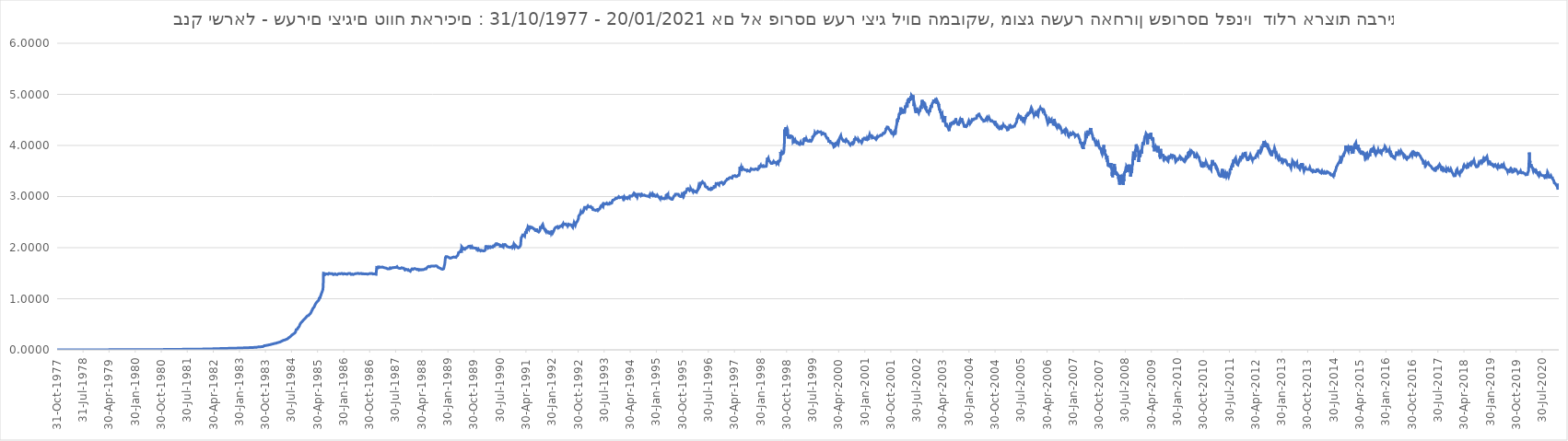
| Category | בנק ישראל - שערים יציגים |
|---|---|
| 1977-10-31 | 0.002 |
| 1977-11-01 | 0.002 |
| 1977-11-02 | 0.002 |
| 1977-11-03 | 0.002 |
| 1977-11-04 | 0.002 |
| 1977-11-07 | 0.002 |
| 1977-11-08 | 0.002 |
| 1977-11-09 | 0.002 |
| 1977-11-10 | 0.002 |
| 1977-11-11 | 0.002 |
| 1977-11-14 | 0.002 |
| 1977-11-15 | 0.002 |
| 1977-11-16 | 0.002 |
| 1977-11-17 | 0.002 |
| 1977-11-18 | 0.002 |
| 1977-11-21 | 0.002 |
| 1977-11-22 | 0.002 |
| 1977-11-23 | 0.002 |
| 1977-11-24 | 0.002 |
| 1977-11-25 | 0.002 |
| 1977-11-28 | 0.002 |
| 1977-11-29 | 0.002 |
| 1977-11-30 | 0.002 |
| 1977-12-01 | 0.002 |
| 1977-12-02 | 0.002 |
| 1977-12-05 | 0.002 |
| 1977-12-06 | 0.002 |
| 1977-12-07 | 0.002 |
| 1977-12-08 | 0.002 |
| 1977-12-09 | 0.002 |
| 1977-12-12 | 0.002 |
| 1977-12-13 | 0.002 |
| 1977-12-14 | 0.002 |
| 1977-12-15 | 0.002 |
| 1977-12-16 | 0.002 |
| 1977-12-19 | 0.002 |
| 1977-12-20 | 0.002 |
| 1977-12-21 | 0.002 |
| 1977-12-22 | 0.002 |
| 1977-12-23 | 0.002 |
| 1977-12-27 | 0.002 |
| 1977-12-28 | 0.002 |
| 1977-12-29 | 0.002 |
| 1977-12-30 | 0.002 |
| 1978-01-03 | 0.002 |
| 1978-01-04 | 0.002 |
| 1978-01-05 | 0.002 |
| 1978-01-06 | 0.002 |
| 1978-01-09 | 0.002 |
| 1978-01-10 | 0.002 |
| 1978-01-11 | 0.002 |
| 1978-01-12 | 0.002 |
| 1978-01-13 | 0.002 |
| 1978-01-16 | 0.002 |
| 1978-01-17 | 0.002 |
| 1978-01-18 | 0.002 |
| 1978-01-19 | 0.002 |
| 1978-01-20 | 0.002 |
| 1978-01-23 | 0.002 |
| 1978-01-24 | 0.002 |
| 1978-01-25 | 0.002 |
| 1978-01-26 | 0.002 |
| 1978-01-27 | 0.002 |
| 1978-01-30 | 0.002 |
| 1978-01-31 | 0.002 |
| 1978-02-01 | 0.002 |
| 1978-02-02 | 0.002 |
| 1978-02-03 | 0.002 |
| 1978-02-06 | 0.002 |
| 1978-02-07 | 0.002 |
| 1978-02-08 | 0.002 |
| 1978-02-09 | 0.002 |
| 1978-02-10 | 0.002 |
| 1978-02-14 | 0.002 |
| 1978-02-15 | 0.002 |
| 1978-02-16 | 0.002 |
| 1978-02-17 | 0.002 |
| 1978-02-20 | 0.002 |
| 1978-02-21 | 0.002 |
| 1978-02-22 | 0.002 |
| 1978-02-23 | 0.002 |
| 1978-02-24 | 0.002 |
| 1978-02-27 | 0.002 |
| 1978-02-28 | 0.002 |
| 1978-03-01 | 0.002 |
| 1978-03-02 | 0.002 |
| 1978-03-03 | 0.002 |
| 1978-03-06 | 0.002 |
| 1978-03-07 | 0.002 |
| 1978-03-09 | 0.002 |
| 1978-03-10 | 0.002 |
| 1978-03-13 | 0.002 |
| 1978-03-14 | 0.002 |
| 1978-03-15 | 0.002 |
| 1978-03-16 | 0.002 |
| 1978-03-17 | 0.002 |
| 1978-03-20 | 0.002 |
| 1978-03-21 | 0.002 |
| 1978-03-22 | 0.002 |
| 1978-03-23 | 0.002 |
| 1978-03-27 | 0.002 |
| 1978-03-28 | 0.002 |
| 1978-03-29 | 0.002 |
| 1978-03-30 | 0.002 |
| 1978-03-31 | 0.002 |
| 1978-04-03 | 0.002 |
| 1978-04-04 | 0.002 |
| 1978-04-05 | 0.002 |
| 1978-04-06 | 0.002 |
| 1978-04-07 | 0.002 |
| 1978-04-10 | 0.002 |
| 1978-04-11 | 0.002 |
| 1978-04-12 | 0.002 |
| 1978-04-13 | 0.002 |
| 1978-04-14 | 0.002 |
| 1978-04-17 | 0.002 |
| 1978-04-18 | 0.002 |
| 1978-04-19 | 0.002 |
| 1978-04-20 | 0.002 |
| 1978-04-21 | 0.002 |
| 1978-04-24 | 0.002 |
| 1978-04-25 | 0.002 |
| 1978-04-26 | 0.002 |
| 1978-04-27 | 0.002 |
| 1978-05-01 | 0.002 |
| 1978-05-02 | 0.002 |
| 1978-05-03 | 0.002 |
| 1978-05-04 | 0.002 |
| 1978-05-05 | 0.002 |
| 1978-05-08 | 0.002 |
| 1978-05-09 | 0.002 |
| 1978-05-10 | 0.002 |
| 1978-05-12 | 0.002 |
| 1978-05-15 | 0.002 |
| 1978-05-16 | 0.002 |
| 1978-05-17 | 0.002 |
| 1978-05-18 | 0.002 |
| 1978-05-19 | 0.002 |
| 1978-05-22 | 0.002 |
| 1978-05-23 | 0.002 |
| 1978-05-24 | 0.002 |
| 1978-05-25 | 0.002 |
| 1978-05-26 | 0.002 |
| 1978-05-29 | 0.002 |
| 1978-05-30 | 0.002 |
| 1978-05-31 | 0.002 |
| 1978-06-01 | 0.002 |
| 1978-06-02 | 0.002 |
| 1978-06-05 | 0.002 |
| 1978-06-06 | 0.002 |
| 1978-06-07 | 0.002 |
| 1978-06-08 | 0.002 |
| 1978-06-09 | 0.002 |
| 1978-06-12 | 0.002 |
| 1978-06-13 | 0.002 |
| 1978-06-14 | 0.002 |
| 1978-06-15 | 0.002 |
| 1978-06-16 | 0.002 |
| 1978-06-19 | 0.002 |
| 1978-06-20 | 0.002 |
| 1978-06-21 | 0.002 |
| 1978-06-22 | 0.002 |
| 1978-06-23 | 0.002 |
| 1978-06-26 | 0.002 |
| 1978-06-27 | 0.002 |
| 1978-06-28 | 0.002 |
| 1978-06-29 | 0.002 |
| 1978-06-30 | 0.002 |
| 1978-07-03 | 0.002 |
| 1978-07-04 | 0.002 |
| 1978-07-05 | 0.002 |
| 1978-07-06 | 0.002 |
| 1978-07-07 | 0.002 |
| 1978-07-10 | 0.002 |
| 1978-07-11 | 0.002 |
| 1978-07-12 | 0.002 |
| 1978-07-13 | 0.002 |
| 1978-07-14 | 0.002 |
| 1978-07-17 | 0.002 |
| 1978-07-18 | 0.002 |
| 1978-07-19 | 0.002 |
| 1978-07-20 | 0.002 |
| 1978-07-21 | 0.002 |
| 1978-07-24 | 0.002 |
| 1978-07-25 | 0.002 |
| 1978-07-26 | 0.002 |
| 1978-07-27 | 0.002 |
| 1978-07-28 | 0.002 |
| 1978-07-31 | 0.002 |
| 1978-08-01 | 0.002 |
| 1978-08-02 | 0.002 |
| 1978-08-03 | 0.002 |
| 1978-08-04 | 0.002 |
| 1978-08-07 | 0.002 |
| 1978-08-08 | 0.002 |
| 1978-08-09 | 0.002 |
| 1978-08-10 | 0.002 |
| 1978-08-11 | 0.002 |
| 1978-08-14 | 0.002 |
| 1978-08-15 | 0.002 |
| 1978-08-16 | 0.002 |
| 1978-08-17 | 0.002 |
| 1978-08-18 | 0.002 |
| 1978-08-21 | 0.002 |
| 1978-08-22 | 0.002 |
| 1978-08-23 | 0.002 |
| 1978-08-24 | 0.002 |
| 1978-08-25 | 0.002 |
| 1978-08-28 | 0.002 |
| 1978-08-29 | 0.002 |
| 1978-08-30 | 0.002 |
| 1978-08-31 | 0.002 |
| 1978-09-01 | 0.002 |
| 1978-09-04 | 0.002 |
| 1978-09-05 | 0.002 |
| 1978-09-06 | 0.002 |
| 1978-09-07 | 0.002 |
| 1978-09-08 | 0.002 |
| 1978-09-11 | 0.002 |
| 1978-09-12 | 0.002 |
| 1978-09-13 | 0.002 |
| 1978-09-14 | 0.002 |
| 1978-09-15 | 0.002 |
| 1978-09-18 | 0.002 |
| 1978-09-19 | 0.002 |
| 1978-09-20 | 0.002 |
| 1978-09-21 | 0.002 |
| 1978-09-22 | 0.002 |
| 1978-09-25 | 0.002 |
| 1978-09-26 | 0.002 |
| 1978-09-27 | 0.002 |
| 1978-09-28 | 0.002 |
| 1978-09-29 | 0.002 |
| 1978-10-04 | 0.002 |
| 1978-10-05 | 0.002 |
| 1978-10-06 | 0.002 |
| 1978-10-10 | 0.002 |
| 1978-10-12 | 0.002 |
| 1978-10-13 | 0.002 |
| 1978-10-17 | 0.002 |
| 1978-10-18 | 0.002 |
| 1978-10-19 | 0.002 |
| 1978-10-20 | 0.002 |
| 1978-10-24 | 0.002 |
| 1978-10-25 | 0.002 |
| 1978-10-26 | 0.002 |
| 1978-10-27 | 0.002 |
| 1978-10-30 | 0.002 |
| 1978-10-31 | 0.002 |
| 1978-11-01 | 0.002 |
| 1978-11-02 | 0.002 |
| 1978-11-03 | 0.002 |
| 1978-11-06 | 0.002 |
| 1978-11-08 | 0.002 |
| 1978-11-09 | 0.002 |
| 1978-11-10 | 0.002 |
| 1978-11-13 | 0.002 |
| 1978-11-14 | 0.002 |
| 1978-11-15 | 0.002 |
| 1978-11-16 | 0.002 |
| 1978-11-17 | 0.002 |
| 1978-11-20 | 0.002 |
| 1978-11-21 | 0.002 |
| 1978-11-22 | 0.002 |
| 1978-11-24 | 0.002 |
| 1978-11-27 | 0.002 |
| 1978-11-28 | 0.002 |
| 1978-11-29 | 0.002 |
| 1978-11-30 | 0.002 |
| 1978-12-01 | 0.002 |
| 1978-12-04 | 0.002 |
| 1978-12-05 | 0.002 |
| 1978-12-06 | 0.002 |
| 1978-12-07 | 0.002 |
| 1978-12-08 | 0.002 |
| 1978-12-11 | 0.002 |
| 1978-12-12 | 0.002 |
| 1978-12-13 | 0.002 |
| 1978-12-14 | 0.002 |
| 1978-12-15 | 0.002 |
| 1978-12-18 | 0.002 |
| 1978-12-19 | 0.002 |
| 1978-12-20 | 0.002 |
| 1978-12-21 | 0.002 |
| 1978-12-22 | 0.002 |
| 1978-12-26 | 0.002 |
| 1978-12-27 | 0.002 |
| 1978-12-28 | 0.002 |
| 1978-12-29 | 0.002 |
| 1979-01-02 | 0.002 |
| 1979-01-03 | 0.002 |
| 1979-01-04 | 0.002 |
| 1979-01-05 | 0.002 |
| 1979-01-08 | 0.002 |
| 1979-01-09 | 0.002 |
| 1979-01-10 | 0.002 |
| 1979-01-11 | 0.002 |
| 1979-01-12 | 0.002 |
| 1979-01-15 | 0.002 |
| 1979-01-16 | 0.002 |
| 1979-01-17 | 0.002 |
| 1979-01-18 | 0.002 |
| 1979-01-19 | 0.002 |
| 1979-01-22 | 0.002 |
| 1979-01-23 | 0.002 |
| 1979-01-24 | 0.002 |
| 1979-01-25 | 0.002 |
| 1979-01-26 | 0.002 |
| 1979-01-29 | 0.002 |
| 1979-01-30 | 0.002 |
| 1979-01-31 | 0.002 |
| 1979-02-01 | 0.002 |
| 1979-02-02 | 0.002 |
| 1979-02-05 | 0.002 |
| 1979-02-06 | 0.002 |
| 1979-02-07 | 0.002 |
| 1979-02-08 | 0.002 |
| 1979-02-09 | 0.002 |
| 1979-02-12 | 0.002 |
| 1979-02-13 | 0.002 |
| 1979-02-14 | 0.002 |
| 1979-02-15 | 0.002 |
| 1979-02-16 | 0.002 |
| 1979-02-19 | 0.002 |
| 1979-02-20 | 0.002 |
| 1979-02-21 | 0.002 |
| 1979-02-22 | 0.002 |
| 1979-02-23 | 0.002 |
| 1979-02-26 | 0.002 |
| 1979-02-27 | 0.002 |
| 1979-02-28 | 0.002 |
| 1979-03-01 | 0.002 |
| 1979-03-02 | 0.002 |
| 1979-03-05 | 0.002 |
| 1979-03-06 | 0.002 |
| 1979-03-07 | 0.002 |
| 1979-03-08 | 0.002 |
| 1979-03-09 | 0.002 |
| 1979-03-12 | 0.002 |
| 1979-03-13 | 0.002 |
| 1979-03-15 | 0.002 |
| 1979-03-16 | 0.002 |
| 1979-03-19 | 0.002 |
| 1979-03-20 | 0.002 |
| 1979-03-21 | 0.002 |
| 1979-03-22 | 0.002 |
| 1979-03-23 | 0.002 |
| 1979-03-26 | 0.002 |
| 1979-03-27 | 0.002 |
| 1979-03-28 | 0.002 |
| 1979-03-29 | 0.002 |
| 1979-03-30 | 0.002 |
| 1979-04-02 | 0.002 |
| 1979-04-03 | 0.002 |
| 1979-04-04 | 0.002 |
| 1979-04-05 | 0.002 |
| 1979-04-06 | 0.002 |
| 1979-04-09 | 0.002 |
| 1979-04-10 | 0.002 |
| 1979-04-11 | 0.002 |
| 1979-04-13 | 0.002 |
| 1979-04-16 | 0.002 |
| 1979-04-17 | 0.002 |
| 1979-04-19 | 0.002 |
| 1979-04-20 | 0.002 |
| 1979-04-23 | 0.002 |
| 1979-04-24 | 0.002 |
| 1979-04-25 | 0.002 |
| 1979-04-26 | 0.002 |
| 1979-04-27 | 0.002 |
| 1979-04-30 | 0.002 |
| 1979-05-01 | 0.002 |
| 1979-05-03 | 0.002 |
| 1979-05-04 | 0.002 |
| 1979-05-07 | 0.002 |
| 1979-05-08 | 0.002 |
| 1979-05-09 | 0.002 |
| 1979-05-10 | 0.002 |
| 1979-05-11 | 0.002 |
| 1979-05-14 | 0.002 |
| 1979-05-15 | 0.002 |
| 1979-05-16 | 0.002 |
| 1979-05-17 | 0.002 |
| 1979-05-18 | 0.002 |
| 1979-05-21 | 0.002 |
| 1979-05-22 | 0.002 |
| 1979-05-23 | 0.002 |
| 1979-05-24 | 0.002 |
| 1979-05-25 | 0.002 |
| 1979-05-28 | 0.002 |
| 1979-05-29 | 0.002 |
| 1979-05-30 | 0.002 |
| 1979-05-31 | 0.002 |
| 1979-06-04 | 0.002 |
| 1979-06-05 | 0.002 |
| 1979-06-06 | 0.002 |
| 1979-06-07 | 0.002 |
| 1979-06-08 | 0.002 |
| 1979-06-11 | 0.002 |
| 1979-06-12 | 0.002 |
| 1979-06-13 | 0.002 |
| 1979-06-14 | 0.002 |
| 1979-06-15 | 0.002 |
| 1979-06-18 | 0.002 |
| 1979-06-19 | 0.002 |
| 1979-06-20 | 0.002 |
| 1979-06-21 | 0.002 |
| 1979-06-22 | 0.002 |
| 1979-06-25 | 0.002 |
| 1979-06-26 | 0.002 |
| 1979-06-27 | 0.002 |
| 1979-06-28 | 0.002 |
| 1979-06-29 | 0.002 |
| 1979-07-02 | 0.002 |
| 1979-07-03 | 0.002 |
| 1979-07-04 | 0.002 |
| 1979-07-05 | 0.002 |
| 1979-07-06 | 0.002 |
| 1979-07-09 | 0.002 |
| 1979-07-10 | 0.002 |
| 1979-07-11 | 0.003 |
| 1979-07-12 | 0.003 |
| 1979-07-13 | 0.003 |
| 1979-07-16 | 0.003 |
| 1979-07-17 | 0.003 |
| 1979-07-18 | 0.003 |
| 1979-07-19 | 0.003 |
| 1979-07-20 | 0.003 |
| 1979-07-23 | 0.003 |
| 1979-07-24 | 0.003 |
| 1979-07-25 | 0.003 |
| 1979-07-26 | 0.003 |
| 1979-07-27 | 0.003 |
| 1979-07-30 | 0.003 |
| 1979-07-31 | 0.003 |
| 1979-08-01 | 0.003 |
| 1979-08-03 | 0.003 |
| 1979-08-06 | 0.003 |
| 1979-08-07 | 0.003 |
| 1979-08-08 | 0.003 |
| 1979-08-09 | 0.003 |
| 1979-08-10 | 0.003 |
| 1979-08-13 | 0.003 |
| 1979-08-14 | 0.003 |
| 1979-08-15 | 0.003 |
| 1979-08-16 | 0.003 |
| 1979-08-17 | 0.003 |
| 1979-08-20 | 0.003 |
| 1979-08-21 | 0.003 |
| 1979-08-22 | 0.003 |
| 1979-08-23 | 0.003 |
| 1979-08-24 | 0.003 |
| 1979-08-27 | 0.003 |
| 1979-08-28 | 0.003 |
| 1979-08-29 | 0.003 |
| 1979-08-30 | 0.003 |
| 1979-08-31 | 0.003 |
| 1979-09-03 | 0.003 |
| 1979-09-04 | 0.003 |
| 1979-09-05 | 0.003 |
| 1979-09-06 | 0.003 |
| 1979-09-07 | 0.003 |
| 1979-09-10 | 0.003 |
| 1979-09-11 | 0.003 |
| 1979-09-12 | 0.003 |
| 1979-09-13 | 0.003 |
| 1979-09-14 | 0.003 |
| 1979-09-17 | 0.003 |
| 1979-09-18 | 0.003 |
| 1979-09-19 | 0.003 |
| 1979-09-20 | 0.003 |
| 1979-09-21 | 0.003 |
| 1979-09-24 | 0.003 |
| 1979-09-25 | 0.003 |
| 1979-09-26 | 0.003 |
| 1979-09-27 | 0.003 |
| 1979-09-28 | 0.003 |
| 1979-10-02 | 0.003 |
| 1979-10-03 | 0.003 |
| 1979-10-04 | 0.003 |
| 1979-10-05 | 0.003 |
| 1979-10-08 | 0.003 |
| 1979-10-09 | 0.003 |
| 1979-10-10 | 0.003 |
| 1979-10-11 | 0.003 |
| 1979-10-12 | 0.003 |
| 1979-10-15 | 0.003 |
| 1979-10-16 | 0.003 |
| 1979-10-17 | 0.003 |
| 1979-10-18 | 0.003 |
| 1979-10-19 | 0.003 |
| 1979-10-22 | 0.003 |
| 1979-10-23 | 0.003 |
| 1979-10-24 | 0.003 |
| 1979-10-25 | 0.003 |
| 1979-10-26 | 0.003 |
| 1979-10-29 | 0.003 |
| 1979-10-30 | 0.003 |
| 1979-10-31 | 0.003 |
| 1979-11-01 | 0.003 |
| 1979-11-02 | 0.003 |
| 1979-11-05 | 0.003 |
| 1979-11-06 | 0.003 |
| 1979-11-07 | 0.003 |
| 1979-11-08 | 0.003 |
| 1979-11-09 | 0.003 |
| 1979-11-12 | 0.003 |
| 1979-11-13 | 0.003 |
| 1979-11-14 | 0.003 |
| 1979-11-15 | 0.003 |
| 1979-11-16 | 0.003 |
| 1979-11-19 | 0.003 |
| 1979-11-20 | 0.003 |
| 1979-11-21 | 0.003 |
| 1979-11-22 | 0.003 |
| 1979-11-23 | 0.003 |
| 1979-11-26 | 0.003 |
| 1979-11-27 | 0.003 |
| 1979-11-28 | 0.003 |
| 1979-11-29 | 0.003 |
| 1979-11-30 | 0.003 |
| 1979-12-03 | 0.003 |
| 1979-12-04 | 0.003 |
| 1979-12-05 | 0.003 |
| 1979-12-06 | 0.003 |
| 1979-12-07 | 0.003 |
| 1979-12-10 | 0.003 |
| 1979-12-11 | 0.003 |
| 1979-12-12 | 0.003 |
| 1979-12-13 | 0.003 |
| 1979-12-14 | 0.003 |
| 1979-12-17 | 0.003 |
| 1979-12-18 | 0.003 |
| 1979-12-19 | 0.003 |
| 1979-12-20 | 0.003 |
| 1979-12-21 | 0.003 |
| 1979-12-24 | 0.004 |
| 1979-12-26 | 0.004 |
| 1979-12-27 | 0.004 |
| 1979-12-28 | 0.004 |
| 1979-12-31 | 0.004 |
| 1980-01-02 | 0.004 |
| 1980-01-03 | 0.004 |
| 1980-01-04 | 0.004 |
| 1980-01-07 | 0.004 |
| 1980-01-08 | 0.004 |
| 1980-01-09 | 0.004 |
| 1980-01-10 | 0.004 |
| 1980-01-11 | 0.004 |
| 1980-01-14 | 0.004 |
| 1980-01-15 | 0.004 |
| 1980-01-16 | 0.004 |
| 1980-01-17 | 0.004 |
| 1980-01-18 | 0.004 |
| 1980-01-21 | 0.004 |
| 1980-01-22 | 0.004 |
| 1980-01-23 | 0.004 |
| 1980-01-24 | 0.004 |
| 1980-01-25 | 0.004 |
| 1980-01-28 | 0.004 |
| 1980-01-29 | 0.004 |
| 1980-01-30 | 0.004 |
| 1980-01-31 | 0.004 |
| 1980-02-01 | 0.004 |
| 1980-02-04 | 0.004 |
| 1980-02-05 | 0.004 |
| 1980-02-06 | 0.004 |
| 1980-02-07 | 0.004 |
| 1980-02-08 | 0.004 |
| 1980-02-11 | 0.004 |
| 1980-02-12 | 0.004 |
| 1980-02-13 | 0.004 |
| 1980-02-14 | 0.004 |
| 1980-02-15 | 0.004 |
| 1980-02-18 | 0.004 |
| 1980-02-19 | 0.004 |
| 1980-02-20 | 0.004 |
| 1980-02-21 | 0.004 |
| 1980-02-22 | 0.004 |
| 1980-02-25 | 0.004 |
| 1980-02-26 | 0.004 |
| 1980-02-27 | 0.004 |
| 1980-02-28 | 0.004 |
| 1980-02-29 | 0.004 |
| 1980-03-04 | 0.004 |
| 1980-03-05 | 0.004 |
| 1980-03-06 | 0.004 |
| 1980-03-07 | 0.004 |
| 1980-03-10 | 0.004 |
| 1980-03-11 | 0.004 |
| 1980-03-12 | 0.004 |
| 1980-03-13 | 0.004 |
| 1980-03-14 | 0.004 |
| 1980-03-17 | 0.004 |
| 1980-03-18 | 0.004 |
| 1980-03-19 | 0.004 |
| 1980-03-20 | 0.004 |
| 1980-03-21 | 0.004 |
| 1980-03-24 | 0.004 |
| 1980-03-25 | 0.004 |
| 1980-03-26 | 0.004 |
| 1980-03-27 | 0.004 |
| 1980-03-28 | 0.004 |
| 1980-03-31 | 0.004 |
| 1980-04-02 | 0.004 |
| 1980-04-03 | 0.004 |
| 1980-04-04 | 0.004 |
| 1980-04-08 | 0.004 |
| 1980-04-09 | 0.004 |
| 1980-04-10 | 0.004 |
| 1980-04-11 | 0.004 |
| 1980-04-14 | 0.004 |
| 1980-04-15 | 0.004 |
| 1980-04-16 | 0.004 |
| 1980-04-17 | 0.004 |
| 1980-04-18 | 0.004 |
| 1980-04-22 | 0.004 |
| 1980-04-23 | 0.004 |
| 1980-04-24 | 0.004 |
| 1980-04-25 | 0.004 |
| 1980-04-28 | 0.004 |
| 1980-04-29 | 0.004 |
| 1980-04-30 | 0.004 |
| 1980-05-01 | 0.004 |
| 1980-05-02 | 0.004 |
| 1980-05-05 | 0.004 |
| 1980-05-06 | 0.004 |
| 1980-05-07 | 0.004 |
| 1980-05-08 | 0.004 |
| 1980-05-09 | 0.004 |
| 1980-05-12 | 0.004 |
| 1980-05-13 | 0.004 |
| 1980-05-14 | 0.004 |
| 1980-05-15 | 0.004 |
| 1980-05-16 | 0.004 |
| 1980-05-19 | 0.005 |
| 1980-05-20 | 0.004 |
| 1980-05-22 | 0.004 |
| 1980-05-23 | 0.005 |
| 1980-05-26 | 0.005 |
| 1980-05-27 | 0.005 |
| 1980-05-28 | 0.005 |
| 1980-05-29 | 0.005 |
| 1980-05-30 | 0.005 |
| 1980-06-02 | 0.005 |
| 1980-06-03 | 0.005 |
| 1980-06-04 | 0.005 |
| 1980-06-05 | 0.005 |
| 1980-06-06 | 0.005 |
| 1980-06-09 | 0.005 |
| 1980-06-10 | 0.005 |
| 1980-06-11 | 0.005 |
| 1980-06-12 | 0.005 |
| 1980-06-13 | 0.005 |
| 1980-06-16 | 0.005 |
| 1980-06-17 | 0.005 |
| 1980-06-18 | 0.005 |
| 1980-06-19 | 0.005 |
| 1980-06-20 | 0.005 |
| 1980-06-23 | 0.005 |
| 1980-06-24 | 0.005 |
| 1980-06-25 | 0.005 |
| 1980-06-26 | 0.005 |
| 1980-06-27 | 0.005 |
| 1980-06-30 | 0.005 |
| 1980-07-01 | 0.005 |
| 1980-07-02 | 0.005 |
| 1980-07-03 | 0.005 |
| 1980-07-04 | 0.005 |
| 1980-07-07 | 0.005 |
| 1980-07-08 | 0.005 |
| 1980-07-09 | 0.005 |
| 1980-07-10 | 0.005 |
| 1980-07-11 | 0.005 |
| 1980-07-14 | 0.005 |
| 1980-07-15 | 0.005 |
| 1980-07-16 | 0.005 |
| 1980-07-17 | 0.005 |
| 1980-07-18 | 0.005 |
| 1980-07-21 | 0.005 |
| 1980-07-23 | 0.005 |
| 1980-07-24 | 0.005 |
| 1980-07-25 | 0.005 |
| 1980-07-28 | 0.005 |
| 1980-07-29 | 0.005 |
| 1980-07-30 | 0.005 |
| 1980-07-31 | 0.005 |
| 1980-08-01 | 0.005 |
| 1980-08-04 | 0.005 |
| 1980-08-05 | 0.005 |
| 1980-08-06 | 0.005 |
| 1980-08-07 | 0.005 |
| 1980-08-08 | 0.005 |
| 1980-08-11 | 0.005 |
| 1980-08-12 | 0.005 |
| 1980-08-13 | 0.005 |
| 1980-08-14 | 0.005 |
| 1980-08-15 | 0.005 |
| 1980-08-18 | 0.005 |
| 1980-08-19 | 0.005 |
| 1980-08-20 | 0.006 |
| 1980-08-21 | 0.006 |
| 1980-08-22 | 0.006 |
| 1980-08-25 | 0.006 |
| 1980-08-26 | 0.006 |
| 1980-08-27 | 0.006 |
| 1980-08-28 | 0.006 |
| 1980-08-29 | 0.006 |
| 1980-09-01 | 0.006 |
| 1980-09-02 | 0.006 |
| 1980-09-03 | 0.006 |
| 1980-09-04 | 0.006 |
| 1980-09-05 | 0.006 |
| 1980-09-08 | 0.006 |
| 1980-09-09 | 0.006 |
| 1980-09-10 | 0.006 |
| 1980-09-15 | 0.006 |
| 1980-09-16 | 0.006 |
| 1980-09-17 | 0.006 |
| 1980-09-18 | 0.006 |
| 1980-09-19 | 0.006 |
| 1980-09-22 | 0.006 |
| 1980-09-23 | 0.006 |
| 1980-09-24 | 0.006 |
| 1980-09-26 | 0.006 |
| 1980-09-29 | 0.006 |
| 1980-10-03 | 0.006 |
| 1980-10-06 | 0.006 |
| 1980-10-07 | 0.006 |
| 1980-10-08 | 0.006 |
| 1980-10-09 | 0.006 |
| 1980-10-10 | 0.006 |
| 1980-10-13 | 0.006 |
| 1980-10-14 | 0.006 |
| 1980-10-15 | 0.006 |
| 1980-10-16 | 0.006 |
| 1980-10-17 | 0.006 |
| 1980-10-20 | 0.006 |
| 1980-10-21 | 0.006 |
| 1980-10-22 | 0.006 |
| 1980-10-23 | 0.006 |
| 1980-10-24 | 0.006 |
| 1980-10-27 | 0.006 |
| 1980-10-28 | 0.006 |
| 1980-10-29 | 0.006 |
| 1980-10-30 | 0.006 |
| 1980-10-31 | 0.006 |
| 1980-11-03 | 0.006 |
| 1980-11-04 | 0.006 |
| 1980-11-05 | 0.006 |
| 1980-11-06 | 0.006 |
| 1980-11-07 | 0.007 |
| 1980-11-10 | 0.007 |
| 1980-11-11 | 0.007 |
| 1980-11-12 | 0.007 |
| 1980-11-13 | 0.007 |
| 1980-11-14 | 0.007 |
| 1980-11-17 | 0.007 |
| 1980-11-18 | 0.007 |
| 1980-11-19 | 0.007 |
| 1980-11-20 | 0.007 |
| 1980-11-21 | 0.007 |
| 1980-11-24 | 0.007 |
| 1980-11-25 | 0.007 |
| 1980-11-26 | 0.007 |
| 1980-11-27 | 0.007 |
| 1980-11-28 | 0.007 |
| 1980-12-01 | 0.007 |
| 1980-12-02 | 0.007 |
| 1980-12-03 | 0.007 |
| 1980-12-04 | 0.007 |
| 1980-12-05 | 0.007 |
| 1980-12-08 | 0.007 |
| 1980-12-09 | 0.007 |
| 1980-12-10 | 0.007 |
| 1980-12-11 | 0.007 |
| 1980-12-12 | 0.007 |
| 1980-12-15 | 0.007 |
| 1980-12-16 | 0.008 |
| 1980-12-17 | 0.008 |
| 1980-12-18 | 0.008 |
| 1980-12-19 | 0.008 |
| 1980-12-22 | 0.008 |
| 1980-12-23 | 0.008 |
| 1980-12-24 | 0.008 |
| 1980-12-26 | 0.008 |
| 1980-12-29 | 0.008 |
| 1980-12-30 | 0.008 |
| 1980-12-31 | 0.008 |
| 1981-01-02 | 0.008 |
| 1981-01-05 | 0.008 |
| 1981-01-06 | 0.008 |
| 1981-01-07 | 0.008 |
| 1981-01-08 | 0.008 |
| 1981-01-09 | 0.008 |
| 1981-01-12 | 0.008 |
| 1981-01-13 | 0.008 |
| 1981-01-14 | 0.008 |
| 1981-01-15 | 0.008 |
| 1981-01-16 | 0.008 |
| 1981-01-19 | 0.008 |
| 1981-01-20 | 0.008 |
| 1981-01-21 | 0.008 |
| 1981-01-22 | 0.008 |
| 1981-01-23 | 0.008 |
| 1981-01-26 | 0.008 |
| 1981-01-27 | 0.008 |
| 1981-01-28 | 0.008 |
| 1981-01-29 | 0.008 |
| 1981-01-30 | 0.008 |
| 1981-02-02 | 0.008 |
| 1981-02-03 | 0.008 |
| 1981-02-04 | 0.008 |
| 1981-02-05 | 0.008 |
| 1981-02-06 | 0.008 |
| 1981-02-09 | 0.008 |
| 1981-02-10 | 0.008 |
| 1981-02-11 | 0.008 |
| 1981-02-12 | 0.008 |
| 1981-02-13 | 0.008 |
| 1981-02-16 | 0.008 |
| 1981-02-17 | 0.009 |
| 1981-02-18 | 0.009 |
| 1981-02-19 | 0.009 |
| 1981-02-20 | 0.009 |
| 1981-02-23 | 0.009 |
| 1981-02-24 | 0.009 |
| 1981-02-25 | 0.009 |
| 1981-02-26 | 0.009 |
| 1981-02-27 | 0.009 |
| 1981-03-02 | 0.009 |
| 1981-03-03 | 0.009 |
| 1981-03-04 | 0.009 |
| 1981-03-05 | 0.009 |
| 1981-03-06 | 0.009 |
| 1981-03-09 | 0.009 |
| 1981-03-10 | 0.009 |
| 1981-03-11 | 0.009 |
| 1981-03-12 | 0.009 |
| 1981-03-13 | 0.009 |
| 1981-03-16 | 0.009 |
| 1981-03-17 | 0.009 |
| 1981-03-18 | 0.009 |
| 1981-03-19 | 0.009 |
| 1981-03-23 | 0.009 |
| 1981-03-24 | 0.009 |
| 1981-03-25 | 0.009 |
| 1981-03-26 | 0.009 |
| 1981-03-27 | 0.009 |
| 1981-03-30 | 0.009 |
| 1981-03-31 | 0.009 |
| 1981-04-01 | 0.009 |
| 1981-04-02 | 0.009 |
| 1981-04-03 | 0.009 |
| 1981-04-06 | 0.009 |
| 1981-04-07 | 0.009 |
| 1981-04-08 | 0.009 |
| 1981-04-09 | 0.009 |
| 1981-04-10 | 0.009 |
| 1981-04-13 | 0.009 |
| 1981-04-14 | 0.009 |
| 1981-04-15 | 0.009 |
| 1981-04-16 | 0.009 |
| 1981-04-17 | 0.009 |
| 1981-04-20 | 0.009 |
| 1981-04-21 | 0.009 |
| 1981-04-22 | 0.009 |
| 1981-04-23 | 0.009 |
| 1981-04-24 | 0.009 |
| 1981-04-27 | 0.01 |
| 1981-04-28 | 0.009 |
| 1981-04-29 | 0.01 |
| 1981-04-30 | 0.01 |
| 1981-05-01 | 0.01 |
| 1981-05-04 | 0.01 |
| 1981-05-05 | 0.01 |
| 1981-05-06 | 0.01 |
| 1981-05-08 | 0.01 |
| 1981-05-11 | 0.01 |
| 1981-05-12 | 0.01 |
| 1981-05-13 | 0.01 |
| 1981-05-14 | 0.01 |
| 1981-05-15 | 0.01 |
| 1981-05-18 | 0.01 |
| 1981-05-19 | 0.01 |
| 1981-05-20 | 0.01 |
| 1981-05-21 | 0.01 |
| 1981-05-22 | 0.01 |
| 1981-05-25 | 0.011 |
| 1981-05-26 | 0.011 |
| 1981-05-27 | 0.011 |
| 1981-05-28 | 0.011 |
| 1981-05-29 | 0.011 |
| 1981-06-01 | 0.011 |
| 1981-06-02 | 0.011 |
| 1981-06-03 | 0.011 |
| 1981-06-04 | 0.011 |
| 1981-06-05 | 0.011 |
| 1981-06-09 | 0.011 |
| 1981-06-10 | 0.011 |
| 1981-06-11 | 0.011 |
| 1981-06-12 | 0.011 |
| 1981-06-15 | 0.012 |
| 1981-06-16 | 0.012 |
| 1981-06-17 | 0.012 |
| 1981-06-18 | 0.012 |
| 1981-06-19 | 0.012 |
| 1981-06-22 | 0.012 |
| 1981-06-23 | 0.012 |
| 1981-06-24 | 0.012 |
| 1981-06-25 | 0.012 |
| 1981-06-26 | 0.012 |
| 1981-06-29 | 0.012 |
| 1981-07-01 | 0.012 |
| 1981-07-02 | 0.012 |
| 1981-07-03 | 0.012 |
| 1981-07-06 | 0.012 |
| 1981-07-07 | 0.012 |
| 1981-07-08 | 0.012 |
| 1981-07-09 | 0.012 |
| 1981-07-10 | 0.012 |
| 1981-07-13 | 0.012 |
| 1981-07-14 | 0.012 |
| 1981-07-15 | 0.012 |
| 1981-07-16 | 0.012 |
| 1981-07-17 | 0.012 |
| 1981-07-20 | 0.012 |
| 1981-07-21 | 0.012 |
| 1981-07-22 | 0.012 |
| 1981-07-23 | 0.012 |
| 1981-07-24 | 0.012 |
| 1981-07-27 | 0.012 |
| 1981-07-28 | 0.012 |
| 1981-07-29 | 0.012 |
| 1981-07-30 | 0.012 |
| 1981-07-31 | 0.012 |
| 1981-08-03 | 0.012 |
| 1981-08-04 | 0.012 |
| 1981-08-05 | 0.012 |
| 1981-08-06 | 0.012 |
| 1981-08-07 | 0.012 |
| 1981-08-10 | 0.012 |
| 1981-08-11 | 0.012 |
| 1981-08-12 | 0.012 |
| 1981-08-13 | 0.012 |
| 1981-08-14 | 0.012 |
| 1981-08-17 | 0.012 |
| 1981-08-18 | 0.013 |
| 1981-08-19 | 0.013 |
| 1981-08-20 | 0.013 |
| 1981-08-21 | 0.013 |
| 1981-08-24 | 0.012 |
| 1981-08-25 | 0.013 |
| 1981-08-26 | 0.013 |
| 1981-08-27 | 0.013 |
| 1981-08-28 | 0.013 |
| 1981-08-31 | 0.013 |
| 1981-09-01 | 0.013 |
| 1981-09-02 | 0.013 |
| 1981-09-03 | 0.013 |
| 1981-09-04 | 0.013 |
| 1981-09-07 | 0.013 |
| 1981-09-08 | 0.013 |
| 1981-09-09 | 0.013 |
| 1981-09-10 | 0.013 |
| 1981-09-11 | 0.013 |
| 1981-09-14 | 0.013 |
| 1981-09-15 | 0.013 |
| 1981-09-16 | 0.013 |
| 1981-09-17 | 0.013 |
| 1981-09-18 | 0.013 |
| 1981-09-21 | 0.013 |
| 1981-09-22 | 0.013 |
| 1981-09-23 | 0.013 |
| 1981-09-24 | 0.013 |
| 1981-09-25 | 0.013 |
| 1981-09-28 | 0.013 |
| 1981-10-01 | 0.014 |
| 1981-10-02 | 0.014 |
| 1981-10-05 | 0.014 |
| 1981-10-06 | 0.014 |
| 1981-10-07 | 0.014 |
| 1981-10-09 | 0.014 |
| 1981-10-12 | 0.014 |
| 1981-10-14 | 0.014 |
| 1981-10-15 | 0.014 |
| 1981-10-16 | 0.014 |
| 1981-10-19 | 0.014 |
| 1981-10-21 | 0.014 |
| 1981-10-22 | 0.014 |
| 1981-10-23 | 0.014 |
| 1981-10-26 | 0.014 |
| 1981-10-28 | 0.014 |
| 1981-10-29 | 0.014 |
| 1981-10-30 | 0.014 |
| 1981-11-02 | 0.014 |
| 1981-11-03 | 0.014 |
| 1981-11-04 | 0.014 |
| 1981-11-05 | 0.014 |
| 1981-11-06 | 0.014 |
| 1981-11-09 | 0.014 |
| 1981-11-10 | 0.014 |
| 1981-11-11 | 0.014 |
| 1981-11-12 | 0.014 |
| 1981-11-13 | 0.014 |
| 1981-11-16 | 0.014 |
| 1981-11-17 | 0.014 |
| 1981-11-18 | 0.015 |
| 1981-11-19 | 0.015 |
| 1981-11-20 | 0.015 |
| 1981-11-23 | 0.015 |
| 1981-11-24 | 0.015 |
| 1981-11-25 | 0.015 |
| 1981-11-26 | 0.015 |
| 1981-11-27 | 0.015 |
| 1981-11-30 | 0.015 |
| 1981-12-01 | 0.015 |
| 1981-12-02 | 0.015 |
| 1981-12-03 | 0.015 |
| 1981-12-04 | 0.015 |
| 1981-12-07 | 0.015 |
| 1981-12-08 | 0.015 |
| 1981-12-09 | 0.015 |
| 1981-12-10 | 0.015 |
| 1981-12-11 | 0.015 |
| 1981-12-14 | 0.015 |
| 1981-12-15 | 0.015 |
| 1981-12-16 | 0.015 |
| 1981-12-17 | 0.015 |
| 1981-12-18 | 0.015 |
| 1981-12-21 | 0.016 |
| 1981-12-22 | 0.016 |
| 1981-12-23 | 0.016 |
| 1981-12-24 | 0.016 |
| 1981-12-28 | 0.016 |
| 1981-12-29 | 0.016 |
| 1981-12-30 | 0.016 |
| 1981-12-31 | 0.016 |
| 1982-01-04 | 0.016 |
| 1982-01-05 | 0.016 |
| 1982-01-06 | 0.016 |
| 1982-01-07 | 0.016 |
| 1982-01-08 | 0.016 |
| 1982-01-11 | 0.016 |
| 1982-01-12 | 0.016 |
| 1982-01-13 | 0.016 |
| 1982-01-14 | 0.016 |
| 1982-01-15 | 0.016 |
| 1982-01-18 | 0.016 |
| 1982-01-19 | 0.016 |
| 1982-01-20 | 0.016 |
| 1982-01-21 | 0.016 |
| 1982-01-22 | 0.016 |
| 1982-01-25 | 0.016 |
| 1982-01-26 | 0.017 |
| 1982-01-27 | 0.017 |
| 1982-01-28 | 0.017 |
| 1982-01-29 | 0.017 |
| 1982-02-01 | 0.017 |
| 1982-02-02 | 0.017 |
| 1982-02-03 | 0.017 |
| 1982-02-04 | 0.017 |
| 1982-02-05 | 0.017 |
| 1982-02-08 | 0.017 |
| 1982-02-09 | 0.017 |
| 1982-02-10 | 0.017 |
| 1982-02-11 | 0.017 |
| 1982-02-12 | 0.017 |
| 1982-02-15 | 0.018 |
| 1982-02-16 | 0.018 |
| 1982-02-17 | 0.018 |
| 1982-02-18 | 0.018 |
| 1982-02-19 | 0.018 |
| 1982-02-22 | 0.018 |
| 1982-02-23 | 0.018 |
| 1982-02-24 | 0.018 |
| 1982-02-25 | 0.018 |
| 1982-02-26 | 0.018 |
| 1982-03-01 | 0.018 |
| 1982-03-02 | 0.018 |
| 1982-03-03 | 0.018 |
| 1982-03-04 | 0.018 |
| 1982-03-05 | 0.018 |
| 1982-03-08 | 0.018 |
| 1982-03-11 | 0.018 |
| 1982-03-12 | 0.019 |
| 1982-03-15 | 0.019 |
| 1982-03-16 | 0.019 |
| 1982-03-17 | 0.019 |
| 1982-03-18 | 0.019 |
| 1982-03-19 | 0.019 |
| 1982-03-22 | 0.019 |
| 1982-03-23 | 0.019 |
| 1982-03-24 | 0.019 |
| 1982-03-25 | 0.019 |
| 1982-03-26 | 0.019 |
| 1982-03-29 | 0.019 |
| 1982-03-30 | 0.019 |
| 1982-03-31 | 0.019 |
| 1982-04-01 | 0.019 |
| 1982-04-02 | 0.019 |
| 1982-04-05 | 0.019 |
| 1982-04-06 | 0.02 |
| 1982-04-07 | 0.02 |
| 1982-04-09 | 0.02 |
| 1982-04-12 | 0.02 |
| 1982-04-13 | 0.02 |
| 1982-04-15 | 0.02 |
| 1982-04-16 | 0.02 |
| 1982-04-19 | 0.02 |
| 1982-04-20 | 0.02 |
| 1982-04-21 | 0.02 |
| 1982-04-22 | 0.02 |
| 1982-04-23 | 0.02 |
| 1982-04-26 | 0.02 |
| 1982-04-27 | 0.02 |
| 1982-04-29 | 0.02 |
| 1982-04-30 | 0.02 |
| 1982-05-03 | 0.02 |
| 1982-05-04 | 0.021 |
| 1982-05-05 | 0.021 |
| 1982-05-06 | 0.021 |
| 1982-05-07 | 0.021 |
| 1982-05-10 | 0.021 |
| 1982-05-11 | 0.021 |
| 1982-05-12 | 0.021 |
| 1982-05-13 | 0.021 |
| 1982-05-14 | 0.021 |
| 1982-05-17 | 0.021 |
| 1982-05-18 | 0.021 |
| 1982-05-19 | 0.021 |
| 1982-05-20 | 0.022 |
| 1982-05-21 | 0.022 |
| 1982-05-24 | 0.022 |
| 1982-05-25 | 0.022 |
| 1982-05-26 | 0.022 |
| 1982-05-27 | 0.022 |
| 1982-05-31 | 0.022 |
| 1982-06-01 | 0.022 |
| 1982-06-02 | 0.022 |
| 1982-06-03 | 0.022 |
| 1982-06-04 | 0.022 |
| 1982-06-07 | 0.022 |
| 1982-06-08 | 0.022 |
| 1982-06-09 | 0.022 |
| 1982-06-10 | 0.022 |
| 1982-06-11 | 0.022 |
| 1982-06-14 | 0.023 |
| 1982-06-15 | 0.023 |
| 1982-06-16 | 0.023 |
| 1982-06-17 | 0.023 |
| 1982-06-18 | 0.024 |
| 1982-06-21 | 0.024 |
| 1982-06-22 | 0.024 |
| 1982-06-23 | 0.024 |
| 1982-06-24 | 0.024 |
| 1982-06-25 | 0.024 |
| 1982-06-28 | 0.024 |
| 1982-06-29 | 0.024 |
| 1982-06-30 | 0.024 |
| 1982-07-01 | 0.024 |
| 1982-07-02 | 0.024 |
| 1982-07-05 | 0.024 |
| 1982-07-06 | 0.025 |
| 1982-07-07 | 0.025 |
| 1982-07-08 | 0.025 |
| 1982-07-09 | 0.025 |
| 1982-07-12 | 0.025 |
| 1982-07-13 | 0.025 |
| 1982-07-14 | 0.025 |
| 1982-07-15 | 0.025 |
| 1982-07-16 | 0.025 |
| 1982-07-19 | 0.026 |
| 1982-07-20 | 0.025 |
| 1982-07-21 | 0.025 |
| 1982-07-22 | 0.025 |
| 1982-07-23 | 0.025 |
| 1982-07-26 | 0.025 |
| 1982-07-27 | 0.026 |
| 1982-07-28 | 0.026 |
| 1982-07-30 | 0.026 |
| 1982-08-02 | 0.026 |
| 1982-08-03 | 0.026 |
| 1982-08-04 | 0.026 |
| 1982-08-05 | 0.027 |
| 1982-08-06 | 0.027 |
| 1982-08-09 | 0.027 |
| 1982-08-10 | 0.027 |
| 1982-08-11 | 0.027 |
| 1982-08-12 | 0.027 |
| 1982-08-13 | 0.027 |
| 1982-08-16 | 0.027 |
| 1982-08-17 | 0.027 |
| 1982-08-18 | 0.027 |
| 1982-08-19 | 0.027 |
| 1982-08-20 | 0.027 |
| 1982-08-23 | 0.027 |
| 1982-08-24 | 0.027 |
| 1982-08-25 | 0.027 |
| 1982-08-26 | 0.027 |
| 1982-08-27 | 0.027 |
| 1982-08-30 | 0.027 |
| 1982-08-31 | 0.027 |
| 1982-09-01 | 0.028 |
| 1982-09-02 | 0.028 |
| 1982-09-03 | 0.028 |
| 1982-09-06 | 0.028 |
| 1982-09-07 | 0.029 |
| 1982-09-08 | 0.029 |
| 1982-09-09 | 0.029 |
| 1982-09-10 | 0.029 |
| 1982-09-13 | 0.029 |
| 1982-09-14 | 0.029 |
| 1982-09-15 | 0.029 |
| 1982-09-16 | 0.029 |
| 1982-09-17 | 0.029 |
| 1982-09-20 | 0.029 |
| 1982-09-21 | 0.029 |
| 1982-09-22 | 0.029 |
| 1982-09-23 | 0.029 |
| 1982-09-24 | 0.029 |
| 1982-09-28 | 0.029 |
| 1982-09-29 | 0.029 |
| 1982-09-30 | 0.029 |
| 1982-10-01 | 0.029 |
| 1982-10-04 | 0.029 |
| 1982-10-05 | 0.029 |
| 1982-10-06 | 0.029 |
| 1982-10-07 | 0.029 |
| 1982-10-08 | 0.029 |
| 1982-10-11 | 0.029 |
| 1982-10-12 | 0.03 |
| 1982-10-13 | 0.03 |
| 1982-10-14 | 0.03 |
| 1982-10-15 | 0.03 |
| 1982-10-18 | 0.03 |
| 1982-10-19 | 0.03 |
| 1982-10-20 | 0.03 |
| 1982-10-21 | 0.03 |
| 1982-10-22 | 0.03 |
| 1982-10-25 | 0.03 |
| 1982-10-26 | 0.03 |
| 1982-10-27 | 0.03 |
| 1982-10-28 | 0.03 |
| 1982-10-29 | 0.03 |
| 1982-11-01 | 0.031 |
| 1982-11-02 | 0.031 |
| 1982-11-03 | 0.031 |
| 1982-11-04 | 0.031 |
| 1982-11-05 | 0.031 |
| 1982-11-08 | 0.031 |
| 1982-11-09 | 0.031 |
| 1982-11-10 | 0.031 |
| 1982-11-11 | 0.031 |
| 1982-11-12 | 0.031 |
| 1982-11-15 | 0.031 |
| 1982-11-16 | 0.031 |
| 1982-11-17 | 0.031 |
| 1982-11-18 | 0.031 |
| 1982-11-19 | 0.031 |
| 1982-11-22 | 0.031 |
| 1982-11-23 | 0.032 |
| 1982-11-24 | 0.032 |
| 1982-11-25 | 0.032 |
| 1982-11-26 | 0.032 |
| 1982-11-29 | 0.032 |
| 1982-11-30 | 0.032 |
| 1982-12-01 | 0.032 |
| 1982-12-02 | 0.032 |
| 1982-12-03 | 0.032 |
| 1982-12-06 | 0.032 |
| 1982-12-07 | 0.032 |
| 1982-12-08 | 0.032 |
| 1982-12-09 | 0.032 |
| 1982-12-10 | 0.033 |
| 1982-12-13 | 0.033 |
| 1982-12-14 | 0.033 |
| 1982-12-15 | 0.033 |
| 1982-12-16 | 0.033 |
| 1982-12-17 | 0.033 |
| 1982-12-20 | 0.033 |
| 1982-12-21 | 0.033 |
| 1982-12-22 | 0.033 |
| 1982-12-23 | 0.033 |
| 1982-12-24 | 0.033 |
| 1982-12-27 | 0.033 |
| 1982-12-28 | 0.033 |
| 1982-12-29 | 0.033 |
| 1982-12-30 | 0.033 |
| 1982-12-31 | 0.034 |
| 1983-01-03 | 0.034 |
| 1983-01-04 | 0.034 |
| 1983-01-05 | 0.034 |
| 1983-01-06 | 0.034 |
| 1983-01-07 | 0.034 |
| 1983-01-10 | 0.034 |
| 1983-01-11 | 0.034 |
| 1983-01-12 | 0.034 |
| 1983-01-13 | 0.034 |
| 1983-01-14 | 0.035 |
| 1983-01-17 | 0.035 |
| 1983-01-18 | 0.035 |
| 1983-01-19 | 0.035 |
| 1983-01-20 | 0.035 |
| 1983-01-21 | 0.035 |
| 1983-01-24 | 0.035 |
| 1983-01-25 | 0.035 |
| 1983-01-26 | 0.035 |
| 1983-01-27 | 0.036 |
| 1983-01-28 | 0.036 |
| 1983-01-31 | 0.036 |
| 1983-02-01 | 0.036 |
| 1983-02-02 | 0.036 |
| 1983-02-03 | 0.036 |
| 1983-02-04 | 0.036 |
| 1983-02-07 | 0.036 |
| 1983-02-08 | 0.036 |
| 1983-02-09 | 0.037 |
| 1983-02-10 | 0.037 |
| 1983-02-11 | 0.037 |
| 1983-02-14 | 0.037 |
| 1983-02-15 | 0.037 |
| 1983-02-16 | 0.037 |
| 1983-02-17 | 0.037 |
| 1983-02-18 | 0.037 |
| 1983-02-21 | 0.037 |
| 1983-02-22 | 0.037 |
| 1983-02-23 | 0.037 |
| 1983-02-24 | 0.038 |
| 1983-02-25 | 0.038 |
| 1983-03-01 | 0.038 |
| 1983-03-02 | 0.038 |
| 1983-03-03 | 0.038 |
| 1983-03-04 | 0.038 |
| 1983-03-07 | 0.038 |
| 1983-03-08 | 0.038 |
| 1983-03-09 | 0.038 |
| 1983-03-10 | 0.038 |
| 1983-03-11 | 0.038 |
| 1983-03-14 | 0.038 |
| 1983-03-15 | 0.038 |
| 1983-03-16 | 0.039 |
| 1983-03-17 | 0.039 |
| 1983-03-18 | 0.039 |
| 1983-03-21 | 0.039 |
| 1983-03-22 | 0.039 |
| 1983-03-23 | 0.039 |
| 1983-03-24 | 0.039 |
| 1983-03-25 | 0.04 |
| 1983-03-28 | 0.04 |
| 1983-03-30 | 0.04 |
| 1983-03-31 | 0.04 |
| 1983-04-01 | 0.04 |
| 1983-04-05 | 0.04 |
| 1983-04-06 | 0.04 |
| 1983-04-07 | 0.04 |
| 1983-04-08 | 0.04 |
| 1983-04-11 | 0.04 |
| 1983-04-12 | 0.041 |
| 1983-04-13 | 0.041 |
| 1983-04-14 | 0.041 |
| 1983-04-15 | 0.041 |
| 1983-04-19 | 0.041 |
| 1983-04-20 | 0.041 |
| 1983-04-21 | 0.041 |
| 1983-04-22 | 0.041 |
| 1983-04-25 | 0.041 |
| 1983-04-26 | 0.042 |
| 1983-04-27 | 0.042 |
| 1983-04-28 | 0.042 |
| 1983-04-29 | 0.042 |
| 1983-05-02 | 0.042 |
| 1983-05-03 | 0.042 |
| 1983-05-04 | 0.042 |
| 1983-05-05 | 0.042 |
| 1983-05-06 | 0.042 |
| 1983-05-09 | 0.043 |
| 1983-05-10 | 0.043 |
| 1983-05-11 | 0.043 |
| 1983-05-12 | 0.043 |
| 1983-05-13 | 0.043 |
| 1983-05-16 | 0.043 |
| 1983-05-17 | 0.044 |
| 1983-05-19 | 0.044 |
| 1983-05-20 | 0.044 |
| 1983-05-23 | 0.044 |
| 1983-05-24 | 0.044 |
| 1983-05-25 | 0.044 |
| 1983-05-26 | 0.044 |
| 1983-05-27 | 0.044 |
| 1983-05-30 | 0.045 |
| 1983-05-31 | 0.045 |
| 1983-06-01 | 0.045 |
| 1983-06-02 | 0.045 |
| 1983-06-03 | 0.045 |
| 1983-06-06 | 0.045 |
| 1983-06-07 | 0.045 |
| 1983-06-08 | 0.045 |
| 1983-06-09 | 0.045 |
| 1983-06-10 | 0.045 |
| 1983-06-13 | 0.046 |
| 1983-06-14 | 0.046 |
| 1983-06-15 | 0.046 |
| 1983-06-16 | 0.046 |
| 1983-06-17 | 0.046 |
| 1983-06-20 | 0.046 |
| 1983-06-21 | 0.046 |
| 1983-06-22 | 0.047 |
| 1983-06-23 | 0.047 |
| 1983-06-24 | 0.047 |
| 1983-06-27 | 0.047 |
| 1983-06-28 | 0.047 |
| 1983-06-29 | 0.047 |
| 1983-06-30 | 0.048 |
| 1983-07-01 | 0.048 |
| 1983-07-04 | 0.048 |
| 1983-07-05 | 0.048 |
| 1983-07-06 | 0.048 |
| 1983-07-07 | 0.048 |
| 1983-07-08 | 0.048 |
| 1983-07-11 | 0.049 |
| 1983-07-12 | 0.049 |
| 1983-07-13 | 0.049 |
| 1983-07-14 | 0.05 |
| 1983-07-15 | 0.05 |
| 1983-07-18 | 0.05 |
| 1983-07-20 | 0.05 |
| 1983-07-21 | 0.05 |
| 1983-07-22 | 0.05 |
| 1983-07-25 | 0.05 |
| 1983-07-26 | 0.05 |
| 1983-07-27 | 0.051 |
| 1983-07-28 | 0.051 |
| 1983-07-29 | 0.051 |
| 1983-08-01 | 0.051 |
| 1983-08-02 | 0.052 |
| 1983-08-03 | 0.052 |
| 1983-08-04 | 0.052 |
| 1983-08-05 | 0.052 |
| 1983-08-08 | 0.053 |
| 1983-08-09 | 0.053 |
| 1983-08-10 | 0.057 |
| 1983-08-11 | 0.057 |
| 1983-08-12 | 0.057 |
| 1983-08-15 | 0.057 |
| 1983-08-16 | 0.058 |
| 1983-08-17 | 0.057 |
| 1983-08-18 | 0.058 |
| 1983-08-19 | 0.058 |
| 1983-08-22 | 0.058 |
| 1983-08-23 | 0.058 |
| 1983-08-24 | 0.058 |
| 1983-08-25 | 0.058 |
| 1983-08-26 | 0.058 |
| 1983-08-29 | 0.058 |
| 1983-08-30 | 0.059 |
| 1983-08-31 | 0.059 |
| 1983-09-01 | 0.059 |
| 1983-09-02 | 0.059 |
| 1983-09-05 | 0.059 |
| 1983-09-06 | 0.06 |
| 1983-09-07 | 0.06 |
| 1983-09-12 | 0.06 |
| 1983-09-13 | 0.061 |
| 1983-09-14 | 0.061 |
| 1983-09-15 | 0.061 |
| 1983-09-16 | 0.061 |
| 1983-09-19 | 0.062 |
| 1983-09-20 | 0.062 |
| 1983-09-21 | 0.062 |
| 1983-09-23 | 0.062 |
| 1983-09-26 | 0.063 |
| 1983-09-27 | 0.063 |
| 1983-09-28 | 0.064 |
| 1983-09-30 | 0.064 |
| 1983-10-03 | 0.064 |
| 1983-10-04 | 0.065 |
| 1983-10-05 | 0.065 |
| 1983-10-06 | 0.065 |
| 1983-10-07 | 0.066 |
| 1983-10-10 | 0.069 |
| 1983-10-11 | 0.081 |
| 1983-10-12 | 0.081 |
| 1983-10-13 | 0.081 |
| 1983-10-14 | 0.081 |
| 1983-10-17 | 0.082 |
| 1983-10-18 | 0.082 |
| 1983-10-19 | 0.082 |
| 1983-10-20 | 0.082 |
| 1983-10-21 | 0.082 |
| 1983-10-24 | 0.082 |
| 1983-10-26 | 0.082 |
| 1983-10-27 | 0.083 |
| 1983-10-28 | 0.083 |
| 1983-10-31 | 0.084 |
| 1983-11-01 | 0.084 |
| 1983-11-02 | 0.085 |
| 1983-11-03 | 0.086 |
| 1983-11-04 | 0.086 |
| 1983-11-07 | 0.087 |
| 1983-11-08 | 0.087 |
| 1983-11-09 | 0.087 |
| 1983-11-10 | 0.088 |
| 1983-11-11 | 0.088 |
| 1983-11-14 | 0.088 |
| 1983-11-15 | 0.089 |
| 1983-11-16 | 0.09 |
| 1983-11-17 | 0.09 |
| 1983-11-18 | 0.091 |
| 1983-11-21 | 0.091 |
| 1983-11-22 | 0.091 |
| 1983-11-23 | 0.092 |
| 1983-11-24 | 0.092 |
| 1983-11-25 | 0.093 |
| 1983-11-28 | 0.094 |
| 1983-11-29 | 0.095 |
| 1983-11-30 | 0.096 |
| 1983-12-01 | 0.096 |
| 1983-12-02 | 0.097 |
| 1983-12-05 | 0.097 |
| 1983-12-06 | 0.098 |
| 1983-12-07 | 0.098 |
| 1983-12-08 | 0.098 |
| 1983-12-09 | 0.098 |
| 1983-12-12 | 0.1 |
| 1983-12-13 | 0.1 |
| 1983-12-14 | 0.1 |
| 1983-12-15 | 0.1 |
| 1983-12-16 | 0.101 |
| 1983-12-19 | 0.102 |
| 1983-12-20 | 0.102 |
| 1983-12-21 | 0.103 |
| 1983-12-22 | 0.104 |
| 1983-12-23 | 0.105 |
| 1983-12-27 | 0.106 |
| 1983-12-28 | 0.107 |
| 1983-12-29 | 0.108 |
| 1983-12-30 | 0.108 |
| 1984-01-02 | 0.109 |
| 1984-01-03 | 0.11 |
| 1984-01-04 | 0.111 |
| 1984-01-05 | 0.111 |
| 1984-01-06 | 0.112 |
| 1984-01-09 | 0.112 |
| 1984-01-10 | 0.113 |
| 1984-01-11 | 0.114 |
| 1984-01-12 | 0.114 |
| 1984-01-13 | 0.114 |
| 1984-01-16 | 0.116 |
| 1984-01-17 | 0.116 |
| 1984-01-18 | 0.117 |
| 1984-01-19 | 0.117 |
| 1984-01-20 | 0.118 |
| 1984-01-23 | 0.119 |
| 1984-01-24 | 0.12 |
| 1984-01-25 | 0.121 |
| 1984-01-26 | 0.122 |
| 1984-01-27 | 0.123 |
| 1984-01-30 | 0.124 |
| 1984-01-31 | 0.124 |
| 1984-02-01 | 0.124 |
| 1984-02-02 | 0.124 |
| 1984-02-03 | 0.124 |
| 1984-02-06 | 0.125 |
| 1984-02-07 | 0.126 |
| 1984-02-08 | 0.127 |
| 1984-02-09 | 0.127 |
| 1984-02-10 | 0.128 |
| 1984-02-13 | 0.129 |
| 1984-02-14 | 0.129 |
| 1984-02-15 | 0.129 |
| 1984-02-16 | 0.13 |
| 1984-02-17 | 0.131 |
| 1984-02-20 | 0.131 |
| 1984-02-21 | 0.132 |
| 1984-02-22 | 0.132 |
| 1984-02-23 | 0.133 |
| 1984-02-24 | 0.134 |
| 1984-02-27 | 0.136 |
| 1984-02-28 | 0.136 |
| 1984-02-29 | 0.137 |
| 1984-03-01 | 0.138 |
| 1984-03-02 | 0.139 |
| 1984-03-05 | 0.141 |
| 1984-03-06 | 0.141 |
| 1984-03-07 | 0.142 |
| 1984-03-08 | 0.142 |
| 1984-03-09 | 0.144 |
| 1984-03-12 | 0.144 |
| 1984-03-13 | 0.145 |
| 1984-03-14 | 0.146 |
| 1984-03-15 | 0.146 |
| 1984-03-16 | 0.147 |
| 1984-03-20 | 0.148 |
| 1984-03-21 | 0.148 |
| 1984-03-22 | 0.149 |
| 1984-03-23 | 0.15 |
| 1984-03-26 | 0.151 |
| 1984-03-27 | 0.151 |
| 1984-03-28 | 0.152 |
| 1984-03-29 | 0.153 |
| 1984-03-30 | 0.153 |
| 1984-04-02 | 0.155 |
| 1984-04-03 | 0.156 |
| 1984-04-04 | 0.158 |
| 1984-04-05 | 0.158 |
| 1984-04-06 | 0.16 |
| 1984-04-09 | 0.162 |
| 1984-04-10 | 0.164 |
| 1984-04-11 | 0.165 |
| 1984-04-12 | 0.166 |
| 1984-04-13 | 0.167 |
| 1984-04-16 | 0.17 |
| 1984-04-18 | 0.171 |
| 1984-04-19 | 0.172 |
| 1984-04-20 | 0.173 |
| 1984-04-24 | 0.176 |
| 1984-04-25 | 0.177 |
| 1984-04-26 | 0.178 |
| 1984-04-27 | 0.18 |
| 1984-04-30 | 0.181 |
| 1984-05-01 | 0.181 |
| 1984-05-02 | 0.183 |
| 1984-05-03 | 0.184 |
| 1984-05-04 | 0.186 |
| 1984-05-08 | 0.187 |
| 1984-05-09 | 0.188 |
| 1984-05-10 | 0.19 |
| 1984-05-11 | 0.189 |
| 1984-05-14 | 0.191 |
| 1984-05-15 | 0.192 |
| 1984-05-16 | 0.192 |
| 1984-05-17 | 0.192 |
| 1984-05-18 | 0.193 |
| 1984-05-21 | 0.194 |
| 1984-05-22 | 0.195 |
| 1984-05-23 | 0.196 |
| 1984-05-24 | 0.196 |
| 1984-05-25 | 0.197 |
| 1984-05-28 | 0.199 |
| 1984-05-29 | 0.2 |
| 1984-05-30 | 0.201 |
| 1984-05-31 | 0.202 |
| 1984-06-01 | 0.203 |
| 1984-06-04 | 0.205 |
| 1984-06-05 | 0.206 |
| 1984-06-07 | 0.207 |
| 1984-06-08 | 0.209 |
| 1984-06-11 | 0.21 |
| 1984-06-12 | 0.211 |
| 1984-06-13 | 0.212 |
| 1984-06-14 | 0.212 |
| 1984-06-15 | 0.213 |
| 1984-06-18 | 0.216 |
| 1984-06-19 | 0.217 |
| 1984-06-20 | 0.218 |
| 1984-06-21 | 0.22 |
| 1984-06-22 | 0.222 |
| 1984-06-25 | 0.228 |
| 1984-06-26 | 0.23 |
| 1984-06-27 | 0.232 |
| 1984-06-28 | 0.234 |
| 1984-06-29 | 0.236 |
| 1984-07-02 | 0.239 |
| 1984-07-03 | 0.241 |
| 1984-07-04 | 0.242 |
| 1984-07-05 | 0.243 |
| 1984-07-06 | 0.246 |
| 1984-07-09 | 0.249 |
| 1984-07-10 | 0.25 |
| 1984-07-11 | 0.25 |
| 1984-07-12 | 0.252 |
| 1984-07-13 | 0.254 |
| 1984-07-16 | 0.256 |
| 1984-07-17 | 0.259 |
| 1984-07-18 | 0.261 |
| 1984-07-19 | 0.263 |
| 1984-07-20 | 0.266 |
| 1984-07-25 | 0.27 |
| 1984-07-26 | 0.273 |
| 1984-07-27 | 0.277 |
| 1984-07-30 | 0.28 |
| 1984-07-31 | 0.283 |
| 1984-08-01 | 0.286 |
| 1984-08-02 | 0.288 |
| 1984-08-03 | 0.292 |
| 1984-08-06 | 0.291 |
| 1984-08-08 | 0.293 |
| 1984-08-09 | 0.296 |
| 1984-08-10 | 0.299 |
| 1984-08-13 | 0.301 |
| 1984-08-14 | 0.303 |
| 1984-08-15 | 0.305 |
| 1984-08-16 | 0.306 |
| 1984-08-17 | 0.307 |
| 1984-08-20 | 0.31 |
| 1984-08-21 | 0.312 |
| 1984-08-22 | 0.315 |
| 1984-08-23 | 0.317 |
| 1984-08-24 | 0.318 |
| 1984-08-27 | 0.32 |
| 1984-08-28 | 0.321 |
| 1984-08-29 | 0.323 |
| 1984-08-30 | 0.324 |
| 1984-08-31 | 0.328 |
| 1984-09-03 | 0.331 |
| 1984-09-04 | 0.335 |
| 1984-09-05 | 0.338 |
| 1984-09-06 | 0.341 |
| 1984-09-07 | 0.347 |
| 1984-09-10 | 0.351 |
| 1984-09-11 | 0.354 |
| 1984-09-12 | 0.354 |
| 1984-09-13 | 0.357 |
| 1984-09-14 | 0.364 |
| 1984-09-17 | 0.396 |
| 1984-09-18 | 0.394 |
| 1984-09-19 | 0.392 |
| 1984-09-20 | 0.394 |
| 1984-09-21 | 0.398 |
| 1984-09-24 | 0.397 |
| 1984-09-25 | 0.401 |
| 1984-09-26 | 0.401 |
| 1984-10-01 | 0.409 |
| 1984-10-02 | 0.413 |
| 1984-10-03 | 0.419 |
| 1984-10-04 | 0.426 |
| 1984-10-05 | 0.429 |
| 1984-10-08 | 0.434 |
| 1984-10-09 | 0.435 |
| 1984-10-10 | 0.435 |
| 1984-10-12 | 0.438 |
| 1984-10-15 | 0.447 |
| 1984-10-16 | 0.451 |
| 1984-10-17 | 0.456 |
| 1984-10-19 | 0.464 |
| 1984-10-22 | 0.472 |
| 1984-10-23 | 0.48 |
| 1984-10-24 | 0.487 |
| 1984-10-25 | 0.492 |
| 1984-10-26 | 0.501 |
| 1984-10-29 | 0.503 |
| 1984-10-30 | 0.508 |
| 1984-10-31 | 0.514 |
| 1984-11-01 | 0.518 |
| 1984-11-02 | 0.527 |
| 1984-11-05 | 0.529 |
| 1984-11-06 | 0.53 |
| 1984-11-07 | 0.532 |
| 1984-11-08 | 0.533 |
| 1984-11-09 | 0.536 |
| 1984-11-12 | 0.539 |
| 1984-11-13 | 0.54 |
| 1984-11-14 | 0.544 |
| 1984-11-15 | 0.546 |
| 1984-11-16 | 0.55 |
| 1984-11-19 | 0.553 |
| 1984-11-20 | 0.554 |
| 1984-11-21 | 0.559 |
| 1984-11-22 | 0.563 |
| 1984-11-23 | 0.567 |
| 1984-11-26 | 0.57 |
| 1984-11-27 | 0.573 |
| 1984-11-28 | 0.577 |
| 1984-11-29 | 0.58 |
| 1984-11-30 | 0.586 |
| 1984-12-03 | 0.588 |
| 1984-12-04 | 0.59 |
| 1984-12-05 | 0.59 |
| 1984-12-06 | 0.592 |
| 1984-12-07 | 0.596 |
| 1984-12-10 | 0.599 |
| 1984-12-11 | 0.6 |
| 1984-12-12 | 0.602 |
| 1984-12-13 | 0.604 |
| 1984-12-14 | 0.606 |
| 1984-12-17 | 0.609 |
| 1984-12-18 | 0.607 |
| 1984-12-19 | 0.61 |
| 1984-12-20 | 0.612 |
| 1984-12-21 | 0.615 |
| 1984-12-24 | 0.618 |
| 1984-12-26 | 0.621 |
| 1984-12-27 | 0.628 |
| 1984-12-28 | 0.634 |
| 1984-12-31 | 0.639 |
| 1985-01-02 | 0.638 |
| 1985-01-03 | 0.644 |
| 1985-01-04 | 0.648 |
| 1985-01-07 | 0.653 |
| 1985-01-08 | 0.655 |
| 1985-01-09 | 0.659 |
| 1985-01-10 | 0.661 |
| 1985-01-11 | 0.663 |
| 1985-01-14 | 0.666 |
| 1985-01-15 | 0.663 |
| 1985-01-16 | 0.662 |
| 1985-01-17 | 0.662 |
| 1985-01-18 | 0.665 |
| 1985-01-21 | 0.668 |
| 1985-01-22 | 0.669 |
| 1985-01-23 | 0.67 |
| 1985-01-24 | 0.672 |
| 1985-01-25 | 0.674 |
| 1985-01-28 | 0.677 |
| 1985-01-29 | 0.677 |
| 1985-01-30 | 0.678 |
| 1985-01-31 | 0.68 |
| 1985-02-01 | 0.687 |
| 1985-02-04 | 0.695 |
| 1985-02-05 | 0.695 |
| 1985-02-06 | 0.693 |
| 1985-02-07 | 0.695 |
| 1985-02-08 | 0.699 |
| 1985-02-11 | 0.703 |
| 1985-02-12 | 0.704 |
| 1985-02-13 | 0.709 |
| 1985-02-14 | 0.713 |
| 1985-02-15 | 0.712 |
| 1985-02-18 | 0.717 |
| 1985-02-19 | 0.726 |
| 1985-02-20 | 0.73 |
| 1985-02-21 | 0.734 |
| 1985-02-22 | 0.744 |
| 1985-02-25 | 0.755 |
| 1985-02-26 | 0.759 |
| 1985-02-27 | 0.759 |
| 1985-02-28 | 0.765 |
| 1985-03-01 | 0.766 |
| 1985-03-04 | 0.777 |
| 1985-03-05 | 0.783 |
| 1985-03-06 | 0.788 |
| 1985-03-08 | 0.796 |
| 1985-03-11 | 0.799 |
| 1985-03-12 | 0.803 |
| 1985-03-13 | 0.805 |
| 1985-03-14 | 0.81 |
| 1985-03-15 | 0.819 |
| 1985-03-18 | 0.819 |
| 1985-03-19 | 0.821 |
| 1985-03-20 | 0.822 |
| 1985-03-21 | 0.826 |
| 1985-03-22 | 0.829 |
| 1985-03-25 | 0.839 |
| 1985-03-26 | 0.843 |
| 1985-03-27 | 0.845 |
| 1985-03-28 | 0.851 |
| 1985-03-29 | 0.858 |
| 1985-04-01 | 0.864 |
| 1985-04-02 | 0.87 |
| 1985-04-03 | 0.874 |
| 1985-04-04 | 0.881 |
| 1985-04-05 | 0.889 |
| 1985-04-08 | 0.896 |
| 1985-04-09 | 0.902 |
| 1985-04-10 | 0.904 |
| 1985-04-11 | 0.908 |
| 1985-04-15 | 0.918 |
| 1985-04-16 | 0.918 |
| 1985-04-17 | 0.922 |
| 1985-04-18 | 0.927 |
| 1985-04-19 | 0.929 |
| 1985-04-22 | 0.929 |
| 1985-04-23 | 0.933 |
| 1985-04-24 | 0.938 |
| 1985-04-26 | 0.944 |
| 1985-04-29 | 0.949 |
| 1985-04-30 | 0.952 |
| 1985-05-01 | 0.95 |
| 1985-05-02 | 0.947 |
| 1985-05-03 | 0.954 |
| 1985-05-06 | 0.959 |
| 1985-05-07 | 0.958 |
| 1985-05-08 | 0.958 |
| 1985-05-09 | 0.961 |
| 1985-05-10 | 0.964 |
| 1985-05-13 | 0.974 |
| 1985-05-14 | 0.981 |
| 1985-05-15 | 0.98 |
| 1985-05-16 | 0.996 |
| 1985-05-17 | 1.011 |
| 1985-05-20 | 1.012 |
| 1985-05-21 | 1.012 |
| 1985-05-22 | 1.01 |
| 1985-05-23 | 1.01 |
| 1985-05-24 | 1.016 |
| 1985-05-27 | 1.022 |
| 1985-05-28 | 1.039 |
| 1985-05-29 | 1.045 |
| 1985-05-30 | 1.051 |
| 1985-05-31 | 1.055 |
| 1985-06-03 | 1.063 |
| 1985-06-04 | 1.069 |
| 1985-06-05 | 1.072 |
| 1985-06-06 | 1.075 |
| 1985-06-07 | 1.09 |
| 1985-06-10 | 1.098 |
| 1985-06-11 | 1.103 |
| 1985-06-12 | 1.114 |
| 1985-06-13 | 1.123 |
| 1985-06-14 | 1.129 |
| 1985-06-17 | 1.136 |
| 1985-06-18 | 1.142 |
| 1985-06-19 | 1.149 |
| 1985-06-20 | 1.157 |
| 1985-06-21 | 1.17 |
| 1985-06-24 | 1.179 |
| 1985-06-25 | 1.187 |
| 1985-06-26 | 1.207 |
| 1985-06-27 | 1.231 |
| 1985-06-28 | 1.262 |
| 1985-07-01 | 1.5 |
| 1985-07-03 | 1.5 |
| 1985-07-04 | 1.498 |
| 1985-07-05 | 1.498 |
| 1985-07-08 | 1.498 |
| 1985-07-09 | 1.498 |
| 1985-07-10 | 1.498 |
| 1985-07-11 | 1.495 |
| 1985-07-12 | 1.494 |
| 1985-07-15 | 1.488 |
| 1985-07-16 | 1.484 |
| 1985-07-17 | 1.483 |
| 1985-07-18 | 1.472 |
| 1985-07-19 | 1.478 |
| 1985-07-22 | 1.478 |
| 1985-07-23 | 1.471 |
| 1985-07-24 | 1.473 |
| 1985-07-25 | 1.474 |
| 1985-07-26 | 1.476 |
| 1985-07-29 | 1.485 |
| 1985-07-30 | 1.483 |
| 1985-07-31 | 1.476 |
| 1985-08-01 | 1.469 |
| 1985-08-02 | 1.47 |
| 1985-08-05 | 1.47 |
| 1985-08-06 | 1.48 |
| 1985-08-07 | 1.48 |
| 1985-08-08 | 1.485 |
| 1985-08-09 | 1.474 |
| 1985-08-12 | 1.487 |
| 1985-08-13 | 1.489 |
| 1985-08-14 | 1.48 |
| 1985-08-15 | 1.482 |
| 1985-08-16 | 1.478 |
| 1985-08-19 | 1.48 |
| 1985-08-20 | 1.478 |
| 1985-08-21 | 1.49 |
| 1985-08-22 | 1.48 |
| 1985-08-23 | 1.487 |
| 1985-08-26 | 1.493 |
| 1985-08-27 | 1.493 |
| 1985-08-28 | 1.498 |
| 1985-08-29 | 1.486 |
| 1985-08-30 | 1.499 |
| 1985-09-02 | 1.504 |
| 1985-09-03 | 1.506 |
| 1985-09-04 | 1.506 |
| 1985-09-05 | 1.499 |
| 1985-09-06 | 1.495 |
| 1985-09-09 | 1.491 |
| 1985-09-10 | 1.487 |
| 1985-09-11 | 1.482 |
| 1985-09-12 | 1.49 |
| 1985-09-13 | 1.484 |
| 1985-09-18 | 1.492 |
| 1985-09-19 | 1.492 |
| 1985-09-20 | 1.481 |
| 1985-09-23 | 1.479 |
| 1985-09-24 | 1.479 |
| 1985-09-26 | 1.481 |
| 1985-09-27 | 1.485 |
| 1985-10-01 | 1.491 |
| 1985-10-02 | 1.479 |
| 1985-10-03 | 1.479 |
| 1985-10-04 | 1.479 |
| 1985-10-08 | 1.486 |
| 1985-10-09 | 1.476 |
| 1985-10-10 | 1.475 |
| 1985-10-11 | 1.472 |
| 1985-10-14 | 1.473 |
| 1985-10-15 | 1.47 |
| 1985-10-16 | 1.471 |
| 1985-10-17 | 1.483 |
| 1985-10-18 | 1.477 |
| 1985-10-21 | 1.476 |
| 1985-10-22 | 1.476 |
| 1985-10-23 | 1.472 |
| 1985-10-24 | 1.473 |
| 1985-10-25 | 1.486 |
| 1985-10-28 | 1.488 |
| 1985-10-29 | 1.487 |
| 1985-10-30 | 1.48 |
| 1985-10-31 | 1.488 |
| 1985-11-01 | 1.489 |
| 1985-11-04 | 1.481 |
| 1985-11-05 | 1.48 |
| 1985-11-06 | 1.484 |
| 1985-11-07 | 1.479 |
| 1985-11-08 | 1.478 |
| 1985-11-11 | 1.476 |
| 1985-11-12 | 1.473 |
| 1985-11-13 | 1.477 |
| 1985-11-14 | 1.475 |
| 1985-11-15 | 1.473 |
| 1985-11-18 | 1.478 |
| 1985-11-19 | 1.472 |
| 1985-11-20 | 1.471 |
| 1985-11-21 | 1.472 |
| 1985-11-22 | 1.479 |
| 1985-11-25 | 1.479 |
| 1985-11-26 | 1.482 |
| 1985-11-27 | 1.478 |
| 1985-11-28 | 1.477 |
| 1985-11-29 | 1.485 |
| 1985-12-02 | 1.486 |
| 1985-12-03 | 1.488 |
| 1985-12-04 | 1.488 |
| 1985-12-05 | 1.483 |
| 1985-12-06 | 1.483 |
| 1985-12-09 | 1.489 |
| 1985-12-10 | 1.485 |
| 1985-12-11 | 1.484 |
| 1985-12-12 | 1.492 |
| 1985-12-13 | 1.486 |
| 1985-12-16 | 1.483 |
| 1985-12-17 | 1.488 |
| 1985-12-18 | 1.483 |
| 1985-12-19 | 1.48 |
| 1985-12-20 | 1.481 |
| 1985-12-23 | 1.488 |
| 1985-12-24 | 1.482 |
| 1985-12-26 | 1.483 |
| 1985-12-27 | 1.495 |
| 1985-12-30 | 1.493 |
| 1985-12-31 | 1.5 |
| 1986-01-03 | 1.494 |
| 1986-01-06 | 1.5 |
| 1986-01-07 | 1.492 |
| 1986-01-08 | 1.491 |
| 1986-01-09 | 1.49 |
| 1986-01-10 | 1.49 |
| 1986-01-13 | 1.494 |
| 1986-01-14 | 1.488 |
| 1986-01-15 | 1.487 |
| 1986-01-16 | 1.486 |
| 1986-01-17 | 1.485 |
| 1986-01-20 | 1.484 |
| 1986-01-21 | 1.491 |
| 1986-01-22 | 1.486 |
| 1986-01-23 | 1.482 |
| 1986-01-24 | 1.49 |
| 1986-01-27 | 1.492 |
| 1986-01-28 | 1.487 |
| 1986-01-29 | 1.486 |
| 1986-01-30 | 1.483 |
| 1986-01-31 | 1.484 |
| 1986-02-03 | 1.492 |
| 1986-02-04 | 1.485 |
| 1986-02-05 | 1.487 |
| 1986-02-06 | 1.486 |
| 1986-02-07 | 1.485 |
| 1986-02-10 | 1.494 |
| 1986-02-11 | 1.489 |
| 1986-02-12 | 1.483 |
| 1986-02-13 | 1.486 |
| 1986-02-14 | 1.482 |
| 1986-02-17 | 1.481 |
| 1986-02-18 | 1.488 |
| 1986-02-19 | 1.48 |
| 1986-02-20 | 1.475 |
| 1986-02-21 | 1.476 |
| 1986-02-24 | 1.487 |
| 1986-02-25 | 1.479 |
| 1986-02-26 | 1.477 |
| 1986-02-27 | 1.476 |
| 1986-02-28 | 1.477 |
| 1986-03-03 | 1.476 |
| 1986-03-04 | 1.483 |
| 1986-03-05 | 1.481 |
| 1986-03-06 | 1.48 |
| 1986-03-07 | 1.48 |
| 1986-03-10 | 1.481 |
| 1986-03-11 | 1.48 |
| 1986-03-12 | 1.48 |
| 1986-03-13 | 1.479 |
| 1986-03-14 | 1.487 |
| 1986-03-17 | 1.494 |
| 1986-03-18 | 1.492 |
| 1986-03-19 | 1.493 |
| 1986-03-20 | 1.488 |
| 1986-03-21 | 1.488 |
| 1986-03-24 | 1.49 |
| 1986-03-26 | 1.493 |
| 1986-03-27 | 1.497 |
| 1986-03-28 | 1.5 |
| 1986-03-31 | 1.499 |
| 1986-04-01 | 1.492 |
| 1986-04-02 | 1.489 |
| 1986-04-03 | 1.486 |
| 1986-04-04 | 1.494 |
| 1986-04-07 | 1.495 |
| 1986-04-08 | 1.489 |
| 1986-04-09 | 1.484 |
| 1986-04-10 | 1.48 |
| 1986-04-11 | 1.481 |
| 1986-04-14 | 1.482 |
| 1986-04-15 | 1.478 |
| 1986-04-16 | 1.478 |
| 1986-04-17 | 1.476 |
| 1986-04-18 | 1.476 |
| 1986-04-21 | 1.477 |
| 1986-04-22 | 1.474 |
| 1986-04-23 | 1.473 |
| 1986-04-25 | 1.484 |
| 1986-04-28 | 1.484 |
| 1986-04-29 | 1.477 |
| 1986-05-01 | 1.476 |
| 1986-05-02 | 1.478 |
| 1986-05-05 | 1.477 |
| 1986-05-06 | 1.474 |
| 1986-05-07 | 1.475 |
| 1986-05-08 | 1.474 |
| 1986-05-09 | 1.472 |
| 1986-05-12 | 1.473 |
| 1986-05-13 | 1.472 |
| 1986-05-15 | 1.482 |
| 1986-05-16 | 1.475 |
| 1986-05-19 | 1.482 |
| 1986-05-20 | 1.485 |
| 1986-05-21 | 1.478 |
| 1986-05-22 | 1.478 |
| 1986-05-23 | 1.478 |
| 1986-05-26 | 1.478 |
| 1986-05-27 | 1.486 |
| 1986-05-28 | 1.481 |
| 1986-05-29 | 1.489 |
| 1986-05-30 | 1.488 |
| 1986-06-02 | 1.497 |
| 1986-06-03 | 1.491 |
| 1986-06-04 | 1.489 |
| 1986-06-05 | 1.494 |
| 1986-06-06 | 1.493 |
| 1986-06-09 | 1.493 |
| 1986-06-10 | 1.499 |
| 1986-06-11 | 1.496 |
| 1986-06-12 | 1.499 |
| 1986-06-16 | 1.494 |
| 1986-06-17 | 1.499 |
| 1986-06-18 | 1.496 |
| 1986-06-19 | 1.494 |
| 1986-06-20 | 1.492 |
| 1986-06-23 | 1.499 |
| 1986-06-24 | 1.493 |
| 1986-06-25 | 1.496 |
| 1986-06-26 | 1.493 |
| 1986-06-27 | 1.495 |
| 1986-06-30 | 1.499 |
| 1986-07-01 | 1.493 |
| 1986-07-02 | 1.495 |
| 1986-07-03 | 1.497 |
| 1986-07-04 | 1.498 |
| 1986-07-07 | 1.494 |
| 1986-07-08 | 1.493 |
| 1986-07-09 | 1.497 |
| 1986-07-10 | 1.492 |
| 1986-07-11 | 1.496 |
| 1986-07-14 | 1.5 |
| 1986-07-15 | 1.493 |
| 1986-07-16 | 1.492 |
| 1986-07-17 | 1.494 |
| 1986-07-18 | 1.498 |
| 1986-07-21 | 1.493 |
| 1986-07-22 | 1.491 |
| 1986-07-23 | 1.496 |
| 1986-07-24 | 1.491 |
| 1986-07-25 | 1.493 |
| 1986-07-28 | 1.498 |
| 1986-07-29 | 1.493 |
| 1986-07-30 | 1.492 |
| 1986-07-31 | 1.497 |
| 1986-08-01 | 1.492 |
| 1986-08-04 | 1.498 |
| 1986-08-05 | 1.492 |
| 1986-08-06 | 1.491 |
| 1986-08-07 | 1.49 |
| 1986-08-08 | 1.49 |
| 1986-08-11 | 1.487 |
| 1986-08-12 | 1.489 |
| 1986-08-13 | 1.487 |
| 1986-08-15 | 1.493 |
| 1986-08-18 | 1.486 |
| 1986-08-19 | 1.491 |
| 1986-08-20 | 1.491 |
| 1986-08-21 | 1.491 |
| 1986-08-22 | 1.486 |
| 1986-08-25 | 1.492 |
| 1986-08-26 | 1.486 |
| 1986-08-27 | 1.488 |
| 1986-08-28 | 1.486 |
| 1986-08-29 | 1.487 |
| 1986-09-01 | 1.485 |
| 1986-09-02 | 1.492 |
| 1986-09-03 | 1.486 |
| 1986-09-04 | 1.486 |
| 1986-09-05 | 1.485 |
| 1986-09-08 | 1.49 |
| 1986-09-09 | 1.488 |
| 1986-09-10 | 1.489 |
| 1986-09-11 | 1.487 |
| 1986-09-12 | 1.492 |
| 1986-09-15 | 1.487 |
| 1986-09-16 | 1.487 |
| 1986-09-17 | 1.487 |
| 1986-09-18 | 1.482 |
| 1986-09-19 | 1.484 |
| 1986-09-22 | 1.488 |
| 1986-09-23 | 1.487 |
| 1986-09-24 | 1.487 |
| 1986-09-25 | 1.487 |
| 1986-09-26 | 1.487 |
| 1986-09-29 | 1.488 |
| 1986-09-30 | 1.491 |
| 1986-10-01 | 1.484 |
| 1986-10-02 | 1.484 |
| 1986-10-03 | 1.485 |
| 1986-10-06 | 1.485 |
| 1986-10-07 | 1.489 |
| 1986-10-08 | 1.483 |
| 1986-10-09 | 1.483 |
| 1986-10-10 | 1.484 |
| 1986-10-14 | 1.484 |
| 1986-10-15 | 1.481 |
| 1986-10-16 | 1.481 |
| 1986-10-17 | 1.484 |
| 1986-10-20 | 1.48 |
| 1986-10-21 | 1.48 |
| 1986-10-22 | 1.48 |
| 1986-10-23 | 1.484 |
| 1986-10-24 | 1.49 |
| 1986-10-27 | 1.49 |
| 1986-10-28 | 1.492 |
| 1986-10-29 | 1.49 |
| 1986-10-30 | 1.488 |
| 1986-10-31 | 1.495 |
| 1986-11-03 | 1.495 |
| 1986-11-04 | 1.495 |
| 1986-11-05 | 1.497 |
| 1986-11-06 | 1.496 |
| 1986-11-07 | 1.498 |
| 1986-11-10 | 1.496 |
| 1986-11-11 | 1.494 |
| 1986-11-12 | 1.498 |
| 1986-11-13 | 1.492 |
| 1986-11-14 | 1.492 |
| 1986-11-17 | 1.494 |
| 1986-11-18 | 1.491 |
| 1986-11-19 | 1.491 |
| 1986-11-20 | 1.497 |
| 1986-11-21 | 1.496 |
| 1986-11-24 | 1.494 |
| 1986-11-25 | 1.493 |
| 1986-11-26 | 1.491 |
| 1986-11-27 | 1.49 |
| 1986-11-28 | 1.492 |
| 1986-12-01 | 1.485 |
| 1986-12-02 | 1.484 |
| 1986-12-03 | 1.484 |
| 1986-12-04 | 1.484 |
| 1986-12-05 | 1.489 |
| 1986-12-08 | 1.488 |
| 1986-12-09 | 1.492 |
| 1986-12-10 | 1.493 |
| 1986-12-11 | 1.492 |
| 1986-12-12 | 1.495 |
| 1986-12-15 | 1.488 |
| 1986-12-16 | 1.49 |
| 1986-12-17 | 1.494 |
| 1986-12-18 | 1.488 |
| 1986-12-19 | 1.494 |
| 1986-12-22 | 1.489 |
| 1986-12-23 | 1.488 |
| 1986-12-24 | 1.484 |
| 1986-12-26 | 1.482 |
| 1986-12-29 | 1.486 |
| 1986-12-30 | 1.486 |
| 1986-12-31 | 1.486 |
| 1987-01-02 | 1.485 |
| 1987-01-05 | 1.478 |
| 1987-01-06 | 1.48 |
| 1987-01-07 | 1.48 |
| 1987-01-08 | 1.486 |
| 1987-01-09 | 1.486 |
| 1987-01-12 | 1.495 |
| 1987-01-13 | 1.64 |
| 1987-01-14 | 1.63 |
| 1987-01-15 | 1.624 |
| 1987-01-16 | 1.625 |
| 1987-01-19 | 1.615 |
| 1987-01-20 | 1.62 |
| 1987-01-21 | 1.624 |
| 1987-01-22 | 1.616 |
| 1987-01-23 | 1.617 |
| 1987-01-26 | 1.615 |
| 1987-01-27 | 1.615 |
| 1987-01-28 | 1.605 |
| 1987-01-29 | 1.605 |
| 1987-01-30 | 1.608 |
| 1987-02-02 | 1.615 |
| 1987-02-03 | 1.607 |
| 1987-02-04 | 1.611 |
| 1987-02-05 | 1.616 |
| 1987-02-06 | 1.622 |
| 1987-02-09 | 1.623 |
| 1987-02-10 | 1.607 |
| 1987-02-11 | 1.609 |
| 1987-02-12 | 1.608 |
| 1987-02-13 | 1.612 |
| 1987-02-16 | 1.608 |
| 1987-02-17 | 1.608 |
| 1987-02-18 | 1.61 |
| 1987-02-19 | 1.617 |
| 1987-02-20 | 1.616 |
| 1987-02-23 | 1.615 |
| 1987-02-24 | 1.616 |
| 1987-02-25 | 1.617 |
| 1987-02-26 | 1.617 |
| 1987-02-27 | 1.616 |
| 1987-03-02 | 1.617 |
| 1987-03-03 | 1.616 |
| 1987-03-04 | 1.616 |
| 1987-03-05 | 1.618 |
| 1987-03-06 | 1.618 |
| 1987-03-09 | 1.621 |
| 1987-03-10 | 1.622 |
| 1987-03-11 | 1.622 |
| 1987-03-12 | 1.622 |
| 1987-03-13 | 1.623 |
| 1987-03-16 | 1.625 |
| 1987-03-17 | 1.619 |
| 1987-03-18 | 1.618 |
| 1987-03-19 | 1.618 |
| 1987-03-20 | 1.618 |
| 1987-03-23 | 1.614 |
| 1987-03-24 | 1.61 |
| 1987-03-25 | 1.61 |
| 1987-03-26 | 1.61 |
| 1987-03-27 | 1.612 |
| 1987-03-30 | 1.613 |
| 1987-03-31 | 1.606 |
| 1987-04-01 | 1.606 |
| 1987-04-02 | 1.608 |
| 1987-04-03 | 1.607 |
| 1987-04-06 | 1.605 |
| 1987-04-07 | 1.604 |
| 1987-04-08 | 1.608 |
| 1987-04-09 | 1.605 |
| 1987-04-10 | 1.601 |
| 1987-04-13 | 1.602 |
| 1987-04-15 | 1.601 |
| 1987-04-16 | 1.603 |
| 1987-04-17 | 1.601 |
| 1987-04-21 | 1.599 |
| 1987-04-22 | 1.599 |
| 1987-04-23 | 1.6 |
| 1987-04-24 | 1.595 |
| 1987-04-27 | 1.586 |
| 1987-04-28 | 1.59 |
| 1987-04-29 | 1.591 |
| 1987-04-30 | 1.591 |
| 1987-05-01 | 1.589 |
| 1987-05-05 | 1.585 |
| 1987-05-06 | 1.586 |
| 1987-05-07 | 1.584 |
| 1987-05-08 | 1.584 |
| 1987-05-11 | 1.589 |
| 1987-05-12 | 1.588 |
| 1987-05-13 | 1.59 |
| 1987-05-14 | 1.587 |
| 1987-05-15 | 1.584 |
| 1987-05-18 | 1.584 |
| 1987-05-19 | 1.582 |
| 1987-05-20 | 1.58 |
| 1987-05-21 | 1.584 |
| 1987-05-22 | 1.583 |
| 1987-05-25 | 1.586 |
| 1987-05-26 | 1.59 |
| 1987-05-27 | 1.599 |
| 1987-05-28 | 1.598 |
| 1987-05-29 | 1.602 |
| 1987-06-01 | 1.605 |
| 1987-06-02 | 1.601 |
| 1987-06-04 | 1.599 |
| 1987-06-05 | 1.598 |
| 1987-06-08 | 1.597 |
| 1987-06-09 | 1.598 |
| 1987-06-10 | 1.593 |
| 1987-06-11 | 1.594 |
| 1987-06-12 | 1.597 |
| 1987-06-15 | 1.603 |
| 1987-06-16 | 1.602 |
| 1987-06-17 | 1.605 |
| 1987-06-18 | 1.602 |
| 1987-06-19 | 1.602 |
| 1987-06-22 | 1.607 |
| 1987-06-23 | 1.611 |
| 1987-06-24 | 1.604 |
| 1987-06-25 | 1.605 |
| 1987-06-26 | 1.606 |
| 1987-06-29 | 1.605 |
| 1987-06-30 | 1.609 |
| 1987-07-01 | 1.606 |
| 1987-07-02 | 1.606 |
| 1987-07-03 | 1.608 |
| 1987-07-06 | 1.61 |
| 1987-07-07 | 1.608 |
| 1987-07-08 | 1.61 |
| 1987-07-09 | 1.606 |
| 1987-07-10 | 1.606 |
| 1987-07-13 | 1.611 |
| 1987-07-14 | 1.609 |
| 1987-07-15 | 1.613 |
| 1987-07-16 | 1.608 |
| 1987-07-17 | 1.612 |
| 1987-07-20 | 1.616 |
| 1987-07-21 | 1.617 |
| 1987-07-22 | 1.616 |
| 1987-07-23 | 1.615 |
| 1987-07-24 | 1.616 |
| 1987-07-27 | 1.615 |
| 1987-07-28 | 1.618 |
| 1987-07-29 | 1.615 |
| 1987-07-30 | 1.616 |
| 1987-07-31 | 1.615 |
| 1987-08-03 | 1.614 |
| 1987-08-05 | 1.617 |
| 1987-08-06 | 1.618 |
| 1987-08-07 | 1.618 |
| 1987-08-10 | 1.621 |
| 1987-08-11 | 1.622 |
| 1987-08-12 | 1.624 |
| 1987-08-13 | 1.628 |
| 1987-08-14 | 1.628 |
| 1987-08-17 | 1.623 |
| 1987-08-18 | 1.617 |
| 1987-08-19 | 1.615 |
| 1987-08-20 | 1.609 |
| 1987-08-21 | 1.61 |
| 1987-08-24 | 1.608 |
| 1987-08-25 | 1.606 |
| 1987-08-26 | 1.605 |
| 1987-08-27 | 1.6 |
| 1987-08-28 | 1.598 |
| 1987-08-31 | 1.599 |
| 1987-09-01 | 1.598 |
| 1987-09-02 | 1.597 |
| 1987-09-03 | 1.594 |
| 1987-09-04 | 1.595 |
| 1987-09-07 | 1.593 |
| 1987-09-08 | 1.591 |
| 1987-09-09 | 1.589 |
| 1987-09-10 | 1.595 |
| 1987-09-11 | 1.594 |
| 1987-09-14 | 1.6 |
| 1987-09-15 | 1.6 |
| 1987-09-16 | 1.597 |
| 1987-09-17 | 1.598 |
| 1987-09-18 | 1.597 |
| 1987-09-21 | 1.596 |
| 1987-09-22 | 1.598 |
| 1987-09-23 | 1.603 |
| 1987-09-28 | 1.604 |
| 1987-09-29 | 1.606 |
| 1987-09-30 | 1.609 |
| 1987-10-01 | 1.608 |
| 1987-10-05 | 1.609 |
| 1987-10-06 | 1.61 |
| 1987-10-07 | 1.605 |
| 1987-10-09 | 1.601 |
| 1987-10-12 | 1.598 |
| 1987-10-13 | 1.604 |
| 1987-10-14 | 1.603 |
| 1987-10-16 | 1.596 |
| 1987-10-19 | 1.59 |
| 1987-10-20 | 1.593 |
| 1987-10-21 | 1.597 |
| 1987-10-22 | 1.599 |
| 1987-10-23 | 1.598 |
| 1987-10-26 | 1.586 |
| 1987-10-27 | 1.586 |
| 1987-10-28 | 1.581 |
| 1987-10-29 | 1.576 |
| 1987-10-30 | 1.574 |
| 1987-11-02 | 1.568 |
| 1987-11-03 | 1.565 |
| 1987-11-04 | 1.567 |
| 1987-11-05 | 1.563 |
| 1987-11-06 | 1.561 |
| 1987-11-09 | 1.561 |
| 1987-11-10 | 1.559 |
| 1987-11-11 | 1.561 |
| 1987-11-12 | 1.57 |
| 1987-11-13 | 1.569 |
| 1987-11-16 | 1.578 |
| 1987-11-17 | 1.576 |
| 1987-11-18 | 1.577 |
| 1987-11-19 | 1.575 |
| 1987-11-20 | 1.576 |
| 1987-11-23 | 1.572 |
| 1987-11-24 | 1.577 |
| 1987-11-25 | 1.573 |
| 1987-11-26 | 1.567 |
| 1987-11-27 | 1.564 |
| 1987-11-30 | 1.557 |
| 1987-12-01 | 1.563 |
| 1987-12-02 | 1.566 |
| 1987-12-03 | 1.56 |
| 1987-12-04 | 1.563 |
| 1987-12-07 | 1.571 |
| 1987-12-08 | 1.566 |
| 1987-12-09 | 1.564 |
| 1987-12-10 | 1.566 |
| 1987-12-11 | 1.552 |
| 1987-12-14 | 1.553 |
| 1987-12-15 | 1.552 |
| 1987-12-16 | 1.553 |
| 1987-12-17 | 1.551 |
| 1987-12-18 | 1.548 |
| 1987-12-21 | 1.552 |
| 1987-12-22 | 1.552 |
| 1987-12-23 | 1.552 |
| 1987-12-24 | 1.552 |
| 1987-12-28 | 1.539 |
| 1987-12-29 | 1.537 |
| 1987-12-30 | 1.542 |
| 1987-12-31 | 1.539 |
| 1988-01-04 | 1.538 |
| 1988-01-05 | 1.55 |
| 1988-01-06 | 1.56 |
| 1988-01-07 | 1.565 |
| 1988-01-08 | 1.573 |
| 1988-01-11 | 1.561 |
| 1988-01-12 | 1.562 |
| 1988-01-13 | 1.558 |
| 1988-01-14 | 1.561 |
| 1988-01-15 | 1.559 |
| 1988-01-18 | 1.584 |
| 1988-01-19 | 1.581 |
| 1988-01-20 | 1.571 |
| 1988-01-21 | 1.569 |
| 1988-01-22 | 1.575 |
| 1988-01-25 | 1.578 |
| 1988-01-26 | 1.578 |
| 1988-01-27 | 1.578 |
| 1988-01-28 | 1.575 |
| 1988-01-29 | 1.58 |
| 1988-02-01 | 1.586 |
| 1988-02-02 | 1.584 |
| 1988-02-03 | 1.58 |
| 1988-02-04 | 1.586 |
| 1988-02-05 | 1.583 |
| 1988-02-08 | 1.589 |
| 1988-02-09 | 1.589 |
| 1988-02-10 | 1.584 |
| 1988-02-11 | 1.585 |
| 1988-02-12 | 1.585 |
| 1988-02-15 | 1.59 |
| 1988-02-16 | 1.592 |
| 1988-02-17 | 1.591 |
| 1988-02-18 | 1.589 |
| 1988-02-19 | 1.59 |
| 1988-02-22 | 1.587 |
| 1988-02-23 | 1.584 |
| 1988-02-24 | 1.584 |
| 1988-02-25 | 1.585 |
| 1988-02-26 | 1.582 |
| 1988-02-29 | 1.583 |
| 1988-03-01 | 1.581 |
| 1988-03-02 | 1.582 |
| 1988-03-04 | 1.582 |
| 1988-03-07 | 1.581 |
| 1988-03-08 | 1.573 |
| 1988-03-09 | 1.57 |
| 1988-03-10 | 1.571 |
| 1988-03-11 | 1.569 |
| 1988-03-14 | 1.565 |
| 1988-03-15 | 1.567 |
| 1988-03-16 | 1.568 |
| 1988-03-17 | 1.57 |
| 1988-03-18 | 1.578 |
| 1988-03-21 | 1.578 |
| 1988-03-22 | 1.576 |
| 1988-03-23 | 1.576 |
| 1988-03-24 | 1.574 |
| 1988-03-25 | 1.571 |
| 1988-03-28 | 1.567 |
| 1988-03-29 | 1.566 |
| 1988-03-30 | 1.565 |
| 1988-03-31 | 1.56 |
| 1988-04-01 | 1.56 |
| 1988-04-04 | 1.56 |
| 1988-04-05 | 1.562 |
| 1988-04-06 | 1.564 |
| 1988-04-07 | 1.569 |
| 1988-04-11 | 1.572 |
| 1988-04-12 | 1.573 |
| 1988-04-13 | 1.576 |
| 1988-04-14 | 1.575 |
| 1988-04-15 | 1.564 |
| 1988-04-18 | 1.561 |
| 1988-04-19 | 1.562 |
| 1988-04-20 | 1.562 |
| 1988-04-22 | 1.564 |
| 1988-04-25 | 1.565 |
| 1988-04-26 | 1.566 |
| 1988-04-27 | 1.568 |
| 1988-04-28 | 1.566 |
| 1988-04-29 | 1.565 |
| 1988-05-02 | 1.572 |
| 1988-05-03 | 1.568 |
| 1988-05-04 | 1.57 |
| 1988-05-05 | 1.568 |
| 1988-05-06 | 1.57 |
| 1988-05-09 | 1.57 |
| 1988-05-10 | 1.566 |
| 1988-05-11 | 1.565 |
| 1988-05-12 | 1.567 |
| 1988-05-13 | 1.566 |
| 1988-05-16 | 1.566 |
| 1988-05-17 | 1.568 |
| 1988-05-18 | 1.576 |
| 1988-05-19 | 1.572 |
| 1988-05-20 | 1.574 |
| 1988-05-23 | 1.574 |
| 1988-05-24 | 1.573 |
| 1988-05-25 | 1.572 |
| 1988-05-26 | 1.576 |
| 1988-05-27 | 1.576 |
| 1988-05-30 | 1.578 |
| 1988-05-31 | 1.584 |
| 1988-06-01 | 1.581 |
| 1988-06-02 | 1.585 |
| 1988-06-03 | 1.586 |
| 1988-06-06 | 1.586 |
| 1988-06-07 | 1.582 |
| 1988-06-08 | 1.582 |
| 1988-06-09 | 1.584 |
| 1988-06-10 | 1.586 |
| 1988-06-13 | 1.584 |
| 1988-06-14 | 1.586 |
| 1988-06-15 | 1.594 |
| 1988-06-16 | 1.594 |
| 1988-06-17 | 1.598 |
| 1988-06-20 | 1.596 |
| 1988-06-21 | 1.597 |
| 1988-06-22 | 1.599 |
| 1988-06-23 | 1.608 |
| 1988-06-24 | 1.612 |
| 1988-06-27 | 1.62 |
| 1988-06-28 | 1.616 |
| 1988-06-29 | 1.624 |
| 1988-06-30 | 1.623 |
| 1988-07-01 | 1.624 |
| 1988-07-04 | 1.628 |
| 1988-07-05 | 1.628 |
| 1988-07-06 | 1.622 |
| 1988-07-07 | 1.62 |
| 1988-07-08 | 1.622 |
| 1988-07-11 | 1.629 |
| 1988-07-12 | 1.629 |
| 1988-07-13 | 1.63 |
| 1988-07-14 | 1.634 |
| 1988-07-15 | 1.636 |
| 1988-07-18 | 1.648 |
| 1988-07-19 | 1.637 |
| 1988-07-20 | 1.63 |
| 1988-07-21 | 1.63 |
| 1988-07-22 | 1.621 |
| 1988-07-25 | 1.625 |
| 1988-07-26 | 1.628 |
| 1988-07-27 | 1.634 |
| 1988-07-28 | 1.628 |
| 1988-07-29 | 1.636 |
| 1988-08-01 | 1.638 |
| 1988-08-02 | 1.634 |
| 1988-08-03 | 1.636 |
| 1988-08-04 | 1.639 |
| 1988-08-05 | 1.64 |
| 1988-08-08 | 1.647 |
| 1988-08-09 | 1.643 |
| 1988-08-10 | 1.65 |
| 1988-08-11 | 1.643 |
| 1988-08-12 | 1.64 |
| 1988-08-15 | 1.638 |
| 1988-08-16 | 1.64 |
| 1988-08-17 | 1.645 |
| 1988-08-18 | 1.647 |
| 1988-08-19 | 1.642 |
| 1988-08-22 | 1.646 |
| 1988-08-23 | 1.647 |
| 1988-08-24 | 1.646 |
| 1988-08-25 | 1.641 |
| 1988-08-26 | 1.638 |
| 1988-08-29 | 1.64 |
| 1988-08-30 | 1.64 |
| 1988-08-31 | 1.645 |
| 1988-09-01 | 1.645 |
| 1988-09-02 | 1.647 |
| 1988-09-05 | 1.637 |
| 1988-09-06 | 1.638 |
| 1988-09-07 | 1.632 |
| 1988-09-08 | 1.634 |
| 1988-09-09 | 1.635 |
| 1988-09-14 | 1.636 |
| 1988-09-15 | 1.641 |
| 1988-09-16 | 1.644 |
| 1988-09-19 | 1.644 |
| 1988-09-22 | 1.644 |
| 1988-09-23 | 1.645 |
| 1988-09-27 | 1.645 |
| 1988-09-28 | 1.642 |
| 1988-09-29 | 1.644 |
| 1988-09-30 | 1.643 |
| 1988-10-04 | 1.638 |
| 1988-10-05 | 1.638 |
| 1988-10-06 | 1.639 |
| 1988-10-07 | 1.638 |
| 1988-10-10 | 1.634 |
| 1988-10-11 | 1.631 |
| 1988-10-12 | 1.628 |
| 1988-10-13 | 1.624 |
| 1988-10-14 | 1.619 |
| 1988-10-17 | 1.614 |
| 1988-10-18 | 1.618 |
| 1988-10-19 | 1.615 |
| 1988-10-20 | 1.614 |
| 1988-10-21 | 1.611 |
| 1988-10-24 | 1.611 |
| 1988-10-25 | 1.613 |
| 1988-10-26 | 1.611 |
| 1988-10-27 | 1.605 |
| 1988-10-28 | 1.605 |
| 1988-10-31 | 1.599 |
| 1988-11-02 | 1.605 |
| 1988-11-03 | 1.602 |
| 1988-11-04 | 1.604 |
| 1988-11-07 | 1.606 |
| 1988-11-08 | 1.605 |
| 1988-11-09 | 1.603 |
| 1988-11-10 | 1.597 |
| 1988-11-11 | 1.589 |
| 1988-11-14 | 1.593 |
| 1988-11-15 | 1.591 |
| 1988-11-16 | 1.59 |
| 1988-11-17 | 1.581 |
| 1988-11-18 | 1.59 |
| 1988-11-21 | 1.588 |
| 1988-11-22 | 1.585 |
| 1988-11-23 | 1.582 |
| 1988-11-24 | 1.58 |
| 1988-11-25 | 1.58 |
| 1988-11-28 | 1.583 |
| 1988-11-29 | 1.582 |
| 1988-11-30 | 1.586 |
| 1988-12-01 | 1.58 |
| 1988-12-02 | 1.584 |
| 1988-12-05 | 1.578 |
| 1988-12-06 | 1.58 |
| 1988-12-07 | 1.586 |
| 1988-12-08 | 1.587 |
| 1988-12-09 | 1.585 |
| 1988-12-12 | 1.586 |
| 1988-12-13 | 1.587 |
| 1988-12-14 | 1.589 |
| 1988-12-15 | 1.587 |
| 1988-12-16 | 1.592 |
| 1988-12-19 | 1.594 |
| 1988-12-20 | 1.599 |
| 1988-12-21 | 1.599 |
| 1988-12-22 | 1.598 |
| 1988-12-23 | 1.599 |
| 1988-12-27 | 1.68 |
| 1988-12-28 | 1.686 |
| 1988-12-29 | 1.685 |
| 1989-01-03 | 1.806 |
| 1989-01-04 | 1.808 |
| 1989-01-05 | 1.81 |
| 1989-01-06 | 1.814 |
| 1989-01-09 | 1.826 |
| 1989-01-10 | 1.821 |
| 1989-01-11 | 1.817 |
| 1989-01-12 | 1.812 |
| 1989-01-13 | 1.818 |
| 1989-01-16 | 1.821 |
| 1989-01-17 | 1.818 |
| 1989-01-18 | 1.822 |
| 1989-01-19 | 1.826 |
| 1989-01-20 | 1.816 |
| 1989-01-23 | 1.817 |
| 1989-01-24 | 1.808 |
| 1989-01-25 | 1.812 |
| 1989-01-26 | 1.812 |
| 1989-01-27 | 1.813 |
| 1989-01-30 | 1.817 |
| 1989-01-31 | 1.814 |
| 1989-02-01 | 1.818 |
| 1989-02-02 | 1.813 |
| 1989-02-03 | 1.814 |
| 1989-02-06 | 1.817 |
| 1989-02-07 | 1.81 |
| 1989-02-08 | 1.812 |
| 1989-02-09 | 1.808 |
| 1989-02-10 | 1.8 |
| 1989-02-13 | 1.811 |
| 1989-02-14 | 1.806 |
| 1989-02-15 | 1.796 |
| 1989-02-16 | 1.797 |
| 1989-02-17 | 1.795 |
| 1989-02-20 | 1.794 |
| 1989-02-21 | 1.799 |
| 1989-02-22 | 1.795 |
| 1989-02-23 | 1.789 |
| 1989-02-24 | 1.79 |
| 1989-02-27 | 1.787 |
| 1989-03-01 | 1.795 |
| 1989-03-02 | 1.796 |
| 1989-03-03 | 1.797 |
| 1989-03-06 | 1.795 |
| 1989-03-07 | 1.804 |
| 1989-03-08 | 1.804 |
| 1989-03-09 | 1.805 |
| 1989-03-10 | 1.806 |
| 1989-03-13 | 1.807 |
| 1989-03-14 | 1.807 |
| 1989-03-15 | 1.808 |
| 1989-03-16 | 1.808 |
| 1989-03-17 | 1.806 |
| 1989-03-20 | 1.813 |
| 1989-03-22 | 1.817 |
| 1989-03-23 | 1.813 |
| 1989-03-24 | 1.814 |
| 1989-03-27 | 1.814 |
| 1989-03-28 | 1.818 |
| 1989-03-29 | 1.823 |
| 1989-03-30 | 1.818 |
| 1989-03-31 | 1.82 |
| 1989-04-03 | 1.818 |
| 1989-04-04 | 1.81 |
| 1989-04-05 | 1.814 |
| 1989-04-06 | 1.814 |
| 1989-04-07 | 1.812 |
| 1989-04-10 | 1.818 |
| 1989-04-11 | 1.821 |
| 1989-04-12 | 1.819 |
| 1989-04-13 | 1.812 |
| 1989-04-14 | 1.814 |
| 1989-04-17 | 1.812 |
| 1989-04-18 | 1.81 |
| 1989-04-19 | 1.807 |
| 1989-04-21 | 1.81 |
| 1989-04-24 | 1.809 |
| 1989-04-25 | 1.82 |
| 1989-04-27 | 1.824 |
| 1989-04-28 | 1.82 |
| 1989-05-01 | 1.83 |
| 1989-05-02 | 1.837 |
| 1989-05-03 | 1.84 |
| 1989-05-04 | 1.836 |
| 1989-05-05 | 1.838 |
| 1989-05-08 | 1.842 |
| 1989-05-09 | 1.846 |
| 1989-05-11 | 1.847 |
| 1989-05-12 | 1.853 |
| 1989-05-15 | 1.864 |
| 1989-05-16 | 1.863 |
| 1989-05-17 | 1.872 |
| 1989-05-18 | 1.882 |
| 1989-05-19 | 1.884 |
| 1989-05-22 | 1.906 |
| 1989-05-23 | 1.904 |
| 1989-05-24 | 1.911 |
| 1989-05-25 | 1.906 |
| 1989-05-26 | 1.903 |
| 1989-05-29 | 1.914 |
| 1989-05-30 | 1.922 |
| 1989-05-31 | 1.913 |
| 1989-06-01 | 1.912 |
| 1989-06-02 | 1.908 |
| 1989-06-05 | 1.893 |
| 1989-06-06 | 1.913 |
| 1989-06-07 | 1.905 |
| 1989-06-08 | 1.911 |
| 1989-06-12 | 1.941 |
| 1989-06-13 | 1.939 |
| 1989-06-14 | 1.942 |
| 1989-06-15 | 1.953 |
| 1989-06-16 | 1.936 |
| 1989-06-19 | 1.937 |
| 1989-06-20 | 1.927 |
| 1989-06-21 | 1.938 |
| 1989-06-22 | 1.932 |
| 1989-06-23 | 2.018 |
| 1989-06-26 | 2.014 |
| 1989-06-27 | 2.016 |
| 1989-06-28 | 2.012 |
| 1989-06-29 | 2.01 |
| 1989-06-30 | 2.011 |
| 1989-07-03 | 1.995 |
| 1989-07-04 | 1.985 |
| 1989-07-05 | 1.979 |
| 1989-07-06 | 1.968 |
| 1989-07-07 | 1.97 |
| 1989-07-10 | 1.965 |
| 1989-07-11 | 1.966 |
| 1989-07-12 | 1.968 |
| 1989-07-13 | 1.966 |
| 1989-07-14 | 1.97 |
| 1989-07-17 | 1.984 |
| 1989-07-18 | 1.985 |
| 1989-07-19 | 1.974 |
| 1989-07-20 | 1.98 |
| 1989-07-21 | 1.976 |
| 1989-07-24 | 1.984 |
| 1989-07-25 | 1.983 |
| 1989-07-26 | 1.976 |
| 1989-07-27 | 1.97 |
| 1989-07-28 | 1.974 |
| 1989-07-31 | 1.966 |
| 1989-08-01 | 1.963 |
| 1989-08-02 | 1.958 |
| 1989-08-03 | 1.96 |
| 1989-08-04 | 1.973 |
| 1989-08-07 | 1.994 |
| 1989-08-08 | 1.984 |
| 1989-08-09 | 1.98 |
| 1989-08-11 | 1.991 |
| 1989-08-14 | 1.999 |
| 1989-08-15 | 1.995 |
| 1989-08-16 | 1.998 |
| 1989-08-17 | 1.998 |
| 1989-08-18 | 2.003 |
| 1989-08-21 | 2.004 |
| 1989-08-22 | 2.005 |
| 1989-08-23 | 1.998 |
| 1989-08-24 | 2.008 |
| 1989-08-25 | 2.011 |
| 1989-08-28 | 2.018 |
| 1989-08-29 | 2.018 |
| 1989-08-30 | 2.014 |
| 1989-08-31 | 2.011 |
| 1989-09-01 | 2.01 |
| 1989-09-04 | 2.007 |
| 1989-09-05 | 2.018 |
| 1989-09-06 | 2.022 |
| 1989-09-07 | 2.028 |
| 1989-09-08 | 2.017 |
| 1989-09-11 | 2.018 |
| 1989-09-12 | 2.023 |
| 1989-09-13 | 2.021 |
| 1989-09-14 | 2.02 |
| 1989-09-15 | 2.028 |
| 1989-09-18 | 2.03 |
| 1989-09-19 | 2.023 |
| 1989-09-20 | 2.026 |
| 1989-09-21 | 2.027 |
| 1989-09-22 | 2.022 |
| 1989-09-25 | 1.997 |
| 1989-09-26 | 1.996 |
| 1989-09-27 | 1.984 |
| 1989-09-28 | 1.995 |
| 1989-09-29 | 1.983 |
| 1989-10-02 | 1.992 |
| 1989-10-03 | 1.996 |
| 1989-10-04 | 1.995 |
| 1989-10-05 | 1.998 |
| 1989-10-06 | 2.006 |
| 1989-10-10 | 2.017 |
| 1989-10-11 | 2.021 |
| 1989-10-12 | 2.014 |
| 1989-10-13 | 2.011 |
| 1989-10-16 | 1.997 |
| 1989-10-17 | 2.002 |
| 1989-10-18 | 1.993 |
| 1989-10-19 | 1.99 |
| 1989-10-20 | 1.994 |
| 1989-10-23 | 1.996 |
| 1989-10-24 | 1.995 |
| 1989-10-25 | 1.988 |
| 1989-10-26 | 1.997 |
| 1989-10-27 | 2.005 |
| 1989-10-30 | 2.001 |
| 1989-10-31 | 1.992 |
| 1989-11-01 | 1.985 |
| 1989-11-02 | 1.987 |
| 1989-11-03 | 1.985 |
| 1989-11-06 | 1.992 |
| 1989-11-07 | 1.99 |
| 1989-11-08 | 1.994 |
| 1989-11-09 | 1.989 |
| 1989-11-10 | 1.994 |
| 1989-11-13 | 2.005 |
| 1989-11-14 | 1.998 |
| 1989-11-15 | 1.994 |
| 1989-11-16 | 1.992 |
| 1989-11-17 | 1.991 |
| 1989-11-20 | 2.003 |
| 1989-11-21 | 1.988 |
| 1989-11-22 | 1.98 |
| 1989-11-23 | 1.991 |
| 1989-11-24 | 1.986 |
| 1989-11-27 | 1.987 |
| 1989-11-28 | 1.982 |
| 1989-11-29 | 1.968 |
| 1989-11-30 | 1.964 |
| 1989-12-01 | 1.961 |
| 1989-12-04 | 1.966 |
| 1989-12-05 | 1.968 |
| 1989-12-06 | 1.973 |
| 1989-12-07 | 1.964 |
| 1989-12-08 | 1.978 |
| 1989-12-11 | 1.978 |
| 1989-12-12 | 1.964 |
| 1989-12-13 | 1.947 |
| 1989-12-14 | 1.952 |
| 1989-12-15 | 1.951 |
| 1989-12-18 | 1.944 |
| 1989-12-19 | 1.944 |
| 1989-12-20 | 1.962 |
| 1989-12-21 | 1.949 |
| 1989-12-22 | 1.948 |
| 1989-12-27 | 1.955 |
| 1989-12-28 | 1.946 |
| 1989-12-29 | 1.963 |
| 1990-01-02 | 1.947 |
| 1990-01-03 | 1.958 |
| 1990-01-04 | 1.953 |
| 1990-01-05 | 1.946 |
| 1990-01-08 | 1.936 |
| 1990-01-09 | 1.928 |
| 1990-01-10 | 1.926 |
| 1990-01-11 | 1.942 |
| 1990-01-12 | 1.94 |
| 1990-01-15 | 1.937 |
| 1990-01-16 | 1.943 |
| 1990-01-17 | 1.947 |
| 1990-01-18 | 1.948 |
| 1990-01-19 | 1.96 |
| 1990-01-22 | 1.958 |
| 1990-01-23 | 1.953 |
| 1990-01-24 | 1.948 |
| 1990-01-25 | 1.944 |
| 1990-01-26 | 1.948 |
| 1990-01-29 | 1.94 |
| 1990-01-30 | 1.946 |
| 1990-01-31 | 1.942 |
| 1990-02-01 | 1.936 |
| 1990-02-02 | 1.937 |
| 1990-02-05 | 1.938 |
| 1990-02-06 | 1.93 |
| 1990-02-07 | 1.932 |
| 1990-02-08 | 1.934 |
| 1990-02-09 | 1.939 |
| 1990-02-12 | 1.945 |
| 1990-02-13 | 1.95 |
| 1990-02-14 | 1.948 |
| 1990-02-15 | 1.938 |
| 1990-02-16 | 1.942 |
| 1990-02-19 | 1.94 |
| 1990-02-20 | 1.942 |
| 1990-02-21 | 1.949 |
| 1990-02-22 | 1.954 |
| 1990-02-23 | 1.958 |
| 1990-02-26 | 1.958 |
| 1990-02-27 | 1.953 |
| 1990-02-28 | 1.958 |
| 1990-03-01 | 1.963 |
| 1990-03-02 | 2.009 |
| 1990-03-05 | 2.043 |
| 1990-03-06 | 2.018 |
| 1990-03-07 | 2.018 |
| 1990-03-08 | 2.005 |
| 1990-03-09 | 2.013 |
| 1990-03-12 | 2.022 |
| 1990-03-13 | 2.025 |
| 1990-03-14 | 2.022 |
| 1990-03-15 | 2.015 |
| 1990-03-16 | 2.007 |
| 1990-03-19 | 2.009 |
| 1990-03-20 | 2.005 |
| 1990-03-21 | 2.022 |
| 1990-03-22 | 2.021 |
| 1990-03-23 | 2.024 |
| 1990-03-26 | 2.018 |
| 1990-03-27 | 2.013 |
| 1990-03-28 | 2.012 |
| 1990-03-29 | 2.001 |
| 1990-03-30 | 1.994 |
| 1990-04-02 | 1.999 |
| 1990-04-03 | 2 |
| 1990-04-04 | 2 |
| 1990-04-05 | 1.995 |
| 1990-04-06 | 1.996 |
| 1990-04-09 | 2.006 |
| 1990-04-11 | 2.004 |
| 1990-04-12 | 2 |
| 1990-04-13 | 2.002 |
| 1990-04-17 | 2.014 |
| 1990-04-18 | 2.006 |
| 1990-04-19 | 2 |
| 1990-04-20 | 2.008 |
| 1990-04-23 | 2.02 |
| 1990-04-24 | 2.019 |
| 1990-04-25 | 2.022 |
| 1990-04-26 | 2.011 |
| 1990-04-27 | 2.009 |
| 1990-05-01 | 2.012 |
| 1990-05-02 | 2.019 |
| 1990-05-03 | 2.013 |
| 1990-05-04 | 2.02 |
| 1990-05-07 | 2.017 |
| 1990-05-08 | 2.007 |
| 1990-05-09 | 2.007 |
| 1990-05-10 | 2.008 |
| 1990-05-11 | 2.012 |
| 1990-05-14 | 2.008 |
| 1990-05-15 | 2.013 |
| 1990-05-16 | 2.019 |
| 1990-05-17 | 2.009 |
| 1990-05-18 | 2.022 |
| 1990-05-21 | 2.032 |
| 1990-05-22 | 2.028 |
| 1990-05-23 | 2.027 |
| 1990-05-24 | 2.02 |
| 1990-05-25 | 2.025 |
| 1990-05-28 | 2.022 |
| 1990-05-29 | 2.031 |
| 1990-05-31 | 2.027 |
| 1990-06-01 | 2.022 |
| 1990-06-04 | 2.022 |
| 1990-06-05 | 2.023 |
| 1990-06-06 | 2.041 |
| 1990-06-07 | 2.056 |
| 1990-06-08 | 2.069 |
| 1990-06-11 | 2.073 |
| 1990-06-12 | 2.064 |
| 1990-06-13 | 2.071 |
| 1990-06-15 | 2.064 |
| 1990-06-18 | 2.058 |
| 1990-06-19 | 2.043 |
| 1990-06-20 | 2.05 |
| 1990-06-21 | 2.059 |
| 1990-06-22 | 2.069 |
| 1990-06-25 | 2.098 |
| 1990-06-26 | 2.099 |
| 1990-06-27 | 2.09 |
| 1990-06-28 | 2.06 |
| 1990-06-29 | 2.078 |
| 1990-07-02 | 2.054 |
| 1990-07-03 | 2.07 |
| 1990-07-04 | 2.063 |
| 1990-07-05 | 2.073 |
| 1990-07-06 | 2.074 |
| 1990-07-09 | 2.061 |
| 1990-07-10 | 2.054 |
| 1990-07-11 | 2.061 |
| 1990-07-12 | 2.063 |
| 1990-07-13 | 2.05 |
| 1990-07-16 | 2.069 |
| 1990-07-17 | 2.056 |
| 1990-07-18 | 2.052 |
| 1990-07-19 | 2.061 |
| 1990-07-20 | 2.067 |
| 1990-07-23 | 2.067 |
| 1990-07-24 | 2.067 |
| 1990-07-25 | 2.069 |
| 1990-07-26 | 2.072 |
| 1990-07-27 | 2.063 |
| 1990-07-30 | 2.051 |
| 1990-08-01 | 2.031 |
| 1990-08-02 | 2.04 |
| 1990-08-03 | 2.027 |
| 1990-08-06 | 2.018 |
| 1990-08-07 | 2.03 |
| 1990-08-08 | 2.04 |
| 1990-08-09 | 2.032 |
| 1990-08-10 | 2.045 |
| 1990-08-13 | 2.035 |
| 1990-08-14 | 2.02 |
| 1990-08-15 | 2.001 |
| 1990-08-16 | 2.012 |
| 1990-08-17 | 2.014 |
| 1990-08-20 | 2.023 |
| 1990-08-21 | 2.03 |
| 1990-08-22 | 2.02 |
| 1990-08-23 | 2.017 |
| 1990-08-24 | 2.016 |
| 1990-08-27 | 2.03 |
| 1990-08-28 | 2.047 |
| 1990-08-29 | 2.057 |
| 1990-08-30 | 2.064 |
| 1990-08-31 | 2.043 |
| 1990-09-03 | 2.042 |
| 1990-09-04 | 2.027 |
| 1990-09-05 | 2.026 |
| 1990-09-06 | 2.018 |
| 1990-09-07 | 2.023 |
| 1990-09-10 | 2.08 |
| 1990-09-11 | 2.084 |
| 1990-09-12 | 2.071 |
| 1990-09-13 | 2.067 |
| 1990-09-14 | 2.055 |
| 1990-09-17 | 2.047 |
| 1990-09-18 | 2.047 |
| 1990-09-19 | 2.045 |
| 1990-09-24 | 2.061 |
| 1990-09-25 | 2.05 |
| 1990-09-26 | 2.058 |
| 1990-09-27 | 2.057 |
| 1990-10-01 | 2.047 |
| 1990-10-02 | 2.05 |
| 1990-10-03 | 2.047 |
| 1990-10-05 | 2.037 |
| 1990-10-08 | 2.025 |
| 1990-10-09 | 2.021 |
| 1990-10-10 | 2.023 |
| 1990-10-12 | 2.022 |
| 1990-10-15 | 2.021 |
| 1990-10-16 | 2.024 |
| 1990-10-17 | 2.01 |
| 1990-10-18 | 2.01 |
| 1990-10-19 | 2.013 |
| 1990-10-22 | 2.015 |
| 1990-10-23 | 2.022 |
| 1990-10-24 | 2.028 |
| 1990-10-25 | 2.013 |
| 1990-10-26 | 2.028 |
| 1990-10-29 | 2.016 |
| 1990-10-30 | 2.022 |
| 1990-10-31 | 2.022 |
| 1990-11-01 | 2.028 |
| 1990-11-02 | 2.015 |
| 1990-11-05 | 2.009 |
| 1990-11-06 | 2.006 |
| 1990-11-07 | 2.004 |
| 1990-11-08 | 2.009 |
| 1990-11-09 | 2.011 |
| 1990-11-12 | 2.003 |
| 1990-11-13 | 2.003 |
| 1990-11-14 | 2.004 |
| 1990-11-15 | 2.004 |
| 1990-11-16 | 2.006 |
| 1990-11-19 | 1.998 |
| 1990-11-20 | 2.002 |
| 1990-11-21 | 2 |
| 1990-11-22 | 2.002 |
| 1990-11-23 | 2.011 |
| 1990-11-26 | 2.012 |
| 1990-11-27 | 2.021 |
| 1990-11-28 | 2.007 |
| 1990-11-29 | 2.007 |
| 1990-11-30 | 2.023 |
| 1990-12-03 | 2.022 |
| 1990-12-04 | 2.026 |
| 1990-12-05 | 2.018 |
| 1990-12-06 | 2.025 |
| 1990-12-07 | 2.012 |
| 1990-12-10 | 2.003 |
| 1990-12-11 | 2.018 |
| 1990-12-12 | 2.018 |
| 1990-12-13 | 2.016 |
| 1990-12-14 | 2.018 |
| 1990-12-17 | 2.02 |
| 1990-12-18 | 2.023 |
| 1990-12-19 | 2.018 |
| 1990-12-20 | 2.035 |
| 1990-12-21 | 2.05 |
| 1990-12-24 | 2.072 |
| 1990-12-27 | 2.078 |
| 1990-12-28 | 2.074 |
| 1990-12-31 | 2.048 |
| 1991-01-02 | 2.033 |
| 1991-01-03 | 2.024 |
| 1991-01-04 | 2.028 |
| 1991-01-07 | 2.042 |
| 1991-01-08 | 2.046 |
| 1991-01-09 | 2.046 |
| 1991-01-10 | 2.036 |
| 1991-01-11 | 2.04 |
| 1991-01-14 | 2.048 |
| 1991-01-15 | 2.043 |
| 1991-01-16 | 2.045 |
| 1991-01-17 | 2.032 |
| 1991-01-18 | 2.028 |
| 1991-01-21 | 2.023 |
| 1991-01-22 | 2.018 |
| 1991-01-23 | 2.025 |
| 1991-01-24 | 2.011 |
| 1991-01-25 | 2.015 |
| 1991-01-28 | 2.011 |
| 1991-01-29 | 2.009 |
| 1991-01-30 | 2.014 |
| 1991-01-31 | 2.012 |
| 1991-02-01 | 2.006 |
| 1991-02-04 | 2.002 |
| 1991-02-05 | 1.998 |
| 1991-02-06 | 1.998 |
| 1991-02-07 | 1.996 |
| 1991-02-08 | 1.998 |
| 1991-02-11 | 1.994 |
| 1991-02-12 | 1.994 |
| 1991-02-13 | 1.996 |
| 1991-02-14 | 1.999 |
| 1991-02-15 | 2.002 |
| 1991-02-18 | 2.007 |
| 1991-02-19 | 2.014 |
| 1991-02-20 | 2.014 |
| 1991-02-21 | 2.02 |
| 1991-02-22 | 2.017 |
| 1991-02-25 | 2.026 |
| 1991-02-26 | 2.031 |
| 1991-02-27 | 2.034 |
| 1991-03-01 | 2.039 |
| 1991-03-04 | 2.046 |
| 1991-03-05 | 2.042 |
| 1991-03-06 | 2.053 |
| 1991-03-07 | 2.048 |
| 1991-03-08 | 2.055 |
| 1991-03-11 | 2.192 |
| 1991-03-12 | 2.182 |
| 1991-03-13 | 2.183 |
| 1991-03-14 | 2.183 |
| 1991-03-15 | 2.192 |
| 1991-03-18 | 2.203 |
| 1991-03-19 | 2.218 |
| 1991-03-20 | 2.226 |
| 1991-03-21 | 2.215 |
| 1991-03-22 | 2.216 |
| 1991-03-25 | 2.23 |
| 1991-03-26 | 2.249 |
| 1991-03-27 | 2.243 |
| 1991-03-28 | 2.261 |
| 1991-04-02 | 2.246 |
| 1991-04-03 | 2.237 |
| 1991-04-04 | 2.242 |
| 1991-04-08 | 2.247 |
| 1991-04-09 | 2.244 |
| 1991-04-10 | 2.232 |
| 1991-04-11 | 2.241 |
| 1991-04-12 | 2.234 |
| 1991-04-15 | 2.235 |
| 1991-04-16 | 2.228 |
| 1991-04-17 | 2.23 |
| 1991-04-19 | 2.263 |
| 1991-04-22 | 2.283 |
| 1991-04-23 | 2.297 |
| 1991-04-24 | 2.29 |
| 1991-04-25 | 2.296 |
| 1991-04-26 | 2.3 |
| 1991-04-29 | 2.322 |
| 1991-04-30 | 2.3 |
| 1991-05-01 | 2.273 |
| 1991-05-02 | 2.28 |
| 1991-05-03 | 2.289 |
| 1991-05-06 | 2.315 |
| 1991-05-07 | 2.322 |
| 1991-05-08 | 2.362 |
| 1991-05-09 | 2.34 |
| 1991-05-10 | 2.36 |
| 1991-05-13 | 2.36 |
| 1991-05-14 | 2.367 |
| 1991-05-15 | 2.36 |
| 1991-05-16 | 2.364 |
| 1991-05-17 | 2.379 |
| 1991-05-20 | 2.403 |
| 1991-05-21 | 2.407 |
| 1991-05-22 | 2.4 |
| 1991-05-23 | 2.415 |
| 1991-05-24 | 2.409 |
| 1991-05-27 | 2.396 |
| 1991-05-28 | 2.4 |
| 1991-05-29 | 2.385 |
| 1991-05-30 | 2.369 |
| 1991-05-31 | 2.386 |
| 1991-06-03 | 2.408 |
| 1991-06-04 | 2.411 |
| 1991-06-05 | 2.401 |
| 1991-06-06 | 2.401 |
| 1991-06-07 | 2.393 |
| 1991-06-10 | 2.401 |
| 1991-06-11 | 2.402 |
| 1991-06-12 | 2.406 |
| 1991-06-13 | 2.408 |
| 1991-06-14 | 2.393 |
| 1991-06-17 | 2.403 |
| 1991-06-18 | 2.412 |
| 1991-06-19 | 2.398 |
| 1991-06-20 | 2.386 |
| 1991-06-21 | 2.398 |
| 1991-06-24 | 2.393 |
| 1991-06-25 | 2.387 |
| 1991-06-26 | 2.389 |
| 1991-06-27 | 2.387 |
| 1991-06-28 | 2.395 |
| 1991-07-01 | 2.398 |
| 1991-07-02 | 2.397 |
| 1991-07-03 | 2.405 |
| 1991-07-04 | 2.397 |
| 1991-07-05 | 2.402 |
| 1991-07-08 | 2.393 |
| 1991-07-09 | 2.383 |
| 1991-07-10 | 2.389 |
| 1991-07-11 | 2.388 |
| 1991-07-12 | 2.399 |
| 1991-07-15 | 2.377 |
| 1991-07-16 | 2.379 |
| 1991-07-17 | 2.379 |
| 1991-07-18 | 2.374 |
| 1991-07-19 | 2.368 |
| 1991-07-22 | 2.375 |
| 1991-07-23 | 2.375 |
| 1991-07-24 | 2.359 |
| 1991-07-25 | 2.353 |
| 1991-07-26 | 2.361 |
| 1991-07-29 | 2.364 |
| 1991-07-30 | 2.354 |
| 1991-07-31 | 2.359 |
| 1991-08-01 | 2.346 |
| 1991-08-02 | 2.351 |
| 1991-08-05 | 2.347 |
| 1991-08-06 | 2.335 |
| 1991-08-07 | 2.331 |
| 1991-08-08 | 2.321 |
| 1991-08-09 | 2.323 |
| 1991-08-12 | 2.33 |
| 1991-08-13 | 2.325 |
| 1991-08-14 | 2.32 |
| 1991-08-15 | 2.319 |
| 1991-08-16 | 2.331 |
| 1991-08-19 | 2.373 |
| 1991-08-20 | 2.378 |
| 1991-08-21 | 2.362 |
| 1991-08-22 | 2.346 |
| 1991-08-23 | 2.345 |
| 1991-08-26 | 2.345 |
| 1991-08-27 | 2.342 |
| 1991-08-28 | 2.343 |
| 1991-08-29 | 2.324 |
| 1991-08-30 | 2.332 |
| 1991-09-02 | 2.327 |
| 1991-09-03 | 2.333 |
| 1991-09-04 | 2.325 |
| 1991-09-05 | 2.327 |
| 1991-09-06 | 2.317 |
| 1991-09-11 | 2.306 |
| 1991-09-12 | 2.31 |
| 1991-09-13 | 2.304 |
| 1991-09-16 | 2.311 |
| 1991-09-19 | 2.325 |
| 1991-09-20 | 2.339 |
| 1991-09-24 | 2.341 |
| 1991-09-25 | 2.348 |
| 1991-09-26 | 2.358 |
| 1991-09-27 | 2.393 |
| 1991-10-01 | 2.385 |
| 1991-10-02 | 2.383 |
| 1991-10-03 | 2.381 |
| 1991-10-04 | 2.38 |
| 1991-10-07 | 2.39 |
| 1991-10-08 | 2.393 |
| 1991-10-09 | 2.409 |
| 1991-10-10 | 2.405 |
| 1991-10-11 | 2.412 |
| 1991-10-14 | 2.415 |
| 1991-10-15 | 2.43 |
| 1991-10-16 | 2.435 |
| 1991-10-17 | 2.436 |
| 1991-10-18 | 2.435 |
| 1991-10-21 | 2.436 |
| 1991-10-22 | 2.445 |
| 1991-10-23 | 2.454 |
| 1991-10-24 | 2.456 |
| 1991-10-25 | 2.452 |
| 1991-10-28 | 2.451 |
| 1991-10-29 | 2.439 |
| 1991-10-30 | 2.414 |
| 1991-10-31 | 2.402 |
| 1991-11-01 | 2.395 |
| 1991-11-04 | 2.377 |
| 1991-11-05 | 2.374 |
| 1991-11-06 | 2.373 |
| 1991-11-07 | 2.37 |
| 1991-11-08 | 2.369 |
| 1991-11-11 | 2.369 |
| 1991-11-12 | 2.359 |
| 1991-11-13 | 2.359 |
| 1991-11-14 | 2.353 |
| 1991-11-15 | 2.35 |
| 1991-11-18 | 2.334 |
| 1991-11-19 | 2.332 |
| 1991-11-20 | 2.326 |
| 1991-11-21 | 2.325 |
| 1991-11-22 | 2.321 |
| 1991-11-25 | 2.314 |
| 1991-11-26 | 2.319 |
| 1991-11-27 | 2.329 |
| 1991-11-28 | 2.335 |
| 1991-11-29 | 2.345 |
| 1991-12-02 | 2.336 |
| 1991-12-03 | 2.337 |
| 1991-12-04 | 2.334 |
| 1991-12-05 | 2.327 |
| 1991-12-06 | 2.321 |
| 1991-12-09 | 2.311 |
| 1991-12-10 | 2.306 |
| 1991-12-11 | 2.319 |
| 1991-12-12 | 2.312 |
| 1991-12-13 | 2.313 |
| 1991-12-16 | 2.312 |
| 1991-12-17 | 2.31 |
| 1991-12-18 | 2.307 |
| 1991-12-19 | 2.312 |
| 1991-12-20 | 2.304 |
| 1991-12-23 | 2.287 |
| 1991-12-24 | 2.28 |
| 1991-12-27 | 2.277 |
| 1991-12-30 | 2.285 |
| 1991-12-31 | 2.283 |
| 1992-01-02 | 2.281 |
| 1992-01-03 | 2.287 |
| 1992-01-06 | 2.282 |
| 1992-01-07 | 2.271 |
| 1992-01-08 | 2.267 |
| 1992-01-09 | 2.268 |
| 1992-01-10 | 2.288 |
| 1992-01-13 | 2.297 |
| 1992-01-14 | 2.293 |
| 1992-01-15 | 2.313 |
| 1992-01-16 | 2.315 |
| 1992-01-17 | 2.325 |
| 1992-01-20 | 2.295 |
| 1992-01-21 | 2.298 |
| 1992-01-22 | 2.302 |
| 1992-01-23 | 2.305 |
| 1992-01-24 | 2.316 |
| 1992-01-27 | 2.313 |
| 1992-01-28 | 2.316 |
| 1992-01-29 | 2.304 |
| 1992-01-30 | 2.313 |
| 1992-01-31 | 2.316 |
| 1992-02-03 | 2.312 |
| 1992-02-04 | 2.309 |
| 1992-02-05 | 2.302 |
| 1992-02-06 | 2.292 |
| 1992-02-07 | 2.298 |
| 1992-02-10 | 2.29 |
| 1992-02-11 | 2.308 |
| 1992-02-12 | 2.313 |
| 1992-02-13 | 2.315 |
| 1992-02-14 | 2.328 |
| 1992-02-17 | 2.32 |
| 1992-02-18 | 2.339 |
| 1992-02-19 | 2.344 |
| 1992-02-20 | 2.357 |
| 1992-02-21 | 2.353 |
| 1992-02-24 | 2.369 |
| 1992-02-25 | 2.364 |
| 1992-02-26 | 2.374 |
| 1992-02-27 | 2.366 |
| 1992-02-28 | 2.359 |
| 1992-03-02 | 2.365 |
| 1992-03-03 | 2.377 |
| 1992-03-04 | 2.384 |
| 1992-03-05 | 2.395 |
| 1992-03-06 | 2.398 |
| 1992-03-09 | 2.399 |
| 1992-03-10 | 2.397 |
| 1992-03-11 | 2.408 |
| 1992-03-12 | 2.403 |
| 1992-03-13 | 2.401 |
| 1992-03-16 | 2.405 |
| 1992-03-17 | 2.399 |
| 1992-03-18 | 2.402 |
| 1992-03-23 | 2.422 |
| 1992-03-24 | 2.422 |
| 1992-03-25 | 2.416 |
| 1992-03-26 | 2.413 |
| 1992-03-27 | 2.417 |
| 1992-03-30 | 2.41 |
| 1992-03-31 | 2.404 |
| 1992-04-01 | 2.399 |
| 1992-04-02 | 2.396 |
| 1992-04-03 | 2.384 |
| 1992-04-06 | 2.383 |
| 1992-04-07 | 2.393 |
| 1992-04-08 | 2.388 |
| 1992-04-09 | 2.391 |
| 1992-04-10 | 2.381 |
| 1992-04-13 | 2.395 |
| 1992-04-14 | 2.398 |
| 1992-04-15 | 2.4 |
| 1992-04-16 | 2.401 |
| 1992-04-21 | 2.418 |
| 1992-04-22 | 2.421 |
| 1992-04-23 | 2.423 |
| 1992-04-27 | 2.424 |
| 1992-04-28 | 2.428 |
| 1992-04-29 | 2.427 |
| 1992-04-30 | 2.429 |
| 1992-05-01 | 2.418 |
| 1992-05-04 | 2.426 |
| 1992-05-05 | 2.426 |
| 1992-05-06 | 2.428 |
| 1992-05-08 | 2.421 |
| 1992-05-11 | 2.439 |
| 1992-05-12 | 2.432 |
| 1992-05-13 | 2.426 |
| 1992-05-14 | 2.431 |
| 1992-05-15 | 2.437 |
| 1992-05-18 | 2.42 |
| 1992-05-19 | 2.414 |
| 1992-05-20 | 2.421 |
| 1992-05-21 | 2.436 |
| 1992-05-22 | 2.446 |
| 1992-05-25 | 2.447 |
| 1992-05-26 | 2.451 |
| 1992-05-27 | 2.47 |
| 1992-05-28 | 2.472 |
| 1992-05-29 | 2.459 |
| 1992-06-01 | 2.451 |
| 1992-06-02 | 2.463 |
| 1992-06-03 | 2.46 |
| 1992-06-04 | 2.459 |
| 1992-06-05 | 2.451 |
| 1992-06-08 | 2.451 |
| 1992-06-09 | 2.448 |
| 1992-06-10 | 2.458 |
| 1992-06-11 | 2.457 |
| 1992-06-12 | 2.452 |
| 1992-06-15 | 2.448 |
| 1992-06-16 | 2.453 |
| 1992-06-17 | 2.45 |
| 1992-06-18 | 2.463 |
| 1992-06-19 | 2.454 |
| 1992-06-22 | 2.463 |
| 1992-06-24 | 2.456 |
| 1992-06-25 | 2.452 |
| 1992-06-26 | 2.449 |
| 1992-06-29 | 2.441 |
| 1992-06-30 | 2.444 |
| 1992-07-01 | 2.437 |
| 1992-07-02 | 2.44 |
| 1992-07-03 | 2.438 |
| 1992-07-06 | 2.45 |
| 1992-07-07 | 2.438 |
| 1992-07-08 | 2.428 |
| 1992-07-09 | 2.432 |
| 1992-07-10 | 2.451 |
| 1992-07-13 | 2.431 |
| 1992-07-14 | 2.442 |
| 1992-07-15 | 2.449 |
| 1992-07-16 | 2.445 |
| 1992-07-17 | 2.441 |
| 1992-07-20 | 2.428 |
| 1992-07-21 | 2.459 |
| 1992-07-22 | 2.458 |
| 1992-07-23 | 2.459 |
| 1992-07-24 | 2.457 |
| 1992-07-27 | 2.461 |
| 1992-07-28 | 2.453 |
| 1992-07-29 | 2.451 |
| 1992-07-30 | 2.46 |
| 1992-07-31 | 2.446 |
| 1992-08-03 | 2.446 |
| 1992-08-04 | 2.45 |
| 1992-08-05 | 2.452 |
| 1992-08-06 | 2.461 |
| 1992-08-07 | 2.456 |
| 1992-08-10 | 2.451 |
| 1992-08-11 | 2.449 |
| 1992-08-12 | 2.457 |
| 1992-08-13 | 2.453 |
| 1992-08-14 | 2.449 |
| 1992-08-17 | 2.454 |
| 1992-08-18 | 2.446 |
| 1992-08-19 | 2.446 |
| 1992-08-20 | 2.442 |
| 1992-08-21 | 2.442 |
| 1992-08-24 | 2.423 |
| 1992-08-25 | 2.414 |
| 1992-08-26 | 2.415 |
| 1992-08-27 | 2.419 |
| 1992-08-28 | 2.413 |
| 1992-08-31 | 2.414 |
| 1992-09-01 | 2.408 |
| 1992-09-02 | 2.4 |
| 1992-09-03 | 2.402 |
| 1992-09-04 | 2.422 |
| 1992-09-07 | 2.409 |
| 1992-09-08 | 2.404 |
| 1992-09-09 | 2.411 |
| 1992-09-10 | 2.423 |
| 1992-09-11 | 2.429 |
| 1992-09-14 | 2.467 |
| 1992-09-15 | 2.453 |
| 1992-09-16 | 2.463 |
| 1992-09-17 | 2.491 |
| 1992-09-18 | 2.49 |
| 1992-09-21 | 2.491 |
| 1992-09-22 | 2.486 |
| 1992-09-23 | 2.503 |
| 1992-09-24 | 2.493 |
| 1992-09-25 | 2.487 |
| 1992-09-30 | 2.439 |
| 1992-10-01 | 2.441 |
| 1992-10-02 | 2.445 |
| 1992-10-05 | 2.445 |
| 1992-10-08 | 2.486 |
| 1992-10-09 | 2.489 |
| 1992-10-13 | 2.49 |
| 1992-10-14 | 2.477 |
| 1992-10-15 | 2.473 |
| 1992-10-16 | 2.48 |
| 1992-10-20 | 2.514 |
| 1992-10-21 | 2.521 |
| 1992-10-22 | 2.52 |
| 1992-10-23 | 2.509 |
| 1992-10-26 | 2.538 |
| 1992-10-27 | 2.542 |
| 1992-10-28 | 2.544 |
| 1992-10-29 | 2.553 |
| 1992-10-30 | 2.555 |
| 1992-11-02 | 2.573 |
| 1992-11-03 | 2.608 |
| 1992-11-04 | 2.603 |
| 1992-11-05 | 2.609 |
| 1992-11-06 | 2.618 |
| 1992-11-09 | 2.635 |
| 1992-11-10 | 2.643 |
| 1992-11-11 | 2.635 |
| 1992-11-12 | 2.635 |
| 1992-11-13 | 2.635 |
| 1992-11-16 | 2.642 |
| 1992-11-17 | 2.652 |
| 1992-11-18 | 2.647 |
| 1992-11-19 | 2.647 |
| 1992-11-20 | 2.649 |
| 1992-11-23 | 2.681 |
| 1992-11-24 | 2.688 |
| 1992-11-25 | 2.696 |
| 1992-11-26 | 2.696 |
| 1992-11-27 | 2.706 |
| 1992-11-30 | 2.708 |
| 1992-12-01 | 2.7 |
| 1992-12-02 | 2.69 |
| 1992-12-03 | 2.69 |
| 1992-12-04 | 2.68 |
| 1992-12-07 | 2.69 |
| 1992-12-08 | 2.672 |
| 1992-12-09 | 2.676 |
| 1992-12-10 | 2.685 |
| 1992-12-11 | 2.689 |
| 1992-12-14 | 2.683 |
| 1992-12-15 | 2.685 |
| 1992-12-16 | 2.678 |
| 1992-12-17 | 2.675 |
| 1992-12-18 | 2.683 |
| 1992-12-21 | 2.686 |
| 1992-12-22 | 2.7 |
| 1992-12-23 | 2.712 |
| 1992-12-24 | 2.715 |
| 1992-12-28 | 2.737 |
| 1992-12-29 | 2.751 |
| 1992-12-30 | 2.757 |
| 1992-12-31 | 2.764 |
| 1993-01-04 | 2.788 |
| 1993-01-05 | 2.792 |
| 1993-01-06 | 2.783 |
| 1993-01-07 | 2.79 |
| 1993-01-08 | 2.801 |
| 1993-01-11 | 2.793 |
| 1993-01-12 | 2.787 |
| 1993-01-13 | 2.795 |
| 1993-01-14 | 2.788 |
| 1993-01-15 | 2.789 |
| 1993-01-18 | 2.792 |
| 1993-01-19 | 2.782 |
| 1993-01-20 | 2.777 |
| 1993-01-21 | 2.777 |
| 1993-01-22 | 2.78 |
| 1993-01-25 | 2.766 |
| 1993-01-26 | 2.753 |
| 1993-01-27 | 2.764 |
| 1993-01-28 | 2.76 |
| 1993-01-29 | 2.765 |
| 1993-02-01 | 2.796 |
| 1993-02-02 | 2.794 |
| 1993-02-03 | 2.804 |
| 1993-02-04 | 2.808 |
| 1993-02-05 | 2.813 |
| 1993-02-08 | 2.81 |
| 1993-02-09 | 2.818 |
| 1993-02-10 | 2.811 |
| 1993-02-11 | 2.814 |
| 1993-02-12 | 2.811 |
| 1993-02-15 | 2.815 |
| 1993-02-16 | 2.807 |
| 1993-02-17 | 2.797 |
| 1993-02-18 | 2.808 |
| 1993-02-19 | 2.803 |
| 1993-02-22 | 2.798 |
| 1993-02-23 | 2.793 |
| 1993-02-24 | 2.789 |
| 1993-02-25 | 2.787 |
| 1993-02-26 | 2.795 |
| 1993-03-01 | 2.796 |
| 1993-03-02 | 2.792 |
| 1993-03-03 | 2.779 |
| 1993-03-04 | 2.788 |
| 1993-03-05 | 2.789 |
| 1993-03-08 | 2.803 |
| 1993-03-09 | 2.8 |
| 1993-03-10 | 2.803 |
| 1993-03-11 | 2.805 |
| 1993-03-12 | 2.803 |
| 1993-03-15 | 2.803 |
| 1993-03-16 | 2.796 |
| 1993-03-17 | 2.795 |
| 1993-03-18 | 2.797 |
| 1993-03-19 | 2.781 |
| 1993-03-22 | 2.777 |
| 1993-03-23 | 2.776 |
| 1993-03-24 | 2.776 |
| 1993-03-25 | 2.783 |
| 1993-03-26 | 2.788 |
| 1993-03-29 | 2.779 |
| 1993-03-30 | 2.778 |
| 1993-03-31 | 2.768 |
| 1993-04-01 | 2.764 |
| 1993-04-02 | 2.745 |
| 1993-04-05 | 2.755 |
| 1993-04-07 | 2.76 |
| 1993-04-08 | 2.761 |
| 1993-04-13 | 2.743 |
| 1993-04-14 | 2.739 |
| 1993-04-15 | 2.744 |
| 1993-04-16 | 2.747 |
| 1993-04-19 | 2.751 |
| 1993-04-20 | 2.736 |
| 1993-04-21 | 2.74 |
| 1993-04-22 | 2.738 |
| 1993-04-23 | 2.734 |
| 1993-04-27 | 2.721 |
| 1993-04-28 | 2.741 |
| 1993-04-29 | 2.733 |
| 1993-04-30 | 2.728 |
| 1993-05-03 | 2.729 |
| 1993-05-04 | 2.723 |
| 1993-05-05 | 2.72 |
| 1993-05-06 | 2.724 |
| 1993-05-07 | 2.718 |
| 1993-05-10 | 2.725 |
| 1993-05-11 | 2.74 |
| 1993-05-12 | 2.745 |
| 1993-05-13 | 2.743 |
| 1993-05-14 | 2.738 |
| 1993-05-17 | 2.732 |
| 1993-05-18 | 2.748 |
| 1993-05-19 | 2.742 |
| 1993-05-20 | 2.739 |
| 1993-05-21 | 2.736 |
| 1993-05-24 | 2.749 |
| 1993-05-25 | 2.747 |
| 1993-05-27 | 2.735 |
| 1993-05-28 | 2.729 |
| 1993-06-01 | 2.721 |
| 1993-06-02 | 2.72 |
| 1993-06-03 | 2.727 |
| 1993-06-04 | 2.726 |
| 1993-06-07 | 2.747 |
| 1993-06-08 | 2.744 |
| 1993-06-09 | 2.747 |
| 1993-06-10 | 2.751 |
| 1993-06-11 | 2.747 |
| 1993-06-14 | 2.741 |
| 1993-06-15 | 2.744 |
| 1993-06-16 | 2.757 |
| 1993-06-17 | 2.767 |
| 1993-06-18 | 2.772 |
| 1993-06-21 | 2.799 |
| 1993-06-22 | 2.8 |
| 1993-06-23 | 2.81 |
| 1993-06-24 | 2.814 |
| 1993-06-25 | 2.805 |
| 1993-06-28 | 2.82 |
| 1993-06-29 | 2.811 |
| 1993-06-30 | 2.805 |
| 1993-07-01 | 2.813 |
| 1993-07-02 | 2.802 |
| 1993-07-05 | 2.811 |
| 1993-07-06 | 2.811 |
| 1993-07-07 | 2.807 |
| 1993-07-08 | 2.81 |
| 1993-07-09 | 2.811 |
| 1993-07-12 | 2.829 |
| 1993-07-13 | 2.823 |
| 1993-07-14 | 2.82 |
| 1993-07-15 | 2.811 |
| 1993-07-16 | 2.817 |
| 1993-07-19 | 2.808 |
| 1993-07-20 | 2.804 |
| 1993-07-21 | 2.797 |
| 1993-07-22 | 2.8 |
| 1993-07-23 | 2.805 |
| 1993-07-26 | 2.865 |
| 1993-07-28 | 2.871 |
| 1993-07-29 | 2.864 |
| 1993-07-30 | 2.872 |
| 1993-08-02 | 2.874 |
| 1993-08-03 | 2.859 |
| 1993-08-04 | 2.858 |
| 1993-08-05 | 2.858 |
| 1993-08-06 | 2.859 |
| 1993-08-09 | 2.852 |
| 1993-08-10 | 2.856 |
| 1993-08-11 | 2.862 |
| 1993-08-12 | 2.862 |
| 1993-08-13 | 2.86 |
| 1993-08-16 | 2.856 |
| 1993-08-17 | 2.842 |
| 1993-08-18 | 2.846 |
| 1993-08-19 | 2.843 |
| 1993-08-20 | 2.853 |
| 1993-08-23 | 2.85 |
| 1993-08-24 | 2.859 |
| 1993-08-25 | 2.864 |
| 1993-08-26 | 2.873 |
| 1993-08-27 | 2.865 |
| 1993-08-30 | 2.874 |
| 1993-08-31 | 2.873 |
| 1993-09-01 | 2.875 |
| 1993-09-02 | 2.863 |
| 1993-09-03 | 2.866 |
| 1993-09-06 | 2.849 |
| 1993-09-07 | 2.849 |
| 1993-09-08 | 2.853 |
| 1993-09-09 | 2.853 |
| 1993-09-10 | 2.843 |
| 1993-09-13 | 2.844 |
| 1993-09-14 | 2.852 |
| 1993-09-15 | 2.845 |
| 1993-09-20 | 2.85 |
| 1993-09-21 | 2.844 |
| 1993-09-22 | 2.86 |
| 1993-09-23 | 2.863 |
| 1993-09-27 | 2.876 |
| 1993-09-28 | 2.875 |
| 1993-09-29 | 2.864 |
| 1993-10-01 | 2.881 |
| 1993-10-04 | 2.876 |
| 1993-10-05 | 2.863 |
| 1993-10-06 | 2.875 |
| 1993-10-08 | 2.865 |
| 1993-10-11 | 2.851 |
| 1993-10-12 | 2.855 |
| 1993-10-13 | 2.859 |
| 1993-10-14 | 2.863 |
| 1993-10-15 | 2.872 |
| 1993-10-18 | 2.874 |
| 1993-10-19 | 2.884 |
| 1993-10-20 | 2.887 |
| 1993-10-21 | 2.889 |
| 1993-10-22 | 2.902 |
| 1993-10-25 | 2.91 |
| 1993-10-26 | 2.92 |
| 1993-10-27 | 2.916 |
| 1993-10-28 | 2.93 |
| 1993-10-29 | 2.923 |
| 1993-11-01 | 2.929 |
| 1993-11-02 | 2.935 |
| 1993-11-03 | 2.94 |
| 1993-11-04 | 2.935 |
| 1993-11-05 | 2.938 |
| 1993-11-08 | 2.934 |
| 1993-11-09 | 2.936 |
| 1993-11-10 | 2.945 |
| 1993-11-11 | 2.942 |
| 1993-11-12 | 2.944 |
| 1993-11-15 | 2.936 |
| 1993-11-16 | 2.943 |
| 1993-11-17 | 2.951 |
| 1993-11-18 | 2.945 |
| 1993-11-19 | 2.954 |
| 1993-11-22 | 2.959 |
| 1993-11-23 | 2.958 |
| 1993-11-24 | 2.948 |
| 1993-11-25 | 2.951 |
| 1993-11-26 | 2.96 |
| 1993-11-29 | 2.97 |
| 1993-11-30 | 2.971 |
| 1993-12-01 | 2.974 |
| 1993-12-02 | 2.969 |
| 1993-12-03 | 2.969 |
| 1993-12-06 | 2.966 |
| 1993-12-07 | 2.959 |
| 1993-12-08 | 2.964 |
| 1993-12-09 | 2.964 |
| 1993-12-10 | 2.962 |
| 1993-12-13 | 2.961 |
| 1993-12-14 | 2.968 |
| 1993-12-15 | 2.97 |
| 1993-12-16 | 2.97 |
| 1993-12-17 | 2.968 |
| 1993-12-20 | 2.976 |
| 1993-12-21 | 2.974 |
| 1993-12-22 | 2.978 |
| 1993-12-23 | 2.974 |
| 1993-12-24 | 2.974 |
| 1993-12-27 | 2.981 |
| 1993-12-28 | 2.983 |
| 1993-12-29 | 2.984 |
| 1993-12-30 | 2.998 |
| 1993-12-31 | 2.986 |
| 1994-01-03 | 2.986 |
| 1994-01-04 | 2.995 |
| 1994-01-05 | 2.987 |
| 1994-01-06 | 2.987 |
| 1994-01-07 | 2.987 |
| 1994-01-10 | 2.979 |
| 1994-01-11 | 2.986 |
| 1994-01-12 | 2.982 |
| 1994-01-13 | 2.975 |
| 1994-01-14 | 2.978 |
| 1994-01-17 | 2.977 |
| 1994-01-18 | 2.978 |
| 1994-01-19 | 2.975 |
| 1994-01-20 | 2.983 |
| 1994-01-21 | 2.979 |
| 1994-01-24 | 2.989 |
| 1994-01-25 | 2.987 |
| 1994-01-26 | 2.985 |
| 1994-01-27 | 2.999 |
| 1994-01-28 | 2.996 |
| 1994-01-31 | 2.987 |
| 1994-02-01 | 2.976 |
| 1994-02-02 | 2.975 |
| 1994-02-03 | 2.974 |
| 1994-02-04 | 2.979 |
| 1994-02-07 | 2.99 |
| 1994-02-08 | 2.988 |
| 1994-02-09 | 2.987 |
| 1994-02-10 | 2.991 |
| 1994-02-11 | 2.987 |
| 1994-02-14 | 2.978 |
| 1994-02-15 | 2.962 |
| 1994-02-16 | 2.963 |
| 1994-02-17 | 2.963 |
| 1994-02-18 | 2.958 |
| 1994-02-21 | 2.963 |
| 1994-02-22 | 2.972 |
| 1994-02-23 | 2.976 |
| 1994-02-24 | 2.993 |
| 1994-02-28 | 2.975 |
| 1994-03-01 | 2.965 |
| 1994-03-02 | 2.966 |
| 1994-03-03 | 2.965 |
| 1994-03-04 | 2.968 |
| 1994-03-07 | 2.986 |
| 1994-03-08 | 2.981 |
| 1994-03-09 | 2.975 |
| 1994-03-10 | 2.972 |
| 1994-03-11 | 2.969 |
| 1994-03-14 | 2.972 |
| 1994-03-15 | 2.975 |
| 1994-03-16 | 2.973 |
| 1994-03-17 | 2.97 |
| 1994-03-18 | 2.973 |
| 1994-03-21 | 2.981 |
| 1994-03-22 | 2.973 |
| 1994-03-23 | 2.974 |
| 1994-03-24 | 2.97 |
| 1994-03-25 | 2.962 |
| 1994-03-28 | 2.962 |
| 1994-03-29 | 2.974 |
| 1994-03-30 | 2.983 |
| 1994-03-31 | 2.969 |
| 1994-04-05 | 2.986 |
| 1994-04-06 | 2.994 |
| 1994-04-07 | 2.993 |
| 1994-04-08 | 2.994 |
| 1994-04-11 | 2.99 |
| 1994-04-12 | 2.993 |
| 1994-04-13 | 2.991 |
| 1994-04-15 | 2.987 |
| 1994-04-18 | 2.991 |
| 1994-04-19 | 2.988 |
| 1994-04-20 | 2.98 |
| 1994-04-21 | 2.972 |
| 1994-04-22 | 2.991 |
| 1994-04-25 | 2.995 |
| 1994-04-26 | 3.007 |
| 1994-04-27 | 3.013 |
| 1994-04-28 | 3.009 |
| 1994-04-29 | 3 |
| 1994-05-02 | 2.998 |
| 1994-05-03 | 3.001 |
| 1994-05-04 | 3.004 |
| 1994-05-05 | 3.012 |
| 1994-05-06 | 3.019 |
| 1994-05-09 | 3.009 |
| 1994-05-10 | 3.012 |
| 1994-05-11 | 3.021 |
| 1994-05-12 | 3.009 |
| 1994-05-13 | 3.011 |
| 1994-05-17 | 3.009 |
| 1994-05-18 | 3.01 |
| 1994-05-19 | 3.009 |
| 1994-05-20 | 3.013 |
| 1994-05-23 | 3.007 |
| 1994-05-24 | 3.019 |
| 1994-05-25 | 3.024 |
| 1994-05-26 | 3.023 |
| 1994-05-27 | 3.031 |
| 1994-05-30 | 3.04 |
| 1994-05-31 | 3.037 |
| 1994-06-01 | 3.035 |
| 1994-06-02 | 3.038 |
| 1994-06-03 | 3.044 |
| 1994-06-06 | 3.06 |
| 1994-06-07 | 3.059 |
| 1994-06-08 | 3.053 |
| 1994-06-09 | 3.051 |
| 1994-06-10 | 3.054 |
| 1994-06-13 | 3.056 |
| 1994-06-14 | 3.044 |
| 1994-06-15 | 3.046 |
| 1994-06-16 | 3.037 |
| 1994-06-17 | 3.057 |
| 1994-06-20 | 3.052 |
| 1994-06-21 | 3.05 |
| 1994-06-22 | 3.052 |
| 1994-06-23 | 3.057 |
| 1994-06-24 | 3.044 |
| 1994-06-27 | 3.042 |
| 1994-06-28 | 3.044 |
| 1994-06-29 | 3.032 |
| 1994-06-30 | 3.033 |
| 1994-07-01 | 3.035 |
| 1994-07-04 | 3.033 |
| 1994-07-05 | 3.031 |
| 1994-07-06 | 3.013 |
| 1994-07-07 | 3.016 |
| 1994-07-08 | 3.015 |
| 1994-07-11 | 3.002 |
| 1994-07-12 | 2.988 |
| 1994-07-13 | 2.994 |
| 1994-07-14 | 3.003 |
| 1994-07-15 | 3.007 |
| 1994-07-18 | 3.01 |
| 1994-07-19 | 3.02 |
| 1994-07-20 | 3.044 |
| 1994-07-21 | 3.037 |
| 1994-07-22 | 3.058 |
| 1994-07-25 | 3.054 |
| 1994-07-26 | 3.059 |
| 1994-07-27 | 3.051 |
| 1994-07-28 | 3.047 |
| 1994-07-29 | 3.057 |
| 1994-08-01 | 3.043 |
| 1994-08-02 | 3.047 |
| 1994-08-03 | 3.053 |
| 1994-08-04 | 3.043 |
| 1994-08-05 | 3.053 |
| 1994-08-08 | 3.045 |
| 1994-08-09 | 3.049 |
| 1994-08-10 | 3.042 |
| 1994-08-11 | 3.044 |
| 1994-08-12 | 3.028 |
| 1994-08-15 | 3.027 |
| 1994-08-16 | 3.032 |
| 1994-08-17 | 3.037 |
| 1994-08-18 | 3.028 |
| 1994-08-19 | 3.018 |
| 1994-08-22 | 3.019 |
| 1994-08-23 | 3.019 |
| 1994-08-24 | 3.022 |
| 1994-08-25 | 3.024 |
| 1994-08-26 | 3.019 |
| 1994-08-29 | 3.043 |
| 1994-08-30 | 3.04 |
| 1994-08-31 | 3.032 |
| 1994-09-01 | 3.031 |
| 1994-09-02 | 3.029 |
| 1994-09-05 | 3.024 |
| 1994-09-08 | 3.024 |
| 1994-09-09 | 3.029 |
| 1994-09-12 | 3.017 |
| 1994-09-13 | 3.02 |
| 1994-09-16 | 3.025 |
| 1994-09-19 | 3.018 |
| 1994-09-21 | 3.021 |
| 1994-09-22 | 3.017 |
| 1994-09-23 | 3.02 |
| 1994-09-26 | 3.03 |
| 1994-09-28 | 3.029 |
| 1994-09-29 | 3.022 |
| 1994-09-30 | 3.013 |
| 1994-10-03 | 3.02 |
| 1994-10-04 | 3.016 |
| 1994-10-05 | 3.014 |
| 1994-10-06 | 3.017 |
| 1994-10-07 | 3.012 |
| 1994-10-10 | 3.02 |
| 1994-10-11 | 3.021 |
| 1994-10-12 | 3.03 |
| 1994-10-13 | 3.033 |
| 1994-10-14 | 3.022 |
| 1994-10-17 | 3.013 |
| 1994-10-18 | 3.021 |
| 1994-10-19 | 3.018 |
| 1994-10-20 | 3.019 |
| 1994-10-21 | 3.017 |
| 1994-10-24 | 3.025 |
| 1994-10-25 | 3.015 |
| 1994-10-26 | 3.018 |
| 1994-10-27 | 3.008 |
| 1994-10-28 | 3.009 |
| 1994-10-31 | 3.009 |
| 1994-11-01 | 2.999 |
| 1994-11-02 | 3.003 |
| 1994-11-03 | 3.008 |
| 1994-11-04 | 3.01 |
| 1994-11-07 | 3.004 |
| 1994-11-08 | 2.996 |
| 1994-11-09 | 3.01 |
| 1994-11-10 | 3.002 |
| 1994-11-11 | 2.998 |
| 1994-11-14 | 2.998 |
| 1994-11-15 | 2.993 |
| 1994-11-16 | 2.999 |
| 1994-11-17 | 2.995 |
| 1994-11-18 | 3.026 |
| 1994-11-21 | 3.034 |
| 1994-11-22 | 3.036 |
| 1994-11-23 | 3.023 |
| 1994-11-24 | 3.037 |
| 1994-11-25 | 3.049 |
| 1994-11-28 | 3.053 |
| 1994-11-29 | 3.037 |
| 1994-11-30 | 3.031 |
| 1994-12-01 | 3.021 |
| 1994-12-02 | 3.025 |
| 1994-12-05 | 3.023 |
| 1994-12-06 | 3.018 |
| 1994-12-07 | 3.012 |
| 1994-12-08 | 3.015 |
| 1994-12-09 | 3.023 |
| 1994-12-12 | 3.022 |
| 1994-12-13 | 3.016 |
| 1994-12-14 | 3.016 |
| 1994-12-15 | 3.016 |
| 1994-12-16 | 3.014 |
| 1994-12-19 | 3.02 |
| 1994-12-20 | 3.036 |
| 1994-12-21 | 3.058 |
| 1994-12-22 | 3.055 |
| 1994-12-23 | 3.05 |
| 1994-12-27 | 3.039 |
| 1994-12-28 | 3.04 |
| 1994-12-29 | 3.026 |
| 1994-12-30 | 3.018 |
| 1995-01-03 | 3.024 |
| 1995-01-04 | 3.028 |
| 1995-01-05 | 3.024 |
| 1995-01-06 | 3.022 |
| 1995-01-09 | 3.029 |
| 1995-01-10 | 3.015 |
| 1995-01-11 | 3.013 |
| 1995-01-12 | 3.016 |
| 1995-01-13 | 3.01 |
| 1995-01-16 | 3.013 |
| 1995-01-17 | 3.012 |
| 1995-01-18 | 3.01 |
| 1995-01-19 | 3.017 |
| 1995-01-20 | 3.002 |
| 1995-01-23 | 3.003 |
| 1995-01-24 | 2.999 |
| 1995-01-25 | 2.996 |
| 1995-01-26 | 3.005 |
| 1995-01-27 | 3.006 |
| 1995-01-30 | 3.004 |
| 1995-01-31 | 2.998 |
| 1995-02-01 | 3.012 |
| 1995-02-02 | 3.009 |
| 1995-02-03 | 3.011 |
| 1995-02-06 | 3.021 |
| 1995-02-07 | 3.022 |
| 1995-02-08 | 3.029 |
| 1995-02-09 | 3.022 |
| 1995-02-10 | 3.024 |
| 1995-02-13 | 3.017 |
| 1995-02-14 | 3.022 |
| 1995-02-15 | 3.014 |
| 1995-02-16 | 3.007 |
| 1995-02-17 | 2.996 |
| 1995-02-20 | 3.003 |
| 1995-02-21 | 3.006 |
| 1995-02-22 | 3.008 |
| 1995-02-23 | 3.003 |
| 1995-02-24 | 2.993 |
| 1995-02-27 | 2.984 |
| 1995-02-28 | 2.988 |
| 1995-03-01 | 2.986 |
| 1995-03-02 | 2.988 |
| 1995-03-03 | 2.983 |
| 1995-03-06 | 2.968 |
| 1995-03-07 | 2.97 |
| 1995-03-08 | 2.961 |
| 1995-03-09 | 2.98 |
| 1995-03-10 | 2.983 |
| 1995-03-13 | 2.991 |
| 1995-03-14 | 2.983 |
| 1995-03-15 | 2.967 |
| 1995-03-20 | 2.986 |
| 1995-03-21 | 2.953 |
| 1995-03-22 | 2.967 |
| 1995-03-23 | 2.975 |
| 1995-03-24 | 2.986 |
| 1995-03-27 | 2.993 |
| 1995-03-28 | 2.983 |
| 1995-03-29 | 2.964 |
| 1995-03-30 | 2.964 |
| 1995-03-31 | 2.968 |
| 1995-04-03 | 2.958 |
| 1995-04-04 | 2.963 |
| 1995-04-05 | 2.954 |
| 1995-04-06 | 2.955 |
| 1995-04-07 | 2.952 |
| 1995-04-10 | 2.965 |
| 1995-04-11 | 2.975 |
| 1995-04-12 | 2.97 |
| 1995-04-13 | 2.964 |
| 1995-04-18 | 2.948 |
| 1995-04-19 | 2.946 |
| 1995-04-20 | 2.96 |
| 1995-04-24 | 2.956 |
| 1995-04-25 | 2.954 |
| 1995-04-26 | 2.963 |
| 1995-04-27 | 2.958 |
| 1995-04-28 | 2.961 |
| 1995-05-01 | 2.974 |
| 1995-05-02 | 2.966 |
| 1995-05-03 | 2.961 |
| 1995-05-05 | 2.966 |
| 1995-05-08 | 2.96 |
| 1995-05-09 | 2.965 |
| 1995-05-10 | 2.975 |
| 1995-05-11 | 3.003 |
| 1995-05-12 | 3.026 |
| 1995-05-15 | 3.027 |
| 1995-05-16 | 3.034 |
| 1995-05-17 | 3.02 |
| 1995-05-18 | 3.034 |
| 1995-05-19 | 3.034 |
| 1995-05-22 | 3.039 |
| 1995-05-23 | 3.036 |
| 1995-05-24 | 3.037 |
| 1995-05-25 | 3.028 |
| 1995-05-26 | 3.004 |
| 1995-05-30 | 2.995 |
| 1995-05-31 | 3.005 |
| 1995-06-01 | 3.027 |
| 1995-06-02 | 3.003 |
| 1995-06-05 | 3.009 |
| 1995-06-06 | 3.008 |
| 1995-06-07 | 2.998 |
| 1995-06-08 | 2.994 |
| 1995-06-09 | 2.988 |
| 1995-06-12 | 2.99 |
| 1995-06-13 | 2.983 |
| 1995-06-14 | 2.977 |
| 1995-06-15 | 2.974 |
| 1995-06-16 | 2.969 |
| 1995-06-19 | 2.962 |
| 1995-06-20 | 2.971 |
| 1995-06-21 | 2.976 |
| 1995-06-22 | 2.967 |
| 1995-06-23 | 2.971 |
| 1995-06-26 | 2.966 |
| 1995-06-27 | 2.966 |
| 1995-06-28 | 2.968 |
| 1995-06-29 | 2.964 |
| 1995-06-30 | 2.951 |
| 1995-07-03 | 2.955 |
| 1995-07-04 | 2.952 |
| 1995-07-05 | 2.949 |
| 1995-07-06 | 2.948 |
| 1995-07-07 | 2.953 |
| 1995-07-10 | 2.953 |
| 1995-07-11 | 2.957 |
| 1995-07-12 | 2.956 |
| 1995-07-13 | 2.95 |
| 1995-07-14 | 2.939 |
| 1995-07-17 | 2.946 |
| 1995-07-18 | 2.942 |
| 1995-07-19 | 2.94 |
| 1995-07-20 | 2.941 |
| 1995-07-21 | 2.948 |
| 1995-07-24 | 2.943 |
| 1995-07-25 | 2.952 |
| 1995-07-26 | 2.98 |
| 1995-07-27 | 2.976 |
| 1995-07-28 | 2.992 |
| 1995-07-31 | 2.989 |
| 1995-08-01 | 2.998 |
| 1995-08-02 | 2.994 |
| 1995-08-03 | 3.01 |
| 1995-08-04 | 3.013 |
| 1995-08-07 | 3.016 |
| 1995-08-08 | 3.02 |
| 1995-08-09 | 3.02 |
| 1995-08-10 | 3.015 |
| 1995-08-11 | 3.022 |
| 1995-08-14 | 3.024 |
| 1995-08-15 | 3.025 |
| 1995-08-16 | 3.038 |
| 1995-08-17 | 3.045 |
| 1995-08-18 | 3.042 |
| 1995-08-21 | 3.042 |
| 1995-08-22 | 3.041 |
| 1995-08-23 | 3.046 |
| 1995-08-24 | 3.057 |
| 1995-08-25 | 3.052 |
| 1995-08-28 | 3.048 |
| 1995-08-29 | 3.048 |
| 1995-08-30 | 3.05 |
| 1995-08-31 | 3.042 |
| 1995-09-01 | 3.044 |
| 1995-09-04 | 3.044 |
| 1995-09-05 | 3.041 |
| 1995-09-06 | 3.044 |
| 1995-09-07 | 3.043 |
| 1995-09-08 | 3.05 |
| 1995-09-11 | 3.04 |
| 1995-09-12 | 3.041 |
| 1995-09-13 | 3.046 |
| 1995-09-14 | 3.046 |
| 1995-09-15 | 3.046 |
| 1995-09-18 | 3.043 |
| 1995-09-19 | 3.043 |
| 1995-09-20 | 3.037 |
| 1995-09-21 | 3.031 |
| 1995-09-22 | 3.028 |
| 1995-09-27 | 3.013 |
| 1995-09-28 | 3.001 |
| 1995-09-29 | 2.995 |
| 1995-10-02 | 3.006 |
| 1995-10-05 | 3.01 |
| 1995-10-06 | 3.001 |
| 1995-10-10 | 3 |
| 1995-10-11 | 2.999 |
| 1995-10-12 | 3 |
| 1995-10-13 | 2.999 |
| 1995-10-17 | 2.996 |
| 1995-10-18 | 2.994 |
| 1995-10-19 | 2.991 |
| 1995-10-20 | 3.002 |
| 1995-10-23 | 3.006 |
| 1995-10-24 | 3.018 |
| 1995-10-25 | 3.035 |
| 1995-10-26 | 3.03 |
| 1995-10-27 | 3.034 |
| 1995-10-30 | 3.035 |
| 1995-10-31 | 3.029 |
| 1995-11-01 | 3.019 |
| 1995-11-02 | 3.011 |
| 1995-11-03 | 3.03 |
| 1995-11-06 | 3.019 |
| 1995-11-07 | 3.02 |
| 1995-11-08 | 3.016 |
| 1995-11-09 | 3.016 |
| 1995-11-10 | 3.016 |
| 1995-11-13 | 3.009 |
| 1995-11-14 | 3.017 |
| 1995-11-15 | 3.011 |
| 1995-11-16 | 3.03 |
| 1995-11-17 | 3.053 |
| 1995-11-20 | 3.098 |
| 1995-11-21 | 3.076 |
| 1995-11-22 | 3.054 |
| 1995-11-23 | 3.063 |
| 1995-11-24 | 3.079 |
| 1995-11-27 | 3.074 |
| 1995-11-28 | 3.076 |
| 1995-11-29 | 3.065 |
| 1995-11-30 | 3.072 |
| 1995-12-01 | 3.093 |
| 1995-12-04 | 3.078 |
| 1995-12-05 | 3.08 |
| 1995-12-06 | 3.089 |
| 1995-12-07 | 3.094 |
| 1995-12-08 | 3.1 |
| 1995-12-11 | 3.112 |
| 1995-12-12 | 3.116 |
| 1995-12-13 | 3.119 |
| 1995-12-14 | 3.116 |
| 1995-12-15 | 3.117 |
| 1995-12-18 | 3.119 |
| 1995-12-19 | 3.128 |
| 1995-12-20 | 3.141 |
| 1995-12-21 | 3.174 |
| 1995-12-22 | 3.175 |
| 1995-12-27 | 3.145 |
| 1995-12-28 | 3.144 |
| 1995-12-29 | 3.135 |
| 1996-01-02 | 3.127 |
| 1996-01-03 | 3.128 |
| 1996-01-04 | 3.134 |
| 1996-01-05 | 3.133 |
| 1996-01-08 | 3.137 |
| 1996-01-09 | 3.128 |
| 1996-01-10 | 3.121 |
| 1996-01-11 | 3.12 |
| 1996-01-12 | 3.122 |
| 1996-01-15 | 3.118 |
| 1996-01-16 | 3.121 |
| 1996-01-17 | 3.12 |
| 1996-01-18 | 3.121 |
| 1996-01-19 | 3.123 |
| 1996-01-22 | 3.122 |
| 1996-01-23 | 3.128 |
| 1996-01-24 | 3.131 |
| 1996-01-25 | 3.135 |
| 1996-01-26 | 3.156 |
| 1996-01-29 | 3.145 |
| 1996-01-30 | 3.14 |
| 1996-01-31 | 3.14 |
| 1996-02-01 | 3.133 |
| 1996-02-02 | 3.142 |
| 1996-02-05 | 3.132 |
| 1996-02-06 | 3.128 |
| 1996-02-07 | 3.126 |
| 1996-02-08 | 3.13 |
| 1996-02-09 | 3.122 |
| 1996-02-12 | 3.117 |
| 1996-02-13 | 3.109 |
| 1996-02-14 | 3.113 |
| 1996-02-15 | 3.107 |
| 1996-02-16 | 3.105 |
| 1996-02-19 | 3.095 |
| 1996-02-20 | 3.083 |
| 1996-02-21 | 3.097 |
| 1996-02-22 | 3.111 |
| 1996-02-23 | 3.118 |
| 1996-02-26 | 3.106 |
| 1996-02-27 | 3.101 |
| 1996-02-28 | 3.1 |
| 1996-02-29 | 3.101 |
| 1996-03-01 | 3.104 |
| 1996-03-04 | 3.1 |
| 1996-03-07 | 3.099 |
| 1996-03-08 | 3.097 |
| 1996-03-11 | 3.1 |
| 1996-03-12 | 3.094 |
| 1996-03-13 | 3.087 |
| 1996-03-14 | 3.091 |
| 1996-03-15 | 3.092 |
| 1996-03-18 | 3.09 |
| 1996-03-19 | 3.09 |
| 1996-03-20 | 3.08 |
| 1996-03-21 | 3.102 |
| 1996-03-22 | 3.092 |
| 1996-03-25 | 3.085 |
| 1996-03-26 | 3.108 |
| 1996-03-27 | 3.128 |
| 1996-03-28 | 3.133 |
| 1996-03-29 | 3.111 |
| 1996-04-01 | 3.107 |
| 1996-04-02 | 3.124 |
| 1996-04-09 | 3.131 |
| 1996-04-11 | 3.149 |
| 1996-04-12 | 3.151 |
| 1996-04-15 | 3.156 |
| 1996-04-16 | 3.175 |
| 1996-04-17 | 3.176 |
| 1996-04-18 | 3.195 |
| 1996-04-19 | 3.19 |
| 1996-04-22 | 3.18 |
| 1996-04-23 | 3.17 |
| 1996-04-25 | 3.18 |
| 1996-04-26 | 3.174 |
| 1996-04-29 | 3.189 |
| 1996-04-30 | 3.191 |
| 1996-05-01 | 3.201 |
| 1996-05-02 | 3.212 |
| 1996-05-03 | 3.214 |
| 1996-05-06 | 3.262 |
| 1996-05-07 | 3.284 |
| 1996-05-08 | 3.257 |
| 1996-05-09 | 3.237 |
| 1996-05-10 | 3.232 |
| 1996-05-13 | 3.226 |
| 1996-05-14 | 3.223 |
| 1996-05-15 | 3.242 |
| 1996-05-16 | 3.254 |
| 1996-05-17 | 3.244 |
| 1996-05-20 | 3.27 |
| 1996-05-21 | 3.275 |
| 1996-05-22 | 3.261 |
| 1996-05-23 | 3.271 |
| 1996-05-28 | 3.29 |
| 1996-05-30 | 3.301 |
| 1996-05-31 | 3.299 |
| 1996-06-03 | 3.285 |
| 1996-06-04 | 3.284 |
| 1996-06-05 | 3.277 |
| 1996-06-06 | 3.272 |
| 1996-06-07 | 3.265 |
| 1996-06-10 | 3.253 |
| 1996-06-11 | 3.271 |
| 1996-06-12 | 3.273 |
| 1996-06-13 | 3.267 |
| 1996-06-14 | 3.267 |
| 1996-06-17 | 3.261 |
| 1996-06-18 | 3.261 |
| 1996-06-19 | 3.26 |
| 1996-06-20 | 3.263 |
| 1996-06-21 | 3.266 |
| 1996-06-24 | 3.231 |
| 1996-06-25 | 3.231 |
| 1996-06-26 | 3.222 |
| 1996-06-27 | 3.198 |
| 1996-06-28 | 3.203 |
| 1996-07-01 | 3.203 |
| 1996-07-02 | 3.201 |
| 1996-07-03 | 3.193 |
| 1996-07-04 | 3.192 |
| 1996-07-05 | 3.193 |
| 1996-07-08 | 3.184 |
| 1996-07-09 | 3.17 |
| 1996-07-10 | 3.173 |
| 1996-07-11 | 3.192 |
| 1996-07-12 | 3.187 |
| 1996-07-15 | 3.177 |
| 1996-07-16 | 3.185 |
| 1996-07-18 | 3.185 |
| 1996-07-19 | 3.184 |
| 1996-07-22 | 3.173 |
| 1996-07-23 | 3.165 |
| 1996-07-24 | 3.162 |
| 1996-07-26 | 3.168 |
| 1996-07-29 | 3.167 |
| 1996-07-30 | 3.162 |
| 1996-07-31 | 3.153 |
| 1996-08-01 | 3.143 |
| 1996-08-02 | 3.147 |
| 1996-08-05 | 3.147 |
| 1996-08-06 | 3.151 |
| 1996-08-07 | 3.15 |
| 1996-08-08 | 3.144 |
| 1996-08-09 | 3.144 |
| 1996-08-12 | 3.14 |
| 1996-08-13 | 3.139 |
| 1996-08-14 | 3.145 |
| 1996-08-15 | 3.158 |
| 1996-08-16 | 3.151 |
| 1996-08-19 | 3.15 |
| 1996-08-20 | 3.148 |
| 1996-08-21 | 3.147 |
| 1996-08-22 | 3.156 |
| 1996-08-23 | 3.155 |
| 1996-08-26 | 3.141 |
| 1996-08-27 | 3.137 |
| 1996-08-28 | 3.141 |
| 1996-08-29 | 3.139 |
| 1996-08-30 | 3.142 |
| 1996-09-02 | 3.144 |
| 1996-09-03 | 3.148 |
| 1996-09-04 | 3.147 |
| 1996-09-05 | 3.144 |
| 1996-09-06 | 3.147 |
| 1996-09-09 | 3.153 |
| 1996-09-10 | 3.161 |
| 1996-09-11 | 3.168 |
| 1996-09-12 | 3.169 |
| 1996-09-16 | 3.171 |
| 1996-09-17 | 3.171 |
| 1996-09-18 | 3.17 |
| 1996-09-19 | 3.168 |
| 1996-09-20 | 3.174 |
| 1996-09-24 | 3.173 |
| 1996-09-25 | 3.171 |
| 1996-09-26 | 3.18 |
| 1996-09-27 | 3.192 |
| 1996-09-30 | 3.22 |
| 1996-10-01 | 3.192 |
| 1996-10-02 | 3.185 |
| 1996-10-03 | 3.189 |
| 1996-10-04 | 3.189 |
| 1996-10-07 | 3.191 |
| 1996-10-08 | 3.188 |
| 1996-10-09 | 3.191 |
| 1996-10-10 | 3.192 |
| 1996-10-11 | 3.191 |
| 1996-10-14 | 3.192 |
| 1996-10-15 | 3.197 |
| 1996-10-16 | 3.203 |
| 1996-10-17 | 3.235 |
| 1996-10-18 | 3.269 |
| 1996-10-21 | 3.27 |
| 1996-10-22 | 3.246 |
| 1996-10-23 | 3.251 |
| 1996-10-24 | 3.28 |
| 1996-10-25 | 3.281 |
| 1996-10-28 | 3.255 |
| 1996-10-29 | 3.256 |
| 1996-10-30 | 3.267 |
| 1996-10-31 | 3.273 |
| 1996-11-01 | 3.267 |
| 1996-11-04 | 3.249 |
| 1996-11-05 | 3.248 |
| 1996-11-06 | 3.246 |
| 1996-11-07 | 3.248 |
| 1996-11-08 | 3.245 |
| 1996-11-11 | 3.243 |
| 1996-11-12 | 3.238 |
| 1996-11-13 | 3.234 |
| 1996-11-14 | 3.235 |
| 1996-11-15 | 3.235 |
| 1996-11-18 | 3.227 |
| 1996-11-19 | 3.231 |
| 1996-11-20 | 3.232 |
| 1996-11-21 | 3.256 |
| 1996-11-22 | 3.247 |
| 1996-11-25 | 3.247 |
| 1996-11-26 | 3.242 |
| 1996-11-27 | 3.252 |
| 1996-11-28 | 3.257 |
| 1996-11-29 | 3.253 |
| 1996-12-02 | 3.273 |
| 1996-12-03 | 3.292 |
| 1996-12-04 | 3.29 |
| 1996-12-05 | 3.277 |
| 1996-12-06 | 3.273 |
| 1996-12-09 | 3.282 |
| 1996-12-10 | 3.282 |
| 1996-12-11 | 3.286 |
| 1996-12-12 | 3.282 |
| 1996-12-13 | 3.283 |
| 1996-12-16 | 3.281 |
| 1996-12-17 | 3.28 |
| 1996-12-18 | 3.277 |
| 1996-12-19 | 3.278 |
| 1996-12-20 | 3.27 |
| 1996-12-23 | 3.269 |
| 1996-12-24 | 3.266 |
| 1996-12-27 | 3.261 |
| 1996-12-31 | 3.251 |
| 1997-01-02 | 3.242 |
| 1997-01-03 | 3.242 |
| 1997-01-06 | 3.247 |
| 1997-01-07 | 3.244 |
| 1997-01-08 | 3.247 |
| 1997-01-09 | 3.248 |
| 1997-01-10 | 3.249 |
| 1997-01-13 | 3.262 |
| 1997-01-14 | 3.259 |
| 1997-01-15 | 3.268 |
| 1997-01-16 | 3.263 |
| 1997-01-17 | 3.27 |
| 1997-01-20 | 3.287 |
| 1997-01-21 | 3.284 |
| 1997-01-22 | 3.297 |
| 1997-01-23 | 3.303 |
| 1997-01-24 | 3.3 |
| 1997-01-27 | 3.306 |
| 1997-01-28 | 3.319 |
| 1997-01-29 | 3.312 |
| 1997-01-30 | 3.312 |
| 1997-01-31 | 3.314 |
| 1997-02-03 | 3.321 |
| 1997-02-04 | 3.316 |
| 1997-02-05 | 3.322 |
| 1997-02-06 | 3.321 |
| 1997-02-07 | 3.326 |
| 1997-02-10 | 3.323 |
| 1997-02-11 | 3.331 |
| 1997-02-12 | 3.342 |
| 1997-02-13 | 3.341 |
| 1997-02-17 | 3.351 |
| 1997-02-18 | 3.359 |
| 1997-02-19 | 3.352 |
| 1997-02-20 | 3.351 |
| 1997-02-24 | 3.342 |
| 1997-02-25 | 3.339 |
| 1997-02-26 | 3.338 |
| 1997-02-27 | 3.348 |
| 1997-03-03 | 3.353 |
| 1997-03-04 | 3.363 |
| 1997-03-05 | 3.367 |
| 1997-03-06 | 3.37 |
| 1997-03-07 | 3.369 |
| 1997-03-10 | 3.37 |
| 1997-03-11 | 3.368 |
| 1997-03-12 | 3.373 |
| 1997-03-13 | 3.365 |
| 1997-03-14 | 3.373 |
| 1997-03-17 | 3.366 |
| 1997-03-18 | 3.367 |
| 1997-03-19 | 3.365 |
| 1997-03-20 | 3.36 |
| 1997-03-21 | 3.372 |
| 1997-03-25 | 3.366 |
| 1997-03-26 | 3.37 |
| 1997-03-27 | 3.361 |
| 1997-04-01 | 3.357 |
| 1997-04-02 | 3.357 |
| 1997-04-03 | 3.358 |
| 1997-04-04 | 3.361 |
| 1997-04-07 | 3.381 |
| 1997-04-08 | 3.389 |
| 1997-04-09 | 3.39 |
| 1997-04-10 | 3.393 |
| 1997-04-11 | 3.394 |
| 1997-04-14 | 3.403 |
| 1997-04-15 | 3.403 |
| 1997-04-16 | 3.398 |
| 1997-04-17 | 3.404 |
| 1997-04-18 | 3.402 |
| 1997-04-23 | 3.399 |
| 1997-04-24 | 3.402 |
| 1997-04-25 | 3.401 |
| 1997-04-29 | 3.41 |
| 1997-04-30 | 3.407 |
| 1997-05-01 | 3.41 |
| 1997-05-02 | 3.41 |
| 1997-05-05 | 3.411 |
| 1997-05-06 | 3.41 |
| 1997-05-07 | 3.404 |
| 1997-05-08 | 3.403 |
| 1997-05-09 | 3.399 |
| 1997-05-13 | 3.401 |
| 1997-05-14 | 3.399 |
| 1997-05-15 | 3.392 |
| 1997-05-16 | 3.394 |
| 1997-05-19 | 3.392 |
| 1997-05-20 | 3.391 |
| 1997-05-21 | 3.388 |
| 1997-05-22 | 3.396 |
| 1997-05-23 | 3.398 |
| 1997-05-27 | 3.394 |
| 1997-05-28 | 3.395 |
| 1997-05-29 | 3.395 |
| 1997-05-30 | 3.394 |
| 1997-06-02 | 3.406 |
| 1997-06-03 | 3.407 |
| 1997-06-04 | 3.413 |
| 1997-06-05 | 3.411 |
| 1997-06-06 | 3.415 |
| 1997-06-09 | 3.401 |
| 1997-06-10 | 3.401 |
| 1997-06-12 | 3.411 |
| 1997-06-13 | 3.413 |
| 1997-06-16 | 3.416 |
| 1997-06-17 | 3.417 |
| 1997-06-18 | 3.42 |
| 1997-06-19 | 3.419 |
| 1997-06-20 | 3.437 |
| 1997-06-23 | 3.484 |
| 1997-06-24 | 3.506 |
| 1997-06-25 | 3.524 |
| 1997-06-26 | 3.58 |
| 1997-06-27 | 3.592 |
| 1997-06-30 | 3.587 |
| 1997-07-01 | 3.549 |
| 1997-07-02 | 3.505 |
| 1997-07-03 | 3.517 |
| 1997-07-04 | 3.553 |
| 1997-07-07 | 3.569 |
| 1997-07-08 | 3.573 |
| 1997-07-09 | 3.569 |
| 1997-07-10 | 3.552 |
| 1997-07-11 | 3.552 |
| 1997-07-14 | 3.558 |
| 1997-07-15 | 3.567 |
| 1997-07-16 | 3.556 |
| 1997-07-17 | 3.552 |
| 1997-07-18 | 3.532 |
| 1997-07-21 | 3.524 |
| 1997-07-22 | 3.53 |
| 1997-07-23 | 3.514 |
| 1997-07-24 | 3.522 |
| 1997-07-25 | 3.553 |
| 1997-07-28 | 3.545 |
| 1997-07-29 | 3.534 |
| 1997-07-30 | 3.546 |
| 1997-07-31 | 3.54 |
| 1997-08-01 | 3.537 |
| 1997-08-04 | 3.541 |
| 1997-08-05 | 3.544 |
| 1997-08-06 | 3.541 |
| 1997-08-07 | 3.529 |
| 1997-08-08 | 3.533 |
| 1997-08-11 | 3.53 |
| 1997-08-13 | 3.534 |
| 1997-08-14 | 3.529 |
| 1997-08-15 | 3.52 |
| 1997-08-18 | 3.522 |
| 1997-08-19 | 3.532 |
| 1997-08-20 | 3.534 |
| 1997-08-21 | 3.54 |
| 1997-08-22 | 3.536 |
| 1997-08-25 | 3.531 |
| 1997-08-26 | 3.515 |
| 1997-08-27 | 3.523 |
| 1997-08-28 | 3.516 |
| 1997-08-29 | 3.514 |
| 1997-09-01 | 3.512 |
| 1997-09-02 | 3.516 |
| 1997-09-03 | 3.515 |
| 1997-09-04 | 3.52 |
| 1997-09-05 | 3.523 |
| 1997-09-08 | 3.519 |
| 1997-09-09 | 3.514 |
| 1997-09-10 | 3.514 |
| 1997-09-11 | 3.509 |
| 1997-09-12 | 3.5 |
| 1997-09-15 | 3.502 |
| 1997-09-16 | 3.503 |
| 1997-09-17 | 3.498 |
| 1997-09-18 | 3.498 |
| 1997-09-19 | 3.502 |
| 1997-09-22 | 3.507 |
| 1997-09-23 | 3.511 |
| 1997-09-24 | 3.5 |
| 1997-09-25 | 3.503 |
| 1997-09-26 | 3.504 |
| 1997-09-29 | 3.507 |
| 1997-09-30 | 3.497 |
| 1997-10-06 | 3.495 |
| 1997-10-07 | 3.485 |
| 1997-10-08 | 3.49 |
| 1997-10-09 | 3.482 |
| 1997-10-13 | 3.495 |
| 1997-10-14 | 3.501 |
| 1997-10-15 | 3.52 |
| 1997-10-17 | 3.53 |
| 1997-10-20 | 3.52 |
| 1997-10-21 | 3.525 |
| 1997-10-22 | 3.545 |
| 1997-10-24 | 3.562 |
| 1997-10-27 | 3.541 |
| 1997-10-28 | 3.552 |
| 1997-10-29 | 3.542 |
| 1997-10-30 | 3.543 |
| 1997-10-31 | 3.542 |
| 1997-11-03 | 3.532 |
| 1997-11-04 | 3.538 |
| 1997-11-05 | 3.538 |
| 1997-11-06 | 3.528 |
| 1997-11-07 | 3.533 |
| 1997-11-10 | 3.537 |
| 1997-11-11 | 3.534 |
| 1997-11-12 | 3.534 |
| 1997-11-13 | 3.534 |
| 1997-11-14 | 3.537 |
| 1997-11-17 | 3.527 |
| 1997-11-18 | 3.527 |
| 1997-11-19 | 3.526 |
| 1997-11-20 | 3.532 |
| 1997-11-21 | 3.535 |
| 1997-11-24 | 3.527 |
| 1997-11-25 | 3.533 |
| 1997-11-26 | 3.536 |
| 1997-11-27 | 3.539 |
| 1997-11-28 | 3.54 |
| 1997-12-01 | 3.532 |
| 1997-12-02 | 3.527 |
| 1997-12-08 | 3.543 |
| 1997-12-09 | 3.534 |
| 1997-12-10 | 3.533 |
| 1997-12-11 | 3.531 |
| 1997-12-12 | 3.53 |
| 1997-12-15 | 3.538 |
| 1997-12-16 | 3.542 |
| 1997-12-17 | 3.537 |
| 1997-12-18 | 3.535 |
| 1997-12-19 | 3.532 |
| 1997-12-22 | 3.538 |
| 1997-12-23 | 3.536 |
| 1997-12-24 | 3.534 |
| 1997-12-29 | 3.527 |
| 1997-12-30 | 3.534 |
| 1997-12-31 | 3.536 |
| 1998-01-02 | 3.548 |
| 1998-01-05 | 3.552 |
| 1998-01-06 | 3.563 |
| 1998-01-07 | 3.564 |
| 1998-01-08 | 3.565 |
| 1998-01-09 | 3.554 |
| 1998-01-12 | 3.561 |
| 1998-01-13 | 3.561 |
| 1998-01-14 | 3.586 |
| 1998-01-15 | 3.583 |
| 1998-01-16 | 3.612 |
| 1998-01-19 | 3.602 |
| 1998-01-20 | 3.605 |
| 1998-01-21 | 3.582 |
| 1998-01-22 | 3.576 |
| 1998-01-23 | 3.586 |
| 1998-01-26 | 3.573 |
| 1998-01-27 | 3.575 |
| 1998-01-28 | 3.577 |
| 1998-01-29 | 3.585 |
| 1998-01-30 | 3.611 |
| 1998-02-02 | 3.589 |
| 1998-02-03 | 3.587 |
| 1998-02-04 | 3.586 |
| 1998-02-05 | 3.58 |
| 1998-02-06 | 3.578 |
| 1998-02-09 | 3.592 |
| 1998-02-10 | 3.601 |
| 1998-02-11 | 3.604 |
| 1998-02-12 | 3.598 |
| 1998-02-13 | 3.597 |
| 1998-02-16 | 3.598 |
| 1998-02-17 | 3.601 |
| 1998-02-18 | 3.602 |
| 1998-02-19 | 3.611 |
| 1998-02-20 | 3.609 |
| 1998-02-23 | 3.605 |
| 1998-02-24 | 3.594 |
| 1998-02-25 | 3.586 |
| 1998-02-26 | 3.586 |
| 1998-02-27 | 3.582 |
| 1998-03-02 | 3.578 |
| 1998-03-03 | 3.576 |
| 1998-03-04 | 3.576 |
| 1998-03-05 | 3.578 |
| 1998-03-06 | 3.587 |
| 1998-03-09 | 3.585 |
| 1998-03-10 | 3.586 |
| 1998-03-11 | 3.589 |
| 1998-03-16 | 3.578 |
| 1998-03-17 | 3.578 |
| 1998-03-18 | 3.58 |
| 1998-03-19 | 3.591 |
| 1998-03-20 | 3.595 |
| 1998-03-23 | 3.603 |
| 1998-03-24 | 3.595 |
| 1998-03-25 | 3.588 |
| 1998-03-26 | 3.588 |
| 1998-03-27 | 3.585 |
| 1998-03-30 | 3.592 |
| 1998-03-31 | 3.597 |
| 1998-04-01 | 3.602 |
| 1998-04-02 | 3.617 |
| 1998-04-03 | 3.635 |
| 1998-04-06 | 3.701 |
| 1998-04-07 | 3.69 |
| 1998-04-08 | 3.679 |
| 1998-04-09 | 3.692 |
| 1998-04-14 | 3.758 |
| 1998-04-15 | 3.728 |
| 1998-04-16 | 3.728 |
| 1998-04-20 | 3.737 |
| 1998-04-21 | 3.751 |
| 1998-04-22 | 3.756 |
| 1998-04-23 | 3.737 |
| 1998-04-24 | 3.747 |
| 1998-04-27 | 3.705 |
| 1998-04-28 | 3.721 |
| 1998-04-29 | 3.707 |
| 1998-05-04 | 3.698 |
| 1998-05-05 | 3.697 |
| 1998-05-06 | 3.691 |
| 1998-05-07 | 3.688 |
| 1998-05-08 | 3.688 |
| 1998-05-11 | 3.671 |
| 1998-05-12 | 3.676 |
| 1998-05-13 | 3.668 |
| 1998-05-14 | 3.67 |
| 1998-05-15 | 3.665 |
| 1998-05-18 | 3.654 |
| 1998-05-19 | 3.656 |
| 1998-05-20 | 3.655 |
| 1998-05-21 | 3.648 |
| 1998-05-22 | 3.642 |
| 1998-05-26 | 3.637 |
| 1998-05-27 | 3.64 |
| 1998-05-28 | 3.644 |
| 1998-05-29 | 3.656 |
| 1998-06-01 | 3.648 |
| 1998-06-02 | 3.646 |
| 1998-06-03 | 3.649 |
| 1998-06-04 | 3.653 |
| 1998-06-05 | 3.651 |
| 1998-06-08 | 3.658 |
| 1998-06-09 | 3.667 |
| 1998-06-10 | 3.662 |
| 1998-06-11 | 3.662 |
| 1998-06-12 | 3.683 |
| 1998-06-15 | 3.687 |
| 1998-06-16 | 3.686 |
| 1998-06-17 | 3.675 |
| 1998-06-18 | 3.669 |
| 1998-06-19 | 3.669 |
| 1998-06-22 | 3.664 |
| 1998-06-23 | 3.654 |
| 1998-06-24 | 3.657 |
| 1998-06-25 | 3.671 |
| 1998-06-26 | 3.67 |
| 1998-06-29 | 3.665 |
| 1998-06-30 | 3.667 |
| 1998-07-01 | 3.665 |
| 1998-07-02 | 3.671 |
| 1998-07-03 | 3.673 |
| 1998-07-06 | 3.669 |
| 1998-07-07 | 3.67 |
| 1998-07-08 | 3.666 |
| 1998-07-09 | 3.667 |
| 1998-07-10 | 3.668 |
| 1998-07-13 | 3.666 |
| 1998-07-14 | 3.659 |
| 1998-07-15 | 3.658 |
| 1998-07-16 | 3.645 |
| 1998-07-17 | 3.647 |
| 1998-07-20 | 3.648 |
| 1998-07-21 | 3.654 |
| 1998-07-22 | 3.65 |
| 1998-07-23 | 3.663 |
| 1998-07-24 | 3.666 |
| 1998-07-27 | 3.659 |
| 1998-07-28 | 3.659 |
| 1998-07-29 | 3.655 |
| 1998-07-30 | 3.653 |
| 1998-07-31 | 3.65 |
| 1998-08-03 | 3.645 |
| 1998-08-04 | 3.65 |
| 1998-08-05 | 3.648 |
| 1998-08-06 | 3.651 |
| 1998-08-07 | 3.716 |
| 1998-08-10 | 3.685 |
| 1998-08-11 | 3.684 |
| 1998-08-12 | 3.684 |
| 1998-08-13 | 3.684 |
| 1998-08-14 | 3.683 |
| 1998-08-17 | 3.687 |
| 1998-08-18 | 3.69 |
| 1998-08-19 | 3.695 |
| 1998-08-20 | 3.704 |
| 1998-08-21 | 3.717 |
| 1998-08-24 | 3.727 |
| 1998-08-25 | 3.724 |
| 1998-08-26 | 3.736 |
| 1998-08-27 | 3.773 |
| 1998-08-28 | 3.875 |
| 1998-08-31 | 3.801 |
| 1998-09-01 | 3.837 |
| 1998-09-02 | 3.81 |
| 1998-09-03 | 3.838 |
| 1998-09-04 | 3.854 |
| 1998-09-07 | 3.864 |
| 1998-09-08 | 3.857 |
| 1998-09-09 | 3.851 |
| 1998-09-10 | 3.852 |
| 1998-09-11 | 3.86 |
| 1998-09-14 | 3.837 |
| 1998-09-15 | 3.841 |
| 1998-09-16 | 3.837 |
| 1998-09-17 | 3.852 |
| 1998-09-18 | 3.842 |
| 1998-09-23 | 3.844 |
| 1998-09-24 | 3.843 |
| 1998-09-25 | 3.844 |
| 1998-09-28 | 3.845 |
| 1998-10-01 | 3.873 |
| 1998-10-02 | 3.931 |
| 1998-10-06 | 4.011 |
| 1998-10-07 | 4.096 |
| 1998-10-08 | 4.311 |
| 1998-10-09 | 4.26 |
| 1998-10-13 | 4.188 |
| 1998-10-14 | 4.185 |
| 1998-10-15 | 4.201 |
| 1998-10-16 | 4.189 |
| 1998-10-19 | 4.237 |
| 1998-10-20 | 4.316 |
| 1998-10-21 | 4.355 |
| 1998-10-22 | 4.367 |
| 1998-10-23 | 4.249 |
| 1998-10-26 | 4.189 |
| 1998-10-27 | 4.191 |
| 1998-10-28 | 4.188 |
| 1998-10-29 | 4.293 |
| 1998-10-30 | 4.25 |
| 1998-11-02 | 4.296 |
| 1998-11-03 | 4.302 |
| 1998-11-04 | 4.314 |
| 1998-11-05 | 4.309 |
| 1998-11-06 | 4.323 |
| 1998-11-09 | 4.316 |
| 1998-11-10 | 4.301 |
| 1998-11-11 | 4.263 |
| 1998-11-12 | 4.258 |
| 1998-11-13 | 4.194 |
| 1998-11-16 | 4.16 |
| 1998-11-17 | 4.152 |
| 1998-11-18 | 4.138 |
| 1998-11-19 | 4.159 |
| 1998-11-20 | 4.191 |
| 1998-11-23 | 4.19 |
| 1998-11-24 | 4.169 |
| 1998-11-25 | 4.157 |
| 1998-11-26 | 4.164 |
| 1998-11-27 | 4.206 |
| 1998-11-30 | 4.191 |
| 1998-12-01 | 4.185 |
| 1998-12-02 | 4.183 |
| 1998-12-03 | 4.19 |
| 1998-12-04 | 4.188 |
| 1998-12-07 | 4.19 |
| 1998-12-08 | 4.18 |
| 1998-12-09 | 4.162 |
| 1998-12-10 | 4.159 |
| 1998-12-11 | 4.159 |
| 1998-12-14 | 4.162 |
| 1998-12-15 | 4.164 |
| 1998-12-16 | 4.172 |
| 1998-12-17 | 4.186 |
| 1998-12-18 | 4.197 |
| 1998-12-21 | 4.191 |
| 1998-12-22 | 4.187 |
| 1998-12-23 | 4.183 |
| 1998-12-24 | 4.181 |
| 1998-12-28 | 4.175 |
| 1998-12-29 | 4.163 |
| 1998-12-30 | 4.164 |
| 1998-12-31 | 4.16 |
| 1999-01-04 | 4.15 |
| 1999-01-05 | 4.105 |
| 1999-01-06 | 4.066 |
| 1999-01-07 | 4.065 |
| 1999-01-08 | 4.079 |
| 1999-01-11 | 4.063 |
| 1999-01-12 | 4.058 |
| 1999-01-13 | 4.084 |
| 1999-01-14 | 4.075 |
| 1999-01-15 | 4.085 |
| 1999-01-18 | 4.048 |
| 1999-01-19 | 4.064 |
| 1999-01-20 | 4.054 |
| 1999-01-21 | 4.075 |
| 1999-01-22 | 4.082 |
| 1999-01-25 | 4.079 |
| 1999-01-26 | 4.079 |
| 1999-01-27 | 4.079 |
| 1999-01-28 | 4.103 |
| 1999-01-29 | 4.103 |
| 1999-02-01 | 4.079 |
| 1999-02-02 | 4.076 |
| 1999-02-03 | 4.086 |
| 1999-02-04 | 4.079 |
| 1999-02-05 | 4.087 |
| 1999-02-08 | 4.081 |
| 1999-02-09 | 4.082 |
| 1999-02-10 | 4.075 |
| 1999-02-11 | 4.075 |
| 1999-02-12 | 4.065 |
| 1999-02-15 | 4.051 |
| 1999-02-16 | 4.051 |
| 1999-02-17 | 4.057 |
| 1999-02-18 | 4.069 |
| 1999-02-19 | 4.065 |
| 1999-02-22 | 4.066 |
| 1999-02-23 | 4.056 |
| 1999-02-24 | 4.05 |
| 1999-02-25 | 4.056 |
| 1999-02-26 | 4.047 |
| 1999-03-01 | 4.047 |
| 1999-03-04 | 4.045 |
| 1999-03-05 | 4.031 |
| 1999-03-08 | 4.028 |
| 1999-03-09 | 4.031 |
| 1999-03-10 | 4.013 |
| 1999-03-11 | 4.013 |
| 1999-03-12 | 4.015 |
| 1999-03-15 | 4.02 |
| 1999-03-16 | 4.037 |
| 1999-03-17 | 4.022 |
| 1999-03-18 | 4.021 |
| 1999-03-19 | 4.023 |
| 1999-03-22 | 4.025 |
| 1999-03-23 | 4.032 |
| 1999-03-24 | 4.033 |
| 1999-03-25 | 4.06 |
| 1999-03-26 | 4.055 |
| 1999-03-29 | 4.032 |
| 1999-03-30 | 4.034 |
| 1999-04-06 | 4.04 |
| 1999-04-08 | 4.035 |
| 1999-04-09 | 4.034 |
| 1999-04-12 | 4.028 |
| 1999-04-13 | 4.032 |
| 1999-04-14 | 4.031 |
| 1999-04-15 | 4.034 |
| 1999-04-16 | 4.027 |
| 1999-04-19 | 4.029 |
| 1999-04-20 | 4.038 |
| 1999-04-22 | 4.042 |
| 1999-04-23 | 4.049 |
| 1999-04-26 | 4.074 |
| 1999-04-27 | 4.099 |
| 1999-04-28 | 4.138 |
| 1999-04-29 | 4.152 |
| 1999-04-30 | 4.155 |
| 1999-05-03 | 4.136 |
| 1999-05-04 | 4.127 |
| 1999-05-05 | 4.094 |
| 1999-05-06 | 4.105 |
| 1999-05-07 | 4.118 |
| 1999-05-10 | 4.134 |
| 1999-05-11 | 4.155 |
| 1999-05-12 | 4.137 |
| 1999-05-13 | 4.138 |
| 1999-05-14 | 4.105 |
| 1999-05-18 | 4.077 |
| 1999-05-19 | 4.089 |
| 1999-05-20 | 4.097 |
| 1999-05-24 | 4.11 |
| 1999-05-25 | 4.13 |
| 1999-05-26 | 4.13 |
| 1999-05-27 | 4.114 |
| 1999-05-28 | 4.121 |
| 1999-06-01 | 4.096 |
| 1999-06-02 | 4.087 |
| 1999-06-03 | 4.103 |
| 1999-06-04 | 4.098 |
| 1999-06-07 | 4.089 |
| 1999-06-08 | 4.088 |
| 1999-06-09 | 4.086 |
| 1999-06-10 | 4.087 |
| 1999-06-11 | 4.085 |
| 1999-06-14 | 4.076 |
| 1999-06-15 | 4.071 |
| 1999-06-16 | 4.078 |
| 1999-06-17 | 4.071 |
| 1999-06-18 | 4.078 |
| 1999-06-21 | 4.084 |
| 1999-06-22 | 4.092 |
| 1999-06-23 | 4.115 |
| 1999-06-24 | 4.125 |
| 1999-06-25 | 4.117 |
| 1999-06-28 | 4.087 |
| 1999-06-29 | 4.074 |
| 1999-06-30 | 4.076 |
| 1999-07-01 | 4.067 |
| 1999-07-02 | 4.075 |
| 1999-07-05 | 4.097 |
| 1999-07-06 | 4.082 |
| 1999-07-07 | 4.083 |
| 1999-07-08 | 4.089 |
| 1999-07-09 | 4.096 |
| 1999-07-12 | 4.09 |
| 1999-07-13 | 4.099 |
| 1999-07-14 | 4.09 |
| 1999-07-15 | 4.084 |
| 1999-07-16 | 4.082 |
| 1999-07-19 | 4.078 |
| 1999-07-20 | 4.082 |
| 1999-07-21 | 4.092 |
| 1999-07-23 | 4.106 |
| 1999-07-26 | 4.102 |
| 1999-07-27 | 4.122 |
| 1999-07-28 | 4.121 |
| 1999-07-29 | 4.133 |
| 1999-07-30 | 4.159 |
| 1999-08-02 | 4.182 |
| 1999-08-03 | 4.157 |
| 1999-08-04 | 4.164 |
| 1999-08-05 | 4.18 |
| 1999-08-06 | 4.172 |
| 1999-08-09 | 4.17 |
| 1999-08-10 | 4.198 |
| 1999-08-11 | 4.191 |
| 1999-08-12 | 4.179 |
| 1999-08-13 | 4.195 |
| 1999-08-16 | 4.192 |
| 1999-08-17 | 4.201 |
| 1999-08-18 | 4.199 |
| 1999-08-19 | 4.208 |
| 1999-08-20 | 4.234 |
| 1999-08-23 | 4.215 |
| 1999-08-24 | 4.213 |
| 1999-08-25 | 4.25 |
| 1999-08-26 | 4.246 |
| 1999-08-27 | 4.234 |
| 1999-08-30 | 4.236 |
| 1999-08-31 | 4.241 |
| 1999-09-01 | 4.229 |
| 1999-09-02 | 4.229 |
| 1999-09-03 | 4.226 |
| 1999-09-06 | 4.214 |
| 1999-09-07 | 4.212 |
| 1999-09-08 | 4.23 |
| 1999-09-09 | 4.23 |
| 1999-09-13 | 4.241 |
| 1999-09-14 | 4.237 |
| 1999-09-15 | 4.235 |
| 1999-09-16 | 4.238 |
| 1999-09-17 | 4.24 |
| 1999-09-21 | 4.248 |
| 1999-09-22 | 4.254 |
| 1999-09-23 | 4.274 |
| 1999-09-24 | 4.288 |
| 1999-09-27 | 4.278 |
| 1999-09-28 | 4.278 |
| 1999-09-29 | 4.277 |
| 1999-09-30 | 4.276 |
| 1999-10-01 | 4.265 |
| 1999-10-04 | 4.262 |
| 1999-10-05 | 4.257 |
| 1999-10-06 | 4.261 |
| 1999-10-07 | 4.26 |
| 1999-10-08 | 4.262 |
| 1999-10-11 | 4.258 |
| 1999-10-12 | 4.261 |
| 1999-10-13 | 4.271 |
| 1999-10-14 | 4.264 |
| 1999-10-15 | 4.267 |
| 1999-10-18 | 4.274 |
| 1999-10-19 | 4.271 |
| 1999-10-20 | 4.268 |
| 1999-10-21 | 4.27 |
| 1999-10-22 | 4.271 |
| 1999-10-25 | 4.268 |
| 1999-10-26 | 4.26 |
| 1999-10-27 | 4.261 |
| 1999-10-28 | 4.263 |
| 1999-10-29 | 4.251 |
| 1999-11-01 | 4.242 |
| 1999-11-02 | 4.237 |
| 1999-11-03 | 4.234 |
| 1999-11-04 | 4.222 |
| 1999-11-05 | 4.222 |
| 1999-11-08 | 4.219 |
| 1999-11-09 | 4.215 |
| 1999-11-10 | 4.212 |
| 1999-11-11 | 4.205 |
| 1999-11-12 | 4.208 |
| 1999-11-15 | 4.236 |
| 1999-11-16 | 4.231 |
| 1999-11-17 | 4.212 |
| 1999-11-18 | 4.229 |
| 1999-11-19 | 4.231 |
| 1999-11-22 | 4.239 |
| 1999-11-23 | 4.234 |
| 1999-11-24 | 4.227 |
| 1999-11-25 | 4.233 |
| 1999-11-26 | 4.233 |
| 1999-11-29 | 4.229 |
| 1999-11-30 | 4.227 |
| 1999-12-01 | 4.23 |
| 1999-12-02 | 4.227 |
| 1999-12-03 | 4.225 |
| 1999-12-06 | 4.222 |
| 1999-12-07 | 4.229 |
| 1999-12-08 | 4.238 |
| 1999-12-09 | 4.225 |
| 1999-12-10 | 4.223 |
| 1999-12-13 | 4.204 |
| 1999-12-14 | 4.185 |
| 1999-12-15 | 4.187 |
| 1999-12-16 | 4.191 |
| 1999-12-17 | 4.188 |
| 1999-12-20 | 4.17 |
| 1999-12-21 | 4.18 |
| 1999-12-22 | 4.175 |
| 1999-12-23 | 4.169 |
| 1999-12-24 | 4.162 |
| 1999-12-27 | 4.166 |
| 1999-12-28 | 4.142 |
| 1999-12-29 | 4.151 |
| 1999-12-30 | 4.153 |
| 2000-01-03 | 4.124 |
| 2000-01-04 | 4.137 |
| 2000-01-05 | 4.148 |
| 2000-01-06 | 4.152 |
| 2000-01-07 | 4.139 |
| 2000-01-10 | 4.115 |
| 2000-01-11 | 4.11 |
| 2000-01-12 | 4.119 |
| 2000-01-13 | 4.115 |
| 2000-01-14 | 4.102 |
| 2000-01-17 | 4.082 |
| 2000-01-18 | 4.058 |
| 2000-01-19 | 4.088 |
| 2000-01-20 | 4.092 |
| 2000-01-21 | 4.096 |
| 2000-01-24 | 4.096 |
| 2000-01-25 | 4.103 |
| 2000-01-26 | 4.08 |
| 2000-01-27 | 4.086 |
| 2000-01-28 | 4.078 |
| 2000-01-31 | 4.082 |
| 2000-02-01 | 4.075 |
| 2000-02-02 | 4.066 |
| 2000-02-03 | 4.053 |
| 2000-02-04 | 4.053 |
| 2000-02-07 | 4.069 |
| 2000-02-08 | 4.066 |
| 2000-02-09 | 4.064 |
| 2000-02-10 | 4.068 |
| 2000-02-11 | 4.064 |
| 2000-02-14 | 4.051 |
| 2000-02-15 | 4.056 |
| 2000-02-16 | 4.043 |
| 2000-02-17 | 4.045 |
| 2000-02-18 | 4.048 |
| 2000-02-21 | 4.052 |
| 2000-02-22 | 4.051 |
| 2000-02-23 | 4.046 |
| 2000-02-24 | 4.041 |
| 2000-02-25 | 4.042 |
| 2000-02-28 | 4.04 |
| 2000-02-29 | 4.032 |
| 2000-03-01 | 4.03 |
| 2000-03-02 | 4.024 |
| 2000-03-03 | 4.023 |
| 2000-03-06 | 4.001 |
| 2000-03-07 | 3.999 |
| 2000-03-08 | 4.013 |
| 2000-03-09 | 3.99 |
| 2000-03-10 | 3.972 |
| 2000-03-13 | 3.972 |
| 2000-03-14 | 3.97 |
| 2000-03-15 | 3.975 |
| 2000-03-16 | 3.98 |
| 2000-03-17 | 3.967 |
| 2000-03-20 | 3.985 |
| 2000-03-23 | 4.056 |
| 2000-03-24 | 4.047 |
| 2000-03-27 | 4.023 |
| 2000-03-28 | 3.992 |
| 2000-03-29 | 4.008 |
| 2000-03-30 | 4.034 |
| 2000-03-31 | 4.026 |
| 2000-04-03 | 4.051 |
| 2000-04-04 | 4.031 |
| 2000-04-05 | 4.059 |
| 2000-04-06 | 4.038 |
| 2000-04-07 | 4.031 |
| 2000-04-10 | 4.026 |
| 2000-04-11 | 4.041 |
| 2000-04-12 | 4.034 |
| 2000-04-13 | 4.038 |
| 2000-04-14 | 4.033 |
| 2000-04-17 | 4.072 |
| 2000-04-18 | 4.05 |
| 2000-04-25 | 4.026 |
| 2000-04-27 | 4.039 |
| 2000-04-28 | 4.035 |
| 2000-05-02 | 4.083 |
| 2000-05-03 | 4.084 |
| 2000-05-04 | 4.095 |
| 2000-05-05 | 4.11 |
| 2000-05-08 | 4.119 |
| 2000-05-09 | 4.127 |
| 2000-05-11 | 4.151 |
| 2000-05-12 | 4.146 |
| 2000-05-15 | 4.136 |
| 2000-05-16 | 4.14 |
| 2000-05-17 | 4.138 |
| 2000-05-18 | 4.159 |
| 2000-05-19 | 4.165 |
| 2000-05-22 | 4.192 |
| 2000-05-23 | 4.197 |
| 2000-05-24 | 4.198 |
| 2000-05-25 | 4.165 |
| 2000-05-26 | 4.168 |
| 2000-05-30 | 4.17 |
| 2000-05-31 | 4.168 |
| 2000-06-01 | 4.157 |
| 2000-06-02 | 4.138 |
| 2000-06-05 | 4.129 |
| 2000-06-06 | 4.129 |
| 2000-06-07 | 4.143 |
| 2000-06-08 | 4.14 |
| 2000-06-12 | 4.104 |
| 2000-06-13 | 4.108 |
| 2000-06-14 | 4.104 |
| 2000-06-15 | 4.095 |
| 2000-06-16 | 4.097 |
| 2000-06-19 | 4.084 |
| 2000-06-20 | 4.098 |
| 2000-06-21 | 4.102 |
| 2000-06-22 | 4.092 |
| 2000-06-23 | 4.093 |
| 2000-06-26 | 4.091 |
| 2000-06-27 | 4.082 |
| 2000-06-28 | 4.093 |
| 2000-06-29 | 4.082 |
| 2000-06-30 | 4.084 |
| 2000-07-03 | 4.069 |
| 2000-07-04 | 4.074 |
| 2000-07-05 | 4.075 |
| 2000-07-06 | 4.077 |
| 2000-07-07 | 4.09 |
| 2000-07-10 | 4.106 |
| 2000-07-11 | 4.095 |
| 2000-07-12 | 4.089 |
| 2000-07-13 | 4.086 |
| 2000-07-14 | 4.098 |
| 2000-07-17 | 4.092 |
| 2000-07-18 | 4.092 |
| 2000-07-19 | 4.103 |
| 2000-07-20 | 4.105 |
| 2000-07-21 | 4.095 |
| 2000-07-24 | 4.09 |
| 2000-07-25 | 4.085 |
| 2000-07-26 | 4.094 |
| 2000-07-27 | 4.089 |
| 2000-07-28 | 4.09 |
| 2000-07-31 | 4.085 |
| 2000-08-01 | 4.08 |
| 2000-08-02 | 4.08 |
| 2000-08-03 | 4.081 |
| 2000-08-04 | 4.081 |
| 2000-08-07 | 4.074 |
| 2000-08-08 | 4.072 |
| 2000-08-09 | 4.064 |
| 2000-08-11 | 4.065 |
| 2000-08-14 | 4.051 |
| 2000-08-15 | 4.041 |
| 2000-08-16 | 4.046 |
| 2000-08-17 | 4.037 |
| 2000-08-18 | 4.04 |
| 2000-08-21 | 4.031 |
| 2000-08-22 | 4.024 |
| 2000-08-23 | 4.038 |
| 2000-08-24 | 4.034 |
| 2000-08-25 | 4.041 |
| 2000-08-28 | 4.036 |
| 2000-08-29 | 4.028 |
| 2000-08-30 | 4.008 |
| 2000-08-31 | 4.004 |
| 2000-09-01 | 4.012 |
| 2000-09-04 | 4.022 |
| 2000-09-05 | 4.019 |
| 2000-09-06 | 4.029 |
| 2000-09-07 | 4.034 |
| 2000-09-08 | 4.029 |
| 2000-09-11 | 4.034 |
| 2000-09-12 | 4.046 |
| 2000-09-13 | 4.043 |
| 2000-09-14 | 4.03 |
| 2000-09-15 | 4.039 |
| 2000-09-18 | 4.053 |
| 2000-09-19 | 4.062 |
| 2000-09-20 | 4.049 |
| 2000-09-21 | 4.057 |
| 2000-09-22 | 4.071 |
| 2000-09-25 | 4.047 |
| 2000-09-26 | 4.041 |
| 2000-09-27 | 4.03 |
| 2000-09-28 | 4.024 |
| 2000-10-02 | 4.035 |
| 2000-10-03 | 4.038 |
| 2000-10-04 | 4.035 |
| 2000-10-05 | 4.042 |
| 2000-10-06 | 4.051 |
| 2000-10-10 | 4.093 |
| 2000-10-11 | 4.078 |
| 2000-10-12 | 4.137 |
| 2000-10-13 | 4.12 |
| 2000-10-16 | 4.108 |
| 2000-10-17 | 4.142 |
| 2000-10-18 | 4.104 |
| 2000-10-19 | 4.11 |
| 2000-10-20 | 4.121 |
| 2000-10-23 | 4.142 |
| 2000-10-24 | 4.159 |
| 2000-10-25 | 4.147 |
| 2000-10-26 | 4.136 |
| 2000-10-27 | 4.14 |
| 2000-10-30 | 4.135 |
| 2000-10-31 | 4.137 |
| 2000-11-01 | 4.12 |
| 2000-11-02 | 4.108 |
| 2000-11-03 | 4.113 |
| 2000-11-06 | 4.108 |
| 2000-11-07 | 4.105 |
| 2000-11-08 | 4.117 |
| 2000-11-09 | 4.114 |
| 2000-11-10 | 4.116 |
| 2000-11-13 | 4.114 |
| 2000-11-14 | 4.113 |
| 2000-11-15 | 4.119 |
| 2000-11-16 | 4.112 |
| 2000-11-17 | 4.104 |
| 2000-11-20 | 4.095 |
| 2000-11-21 | 4.107 |
| 2000-11-22 | 4.119 |
| 2000-11-23 | 4.12 |
| 2000-11-24 | 4.107 |
| 2000-11-27 | 4.105 |
| 2000-11-28 | 4.1 |
| 2000-11-29 | 4.104 |
| 2000-11-30 | 4.093 |
| 2000-12-01 | 4.1 |
| 2000-12-04 | 4.103 |
| 2000-12-05 | 4.092 |
| 2000-12-06 | 4.09 |
| 2000-12-07 | 4.09 |
| 2000-12-08 | 4.09 |
| 2000-12-11 | 4.095 |
| 2000-12-12 | 4.093 |
| 2000-12-13 | 4.091 |
| 2000-12-14 | 4.095 |
| 2000-12-15 | 4.095 |
| 2000-12-18 | 4.08 |
| 2000-12-19 | 4.08 |
| 2000-12-20 | 4.071 |
| 2000-12-21 | 4.071 |
| 2000-12-22 | 4.062 |
| 2000-12-27 | 4.053 |
| 2000-12-28 | 4.05 |
| 2000-12-29 | 4.041 |
| 2001-01-02 | 4.077 |
| 2001-01-03 | 4.094 |
| 2001-01-04 | 4.067 |
| 2001-01-05 | 4.092 |
| 2001-01-08 | 4.123 |
| 2001-01-09 | 4.118 |
| 2001-01-10 | 4.111 |
| 2001-01-11 | 4.113 |
| 2001-01-12 | 4.106 |
| 2001-01-15 | 4.107 |
| 2001-01-16 | 4.113 |
| 2001-01-17 | 4.108 |
| 2001-01-18 | 4.125 |
| 2001-01-19 | 4.128 |
| 2001-01-22 | 4.144 |
| 2001-01-23 | 4.141 |
| 2001-01-24 | 4.15 |
| 2001-01-25 | 4.134 |
| 2001-01-26 | 4.136 |
| 2001-01-29 | 4.148 |
| 2001-01-30 | 4.153 |
| 2001-01-31 | 4.137 |
| 2001-02-01 | 4.143 |
| 2001-02-02 | 4.143 |
| 2001-02-05 | 4.136 |
| 2001-02-07 | 4.137 |
| 2001-02-08 | 4.136 |
| 2001-02-09 | 4.115 |
| 2001-02-12 | 4.11 |
| 2001-02-13 | 4.101 |
| 2001-02-14 | 4.1 |
| 2001-02-15 | 4.103 |
| 2001-02-16 | 4.105 |
| 2001-02-19 | 4.115 |
| 2001-02-20 | 4.118 |
| 2001-02-21 | 4.124 |
| 2001-02-22 | 4.137 |
| 2001-02-23 | 4.128 |
| 2001-02-26 | 4.131 |
| 2001-02-27 | 4.115 |
| 2001-02-28 | 4.112 |
| 2001-03-01 | 4.118 |
| 2001-03-02 | 4.115 |
| 2001-03-05 | 4.125 |
| 2001-03-06 | 4.12 |
| 2001-03-07 | 4.118 |
| 2001-03-08 | 4.125 |
| 2001-03-12 | 4.129 |
| 2001-03-13 | 4.134 |
| 2001-03-14 | 4.142 |
| 2001-03-15 | 4.174 |
| 2001-03-16 | 4.174 |
| 2001-03-19 | 4.175 |
| 2001-03-20 | 4.181 |
| 2001-03-21 | 4.212 |
| 2001-03-22 | 4.213 |
| 2001-03-23 | 4.216 |
| 2001-03-26 | 4.181 |
| 2001-03-27 | 4.184 |
| 2001-03-28 | 4.212 |
| 2001-03-29 | 4.217 |
| 2001-03-30 | 4.192 |
| 2001-04-02 | 4.216 |
| 2001-04-03 | 4.226 |
| 2001-04-04 | 4.212 |
| 2001-04-05 | 4.186 |
| 2001-04-06 | 4.187 |
| 2001-04-09 | 4.186 |
| 2001-04-10 | 4.167 |
| 2001-04-11 | 4.168 |
| 2001-04-12 | 4.177 |
| 2001-04-16 | 4.175 |
| 2001-04-17 | 4.202 |
| 2001-04-18 | 4.171 |
| 2001-04-19 | 4.163 |
| 2001-04-20 | 4.153 |
| 2001-04-23 | 4.153 |
| 2001-04-24 | 4.152 |
| 2001-04-25 | 4.157 |
| 2001-04-27 | 4.154 |
| 2001-04-30 | 4.139 |
| 2001-05-01 | 4.141 |
| 2001-05-02 | 4.144 |
| 2001-05-03 | 4.146 |
| 2001-05-04 | 4.149 |
| 2001-05-07 | 4.149 |
| 2001-05-08 | 4.146 |
| 2001-05-09 | 4.145 |
| 2001-05-10 | 4.144 |
| 2001-05-11 | 4.148 |
| 2001-05-14 | 4.15 |
| 2001-05-15 | 4.152 |
| 2001-05-16 | 4.147 |
| 2001-05-17 | 4.137 |
| 2001-05-18 | 4.138 |
| 2001-05-21 | 4.142 |
| 2001-05-22 | 4.138 |
| 2001-05-23 | 4.133 |
| 2001-05-24 | 4.127 |
| 2001-05-25 | 4.128 |
| 2001-05-29 | 4.122 |
| 2001-05-30 | 4.122 |
| 2001-05-31 | 4.133 |
| 2001-06-01 | 4.142 |
| 2001-06-04 | 4.162 |
| 2001-06-05 | 4.155 |
| 2001-06-06 | 4.142 |
| 2001-06-07 | 4.147 |
| 2001-06-08 | 4.147 |
| 2001-06-11 | 4.148 |
| 2001-06-12 | 4.155 |
| 2001-06-13 | 4.152 |
| 2001-06-14 | 4.164 |
| 2001-06-15 | 4.176 |
| 2001-06-18 | 4.171 |
| 2001-06-19 | 4.17 |
| 2001-06-20 | 4.167 |
| 2001-06-21 | 4.174 |
| 2001-06-22 | 4.18 |
| 2001-06-25 | 4.177 |
| 2001-06-26 | 4.178 |
| 2001-06-27 | 4.175 |
| 2001-06-28 | 4.167 |
| 2001-06-29 | 4.165 |
| 2001-07-02 | 4.175 |
| 2001-07-03 | 4.181 |
| 2001-07-04 | 4.182 |
| 2001-07-05 | 4.189 |
| 2001-07-06 | 4.195 |
| 2001-07-09 | 4.204 |
| 2001-07-10 | 4.194 |
| 2001-07-11 | 4.2 |
| 2001-07-12 | 4.197 |
| 2001-07-13 | 4.206 |
| 2001-07-16 | 4.204 |
| 2001-07-17 | 4.211 |
| 2001-07-18 | 4.215 |
| 2001-07-19 | 4.205 |
| 2001-07-20 | 4.205 |
| 2001-07-23 | 4.194 |
| 2001-07-24 | 4.191 |
| 2001-07-25 | 4.198 |
| 2001-07-26 | 4.198 |
| 2001-07-27 | 4.205 |
| 2001-07-30 | 4.204 |
| 2001-07-31 | 4.209 |
| 2001-08-01 | 4.211 |
| 2001-08-02 | 4.217 |
| 2001-08-03 | 4.216 |
| 2001-08-06 | 4.22 |
| 2001-08-07 | 4.235 |
| 2001-08-08 | 4.232 |
| 2001-08-09 | 4.234 |
| 2001-08-10 | 4.24 |
| 2001-08-13 | 4.232 |
| 2001-08-14 | 4.235 |
| 2001-08-15 | 4.24 |
| 2001-08-16 | 4.235 |
| 2001-08-17 | 4.228 |
| 2001-08-20 | 4.235 |
| 2001-08-21 | 4.235 |
| 2001-08-22 | 4.232 |
| 2001-08-23 | 4.23 |
| 2001-08-24 | 4.232 |
| 2001-08-27 | 4.23 |
| 2001-08-28 | 4.238 |
| 2001-08-29 | 4.254 |
| 2001-08-30 | 4.244 |
| 2001-08-31 | 4.262 |
| 2001-09-03 | 4.261 |
| 2001-09-04 | 4.267 |
| 2001-09-05 | 4.293 |
| 2001-09-06 | 4.299 |
| 2001-09-07 | 4.295 |
| 2001-09-10 | 4.314 |
| 2001-09-11 | 4.345 |
| 2001-09-12 | 4.338 |
| 2001-09-13 | 4.334 |
| 2001-09-14 | 4.319 |
| 2001-09-20 | 4.337 |
| 2001-09-21 | 4.361 |
| 2001-09-24 | 4.363 |
| 2001-09-25 | 4.356 |
| 2001-09-28 | 4.355 |
| 2001-10-01 | 4.358 |
| 2001-10-03 | 4.37 |
| 2001-10-04 | 4.359 |
| 2001-10-05 | 4.345 |
| 2001-10-08 | 4.329 |
| 2001-10-10 | 4.328 |
| 2001-10-11 | 4.312 |
| 2001-10-12 | 4.32 |
| 2001-10-15 | 4.309 |
| 2001-10-16 | 4.292 |
| 2001-10-17 | 4.304 |
| 2001-10-18 | 4.301 |
| 2001-10-19 | 4.316 |
| 2001-10-22 | 4.293 |
| 2001-10-23 | 4.287 |
| 2001-10-24 | 4.311 |
| 2001-10-25 | 4.308 |
| 2001-10-26 | 4.296 |
| 2001-10-29 | 4.295 |
| 2001-10-30 | 4.296 |
| 2001-10-31 | 4.281 |
| 2001-11-01 | 4.275 |
| 2001-11-02 | 4.27 |
| 2001-11-05 | 4.257 |
| 2001-11-06 | 4.261 |
| 2001-11-07 | 4.265 |
| 2001-11-08 | 4.249 |
| 2001-11-09 | 4.234 |
| 2001-11-12 | 4.219 |
| 2001-11-13 | 4.216 |
| 2001-11-14 | 4.231 |
| 2001-11-15 | 4.233 |
| 2001-11-16 | 4.237 |
| 2001-11-19 | 4.227 |
| 2001-11-20 | 4.228 |
| 2001-11-21 | 4.224 |
| 2001-11-22 | 4.228 |
| 2001-11-23 | 4.231 |
| 2001-11-26 | 4.246 |
| 2001-11-27 | 4.241 |
| 2001-11-28 | 4.226 |
| 2001-11-29 | 4.224 |
| 2001-11-30 | 4.233 |
| 2001-12-03 | 4.241 |
| 2001-12-04 | 4.251 |
| 2001-12-05 | 4.236 |
| 2001-12-06 | 4.224 |
| 2001-12-07 | 4.225 |
| 2001-12-10 | 4.22 |
| 2001-12-11 | 4.223 |
| 2001-12-12 | 4.223 |
| 2001-12-13 | 4.229 |
| 2001-12-14 | 4.237 |
| 2001-12-17 | 4.232 |
| 2001-12-18 | 4.237 |
| 2001-12-19 | 4.26 |
| 2001-12-20 | 4.272 |
| 2001-12-21 | 4.323 |
| 2001-12-24 | 4.335 |
| 2001-12-26 | 4.373 |
| 2001-12-27 | 4.371 |
| 2001-12-28 | 4.385 |
| 2001-12-31 | 4.416 |
| 2002-01-02 | 4.437 |
| 2002-01-03 | 4.473 |
| 2002-01-04 | 4.491 |
| 2002-01-07 | 4.513 |
| 2002-01-08 | 4.489 |
| 2002-01-09 | 4.462 |
| 2002-01-10 | 4.469 |
| 2002-01-11 | 4.498 |
| 2002-01-14 | 4.487 |
| 2002-01-15 | 4.507 |
| 2002-01-16 | 4.535 |
| 2002-01-17 | 4.535 |
| 2002-01-18 | 4.515 |
| 2002-01-21 | 4.553 |
| 2002-01-22 | 4.583 |
| 2002-01-23 | 4.603 |
| 2002-01-24 | 4.6 |
| 2002-01-25 | 4.596 |
| 2002-01-28 | 4.612 |
| 2002-01-29 | 4.637 |
| 2002-01-30 | 4.619 |
| 2002-01-31 | 4.602 |
| 2002-02-01 | 4.588 |
| 2002-02-04 | 4.602 |
| 2002-02-05 | 4.623 |
| 2002-02-06 | 4.633 |
| 2002-02-07 | 4.667 |
| 2002-02-08 | 4.667 |
| 2002-02-11 | 4.744 |
| 2002-02-12 | 4.72 |
| 2002-02-13 | 4.648 |
| 2002-02-14 | 4.635 |
| 2002-02-15 | 4.631 |
| 2002-02-18 | 4.678 |
| 2002-02-19 | 4.722 |
| 2002-02-20 | 4.701 |
| 2002-02-21 | 4.692 |
| 2002-02-22 | 4.7 |
| 2002-02-25 | 4.642 |
| 2002-02-28 | 4.623 |
| 2002-03-01 | 4.675 |
| 2002-03-04 | 4.677 |
| 2002-03-05 | 4.694 |
| 2002-03-06 | 4.716 |
| 2002-03-07 | 4.693 |
| 2002-03-08 | 4.663 |
| 2002-03-11 | 4.664 |
| 2002-03-12 | 4.67 |
| 2002-03-13 | 4.676 |
| 2002-03-14 | 4.665 |
| 2002-03-15 | 4.658 |
| 2002-03-18 | 4.648 |
| 2002-03-19 | 4.628 |
| 2002-03-20 | 4.622 |
| 2002-03-21 | 4.635 |
| 2002-03-22 | 4.642 |
| 2002-03-25 | 4.665 |
| 2002-03-26 | 4.668 |
| 2002-04-02 | 4.781 |
| 2002-04-04 | 4.776 |
| 2002-04-05 | 4.74 |
| 2002-04-08 | 4.76 |
| 2002-04-09 | 4.775 |
| 2002-04-10 | 4.767 |
| 2002-04-11 | 4.765 |
| 2002-04-12 | 4.799 |
| 2002-04-15 | 4.793 |
| 2002-04-16 | 4.794 |
| 2002-04-18 | 4.791 |
| 2002-04-19 | 4.786 |
| 2002-04-22 | 4.784 |
| 2002-04-23 | 4.787 |
| 2002-04-24 | 4.864 |
| 2002-04-25 | 4.883 |
| 2002-04-26 | 4.876 |
| 2002-04-29 | 4.904 |
| 2002-04-30 | 4.893 |
| 2002-05-01 | 4.878 |
| 2002-05-02 | 4.857 |
| 2002-05-03 | 4.829 |
| 2002-05-06 | 4.844 |
| 2002-05-07 | 4.868 |
| 2002-05-08 | 4.904 |
| 2002-05-09 | 4.918 |
| 2002-05-10 | 4.932 |
| 2002-05-13 | 4.919 |
| 2002-05-14 | 4.899 |
| 2002-05-15 | 4.89 |
| 2002-05-16 | 4.872 |
| 2002-05-20 | 4.854 |
| 2002-05-21 | 4.873 |
| 2002-05-22 | 4.865 |
| 2002-05-23 | 4.906 |
| 2002-05-24 | 4.913 |
| 2002-05-27 | 4.882 |
| 2002-05-28 | 4.944 |
| 2002-05-29 | 4.968 |
| 2002-05-30 | 4.938 |
| 2002-05-31 | 4.916 |
| 2002-06-03 | 4.928 |
| 2002-06-04 | 4.942 |
| 2002-06-05 | 4.978 |
| 2002-06-06 | 4.967 |
| 2002-06-07 | 4.991 |
| 2002-06-10 | 4.978 |
| 2002-06-11 | 4.994 |
| 2002-06-12 | 4.964 |
| 2002-06-13 | 4.96 |
| 2002-06-14 | 4.954 |
| 2002-06-17 | 4.944 |
| 2002-06-18 | 4.929 |
| 2002-06-19 | 4.955 |
| 2002-06-20 | 4.983 |
| 2002-06-21 | 4.982 |
| 2002-06-24 | 4.942 |
| 2002-06-25 | 4.919 |
| 2002-06-26 | 4.882 |
| 2002-06-27 | 4.826 |
| 2002-06-28 | 4.769 |
| 2002-07-01 | 4.762 |
| 2002-07-02 | 4.766 |
| 2002-07-03 | 4.767 |
| 2002-07-04 | 4.775 |
| 2002-07-05 | 4.807 |
| 2002-07-08 | 4.788 |
| 2002-07-09 | 4.753 |
| 2002-07-10 | 4.726 |
| 2002-07-11 | 4.715 |
| 2002-07-12 | 4.728 |
| 2002-07-15 | 4.67 |
| 2002-07-16 | 4.686 |
| 2002-07-17 | 4.661 |
| 2002-07-19 | 4.668 |
| 2002-07-22 | 4.637 |
| 2002-07-23 | 4.665 |
| 2002-07-24 | 4.694 |
| 2002-07-25 | 4.722 |
| 2002-07-26 | 4.741 |
| 2002-07-29 | 4.731 |
| 2002-07-30 | 4.71 |
| 2002-07-31 | 4.689 |
| 2002-08-01 | 4.698 |
| 2002-08-02 | 4.717 |
| 2002-08-05 | 4.722 |
| 2002-08-06 | 4.705 |
| 2002-08-07 | 4.71 |
| 2002-08-08 | 4.702 |
| 2002-08-09 | 4.678 |
| 2002-08-12 | 4.672 |
| 2002-08-13 | 4.688 |
| 2002-08-14 | 4.685 |
| 2002-08-15 | 4.674 |
| 2002-08-16 | 4.666 |
| 2002-08-19 | 4.639 |
| 2002-08-20 | 4.623 |
| 2002-08-21 | 4.639 |
| 2002-08-22 | 4.66 |
| 2002-08-23 | 4.664 |
| 2002-08-26 | 4.673 |
| 2002-08-27 | 4.669 |
| 2002-08-28 | 4.666 |
| 2002-08-29 | 4.666 |
| 2002-08-30 | 4.66 |
| 2002-09-02 | 4.679 |
| 2002-09-03 | 4.684 |
| 2002-09-04 | 4.719 |
| 2002-09-05 | 4.744 |
| 2002-09-09 | 4.736 |
| 2002-09-10 | 4.741 |
| 2002-09-11 | 4.767 |
| 2002-09-12 | 4.743 |
| 2002-09-13 | 4.731 |
| 2002-09-17 | 4.717 |
| 2002-09-18 | 4.746 |
| 2002-09-19 | 4.792 |
| 2002-09-20 | 4.815 |
| 2002-09-23 | 4.827 |
| 2002-09-24 | 4.831 |
| 2002-09-25 | 4.89 |
| 2002-09-26 | 4.845 |
| 2002-09-27 | 4.847 |
| 2002-09-30 | 4.871 |
| 2002-10-01 | 4.862 |
| 2002-10-02 | 4.828 |
| 2002-10-03 | 4.841 |
| 2002-10-04 | 4.842 |
| 2002-10-07 | 4.859 |
| 2002-10-08 | 4.852 |
| 2002-10-09 | 4.839 |
| 2002-10-10 | 4.827 |
| 2002-10-11 | 4.821 |
| 2002-10-14 | 4.827 |
| 2002-10-15 | 4.827 |
| 2002-10-16 | 4.819 |
| 2002-10-17 | 4.76 |
| 2002-10-18 | 4.762 |
| 2002-10-21 | 4.745 |
| 2002-10-22 | 4.769 |
| 2002-10-23 | 4.741 |
| 2002-10-24 | 4.738 |
| 2002-10-25 | 4.746 |
| 2002-10-28 | 4.766 |
| 2002-10-29 | 4.779 |
| 2002-10-30 | 4.746 |
| 2002-10-31 | 4.765 |
| 2002-11-01 | 4.756 |
| 2002-11-04 | 4.747 |
| 2002-11-05 | 4.737 |
| 2002-11-06 | 4.701 |
| 2002-11-07 | 4.701 |
| 2002-11-08 | 4.71 |
| 2002-11-11 | 4.689 |
| 2002-11-12 | 4.709 |
| 2002-11-13 | 4.696 |
| 2002-11-14 | 4.668 |
| 2002-11-15 | 4.664 |
| 2002-11-18 | 4.669 |
| 2002-11-19 | 4.68 |
| 2002-11-20 | 4.683 |
| 2002-11-21 | 4.68 |
| 2002-11-22 | 4.679 |
| 2002-11-25 | 4.677 |
| 2002-11-26 | 4.652 |
| 2002-11-27 | 4.634 |
| 2002-11-28 | 4.645 |
| 2002-11-29 | 4.643 |
| 2002-12-02 | 4.632 |
| 2002-12-03 | 4.64 |
| 2002-12-04 | 4.649 |
| 2002-12-05 | 4.656 |
| 2002-12-06 | 4.698 |
| 2002-12-09 | 4.694 |
| 2002-12-10 | 4.673 |
| 2002-12-11 | 4.662 |
| 2002-12-12 | 4.667 |
| 2002-12-13 | 4.652 |
| 2002-12-16 | 4.635 |
| 2002-12-17 | 4.647 |
| 2002-12-18 | 4.663 |
| 2002-12-19 | 4.729 |
| 2002-12-20 | 4.736 |
| 2002-12-23 | 4.732 |
| 2002-12-24 | 4.744 |
| 2002-12-26 | 4.762 |
| 2002-12-27 | 4.791 |
| 2002-12-30 | 4.769 |
| 2002-12-31 | 4.737 |
| 2003-01-02 | 4.785 |
| 2003-01-03 | 4.8 |
| 2003-01-06 | 4.787 |
| 2003-01-07 | 4.769 |
| 2003-01-08 | 4.823 |
| 2003-01-09 | 4.822 |
| 2003-01-10 | 4.81 |
| 2003-01-13 | 4.825 |
| 2003-01-14 | 4.825 |
| 2003-01-15 | 4.836 |
| 2003-01-16 | 4.826 |
| 2003-01-17 | 4.84 |
| 2003-01-20 | 4.855 |
| 2003-01-21 | 4.877 |
| 2003-01-22 | 4.898 |
| 2003-01-23 | 4.887 |
| 2003-01-24 | 4.887 |
| 2003-01-27 | 4.887 |
| 2003-01-29 | 4.881 |
| 2003-01-30 | 4.828 |
| 2003-01-31 | 4.814 |
| 2003-02-03 | 4.837 |
| 2003-02-04 | 4.872 |
| 2003-02-05 | 4.888 |
| 2003-02-06 | 4.87 |
| 2003-02-07 | 4.868 |
| 2003-02-10 | 4.872 |
| 2003-02-11 | 4.862 |
| 2003-02-12 | 4.859 |
| 2003-02-13 | 4.894 |
| 2003-02-14 | 4.924 |
| 2003-02-17 | 4.858 |
| 2003-02-18 | 4.846 |
| 2003-02-19 | 4.859 |
| 2003-02-20 | 4.876 |
| 2003-02-21 | 4.88 |
| 2003-02-24 | 4.869 |
| 2003-02-25 | 4.875 |
| 2003-02-26 | 4.858 |
| 2003-02-27 | 4.841 |
| 2003-02-28 | 4.81 |
| 2003-03-03 | 4.834 |
| 2003-03-04 | 4.844 |
| 2003-03-05 | 4.858 |
| 2003-03-06 | 4.84 |
| 2003-03-07 | 4.849 |
| 2003-03-10 | 4.849 |
| 2003-03-11 | 4.842 |
| 2003-03-12 | 4.832 |
| 2003-03-13 | 4.787 |
| 2003-03-14 | 4.795 |
| 2003-03-17 | 4.815 |
| 2003-03-20 | 4.744 |
| 2003-03-21 | 4.747 |
| 2003-03-24 | 4.718 |
| 2003-03-25 | 4.702 |
| 2003-03-26 | 4.687 |
| 2003-03-27 | 4.698 |
| 2003-03-28 | 4.71 |
| 2003-03-31 | 4.687 |
| 2003-04-01 | 4.658 |
| 2003-04-02 | 4.671 |
| 2003-04-03 | 4.664 |
| 2003-04-04 | 4.661 |
| 2003-04-07 | 4.644 |
| 2003-04-08 | 4.647 |
| 2003-04-09 | 4.63 |
| 2003-04-10 | 4.638 |
| 2003-04-11 | 4.658 |
| 2003-04-14 | 4.59 |
| 2003-04-15 | 4.579 |
| 2003-04-22 | 4.616 |
| 2003-04-24 | 4.564 |
| 2003-04-25 | 4.583 |
| 2003-04-28 | 4.572 |
| 2003-04-29 | 4.521 |
| 2003-05-02 | 4.486 |
| 2003-05-05 | 4.481 |
| 2003-05-06 | 4.46 |
| 2003-05-08 | 4.484 |
| 2003-05-09 | 4.46 |
| 2003-05-12 | 4.465 |
| 2003-05-13 | 4.501 |
| 2003-05-14 | 4.489 |
| 2003-05-19 | 4.518 |
| 2003-05-20 | 4.542 |
| 2003-05-21 | 4.577 |
| 2003-05-22 | 4.551 |
| 2003-05-23 | 4.454 |
| 2003-05-27 | 4.432 |
| 2003-05-28 | 4.443 |
| 2003-05-29 | 4.408 |
| 2003-05-30 | 4.373 |
| 2003-06-02 | 4.409 |
| 2003-06-03 | 4.376 |
| 2003-06-04 | 4.374 |
| 2003-06-05 | 4.434 |
| 2003-06-09 | 4.399 |
| 2003-06-10 | 4.414 |
| 2003-06-11 | 4.414 |
| 2003-06-12 | 4.402 |
| 2003-06-13 | 4.399 |
| 2003-06-16 | 4.354 |
| 2003-06-17 | 4.353 |
| 2003-06-18 | 4.377 |
| 2003-06-19 | 4.372 |
| 2003-06-20 | 4.382 |
| 2003-06-23 | 4.395 |
| 2003-06-24 | 4.371 |
| 2003-06-25 | 4.358 |
| 2003-06-26 | 4.333 |
| 2003-06-27 | 4.332 |
| 2003-06-30 | 4.312 |
| 2003-07-01 | 4.314 |
| 2003-07-02 | 4.304 |
| 2003-07-03 | 4.294 |
| 2003-07-04 | 4.3 |
| 2003-07-07 | 4.283 |
| 2003-07-08 | 4.334 |
| 2003-07-09 | 4.347 |
| 2003-07-10 | 4.322 |
| 2003-07-11 | 4.363 |
| 2003-07-14 | 4.38 |
| 2003-07-15 | 4.384 |
| 2003-07-16 | 4.425 |
| 2003-07-17 | 4.445 |
| 2003-07-18 | 4.439 |
| 2003-07-21 | 4.426 |
| 2003-07-22 | 4.392 |
| 2003-07-23 | 4.376 |
| 2003-07-24 | 4.387 |
| 2003-07-25 | 4.401 |
| 2003-07-28 | 4.379 |
| 2003-07-29 | 4.387 |
| 2003-07-30 | 4.421 |
| 2003-07-31 | 4.429 |
| 2003-08-01 | 4.435 |
| 2003-08-04 | 4.465 |
| 2003-08-05 | 4.457 |
| 2003-08-06 | 4.433 |
| 2003-08-08 | 4.431 |
| 2003-08-11 | 4.437 |
| 2003-08-12 | 4.444 |
| 2003-08-13 | 4.44 |
| 2003-08-14 | 4.446 |
| 2003-08-15 | 4.443 |
| 2003-08-18 | 4.438 |
| 2003-08-19 | 4.437 |
| 2003-08-20 | 4.45 |
| 2003-08-21 | 4.466 |
| 2003-08-22 | 4.49 |
| 2003-08-25 | 4.479 |
| 2003-08-26 | 4.471 |
| 2003-08-27 | 4.472 |
| 2003-08-28 | 4.467 |
| 2003-08-29 | 4.443 |
| 2003-09-01 | 4.448 |
| 2003-09-02 | 4.458 |
| 2003-09-03 | 4.453 |
| 2003-09-04 | 4.44 |
| 2003-09-05 | 4.442 |
| 2003-09-08 | 4.46 |
| 2003-09-09 | 4.451 |
| 2003-09-10 | 4.467 |
| 2003-09-11 | 4.489 |
| 2003-09-12 | 4.532 |
| 2003-09-15 | 4.51 |
| 2003-09-16 | 4.485 |
| 2003-09-17 | 4.479 |
| 2003-09-18 | 4.467 |
| 2003-09-19 | 4.484 |
| 2003-09-22 | 4.454 |
| 2003-09-23 | 4.441 |
| 2003-09-24 | 4.452 |
| 2003-09-25 | 4.454 |
| 2003-09-29 | 4.455 |
| 2003-09-30 | 4.441 |
| 2003-10-01 | 4.434 |
| 2003-10-02 | 4.423 |
| 2003-10-03 | 4.414 |
| 2003-10-07 | 4.43 |
| 2003-10-08 | 4.432 |
| 2003-10-09 | 4.413 |
| 2003-10-10 | 4.421 |
| 2003-10-13 | 4.41 |
| 2003-10-14 | 4.413 |
| 2003-10-15 | 4.41 |
| 2003-10-16 | 4.428 |
| 2003-10-17 | 4.433 |
| 2003-10-20 | 4.441 |
| 2003-10-21 | 4.463 |
| 2003-10-22 | 4.465 |
| 2003-10-23 | 4.477 |
| 2003-10-24 | 4.487 |
| 2003-10-27 | 4.477 |
| 2003-10-28 | 4.48 |
| 2003-10-29 | 4.509 |
| 2003-10-30 | 4.504 |
| 2003-10-31 | 4.492 |
| 2003-11-03 | 4.498 |
| 2003-11-04 | 4.479 |
| 2003-11-05 | 4.48 |
| 2003-11-06 | 4.494 |
| 2003-11-07 | 4.493 |
| 2003-11-10 | 4.503 |
| 2003-11-11 | 4.537 |
| 2003-11-12 | 4.522 |
| 2003-11-13 | 4.507 |
| 2003-11-14 | 4.525 |
| 2003-11-17 | 4.526 |
| 2003-11-18 | 4.518 |
| 2003-11-19 | 4.491 |
| 2003-11-20 | 4.476 |
| 2003-11-21 | 4.488 |
| 2003-11-24 | 4.493 |
| 2003-11-25 | 4.476 |
| 2003-11-26 | 4.468 |
| 2003-11-27 | 4.451 |
| 2003-11-28 | 4.448 |
| 2003-12-01 | 4.434 |
| 2003-12-02 | 4.431 |
| 2003-12-03 | 4.423 |
| 2003-12-04 | 4.441 |
| 2003-12-05 | 4.441 |
| 2003-12-08 | 4.435 |
| 2003-12-09 | 4.388 |
| 2003-12-10 | 4.394 |
| 2003-12-11 | 4.389 |
| 2003-12-12 | 4.394 |
| 2003-12-15 | 4.352 |
| 2003-12-16 | 4.369 |
| 2003-12-17 | 4.374 |
| 2003-12-18 | 4.38 |
| 2003-12-19 | 4.387 |
| 2003-12-22 | 4.384 |
| 2003-12-23 | 4.363 |
| 2003-12-24 | 4.366 |
| 2003-12-29 | 4.368 |
| 2003-12-30 | 4.357 |
| 2003-12-31 | 4.379 |
| 2004-01-02 | 4.414 |
| 2004-01-05 | 4.406 |
| 2004-01-06 | 4.371 |
| 2004-01-07 | 4.395 |
| 2004-01-08 | 4.394 |
| 2004-01-09 | 4.383 |
| 2004-01-12 | 4.384 |
| 2004-01-13 | 4.395 |
| 2004-01-14 | 4.405 |
| 2004-01-15 | 4.415 |
| 2004-01-16 | 4.401 |
| 2004-01-19 | 4.421 |
| 2004-01-20 | 4.427 |
| 2004-01-21 | 4.422 |
| 2004-01-22 | 4.453 |
| 2004-01-23 | 4.438 |
| 2004-01-26 | 4.457 |
| 2004-01-27 | 4.465 |
| 2004-01-28 | 4.483 |
| 2004-01-29 | 4.482 |
| 2004-01-30 | 4.483 |
| 2004-02-02 | 4.493 |
| 2004-02-03 | 4.456 |
| 2004-02-04 | 4.474 |
| 2004-02-05 | 4.481 |
| 2004-02-06 | 4.468 |
| 2004-02-09 | 4.469 |
| 2004-02-10 | 4.474 |
| 2004-02-11 | 4.482 |
| 2004-02-12 | 4.469 |
| 2004-02-13 | 4.437 |
| 2004-02-16 | 4.44 |
| 2004-02-17 | 4.446 |
| 2004-02-18 | 4.44 |
| 2004-02-19 | 4.449 |
| 2004-02-20 | 4.453 |
| 2004-02-23 | 4.461 |
| 2004-02-24 | 4.46 |
| 2004-02-25 | 4.457 |
| 2004-02-26 | 4.481 |
| 2004-02-27 | 4.485 |
| 2004-03-01 | 4.484 |
| 2004-03-02 | 4.486 |
| 2004-03-03 | 4.51 |
| 2004-03-04 | 4.504 |
| 2004-03-05 | 4.504 |
| 2004-03-09 | 4.499 |
| 2004-03-10 | 4.495 |
| 2004-03-11 | 4.505 |
| 2004-03-12 | 4.512 |
| 2004-03-15 | 4.501 |
| 2004-03-16 | 4.484 |
| 2004-03-17 | 4.489 |
| 2004-03-18 | 4.483 |
| 2004-03-19 | 4.483 |
| 2004-03-22 | 4.497 |
| 2004-03-23 | 4.501 |
| 2004-03-24 | 4.509 |
| 2004-03-25 | 4.523 |
| 2004-03-26 | 4.521 |
| 2004-03-29 | 4.535 |
| 2004-03-30 | 4.516 |
| 2004-03-31 | 4.528 |
| 2004-04-01 | 4.521 |
| 2004-04-02 | 4.515 |
| 2004-04-07 | 4.524 |
| 2004-04-08 | 4.52 |
| 2004-04-13 | 4.523 |
| 2004-04-14 | 4.525 |
| 2004-04-15 | 4.542 |
| 2004-04-16 | 4.541 |
| 2004-04-19 | 4.536 |
| 2004-04-20 | 4.555 |
| 2004-04-21 | 4.582 |
| 2004-04-22 | 4.573 |
| 2004-04-23 | 4.569 |
| 2004-04-26 | 4.583 |
| 2004-04-28 | 4.599 |
| 2004-04-29 | 4.593 |
| 2004-04-30 | 4.588 |
| 2004-05-03 | 4.588 |
| 2004-05-04 | 4.587 |
| 2004-05-05 | 4.567 |
| 2004-05-06 | 4.573 |
| 2004-05-07 | 4.587 |
| 2004-05-10 | 4.634 |
| 2004-05-11 | 4.629 |
| 2004-05-12 | 4.624 |
| 2004-05-13 | 4.629 |
| 2004-05-14 | 4.618 |
| 2004-05-17 | 4.598 |
| 2004-05-18 | 4.604 |
| 2004-05-19 | 4.59 |
| 2004-05-20 | 4.594 |
| 2004-05-21 | 4.588 |
| 2004-05-24 | 4.584 |
| 2004-05-25 | 4.57 |
| 2004-05-28 | 4.555 |
| 2004-06-01 | 4.552 |
| 2004-06-02 | 4.551 |
| 2004-06-03 | 4.542 |
| 2004-06-04 | 4.552 |
| 2004-06-07 | 4.532 |
| 2004-06-08 | 4.517 |
| 2004-06-09 | 4.524 |
| 2004-06-10 | 4.524 |
| 2004-06-11 | 4.527 |
| 2004-06-14 | 4.532 |
| 2004-06-15 | 4.528 |
| 2004-06-16 | 4.507 |
| 2004-06-17 | 4.499 |
| 2004-06-18 | 4.499 |
| 2004-06-21 | 4.49 |
| 2004-06-22 | 4.491 |
| 2004-06-23 | 4.501 |
| 2004-06-24 | 4.509 |
| 2004-06-25 | 4.501 |
| 2004-06-28 | 4.498 |
| 2004-06-29 | 4.493 |
| 2004-06-30 | 4.497 |
| 2004-07-01 | 4.481 |
| 2004-07-02 | 4.474 |
| 2004-07-05 | 4.471 |
| 2004-07-06 | 4.481 |
| 2004-07-07 | 4.484 |
| 2004-07-08 | 4.486 |
| 2004-07-09 | 4.48 |
| 2004-07-12 | 4.478 |
| 2004-07-13 | 4.485 |
| 2004-07-14 | 4.492 |
| 2004-07-15 | 4.495 |
| 2004-07-16 | 4.495 |
| 2004-07-19 | 4.486 |
| 2004-07-20 | 4.486 |
| 2004-07-21 | 4.488 |
| 2004-07-22 | 4.492 |
| 2004-07-23 | 4.495 |
| 2004-07-26 | 4.499 |
| 2004-07-28 | 4.525 |
| 2004-07-29 | 4.527 |
| 2004-07-30 | 4.516 |
| 2004-08-02 | 4.518 |
| 2004-08-03 | 4.526 |
| 2004-08-04 | 4.527 |
| 2004-08-05 | 4.549 |
| 2004-08-06 | 4.555 |
| 2004-08-09 | 4.531 |
| 2004-08-10 | 4.523 |
| 2004-08-11 | 4.535 |
| 2004-08-12 | 4.534 |
| 2004-08-13 | 4.545 |
| 2004-08-16 | 4.537 |
| 2004-08-17 | 4.537 |
| 2004-08-18 | 4.532 |
| 2004-08-19 | 4.538 |
| 2004-08-20 | 4.531 |
| 2004-08-23 | 4.527 |
| 2004-08-24 | 4.525 |
| 2004-08-25 | 4.536 |
| 2004-08-26 | 4.54 |
| 2004-08-27 | 4.546 |
| 2004-08-30 | 4.532 |
| 2004-08-31 | 4.526 |
| 2004-09-01 | 4.511 |
| 2004-09-02 | 4.509 |
| 2004-09-03 | 4.513 |
| 2004-09-06 | 4.517 |
| 2004-09-07 | 4.508 |
| 2004-09-08 | 4.504 |
| 2004-09-09 | 4.511 |
| 2004-09-10 | 4.505 |
| 2004-09-13 | 4.495 |
| 2004-09-14 | 4.479 |
| 2004-09-20 | 4.478 |
| 2004-09-23 | 4.484 |
| 2004-09-27 | 4.486 |
| 2004-09-28 | 4.48 |
| 2004-09-29 | 4.482 |
| 2004-10-01 | 4.476 |
| 2004-10-04 | 4.468 |
| 2004-10-05 | 4.466 |
| 2004-10-06 | 4.465 |
| 2004-10-08 | 4.468 |
| 2004-10-11 | 4.452 |
| 2004-10-12 | 4.46 |
| 2004-10-13 | 4.463 |
| 2004-10-14 | 4.466 |
| 2004-10-15 | 4.464 |
| 2004-10-18 | 4.475 |
| 2004-10-19 | 4.467 |
| 2004-10-20 | 4.453 |
| 2004-10-21 | 4.442 |
| 2004-10-22 | 4.443 |
| 2004-10-25 | 4.43 |
| 2004-10-26 | 4.432 |
| 2004-10-27 | 4.453 |
| 2004-10-28 | 4.481 |
| 2004-10-29 | 4.468 |
| 2004-11-01 | 4.441 |
| 2004-11-02 | 4.453 |
| 2004-11-03 | 4.45 |
| 2004-11-04 | 4.437 |
| 2004-11-05 | 4.434 |
| 2004-11-08 | 4.426 |
| 2004-11-09 | 4.428 |
| 2004-11-10 | 4.411 |
| 2004-11-11 | 4.433 |
| 2004-11-12 | 4.429 |
| 2004-11-15 | 4.413 |
| 2004-11-16 | 4.384 |
| 2004-11-17 | 4.388 |
| 2004-11-18 | 4.388 |
| 2004-11-19 | 4.393 |
| 2004-11-22 | 4.379 |
| 2004-11-23 | 4.383 |
| 2004-11-24 | 4.372 |
| 2004-11-25 | 4.365 |
| 2004-11-26 | 4.371 |
| 2004-11-29 | 4.374 |
| 2004-11-30 | 4.363 |
| 2004-12-01 | 4.367 |
| 2004-12-02 | 4.363 |
| 2004-12-03 | 4.367 |
| 2004-12-06 | 4.351 |
| 2004-12-07 | 4.323 |
| 2004-12-08 | 4.339 |
| 2004-12-09 | 4.344 |
| 2004-12-10 | 4.36 |
| 2004-12-13 | 4.36 |
| 2004-12-14 | 4.324 |
| 2004-12-15 | 4.33 |
| 2004-12-16 | 4.321 |
| 2004-12-17 | 4.34 |
| 2004-12-20 | 4.332 |
| 2004-12-21 | 4.333 |
| 2004-12-22 | 4.341 |
| 2004-12-23 | 4.336 |
| 2004-12-24 | 4.331 |
| 2004-12-27 | 4.339 |
| 2004-12-28 | 4.34 |
| 2004-12-29 | 4.374 |
| 2004-12-30 | 4.339 |
| 2004-12-31 | 4.308 |
| 2005-01-03 | 4.356 |
| 2005-01-04 | 4.376 |
| 2005-01-05 | 4.4 |
| 2005-01-06 | 4.398 |
| 2005-01-07 | 4.385 |
| 2005-01-10 | 4.371 |
| 2005-01-11 | 4.36 |
| 2005-01-12 | 4.365 |
| 2005-01-13 | 4.352 |
| 2005-01-14 | 4.367 |
| 2005-01-17 | 4.362 |
| 2005-01-18 | 4.361 |
| 2005-01-19 | 4.364 |
| 2005-01-20 | 4.373 |
| 2005-01-21 | 4.369 |
| 2005-01-24 | 4.377 |
| 2005-01-25 | 4.405 |
| 2005-01-26 | 4.414 |
| 2005-01-27 | 4.412 |
| 2005-01-28 | 4.402 |
| 2005-01-31 | 4.383 |
| 2005-02-01 | 4.383 |
| 2005-02-02 | 4.392 |
| 2005-02-03 | 4.376 |
| 2005-02-04 | 4.365 |
| 2005-02-07 | 4.371 |
| 2005-02-08 | 4.387 |
| 2005-02-09 | 4.385 |
| 2005-02-10 | 4.38 |
| 2005-02-11 | 4.379 |
| 2005-02-14 | 4.37 |
| 2005-02-15 | 4.366 |
| 2005-02-16 | 4.362 |
| 2005-02-17 | 4.362 |
| 2005-02-18 | 4.357 |
| 2005-02-21 | 4.367 |
| 2005-02-22 | 4.36 |
| 2005-02-23 | 4.364 |
| 2005-02-24 | 4.357 |
| 2005-02-25 | 4.365 |
| 2005-02-28 | 4.357 |
| 2005-03-01 | 4.337 |
| 2005-03-02 | 4.334 |
| 2005-03-03 | 4.335 |
| 2005-03-04 | 4.342 |
| 2005-03-07 | 4.331 |
| 2005-03-08 | 4.304 |
| 2005-03-09 | 4.299 |
| 2005-03-10 | 4.313 |
| 2005-03-11 | 4.302 |
| 2005-03-14 | 4.308 |
| 2005-03-15 | 4.313 |
| 2005-03-16 | 4.314 |
| 2005-03-17 | 4.314 |
| 2005-03-18 | 4.311 |
| 2005-03-21 | 4.318 |
| 2005-03-22 | 4.314 |
| 2005-03-23 | 4.334 |
| 2005-03-24 | 4.346 |
| 2005-03-28 | 4.356 |
| 2005-03-29 | 4.373 |
| 2005-03-30 | 4.379 |
| 2005-03-31 | 4.361 |
| 2005-04-01 | 4.361 |
| 2005-04-04 | 4.372 |
| 2005-04-05 | 4.373 |
| 2005-04-06 | 4.362 |
| 2005-04-07 | 4.366 |
| 2005-04-08 | 4.371 |
| 2005-04-11 | 4.364 |
| 2005-04-12 | 4.372 |
| 2005-04-13 | 4.385 |
| 2005-04-14 | 4.388 |
| 2005-04-15 | 4.395 |
| 2005-04-18 | 4.381 |
| 2005-04-19 | 4.374 |
| 2005-04-20 | 4.371 |
| 2005-04-21 | 4.368 |
| 2005-04-25 | 4.362 |
| 2005-04-26 | 4.36 |
| 2005-04-27 | 4.368 |
| 2005-04-28 | 4.367 |
| 2005-04-29 | 4.369 |
| 2005-05-02 | 4.372 |
| 2005-05-03 | 4.373 |
| 2005-05-04 | 4.363 |
| 2005-05-05 | 4.359 |
| 2005-05-06 | 4.359 |
| 2005-05-09 | 4.361 |
| 2005-05-10 | 4.348 |
| 2005-05-11 | 4.361 |
| 2005-05-13 | 4.378 |
| 2005-05-16 | 4.381 |
| 2005-05-17 | 4.373 |
| 2005-05-18 | 4.372 |
| 2005-05-19 | 4.361 |
| 2005-05-20 | 4.363 |
| 2005-05-23 | 4.379 |
| 2005-05-24 | 4.375 |
| 2005-05-25 | 4.387 |
| 2005-05-26 | 4.391 |
| 2005-05-27 | 4.401 |
| 2005-05-31 | 4.416 |
| 2005-06-01 | 4.421 |
| 2005-06-02 | 4.413 |
| 2005-06-03 | 4.412 |
| 2005-06-06 | 4.412 |
| 2005-06-07 | 4.406 |
| 2005-06-08 | 4.405 |
| 2005-06-09 | 4.431 |
| 2005-06-10 | 4.432 |
| 2005-06-14 | 4.461 |
| 2005-06-15 | 4.482 |
| 2005-06-16 | 4.495 |
| 2005-06-17 | 4.5 |
| 2005-06-20 | 4.54 |
| 2005-06-21 | 4.539 |
| 2005-06-22 | 4.517 |
| 2005-06-23 | 4.527 |
| 2005-06-24 | 4.538 |
| 2005-06-27 | 4.541 |
| 2005-06-28 | 4.567 |
| 2005-06-29 | 4.57 |
| 2005-06-30 | 4.574 |
| 2005-07-01 | 4.582 |
| 2005-07-04 | 4.593 |
| 2005-07-05 | 4.593 |
| 2005-07-06 | 4.604 |
| 2005-07-07 | 4.61 |
| 2005-07-08 | 4.61 |
| 2005-07-11 | 4.574 |
| 2005-07-12 | 4.528 |
| 2005-07-13 | 4.532 |
| 2005-07-14 | 4.536 |
| 2005-07-15 | 4.541 |
| 2005-07-18 | 4.564 |
| 2005-07-19 | 4.583 |
| 2005-07-20 | 4.57 |
| 2005-07-21 | 4.525 |
| 2005-07-22 | 4.533 |
| 2005-07-25 | 4.542 |
| 2005-07-26 | 4.544 |
| 2005-07-27 | 4.548 |
| 2005-07-28 | 4.532 |
| 2005-07-29 | 4.526 |
| 2005-08-01 | 4.517 |
| 2005-08-02 | 4.502 |
| 2005-08-03 | 4.484 |
| 2005-08-04 | 4.483 |
| 2005-08-05 | 4.475 |
| 2005-08-08 | 4.517 |
| 2005-08-09 | 4.517 |
| 2005-08-10 | 4.515 |
| 2005-08-11 | 4.516 |
| 2005-08-12 | 4.526 |
| 2005-08-15 | 4.532 |
| 2005-08-16 | 4.524 |
| 2005-08-17 | 4.482 |
| 2005-08-18 | 4.477 |
| 2005-08-19 | 4.489 |
| 2005-08-22 | 4.502 |
| 2005-08-23 | 4.493 |
| 2005-08-24 | 4.491 |
| 2005-08-25 | 4.505 |
| 2005-08-26 | 4.523 |
| 2005-08-29 | 4.539 |
| 2005-08-30 | 4.559 |
| 2005-08-31 | 4.545 |
| 2005-09-01 | 4.498 |
| 2005-09-02 | 4.488 |
| 2005-09-05 | 4.478 |
| 2005-09-06 | 4.491 |
| 2005-09-07 | 4.495 |
| 2005-09-08 | 4.506 |
| 2005-09-09 | 4.507 |
| 2005-09-12 | 4.512 |
| 2005-09-13 | 4.523 |
| 2005-09-14 | 4.527 |
| 2005-09-15 | 4.526 |
| 2005-09-16 | 4.531 |
| 2005-09-19 | 4.548 |
| 2005-09-20 | 4.55 |
| 2005-09-21 | 4.574 |
| 2005-09-22 | 4.583 |
| 2005-09-23 | 4.587 |
| 2005-09-26 | 4.595 |
| 2005-09-27 | 4.566 |
| 2005-09-28 | 4.579 |
| 2005-09-29 | 4.582 |
| 2005-09-30 | 4.598 |
| 2005-10-06 | 4.596 |
| 2005-10-07 | 4.59 |
| 2005-10-10 | 4.599 |
| 2005-10-11 | 4.62 |
| 2005-10-14 | 4.653 |
| 2005-10-17 | 4.631 |
| 2005-10-19 | 4.65 |
| 2005-10-20 | 4.633 |
| 2005-10-21 | 4.625 |
| 2005-10-24 | 4.636 |
| 2005-10-26 | 4.626 |
| 2005-10-27 | 4.621 |
| 2005-10-28 | 4.641 |
| 2005-10-31 | 4.636 |
| 2005-11-01 | 4.64 |
| 2005-11-02 | 4.651 |
| 2005-11-03 | 4.67 |
| 2005-11-04 | 4.666 |
| 2005-11-07 | 4.688 |
| 2005-11-08 | 4.691 |
| 2005-11-09 | 4.686 |
| 2005-11-10 | 4.704 |
| 2005-11-11 | 4.718 |
| 2005-11-14 | 4.736 |
| 2005-11-15 | 4.74 |
| 2005-11-16 | 4.735 |
| 2005-11-17 | 4.726 |
| 2005-11-18 | 4.731 |
| 2005-11-21 | 4.728 |
| 2005-11-22 | 4.741 |
| 2005-11-23 | 4.727 |
| 2005-11-24 | 4.704 |
| 2005-11-25 | 4.7 |
| 2005-11-28 | 4.694 |
| 2005-11-29 | 4.656 |
| 2005-11-30 | 4.663 |
| 2005-12-01 | 4.662 |
| 2005-12-02 | 4.654 |
| 2005-12-05 | 4.653 |
| 2005-12-06 | 4.629 |
| 2005-12-07 | 4.636 |
| 2005-12-08 | 4.635 |
| 2005-12-09 | 4.631 |
| 2005-12-12 | 4.608 |
| 2005-12-13 | 4.606 |
| 2005-12-14 | 4.588 |
| 2005-12-15 | 4.582 |
| 2005-12-16 | 4.579 |
| 2005-12-19 | 4.588 |
| 2005-12-20 | 4.598 |
| 2005-12-21 | 4.599 |
| 2005-12-22 | 4.621 |
| 2005-12-23 | 4.582 |
| 2005-12-27 | 4.609 |
| 2005-12-28 | 4.591 |
| 2005-12-29 | 4.592 |
| 2005-12-30 | 4.603 |
| 2006-01-03 | 4.595 |
| 2006-01-04 | 4.577 |
| 2006-01-05 | 4.628 |
| 2006-01-06 | 4.62 |
| 2006-01-09 | 4.615 |
| 2006-01-10 | 4.632 |
| 2006-01-11 | 4.637 |
| 2006-01-12 | 4.622 |
| 2006-01-13 | 4.619 |
| 2006-01-16 | 4.602 |
| 2006-01-17 | 4.613 |
| 2006-01-18 | 4.625 |
| 2006-01-19 | 4.621 |
| 2006-01-20 | 4.622 |
| 2006-01-23 | 4.612 |
| 2006-01-24 | 4.612 |
| 2006-01-25 | 4.6 |
| 2006-01-26 | 4.613 |
| 2006-01-27 | 4.632 |
| 2006-01-30 | 4.64 |
| 2006-01-31 | 4.658 |
| 2006-02-01 | 4.664 |
| 2006-02-02 | 4.692 |
| 2006-02-03 | 4.69 |
| 2006-02-06 | 4.699 |
| 2006-02-07 | 4.719 |
| 2006-02-08 | 4.708 |
| 2006-02-09 | 4.694 |
| 2006-02-10 | 4.694 |
| 2006-02-13 | 4.704 |
| 2006-02-14 | 4.718 |
| 2006-02-15 | 4.723 |
| 2006-02-16 | 4.705 |
| 2006-02-17 | 4.693 |
| 2006-02-20 | 4.687 |
| 2006-02-21 | 4.71 |
| 2006-02-22 | 4.725 |
| 2006-02-23 | 4.707 |
| 2006-02-24 | 4.713 |
| 2006-02-27 | 4.712 |
| 2006-02-28 | 4.706 |
| 2006-03-01 | 4.703 |
| 2006-03-02 | 4.702 |
| 2006-03-03 | 4.695 |
| 2006-03-06 | 4.696 |
| 2006-03-07 | 4.709 |
| 2006-03-08 | 4.712 |
| 2006-03-09 | 4.711 |
| 2006-03-10 | 4.712 |
| 2006-03-13 | 4.717 |
| 2006-03-16 | 4.694 |
| 2006-03-17 | 4.666 |
| 2006-03-20 | 4.658 |
| 2006-03-21 | 4.659 |
| 2006-03-22 | 4.67 |
| 2006-03-23 | 4.671 |
| 2006-03-24 | 4.681 |
| 2006-03-27 | 4.685 |
| 2006-03-29 | 4.703 |
| 2006-03-30 | 4.673 |
| 2006-03-31 | 4.665 |
| 2006-04-03 | 4.671 |
| 2006-04-04 | 4.64 |
| 2006-04-05 | 4.612 |
| 2006-04-06 | 4.597 |
| 2006-04-07 | 4.604 |
| 2006-04-10 | 4.612 |
| 2006-04-11 | 4.6 |
| 2006-04-18 | 4.587 |
| 2006-04-20 | 4.563 |
| 2006-04-21 | 4.561 |
| 2006-04-24 | 4.545 |
| 2006-04-25 | 4.527 |
| 2006-04-26 | 4.542 |
| 2006-04-27 | 4.532 |
| 2006-04-28 | 4.503 |
| 2006-05-01 | 4.484 |
| 2006-05-02 | 4.491 |
| 2006-05-04 | 4.496 |
| 2006-05-05 | 4.471 |
| 2006-05-08 | 4.433 |
| 2006-05-09 | 4.448 |
| 2006-05-10 | 4.428 |
| 2006-05-11 | 4.445 |
| 2006-05-12 | 4.43 |
| 2006-05-15 | 4.459 |
| 2006-05-16 | 4.452 |
| 2006-05-17 | 4.433 |
| 2006-05-18 | 4.464 |
| 2006-05-19 | 4.459 |
| 2006-05-22 | 4.486 |
| 2006-05-23 | 4.492 |
| 2006-05-24 | 4.513 |
| 2006-05-25 | 4.522 |
| 2006-05-26 | 4.513 |
| 2006-05-30 | 4.517 |
| 2006-05-31 | 4.518 |
| 2006-06-01 | 4.524 |
| 2006-06-05 | 4.478 |
| 2006-06-06 | 4.469 |
| 2006-06-07 | 4.477 |
| 2006-06-08 | 4.468 |
| 2006-06-09 | 4.48 |
| 2006-06-12 | 4.478 |
| 2006-06-13 | 4.5 |
| 2006-06-14 | 4.494 |
| 2006-06-15 | 4.46 |
| 2006-06-16 | 4.436 |
| 2006-06-19 | 4.445 |
| 2006-06-20 | 4.458 |
| 2006-06-21 | 4.465 |
| 2006-06-22 | 4.461 |
| 2006-06-23 | 4.466 |
| 2006-06-26 | 4.476 |
| 2006-06-27 | 4.49 |
| 2006-06-28 | 4.477 |
| 2006-06-29 | 4.477 |
| 2006-06-30 | 4.44 |
| 2006-07-03 | 4.419 |
| 2006-07-04 | 4.391 |
| 2006-07-05 | 4.378 |
| 2006-07-06 | 4.401 |
| 2006-07-07 | 4.384 |
| 2006-07-10 | 4.391 |
| 2006-07-11 | 4.387 |
| 2006-07-12 | 4.434 |
| 2006-07-13 | 4.496 |
| 2006-07-14 | 4.521 |
| 2006-07-17 | 4.492 |
| 2006-07-18 | 4.455 |
| 2006-07-19 | 4.462 |
| 2006-07-20 | 4.446 |
| 2006-07-21 | 4.461 |
| 2006-07-24 | 4.462 |
| 2006-07-25 | 4.428 |
| 2006-07-26 | 4.437 |
| 2006-07-27 | 4.423 |
| 2006-07-28 | 4.428 |
| 2006-07-31 | 4.393 |
| 2006-08-01 | 4.4 |
| 2006-08-02 | 4.408 |
| 2006-08-04 | 4.405 |
| 2006-08-07 | 4.396 |
| 2006-08-08 | 4.364 |
| 2006-08-09 | 4.363 |
| 2006-08-10 | 4.389 |
| 2006-08-11 | 4.388 |
| 2006-08-14 | 4.377 |
| 2006-08-15 | 4.371 |
| 2006-08-16 | 4.368 |
| 2006-08-17 | 4.359 |
| 2006-08-18 | 4.366 |
| 2006-08-21 | 4.361 |
| 2006-08-22 | 4.357 |
| 2006-08-23 | 4.366 |
| 2006-08-24 | 4.375 |
| 2006-08-25 | 4.392 |
| 2006-08-28 | 4.4 |
| 2006-08-29 | 4.396 |
| 2006-08-30 | 4.38 |
| 2006-08-31 | 4.364 |
| 2006-09-01 | 4.373 |
| 2006-09-04 | 4.369 |
| 2006-09-05 | 4.36 |
| 2006-09-06 | 4.368 |
| 2006-09-07 | 4.387 |
| 2006-09-08 | 4.386 |
| 2006-09-11 | 4.394 |
| 2006-09-12 | 4.388 |
| 2006-09-13 | 4.375 |
| 2006-09-14 | 4.377 |
| 2006-09-15 | 4.368 |
| 2006-09-18 | 4.354 |
| 2006-09-19 | 4.348 |
| 2006-09-20 | 4.339 |
| 2006-09-21 | 4.328 |
| 2006-09-25 | 4.323 |
| 2006-09-26 | 4.316 |
| 2006-09-27 | 4.303 |
| 2006-09-28 | 4.297 |
| 2006-09-29 | 4.302 |
| 2006-10-03 | 4.294 |
| 2006-10-04 | 4.283 |
| 2006-10-05 | 4.255 |
| 2006-10-06 | 4.238 |
| 2006-10-09 | 4.258 |
| 2006-10-10 | 4.256 |
| 2006-10-11 | 4.269 |
| 2006-10-12 | 4.269 |
| 2006-10-13 | 4.248 |
| 2006-10-16 | 4.265 |
| 2006-10-17 | 4.265 |
| 2006-10-18 | 4.273 |
| 2006-10-19 | 4.273 |
| 2006-10-20 | 4.278 |
| 2006-10-23 | 4.282 |
| 2006-10-24 | 4.283 |
| 2006-10-25 | 4.287 |
| 2006-10-26 | 4.285 |
| 2006-10-27 | 4.294 |
| 2006-10-30 | 4.288 |
| 2006-10-31 | 4.288 |
| 2006-11-01 | 4.261 |
| 2006-11-02 | 4.283 |
| 2006-11-03 | 4.29 |
| 2006-11-06 | 4.31 |
| 2006-11-07 | 4.331 |
| 2006-11-08 | 4.33 |
| 2006-11-09 | 4.324 |
| 2006-11-10 | 4.289 |
| 2006-11-13 | 4.289 |
| 2006-11-14 | 4.288 |
| 2006-11-15 | 4.292 |
| 2006-11-16 | 4.319 |
| 2006-11-17 | 4.308 |
| 2006-11-20 | 4.312 |
| 2006-11-21 | 4.325 |
| 2006-11-22 | 4.321 |
| 2006-11-23 | 4.313 |
| 2006-11-24 | 4.296 |
| 2006-11-27 | 4.3 |
| 2006-11-28 | 4.291 |
| 2006-11-30 | 4.247 |
| 2006-12-01 | 4.234 |
| 2006-12-04 | 4.23 |
| 2006-12-05 | 4.225 |
| 2006-12-06 | 4.2 |
| 2006-12-07 | 4.198 |
| 2006-12-08 | 4.195 |
| 2006-12-11 | 4.202 |
| 2006-12-12 | 4.202 |
| 2006-12-13 | 4.182 |
| 2006-12-14 | 4.176 |
| 2006-12-15 | 4.178 |
| 2006-12-18 | 4.193 |
| 2006-12-19 | 4.193 |
| 2006-12-20 | 4.178 |
| 2006-12-21 | 4.181 |
| 2006-12-22 | 4.186 |
| 2006-12-26 | 4.222 |
| 2006-12-27 | 4.225 |
| 2006-12-28 | 4.207 |
| 2006-12-29 | 4.225 |
| 2007-01-02 | 4.205 |
| 2007-01-03 | 4.187 |
| 2007-01-04 | 4.204 |
| 2007-01-05 | 4.235 |
| 2007-01-08 | 4.238 |
| 2007-01-09 | 4.234 |
| 2007-01-10 | 4.249 |
| 2007-01-11 | 4.238 |
| 2007-01-12 | 4.225 |
| 2007-01-15 | 4.222 |
| 2007-01-16 | 4.219 |
| 2007-01-17 | 4.228 |
| 2007-01-18 | 4.222 |
| 2007-01-19 | 4.219 |
| 2007-01-22 | 4.22 |
| 2007-01-23 | 4.221 |
| 2007-01-24 | 4.226 |
| 2007-01-25 | 4.225 |
| 2007-01-26 | 4.243 |
| 2007-01-29 | 4.251 |
| 2007-01-30 | 4.251 |
| 2007-01-31 | 4.26 |
| 2007-02-01 | 4.242 |
| 2007-02-02 | 4.247 |
| 2007-02-05 | 4.254 |
| 2007-02-06 | 4.248 |
| 2007-02-07 | 4.237 |
| 2007-02-08 | 4.233 |
| 2007-02-09 | 4.226 |
| 2007-02-12 | 4.238 |
| 2007-02-13 | 4.241 |
| 2007-02-14 | 4.229 |
| 2007-02-15 | 4.22 |
| 2007-02-16 | 4.203 |
| 2007-02-19 | 4.183 |
| 2007-02-20 | 4.184 |
| 2007-02-21 | 4.188 |
| 2007-02-22 | 4.183 |
| 2007-02-23 | 4.19 |
| 2007-02-26 | 4.199 |
| 2007-02-27 | 4.204 |
| 2007-02-28 | 4.211 |
| 2007-03-01 | 4.218 |
| 2007-03-02 | 4.209 |
| 2007-03-06 | 4.222 |
| 2007-03-07 | 4.222 |
| 2007-03-08 | 4.211 |
| 2007-03-09 | 4.196 |
| 2007-03-12 | 4.2 |
| 2007-03-13 | 4.206 |
| 2007-03-14 | 4.212 |
| 2007-03-15 | 4.212 |
| 2007-03-16 | 4.209 |
| 2007-03-19 | 4.208 |
| 2007-03-20 | 4.211 |
| 2007-03-21 | 4.197 |
| 2007-03-22 | 4.19 |
| 2007-03-23 | 4.191 |
| 2007-03-26 | 4.203 |
| 2007-03-27 | 4.181 |
| 2007-03-28 | 4.179 |
| 2007-03-29 | 4.17 |
| 2007-03-30 | 4.155 |
| 2007-04-04 | 4.135 |
| 2007-04-05 | 4.129 |
| 2007-04-10 | 4.124 |
| 2007-04-11 | 4.107 |
| 2007-04-12 | 4.066 |
| 2007-04-13 | 4.069 |
| 2007-04-16 | 4.046 |
| 2007-04-17 | 4.064 |
| 2007-04-18 | 4.069 |
| 2007-04-19 | 4.076 |
| 2007-04-20 | 4.07 |
| 2007-04-23 | 4.067 |
| 2007-04-25 | 4.029 |
| 2007-04-26 | 4.014 |
| 2007-04-27 | 4.018 |
| 2007-04-30 | 4.024 |
| 2007-05-01 | 4.035 |
| 2007-05-02 | 4.065 |
| 2007-05-03 | 4.044 |
| 2007-05-04 | 4.042 |
| 2007-05-07 | 3.998 |
| 2007-05-08 | 3.99 |
| 2007-05-09 | 3.974 |
| 2007-05-10 | 3.954 |
| 2007-05-11 | 3.977 |
| 2007-05-14 | 3.96 |
| 2007-05-15 | 3.973 |
| 2007-05-16 | 3.932 |
| 2007-05-17 | 3.952 |
| 2007-05-18 | 3.996 |
| 2007-05-21 | 3.998 |
| 2007-05-22 | 3.991 |
| 2007-05-24 | 3.999 |
| 2007-05-25 | 4.032 |
| 2007-05-29 | 4.023 |
| 2007-05-30 | 4.052 |
| 2007-05-31 | 4.033 |
| 2007-06-01 | 4.071 |
| 2007-06-04 | 4.062 |
| 2007-06-05 | 4.063 |
| 2007-06-06 | 4.098 |
| 2007-06-07 | 4.14 |
| 2007-06-08 | 4.197 |
| 2007-06-11 | 4.187 |
| 2007-06-12 | 4.187 |
| 2007-06-13 | 4.214 |
| 2007-06-14 | 4.183 |
| 2007-06-15 | 4.175 |
| 2007-06-18 | 4.142 |
| 2007-06-19 | 4.168 |
| 2007-06-20 | 4.187 |
| 2007-06-21 | 4.23 |
| 2007-06-22 | 4.222 |
| 2007-06-25 | 4.251 |
| 2007-06-26 | 4.262 |
| 2007-06-27 | 4.291 |
| 2007-06-28 | 4.257 |
| 2007-06-29 | 4.249 |
| 2007-07-02 | 4.237 |
| 2007-07-03 | 4.192 |
| 2007-07-04 | 4.183 |
| 2007-07-05 | 4.213 |
| 2007-07-06 | 4.236 |
| 2007-07-09 | 4.226 |
| 2007-07-10 | 4.231 |
| 2007-07-11 | 4.256 |
| 2007-07-12 | 4.264 |
| 2007-07-13 | 4.272 |
| 2007-07-16 | 4.283 |
| 2007-07-17 | 4.288 |
| 2007-07-18 | 4.285 |
| 2007-07-19 | 4.243 |
| 2007-07-20 | 4.227 |
| 2007-07-23 | 4.241 |
| 2007-07-25 | 4.221 |
| 2007-07-26 | 4.275 |
| 2007-07-27 | 4.321 |
| 2007-07-30 | 4.342 |
| 2007-07-31 | 4.305 |
| 2007-08-01 | 4.337 |
| 2007-08-02 | 4.337 |
| 2007-08-03 | 4.312 |
| 2007-08-06 | 4.296 |
| 2007-08-07 | 4.296 |
| 2007-08-08 | 4.278 |
| 2007-08-09 | 4.272 |
| 2007-08-10 | 4.292 |
| 2007-08-13 | 4.238 |
| 2007-08-14 | 4.222 |
| 2007-08-15 | 4.241 |
| 2007-08-16 | 4.251 |
| 2007-08-17 | 4.238 |
| 2007-08-20 | 4.202 |
| 2007-08-21 | 4.202 |
| 2007-08-22 | 4.17 |
| 2007-08-23 | 4.157 |
| 2007-08-24 | 4.176 |
| 2007-08-27 | 4.155 |
| 2007-08-28 | 4.125 |
| 2007-08-29 | 4.128 |
| 2007-08-30 | 4.113 |
| 2007-08-31 | 4.124 |
| 2007-09-03 | 4.131 |
| 2007-09-04 | 4.137 |
| 2007-09-05 | 4.117 |
| 2007-09-06 | 4.134 |
| 2007-09-07 | 4.129 |
| 2007-09-10 | 4.132 |
| 2007-09-11 | 4.102 |
| 2007-09-17 | 4.093 |
| 2007-09-18 | 4.103 |
| 2007-09-19 | 4.058 |
| 2007-09-20 | 4.06 |
| 2007-09-24 | 4.035 |
| 2007-09-25 | 4.034 |
| 2007-09-26 | 4.03 |
| 2007-09-28 | 4.013 |
| 2007-10-01 | 3.98 |
| 2007-10-02 | 4.002 |
| 2007-10-03 | 4.01 |
| 2007-10-05 | 4.013 |
| 2007-10-08 | 3.999 |
| 2007-10-09 | 4.045 |
| 2007-10-10 | 4.022 |
| 2007-10-11 | 4.041 |
| 2007-10-12 | 4.027 |
| 2007-10-15 | 4.036 |
| 2007-10-16 | 4.047 |
| 2007-10-17 | 4.029 |
| 2007-10-18 | 4.013 |
| 2007-10-19 | 4.018 |
| 2007-10-22 | 4.034 |
| 2007-10-23 | 4.025 |
| 2007-10-24 | 4.03 |
| 2007-10-25 | 4.006 |
| 2007-10-26 | 3.992 |
| 2007-10-29 | 3.992 |
| 2007-10-30 | 3.978 |
| 2007-10-31 | 3.966 |
| 2007-11-01 | 3.964 |
| 2007-11-02 | 3.969 |
| 2007-11-05 | 3.958 |
| 2007-11-06 | 3.941 |
| 2007-11-07 | 3.923 |
| 2007-11-08 | 3.927 |
| 2007-11-09 | 3.927 |
| 2007-11-12 | 3.962 |
| 2007-11-13 | 3.956 |
| 2007-11-14 | 3.931 |
| 2007-11-15 | 3.934 |
| 2007-11-16 | 3.935 |
| 2007-11-19 | 3.932 |
| 2007-11-20 | 3.898 |
| 2007-11-21 | 3.903 |
| 2007-11-22 | 3.891 |
| 2007-11-23 | 3.862 |
| 2007-11-26 | 3.866 |
| 2007-11-27 | 3.861 |
| 2007-11-28 | 3.875 |
| 2007-11-29 | 3.849 |
| 2007-11-30 | 3.83 |
| 2007-12-03 | 3.841 |
| 2007-12-04 | 3.841 |
| 2007-12-05 | 3.845 |
| 2007-12-06 | 3.881 |
| 2007-12-07 | 3.875 |
| 2007-12-10 | 3.893 |
| 2007-12-11 | 3.921 |
| 2007-12-12 | 3.938 |
| 2007-12-13 | 3.927 |
| 2007-12-14 | 3.971 |
| 2007-12-17 | 4.008 |
| 2007-12-18 | 3.974 |
| 2007-12-19 | 3.942 |
| 2007-12-20 | 3.943 |
| 2007-12-21 | 3.914 |
| 2007-12-24 | 3.876 |
| 2007-12-26 | 3.92 |
| 2007-12-27 | 3.871 |
| 2007-12-28 | 3.857 |
| 2007-12-31 | 3.846 |
| 2008-01-02 | 3.861 |
| 2008-01-03 | 3.838 |
| 2008-01-04 | 3.807 |
| 2008-01-07 | 3.828 |
| 2008-01-08 | 3.799 |
| 2008-01-09 | 3.791 |
| 2008-01-10 | 3.805 |
| 2008-01-11 | 3.775 |
| 2008-01-14 | 3.725 |
| 2008-01-15 | 3.711 |
| 2008-01-16 | 3.737 |
| 2008-01-17 | 3.744 |
| 2008-01-18 | 3.78 |
| 2008-01-21 | 3.801 |
| 2008-01-22 | 3.795 |
| 2008-01-23 | 3.712 |
| 2008-01-24 | 3.682 |
| 2008-01-25 | 3.71 |
| 2008-01-28 | 3.709 |
| 2008-01-29 | 3.639 |
| 2008-01-30 | 3.646 |
| 2008-01-31 | 3.625 |
| 2008-02-01 | 3.594 |
| 2008-02-04 | 3.578 |
| 2008-02-05 | 3.607 |
| 2008-02-06 | 3.626 |
| 2008-02-07 | 3.655 |
| 2008-02-08 | 3.611 |
| 2008-02-11 | 3.618 |
| 2008-02-12 | 3.581 |
| 2008-02-13 | 3.608 |
| 2008-02-14 | 3.615 |
| 2008-02-15 | 3.591 |
| 2008-02-18 | 3.602 |
| 2008-02-19 | 3.591 |
| 2008-02-20 | 3.622 |
| 2008-02-21 | 3.614 |
| 2008-02-22 | 3.592 |
| 2008-02-25 | 3.58 |
| 2008-02-26 | 3.628 |
| 2008-02-27 | 3.608 |
| 2008-02-28 | 3.621 |
| 2008-02-29 | 3.635 |
| 2008-03-03 | 3.656 |
| 2008-03-04 | 3.626 |
| 2008-03-05 | 3.591 |
| 2008-03-06 | 3.599 |
| 2008-03-07 | 3.6 |
| 2008-03-10 | 3.577 |
| 2008-03-11 | 3.515 |
| 2008-03-12 | 3.482 |
| 2008-03-13 | 3.403 |
| 2008-03-14 | 3.474 |
| 2008-03-17 | 3.426 |
| 2008-03-18 | 3.38 |
| 2008-03-19 | 3.377 |
| 2008-03-20 | 3.399 |
| 2008-03-24 | 3.523 |
| 2008-03-25 | 3.513 |
| 2008-03-26 | 3.504 |
| 2008-03-27 | 3.5 |
| 2008-03-28 | 3.519 |
| 2008-03-31 | 3.553 |
| 2008-04-01 | 3.544 |
| 2008-04-02 | 3.554 |
| 2008-04-03 | 3.577 |
| 2008-04-04 | 3.614 |
| 2008-04-07 | 3.64 |
| 2008-04-08 | 3.613 |
| 2008-04-09 | 3.597 |
| 2008-04-10 | 3.613 |
| 2008-04-11 | 3.6 |
| 2008-04-14 | 3.565 |
| 2008-04-15 | 3.489 |
| 2008-04-16 | 3.477 |
| 2008-04-17 | 3.465 |
| 2008-04-18 | 3.425 |
| 2008-04-21 | 3.452 |
| 2008-04-22 | 3.468 |
| 2008-04-23 | 3.442 |
| 2008-04-24 | 3.453 |
| 2008-04-25 | 3.486 |
| 2008-04-28 | 3.463 |
| 2008-04-29 | 3.467 |
| 2008-04-30 | 3.429 |
| 2008-05-01 | 3.424 |
| 2008-05-02 | 3.45 |
| 2008-05-05 | 3.437 |
| 2008-05-06 | 3.416 |
| 2008-05-07 | 3.443 |
| 2008-05-09 | 3.461 |
| 2008-05-12 | 3.45 |
| 2008-05-13 | 3.434 |
| 2008-05-14 | 3.428 |
| 2008-05-15 | 3.424 |
| 2008-05-16 | 3.362 |
| 2008-05-19 | 3.368 |
| 2008-05-20 | 3.378 |
| 2008-05-21 | 3.362 |
| 2008-05-22 | 3.338 |
| 2008-05-23 | 3.333 |
| 2008-05-27 | 3.285 |
| 2008-05-28 | 3.288 |
| 2008-05-29 | 3.262 |
| 2008-05-30 | 3.233 |
| 2008-06-02 | 3.26 |
| 2008-06-03 | 3.268 |
| 2008-06-04 | 3.325 |
| 2008-06-05 | 3.376 |
| 2008-06-06 | 3.333 |
| 2008-06-10 | 3.375 |
| 2008-06-11 | 3.399 |
| 2008-06-12 | 3.426 |
| 2008-06-13 | 3.422 |
| 2008-06-16 | 3.418 |
| 2008-06-17 | 3.34 |
| 2008-06-18 | 3.345 |
| 2008-06-19 | 3.366 |
| 2008-06-20 | 3.354 |
| 2008-06-23 | 3.373 |
| 2008-06-24 | 3.373 |
| 2008-06-25 | 3.388 |
| 2008-06-26 | 3.375 |
| 2008-06-27 | 3.378 |
| 2008-06-30 | 3.352 |
| 2008-07-01 | 3.338 |
| 2008-07-02 | 3.284 |
| 2008-07-03 | 3.253 |
| 2008-07-04 | 3.273 |
| 2008-07-07 | 3.246 |
| 2008-07-08 | 3.266 |
| 2008-07-09 | 3.23 |
| 2008-07-10 | 3.314 |
| 2008-07-11 | 3.38 |
| 2008-07-14 | 3.329 |
| 2008-07-15 | 3.302 |
| 2008-07-16 | 3.344 |
| 2008-07-17 | 3.373 |
| 2008-07-18 | 3.384 |
| 2008-07-21 | 3.427 |
| 2008-07-22 | 3.465 |
| 2008-07-23 | 3.473 |
| 2008-07-24 | 3.489 |
| 2008-07-25 | 3.486 |
| 2008-07-28 | 3.477 |
| 2008-07-29 | 3.464 |
| 2008-07-30 | 3.469 |
| 2008-07-31 | 3.47 |
| 2008-08-01 | 3.515 |
| 2008-08-04 | 3.543 |
| 2008-08-05 | 3.556 |
| 2008-08-06 | 3.55 |
| 2008-08-07 | 3.538 |
| 2008-08-08 | 3.588 |
| 2008-08-11 | 3.566 |
| 2008-08-12 | 3.589 |
| 2008-08-13 | 3.594 |
| 2008-08-14 | 3.585 |
| 2008-08-15 | 3.59 |
| 2008-08-18 | 3.569 |
| 2008-08-19 | 3.576 |
| 2008-08-20 | 3.576 |
| 2008-08-21 | 3.536 |
| 2008-08-22 | 3.476 |
| 2008-08-25 | 3.514 |
| 2008-08-26 | 3.533 |
| 2008-08-27 | 3.566 |
| 2008-08-28 | 3.581 |
| 2008-08-29 | 3.592 |
| 2008-09-01 | 3.618 |
| 2008-09-02 | 3.635 |
| 2008-09-03 | 3.602 |
| 2008-09-04 | 3.582 |
| 2008-09-05 | 3.586 |
| 2008-09-08 | 3.582 |
| 2008-09-09 | 3.592 |
| 2008-09-10 | 3.598 |
| 2008-09-11 | 3.625 |
| 2008-09-12 | 3.621 |
| 2008-09-15 | 3.59 |
| 2008-09-16 | 3.554 |
| 2008-09-17 | 3.549 |
| 2008-09-18 | 3.521 |
| 2008-09-19 | 3.532 |
| 2008-09-22 | 3.486 |
| 2008-09-23 | 3.402 |
| 2008-09-24 | 3.421 |
| 2008-09-25 | 3.396 |
| 2008-09-26 | 3.421 |
| 2008-10-02 | 3.494 |
| 2008-10-03 | 3.465 |
| 2008-10-06 | 3.465 |
| 2008-10-07 | 3.503 |
| 2008-10-10 | 3.595 |
| 2008-10-13 | 3.607 |
| 2008-10-15 | 3.629 |
| 2008-10-16 | 3.705 |
| 2008-10-17 | 3.739 |
| 2008-10-20 | 3.749 |
| 2008-10-22 | 3.834 |
| 2008-10-23 | 3.841 |
| 2008-10-24 | 3.879 |
| 2008-10-27 | 3.824 |
| 2008-10-28 | 3.777 |
| 2008-10-29 | 3.767 |
| 2008-10-30 | 3.713 |
| 2008-10-31 | 3.783 |
| 2008-11-03 | 3.752 |
| 2008-11-04 | 3.778 |
| 2008-11-05 | 3.827 |
| 2008-11-06 | 3.837 |
| 2008-11-07 | 3.816 |
| 2008-11-10 | 3.776 |
| 2008-11-11 | 3.796 |
| 2008-11-12 | 3.876 |
| 2008-11-13 | 3.928 |
| 2008-11-14 | 3.883 |
| 2008-11-17 | 3.915 |
| 2008-11-18 | 3.964 |
| 2008-11-19 | 3.969 |
| 2008-11-20 | 3.998 |
| 2008-11-21 | 4.022 |
| 2008-11-24 | 3.993 |
| 2008-11-25 | 3.969 |
| 2008-11-26 | 3.89 |
| 2008-11-27 | 3.899 |
| 2008-11-28 | 3.92 |
| 2008-12-01 | 3.99 |
| 2008-12-02 | 3.955 |
| 2008-12-03 | 3.978 |
| 2008-12-04 | 3.964 |
| 2008-12-05 | 3.981 |
| 2008-12-08 | 3.935 |
| 2008-12-09 | 3.931 |
| 2008-12-10 | 3.904 |
| 2008-12-11 | 3.911 |
| 2008-12-12 | 3.898 |
| 2008-12-15 | 3.863 |
| 2008-12-16 | 3.833 |
| 2008-12-17 | 3.755 |
| 2008-12-18 | 3.677 |
| 2008-12-19 | 3.736 |
| 2008-12-22 | 3.835 |
| 2008-12-23 | 3.835 |
| 2008-12-24 | 3.873 |
| 2008-12-29 | 3.848 |
| 2008-12-30 | 3.765 |
| 2008-12-31 | 3.802 |
| 2009-01-02 | 3.783 |
| 2009-01-05 | 3.853 |
| 2009-01-06 | 3.861 |
| 2009-01-07 | 3.857 |
| 2009-01-08 | 3.888 |
| 2009-01-09 | 3.861 |
| 2009-01-12 | 3.895 |
| 2009-01-13 | 3.915 |
| 2009-01-14 | 3.889 |
| 2009-01-15 | 3.885 |
| 2009-01-16 | 3.861 |
| 2009-01-19 | 3.84 |
| 2009-01-20 | 3.888 |
| 2009-01-21 | 3.903 |
| 2009-01-22 | 3.945 |
| 2009-01-23 | 3.974 |
| 2009-01-26 | 3.995 |
| 2009-01-27 | 3.98 |
| 2009-01-28 | 4.025 |
| 2009-01-29 | 4.017 |
| 2009-01-30 | 4.065 |
| 2009-02-02 | 4.065 |
| 2009-02-03 | 4.074 |
| 2009-02-04 | 4.074 |
| 2009-02-05 | 4.067 |
| 2009-02-06 | 4.012 |
| 2009-02-09 | 4.037 |
| 2009-02-11 | 4.061 |
| 2009-02-12 | 4.054 |
| 2009-02-13 | 4.045 |
| 2009-02-16 | 4.074 |
| 2009-02-17 | 4.135 |
| 2009-02-18 | 4.142 |
| 2009-02-19 | 4.123 |
| 2009-02-20 | 4.16 |
| 2009-02-23 | 4.148 |
| 2009-02-24 | 4.161 |
| 2009-02-25 | 4.191 |
| 2009-02-26 | 4.173 |
| 2009-02-27 | 4.162 |
| 2009-03-02 | 4.209 |
| 2009-03-03 | 4.206 |
| 2009-03-04 | 4.211 |
| 2009-03-05 | 4.235 |
| 2009-03-06 | 4.234 |
| 2009-03-09 | 4.245 |
| 2009-03-12 | 4.215 |
| 2009-03-13 | 4.171 |
| 2009-03-16 | 4.135 |
| 2009-03-17 | 4.144 |
| 2009-03-18 | 4.124 |
| 2009-03-19 | 4.05 |
| 2009-03-20 | 4.024 |
| 2009-03-23 | 4.052 |
| 2009-03-24 | 4.066 |
| 2009-03-25 | 4.101 |
| 2009-03-26 | 4.148 |
| 2009-03-27 | 4.196 |
| 2009-03-30 | 4.226 |
| 2009-03-31 | 4.188 |
| 2009-04-01 | 4.209 |
| 2009-04-02 | 4.175 |
| 2009-04-03 | 4.165 |
| 2009-04-06 | 4.125 |
| 2009-04-07 | 4.172 |
| 2009-04-14 | 4.166 |
| 2009-04-16 | 4.189 |
| 2009-04-17 | 4.179 |
| 2009-04-20 | 4.207 |
| 2009-04-21 | 4.214 |
| 2009-04-22 | 4.205 |
| 2009-04-23 | 4.229 |
| 2009-04-24 | 4.248 |
| 2009-04-27 | 4.233 |
| 2009-04-28 | 4.256 |
| 2009-04-30 | 4.163 |
| 2009-05-01 | 4.161 |
| 2009-05-04 | 4.161 |
| 2009-05-05 | 4.125 |
| 2009-05-06 | 4.141 |
| 2009-05-07 | 4.134 |
| 2009-05-08 | 4.101 |
| 2009-05-11 | 4.1 |
| 2009-05-12 | 4.102 |
| 2009-05-13 | 4.109 |
| 2009-05-14 | 4.154 |
| 2009-05-15 | 4.145 |
| 2009-05-18 | 4.169 |
| 2009-05-19 | 4.121 |
| 2009-05-20 | 4.091 |
| 2009-05-21 | 4.017 |
| 2009-05-22 | 3.96 |
| 2009-05-26 | 4 |
| 2009-05-27 | 3.992 |
| 2009-05-28 | 3.958 |
| 2009-06-01 | 3.887 |
| 2009-06-02 | 3.911 |
| 2009-06-03 | 3.932 |
| 2009-06-04 | 3.967 |
| 2009-06-05 | 3.931 |
| 2009-06-08 | 4.005 |
| 2009-06-09 | 3.967 |
| 2009-06-10 | 3.914 |
| 2009-06-11 | 3.921 |
| 2009-06-12 | 3.916 |
| 2009-06-15 | 3.965 |
| 2009-06-16 | 3.932 |
| 2009-06-17 | 3.95 |
| 2009-06-18 | 3.958 |
| 2009-06-19 | 3.958 |
| 2009-06-22 | 3.955 |
| 2009-06-23 | 3.968 |
| 2009-06-24 | 3.933 |
| 2009-06-25 | 3.962 |
| 2009-06-26 | 3.973 |
| 2009-06-29 | 3.936 |
| 2009-06-30 | 3.919 |
| 2009-07-01 | 3.89 |
| 2009-07-02 | 3.866 |
| 2009-07-03 | 3.884 |
| 2009-07-06 | 3.916 |
| 2009-07-07 | 3.91 |
| 2009-07-08 | 3.964 |
| 2009-07-09 | 3.956 |
| 2009-07-10 | 3.965 |
| 2009-07-13 | 3.987 |
| 2009-07-14 | 3.96 |
| 2009-07-15 | 3.919 |
| 2009-07-16 | 3.902 |
| 2009-07-17 | 3.904 |
| 2009-07-20 | 3.902 |
| 2009-07-21 | 3.888 |
| 2009-07-22 | 3.886 |
| 2009-07-23 | 3.881 |
| 2009-07-24 | 3.867 |
| 2009-07-27 | 3.811 |
| 2009-07-28 | 3.781 |
| 2009-07-29 | 3.803 |
| 2009-07-31 | 3.79 |
| 2009-08-03 | 3.743 |
| 2009-08-04 | 3.866 |
| 2009-08-05 | 3.889 |
| 2009-08-06 | 3.931 |
| 2009-08-07 | 3.912 |
| 2009-08-10 | 3.873 |
| 2009-08-11 | 3.87 |
| 2009-08-12 | 3.857 |
| 2009-08-13 | 3.818 |
| 2009-08-14 | 3.789 |
| 2009-08-17 | 3.811 |
| 2009-08-18 | 3.824 |
| 2009-08-19 | 3.832 |
| 2009-08-20 | 3.811 |
| 2009-08-21 | 3.818 |
| 2009-08-24 | 3.804 |
| 2009-08-25 | 3.796 |
| 2009-08-26 | 3.797 |
| 2009-08-27 | 3.799 |
| 2009-08-28 | 3.822 |
| 2009-08-31 | 3.811 |
| 2009-09-01 | 3.796 |
| 2009-09-02 | 3.807 |
| 2009-09-03 | 3.796 |
| 2009-09-04 | 3.762 |
| 2009-09-07 | 3.757 |
| 2009-09-08 | 3.78 |
| 2009-09-09 | 3.781 |
| 2009-09-10 | 3.788 |
| 2009-09-11 | 3.782 |
| 2009-09-14 | 3.779 |
| 2009-09-15 | 3.761 |
| 2009-09-16 | 3.74 |
| 2009-09-17 | 3.75 |
| 2009-09-21 | 3.742 |
| 2009-09-22 | 3.729 |
| 2009-09-23 | 3.732 |
| 2009-09-24 | 3.733 |
| 2009-09-25 | 3.77 |
| 2009-09-29 | 3.774 |
| 2009-09-30 | 3.758 |
| 2009-10-01 | 3.78 |
| 2009-10-02 | 3.766 |
| 2009-10-05 | 3.76 |
| 2009-10-06 | 3.733 |
| 2009-10-07 | 3.734 |
| 2009-10-08 | 3.732 |
| 2009-10-09 | 3.737 |
| 2009-10-12 | 3.728 |
| 2009-10-13 | 3.714 |
| 2009-10-14 | 3.709 |
| 2009-10-15 | 3.718 |
| 2009-10-16 | 3.709 |
| 2009-10-19 | 3.708 |
| 2009-10-20 | 3.7 |
| 2009-10-21 | 3.704 |
| 2009-10-22 | 3.698 |
| 2009-10-23 | 3.692 |
| 2009-10-26 | 3.69 |
| 2009-10-27 | 3.709 |
| 2009-10-28 | 3.745 |
| 2009-10-29 | 3.764 |
| 2009-10-30 | 3.746 |
| 2009-11-02 | 3.775 |
| 2009-11-03 | 3.806 |
| 2009-11-04 | 3.793 |
| 2009-11-05 | 3.792 |
| 2009-11-06 | 3.771 |
| 2009-11-09 | 3.741 |
| 2009-11-10 | 3.759 |
| 2009-11-11 | 3.749 |
| 2009-11-12 | 3.769 |
| 2009-11-13 | 3.774 |
| 2009-11-16 | 3.753 |
| 2009-11-17 | 3.768 |
| 2009-11-18 | 3.77 |
| 2009-11-19 | 3.793 |
| 2009-11-20 | 3.811 |
| 2009-11-23 | 3.801 |
| 2009-11-24 | 3.777 |
| 2009-11-25 | 3.762 |
| 2009-11-26 | 3.776 |
| 2009-11-27 | 3.826 |
| 2009-11-30 | 3.792 |
| 2009-12-01 | 3.775 |
| 2009-12-02 | 3.777 |
| 2009-12-03 | 3.772 |
| 2009-12-04 | 3.774 |
| 2009-12-07 | 3.815 |
| 2009-12-08 | 3.797 |
| 2009-12-09 | 3.806 |
| 2009-12-10 | 3.781 |
| 2009-12-11 | 3.775 |
| 2009-12-14 | 3.78 |
| 2009-12-15 | 3.787 |
| 2009-12-16 | 3.783 |
| 2009-12-17 | 3.803 |
| 2009-12-18 | 3.793 |
| 2009-12-21 | 3.801 |
| 2009-12-22 | 3.801 |
| 2009-12-23 | 3.808 |
| 2009-12-24 | 3.797 |
| 2009-12-28 | 3.793 |
| 2009-12-29 | 3.79 |
| 2009-12-30 | 3.789 |
| 2009-12-31 | 3.775 |
| 2010-01-04 | 3.765 |
| 2010-01-05 | 3.736 |
| 2010-01-06 | 3.74 |
| 2010-01-07 | 3.727 |
| 2010-01-08 | 3.718 |
| 2010-01-11 | 3.683 |
| 2010-01-12 | 3.691 |
| 2010-01-13 | 3.667 |
| 2010-01-14 | 3.683 |
| 2010-01-15 | 3.682 |
| 2010-01-18 | 3.687 |
| 2010-01-19 | 3.69 |
| 2010-01-20 | 3.704 |
| 2010-01-21 | 3.715 |
| 2010-01-22 | 3.727 |
| 2010-01-25 | 3.722 |
| 2010-01-26 | 3.733 |
| 2010-01-27 | 3.729 |
| 2010-01-28 | 3.728 |
| 2010-01-29 | 3.724 |
| 2010-02-01 | 3.735 |
| 2010-02-02 | 3.707 |
| 2010-02-03 | 3.704 |
| 2010-02-04 | 3.722 |
| 2010-02-05 | 3.747 |
| 2010-02-08 | 3.732 |
| 2010-02-09 | 3.728 |
| 2010-02-10 | 3.749 |
| 2010-02-11 | 3.739 |
| 2010-02-12 | 3.739 |
| 2010-02-15 | 3.752 |
| 2010-02-16 | 3.744 |
| 2010-02-17 | 3.738 |
| 2010-02-18 | 3.749 |
| 2010-02-19 | 3.76 |
| 2010-02-22 | 3.766 |
| 2010-02-23 | 3.767 |
| 2010-02-24 | 3.772 |
| 2010-02-25 | 3.785 |
| 2010-02-26 | 3.796 |
| 2010-03-02 | 3.787 |
| 2010-03-03 | 3.769 |
| 2010-03-04 | 3.778 |
| 2010-03-05 | 3.771 |
| 2010-03-08 | 3.763 |
| 2010-03-09 | 3.766 |
| 2010-03-10 | 3.748 |
| 2010-03-11 | 3.731 |
| 2010-03-12 | 3.718 |
| 2010-03-15 | 3.715 |
| 2010-03-16 | 3.722 |
| 2010-03-17 | 3.714 |
| 2010-03-18 | 3.729 |
| 2010-03-19 | 3.733 |
| 2010-03-22 | 3.739 |
| 2010-03-23 | 3.741 |
| 2010-03-24 | 3.742 |
| 2010-03-25 | 3.749 |
| 2010-03-26 | 3.75 |
| 2010-03-31 | 3.713 |
| 2010-04-01 | 3.697 |
| 2010-04-06 | 3.7 |
| 2010-04-07 | 3.707 |
| 2010-04-08 | 3.699 |
| 2010-04-09 | 3.692 |
| 2010-04-12 | 3.682 |
| 2010-04-13 | 3.684 |
| 2010-04-14 | 3.705 |
| 2010-04-15 | 3.701 |
| 2010-04-16 | 3.701 |
| 2010-04-19 | 3.724 |
| 2010-04-21 | 3.719 |
| 2010-04-22 | 3.738 |
| 2010-04-23 | 3.743 |
| 2010-04-26 | 3.719 |
| 2010-04-27 | 3.735 |
| 2010-04-28 | 3.749 |
| 2010-04-29 | 3.728 |
| 2010-04-30 | 3.716 |
| 2010-05-03 | 3.73 |
| 2010-05-04 | 3.737 |
| 2010-05-05 | 3.75 |
| 2010-05-06 | 3.772 |
| 2010-05-07 | 3.803 |
| 2010-05-10 | 3.748 |
| 2010-05-11 | 3.757 |
| 2010-05-12 | 3.748 |
| 2010-05-13 | 3.753 |
| 2010-05-14 | 3.759 |
| 2010-05-17 | 3.778 |
| 2010-05-18 | 3.759 |
| 2010-05-20 | 3.819 |
| 2010-05-21 | 3.822 |
| 2010-05-24 | 3.811 |
| 2010-05-25 | 3.87 |
| 2010-05-26 | 3.845 |
| 2010-05-27 | 3.834 |
| 2010-05-28 | 3.829 |
| 2010-06-01 | 3.879 |
| 2010-06-02 | 3.853 |
| 2010-06-03 | 3.845 |
| 2010-06-04 | 3.853 |
| 2010-06-07 | 3.875 |
| 2010-06-08 | 3.873 |
| 2010-06-09 | 3.884 |
| 2010-06-10 | 3.849 |
| 2010-06-11 | 3.848 |
| 2010-06-14 | 3.825 |
| 2010-06-15 | 3.819 |
| 2010-06-16 | 3.819 |
| 2010-06-17 | 3.818 |
| 2010-06-18 | 3.814 |
| 2010-06-21 | 3.814 |
| 2010-06-22 | 3.841 |
| 2010-06-23 | 3.86 |
| 2010-06-24 | 3.867 |
| 2010-06-25 | 3.864 |
| 2010-06-28 | 3.888 |
| 2010-06-29 | 3.888 |
| 2010-06-30 | 3.875 |
| 2010-07-01 | 3.883 |
| 2010-07-02 | 3.89 |
| 2010-07-05 | 3.886 |
| 2010-07-06 | 3.888 |
| 2010-07-07 | 3.894 |
| 2010-07-08 | 3.866 |
| 2010-07-09 | 3.866 |
| 2010-07-12 | 3.866 |
| 2010-07-13 | 3.86 |
| 2010-07-14 | 3.859 |
| 2010-07-15 | 3.859 |
| 2010-07-16 | 3.858 |
| 2010-07-19 | 3.859 |
| 2010-07-21 | 3.862 |
| 2010-07-22 | 3.864 |
| 2010-07-23 | 3.849 |
| 2010-07-26 | 3.859 |
| 2010-07-27 | 3.802 |
| 2010-07-28 | 3.805 |
| 2010-07-29 | 3.789 |
| 2010-07-30 | 3.779 |
| 2010-08-02 | 3.769 |
| 2010-08-03 | 3.753 |
| 2010-08-04 | 3.774 |
| 2010-08-05 | 3.761 |
| 2010-08-06 | 3.775 |
| 2010-08-09 | 3.756 |
| 2010-08-10 | 3.772 |
| 2010-08-11 | 3.791 |
| 2010-08-12 | 3.8 |
| 2010-08-13 | 3.79 |
| 2010-08-16 | 3.803 |
| 2010-08-17 | 3.78 |
| 2010-08-18 | 3.778 |
| 2010-08-19 | 3.785 |
| 2010-08-20 | 3.794 |
| 2010-08-23 | 3.8 |
| 2010-08-24 | 3.817 |
| 2010-08-25 | 3.821 |
| 2010-08-26 | 3.815 |
| 2010-08-27 | 3.829 |
| 2010-08-30 | 3.818 |
| 2010-08-31 | 3.817 |
| 2010-09-01 | 3.798 |
| 2010-09-02 | 3.788 |
| 2010-09-03 | 3.779 |
| 2010-09-06 | 3.772 |
| 2010-09-07 | 3.782 |
| 2010-09-13 | 3.77 |
| 2010-09-14 | 3.772 |
| 2010-09-15 | 3.754 |
| 2010-09-16 | 3.733 |
| 2010-09-20 | 3.728 |
| 2010-09-21 | 3.716 |
| 2010-09-22 | 3.694 |
| 2010-09-24 | 3.693 |
| 2010-09-27 | 3.681 |
| 2010-09-28 | 3.677 |
| 2010-09-29 | 3.665 |
| 2010-10-01 | 3.645 |
| 2010-10-04 | 3.628 |
| 2010-10-05 | 3.618 |
| 2010-10-06 | 3.601 |
| 2010-10-07 | 3.591 |
| 2010-10-08 | 3.601 |
| 2010-10-11 | 3.599 |
| 2010-10-12 | 3.62 |
| 2010-10-13 | 3.593 |
| 2010-10-14 | 3.58 |
| 2010-10-15 | 3.569 |
| 2010-10-18 | 3.581 |
| 2010-10-19 | 3.589 |
| 2010-10-20 | 3.619 |
| 2010-10-21 | 3.61 |
| 2010-10-22 | 3.638 |
| 2010-10-25 | 3.599 |
| 2010-10-26 | 3.632 |
| 2010-10-27 | 3.642 |
| 2010-10-28 | 3.645 |
| 2010-10-29 | 3.636 |
| 2010-11-01 | 3.627 |
| 2010-11-02 | 3.622 |
| 2010-11-03 | 3.613 |
| 2010-11-04 | 3.58 |
| 2010-11-05 | 3.582 |
| 2010-11-08 | 3.613 |
| 2010-11-09 | 3.622 |
| 2010-11-10 | 3.64 |
| 2010-11-11 | 3.658 |
| 2010-11-12 | 3.68 |
| 2010-11-15 | 3.672 |
| 2010-11-16 | 3.677 |
| 2010-11-17 | 3.684 |
| 2010-11-18 | 3.653 |
| 2010-11-19 | 3.643 |
| 2010-11-22 | 3.62 |
| 2010-11-23 | 3.643 |
| 2010-11-24 | 3.654 |
| 2010-11-25 | 3.651 |
| 2010-11-26 | 3.679 |
| 2010-11-29 | 3.677 |
| 2010-11-30 | 3.683 |
| 2010-12-01 | 3.665 |
| 2010-12-02 | 3.652 |
| 2010-12-03 | 3.635 |
| 2010-12-06 | 3.631 |
| 2010-12-07 | 3.623 |
| 2010-12-08 | 3.642 |
| 2010-12-09 | 3.628 |
| 2010-12-10 | 3.616 |
| 2010-12-13 | 3.611 |
| 2010-12-14 | 3.592 |
| 2010-12-15 | 3.584 |
| 2010-12-16 | 3.598 |
| 2010-12-17 | 3.588 |
| 2010-12-20 | 3.606 |
| 2010-12-21 | 3.598 |
| 2010-12-22 | 3.596 |
| 2010-12-23 | 3.595 |
| 2010-12-24 | 3.592 |
| 2010-12-27 | 3.583 |
| 2010-12-28 | 3.57 |
| 2010-12-29 | 3.577 |
| 2010-12-30 | 3.56 |
| 2010-12-31 | 3.549 |
| 2011-01-03 | 3.544 |
| 2011-01-04 | 3.528 |
| 2011-01-05 | 3.542 |
| 2011-01-06 | 3.558 |
| 2011-01-07 | 3.576 |
| 2011-01-10 | 3.577 |
| 2011-01-11 | 3.552 |
| 2011-01-12 | 3.536 |
| 2011-01-13 | 3.566 |
| 2011-01-14 | 3.55 |
| 2011-01-17 | 3.548 |
| 2011-01-18 | 3.529 |
| 2011-01-19 | 3.544 |
| 2011-01-20 | 3.599 |
| 2011-01-21 | 3.632 |
| 2011-01-24 | 3.625 |
| 2011-01-25 | 3.618 |
| 2011-01-26 | 3.6 |
| 2011-01-27 | 3.656 |
| 2011-01-28 | 3.68 |
| 2011-01-31 | 3.71 |
| 2011-02-01 | 3.691 |
| 2011-02-02 | 3.675 |
| 2011-02-03 | 3.683 |
| 2011-02-04 | 3.713 |
| 2011-02-07 | 3.676 |
| 2011-02-08 | 3.678 |
| 2011-02-09 | 3.665 |
| 2011-02-10 | 3.688 |
| 2011-02-11 | 3.693 |
| 2011-02-14 | 3.667 |
| 2011-02-15 | 3.65 |
| 2011-02-16 | 3.611 |
| 2011-02-17 | 3.613 |
| 2011-02-18 | 3.624 |
| 2011-02-21 | 3.602 |
| 2011-02-22 | 3.634 |
| 2011-02-23 | 3.634 |
| 2011-02-24 | 3.658 |
| 2011-02-25 | 3.656 |
| 2011-02-28 | 3.622 |
| 2011-03-01 | 3.623 |
| 2011-03-02 | 3.635 |
| 2011-03-03 | 3.611 |
| 2011-03-04 | 3.611 |
| 2011-03-07 | 3.598 |
| 2011-03-08 | 3.583 |
| 2011-03-09 | 3.565 |
| 2011-03-10 | 3.567 |
| 2011-03-11 | 3.579 |
| 2011-03-14 | 3.553 |
| 2011-03-15 | 3.56 |
| 2011-03-16 | 3.561 |
| 2011-03-17 | 3.562 |
| 2011-03-18 | 3.554 |
| 2011-03-22 | 3.524 |
| 2011-03-23 | 3.536 |
| 2011-03-24 | 3.546 |
| 2011-03-25 | 3.555 |
| 2011-03-28 | 3.54 |
| 2011-03-29 | 3.525 |
| 2011-03-30 | 3.511 |
| 2011-03-31 | 3.481 |
| 2011-04-01 | 3.473 |
| 2011-04-04 | 3.465 |
| 2011-04-05 | 3.468 |
| 2011-04-06 | 3.46 |
| 2011-04-07 | 3.451 |
| 2011-04-08 | 3.438 |
| 2011-04-11 | 3.441 |
| 2011-04-12 | 3.446 |
| 2011-04-13 | 3.417 |
| 2011-04-14 | 3.431 |
| 2011-04-15 | 3.416 |
| 2011-04-20 | 3.424 |
| 2011-04-21 | 3.405 |
| 2011-04-26 | 3.413 |
| 2011-04-27 | 3.42 |
| 2011-04-28 | 3.411 |
| 2011-04-29 | 3.395 |
| 2011-05-02 | 3.377 |
| 2011-05-03 | 3.397 |
| 2011-05-04 | 3.392 |
| 2011-05-05 | 3.407 |
| 2011-05-06 | 3.447 |
| 2011-05-09 | 3.448 |
| 2011-05-11 | 3.465 |
| 2011-05-12 | 3.504 |
| 2011-05-13 | 3.485 |
| 2011-05-16 | 3.538 |
| 2011-05-17 | 3.52 |
| 2011-05-18 | 3.529 |
| 2011-05-19 | 3.49 |
| 2011-05-20 | 3.474 |
| 2011-05-23 | 3.516 |
| 2011-05-24 | 3.496 |
| 2011-05-25 | 3.499 |
| 2011-05-26 | 3.469 |
| 2011-05-27 | 3.472 |
| 2011-05-31 | 3.437 |
| 2011-06-01 | 3.42 |
| 2011-06-02 | 3.406 |
| 2011-06-03 | 3.387 |
| 2011-06-06 | 3.383 |
| 2011-06-07 | 3.363 |
| 2011-06-09 | 3.377 |
| 2011-06-10 | 3.393 |
| 2011-06-13 | 3.434 |
| 2011-06-14 | 3.395 |
| 2011-06-15 | 3.418 |
| 2011-06-16 | 3.485 |
| 2011-06-17 | 3.463 |
| 2011-06-20 | 3.459 |
| 2011-06-21 | 3.416 |
| 2011-06-22 | 3.421 |
| 2011-06-23 | 3.45 |
| 2011-06-24 | 3.445 |
| 2011-06-27 | 3.451 |
| 2011-06-28 | 3.463 |
| 2011-06-29 | 3.426 |
| 2011-06-30 | 3.415 |
| 2011-07-01 | 3.399 |
| 2011-07-04 | 3.389 |
| 2011-07-05 | 3.411 |
| 2011-07-06 | 3.42 |
| 2011-07-07 | 3.406 |
| 2011-07-08 | 3.398 |
| 2011-07-11 | 3.434 |
| 2011-07-12 | 3.465 |
| 2011-07-13 | 3.437 |
| 2011-07-14 | 3.431 |
| 2011-07-15 | 3.439 |
| 2011-07-18 | 3.452 |
| 2011-07-19 | 3.439 |
| 2011-07-20 | 3.419 |
| 2011-07-21 | 3.428 |
| 2011-07-22 | 3.391 |
| 2011-07-25 | 3.408 |
| 2011-07-26 | 3.398 |
| 2011-07-27 | 3.4 |
| 2011-07-28 | 3.43 |
| 2011-07-29 | 3.43 |
| 2011-08-01 | 3.412 |
| 2011-08-02 | 3.449 |
| 2011-08-03 | 3.464 |
| 2011-08-04 | 3.489 |
| 2011-08-05 | 3.52 |
| 2011-08-08 | 3.552 |
| 2011-08-10 | 3.515 |
| 2011-08-11 | 3.548 |
| 2011-08-12 | 3.548 |
| 2011-08-15 | 3.52 |
| 2011-08-16 | 3.538 |
| 2011-08-17 | 3.519 |
| 2011-08-18 | 3.557 |
| 2011-08-19 | 3.586 |
| 2011-08-22 | 3.578 |
| 2011-08-23 | 3.578 |
| 2011-08-24 | 3.608 |
| 2011-08-25 | 3.609 |
| 2011-08-26 | 3.626 |
| 2011-08-29 | 3.606 |
| 2011-08-30 | 3.572 |
| 2011-08-31 | 3.558 |
| 2011-09-01 | 3.574 |
| 2011-09-02 | 3.584 |
| 2011-09-05 | 3.633 |
| 2011-09-06 | 3.656 |
| 2011-09-07 | 3.673 |
| 2011-09-08 | 3.681 |
| 2011-09-09 | 3.7 |
| 2011-09-12 | 3.725 |
| 2011-09-13 | 3.712 |
| 2011-09-14 | 3.714 |
| 2011-09-15 | 3.686 |
| 2011-09-16 | 3.654 |
| 2011-09-19 | 3.698 |
| 2011-09-20 | 3.682 |
| 2011-09-21 | 3.689 |
| 2011-09-22 | 3.721 |
| 2011-09-23 | 3.712 |
| 2011-09-26 | 3.725 |
| 2011-09-27 | 3.712 |
| 2011-10-03 | 3.755 |
| 2011-10-04 | 3.763 |
| 2011-10-05 | 3.734 |
| 2011-10-06 | 3.725 |
| 2011-10-10 | 3.675 |
| 2011-10-11 | 3.688 |
| 2011-10-12 | 3.66 |
| 2011-10-14 | 3.66 |
| 2011-10-17 | 3.635 |
| 2011-10-18 | 3.651 |
| 2011-10-19 | 3.634 |
| 2011-10-21 | 3.646 |
| 2011-10-24 | 3.644 |
| 2011-10-25 | 3.643 |
| 2011-10-26 | 3.65 |
| 2011-10-27 | 3.62 |
| 2011-10-28 | 3.602 |
| 2011-10-31 | 3.604 |
| 2011-11-01 | 3.65 |
| 2011-11-02 | 3.651 |
| 2011-11-03 | 3.665 |
| 2011-11-04 | 3.665 |
| 2011-11-07 | 3.682 |
| 2011-11-08 | 3.674 |
| 2011-11-09 | 3.712 |
| 2011-11-10 | 3.723 |
| 2011-11-11 | 3.721 |
| 2011-11-14 | 3.723 |
| 2011-11-15 | 3.732 |
| 2011-11-16 | 3.726 |
| 2011-11-17 | 3.728 |
| 2011-11-18 | 3.731 |
| 2011-11-21 | 3.741 |
| 2011-11-22 | 3.732 |
| 2011-11-23 | 3.761 |
| 2011-11-24 | 3.774 |
| 2011-11-25 | 3.795 |
| 2011-11-28 | 3.8 |
| 2011-11-29 | 3.781 |
| 2011-11-30 | 3.793 |
| 2011-12-01 | 3.741 |
| 2011-12-02 | 3.732 |
| 2011-12-05 | 3.727 |
| 2011-12-06 | 3.736 |
| 2011-12-07 | 3.74 |
| 2011-12-08 | 3.741 |
| 2011-12-09 | 3.771 |
| 2011-12-12 | 3.762 |
| 2011-12-13 | 3.774 |
| 2011-12-14 | 3.805 |
| 2011-12-15 | 3.8 |
| 2011-12-16 | 3.792 |
| 2011-12-19 | 3.797 |
| 2011-12-20 | 3.783 |
| 2011-12-21 | 3.775 |
| 2011-12-22 | 3.784 |
| 2011-12-23 | 3.783 |
| 2011-12-27 | 3.775 |
| 2011-12-28 | 3.796 |
| 2011-12-29 | 3.817 |
| 2011-12-30 | 3.821 |
| 2012-01-03 | 3.814 |
| 2012-01-04 | 3.847 |
| 2012-01-05 | 3.854 |
| 2012-01-06 | 3.839 |
| 2012-01-09 | 3.839 |
| 2012-01-10 | 3.833 |
| 2012-01-11 | 3.849 |
| 2012-01-12 | 3.836 |
| 2012-01-13 | 3.83 |
| 2012-01-16 | 3.851 |
| 2012-01-17 | 3.834 |
| 2012-01-18 | 3.813 |
| 2012-01-19 | 3.784 |
| 2012-01-20 | 3.783 |
| 2012-01-23 | 3.775 |
| 2012-01-24 | 3.787 |
| 2012-01-25 | 3.789 |
| 2012-01-26 | 3.764 |
| 2012-01-27 | 3.768 |
| 2012-01-30 | 3.766 |
| 2012-01-31 | 3.733 |
| 2012-02-01 | 3.737 |
| 2012-02-02 | 3.727 |
| 2012-02-03 | 3.717 |
| 2012-02-06 | 3.719 |
| 2012-02-07 | 3.732 |
| 2012-02-08 | 3.7 |
| 2012-02-09 | 3.721 |
| 2012-02-10 | 3.713 |
| 2012-02-13 | 3.717 |
| 2012-02-14 | 3.736 |
| 2012-02-15 | 3.734 |
| 2012-02-16 | 3.771 |
| 2012-02-17 | 3.753 |
| 2012-02-20 | 3.725 |
| 2012-02-21 | 3.738 |
| 2012-02-22 | 3.752 |
| 2012-02-23 | 3.755 |
| 2012-02-24 | 3.756 |
| 2012-02-27 | 3.803 |
| 2012-02-28 | 3.785 |
| 2012-02-29 | 3.766 |
| 2012-03-01 | 3.784 |
| 2012-03-02 | 3.791 |
| 2012-03-05 | 3.8 |
| 2012-03-06 | 3.814 |
| 2012-03-07 | 3.808 |
| 2012-03-12 | 3.786 |
| 2012-03-13 | 3.775 |
| 2012-03-14 | 3.787 |
| 2012-03-15 | 3.784 |
| 2012-03-16 | 3.769 |
| 2012-03-19 | 3.762 |
| 2012-03-20 | 3.749 |
| 2012-03-21 | 3.743 |
| 2012-03-22 | 3.755 |
| 2012-03-23 | 3.735 |
| 2012-03-26 | 3.734 |
| 2012-03-27 | 3.715 |
| 2012-03-28 | 3.724 |
| 2012-03-29 | 3.734 |
| 2012-03-30 | 3.715 |
| 2012-04-02 | 3.723 |
| 2012-04-03 | 3.723 |
| 2012-04-04 | 3.745 |
| 2012-04-05 | 3.744 |
| 2012-04-10 | 3.744 |
| 2012-04-11 | 3.758 |
| 2012-04-12 | 3.76 |
| 2012-04-16 | 3.754 |
| 2012-04-17 | 3.754 |
| 2012-04-18 | 3.769 |
| 2012-04-19 | 3.762 |
| 2012-04-20 | 3.757 |
| 2012-04-23 | 3.764 |
| 2012-04-24 | 3.758 |
| 2012-04-25 | 3.75 |
| 2012-04-27 | 3.757 |
| 2012-04-30 | 3.75 |
| 2012-05-01 | 3.768 |
| 2012-05-02 | 3.786 |
| 2012-05-03 | 3.778 |
| 2012-05-04 | 3.781 |
| 2012-05-07 | 3.804 |
| 2012-05-08 | 3.802 |
| 2012-05-09 | 3.815 |
| 2012-05-10 | 3.822 |
| 2012-05-11 | 3.823 |
| 2012-05-14 | 3.83 |
| 2012-05-15 | 3.827 |
| 2012-05-16 | 3.835 |
| 2012-05-17 | 3.828 |
| 2012-05-18 | 3.84 |
| 2012-05-21 | 3.826 |
| 2012-05-22 | 3.816 |
| 2012-05-23 | 3.859 |
| 2012-05-24 | 3.847 |
| 2012-05-25 | 3.849 |
| 2012-05-28 | 3.856 |
| 2012-05-29 | 3.876 |
| 2012-05-30 | 3.88 |
| 2012-05-31 | 3.881 |
| 2012-06-01 | 3.915 |
| 2012-06-04 | 3.892 |
| 2012-06-05 | 3.896 |
| 2012-06-06 | 3.887 |
| 2012-06-07 | 3.871 |
| 2012-06-08 | 3.882 |
| 2012-06-11 | 3.864 |
| 2012-06-12 | 3.889 |
| 2012-06-13 | 3.882 |
| 2012-06-14 | 3.881 |
| 2012-06-15 | 3.867 |
| 2012-06-18 | 3.856 |
| 2012-06-19 | 3.856 |
| 2012-06-20 | 3.865 |
| 2012-06-21 | 3.875 |
| 2012-06-22 | 3.905 |
| 2012-06-25 | 3.914 |
| 2012-06-26 | 3.939 |
| 2012-06-27 | 3.947 |
| 2012-06-28 | 3.942 |
| 2012-06-29 | 3.923 |
| 2012-07-02 | 3.92 |
| 2012-07-03 | 3.926 |
| 2012-07-04 | 3.918 |
| 2012-07-05 | 3.913 |
| 2012-07-06 | 3.93 |
| 2012-07-09 | 3.964 |
| 2012-07-10 | 3.956 |
| 2012-07-11 | 3.963 |
| 2012-07-12 | 3.978 |
| 2012-07-13 | 3.968 |
| 2012-07-16 | 3.984 |
| 2012-07-17 | 3.982 |
| 2012-07-18 | 4.008 |
| 2012-07-19 | 4.035 |
| 2012-07-20 | 3.997 |
| 2012-07-23 | 4.041 |
| 2012-07-24 | 4.064 |
| 2012-07-25 | 4.062 |
| 2012-07-26 | 4.079 |
| 2012-07-27 | 4.084 |
| 2012-07-30 | 4.035 |
| 2012-07-31 | 3.997 |
| 2012-08-01 | 3.97 |
| 2012-08-02 | 3.977 |
| 2012-08-03 | 4.007 |
| 2012-08-06 | 3.979 |
| 2012-08-07 | 3.998 |
| 2012-08-08 | 3.997 |
| 2012-08-09 | 3.987 |
| 2012-08-10 | 4.004 |
| 2012-08-13 | 4.041 |
| 2012-08-14 | 4.035 |
| 2012-08-15 | 4.033 |
| 2012-08-16 | 4.043 |
| 2012-08-17 | 4.028 |
| 2012-08-20 | 4.034 |
| 2012-08-21 | 4.024 |
| 2012-08-22 | 4.03 |
| 2012-08-23 | 4.003 |
| 2012-08-24 | 4.025 |
| 2012-08-27 | 4.025 |
| 2012-08-28 | 4.013 |
| 2012-08-29 | 4.029 |
| 2012-08-30 | 4.043 |
| 2012-08-31 | 4.028 |
| 2012-09-03 | 4.02 |
| 2012-09-04 | 4.018 |
| 2012-09-05 | 4.029 |
| 2012-09-06 | 4.025 |
| 2012-09-07 | 3.998 |
| 2012-09-10 | 3.98 |
| 2012-09-11 | 3.961 |
| 2012-09-12 | 3.95 |
| 2012-09-13 | 3.966 |
| 2012-09-14 | 3.919 |
| 2012-09-19 | 3.91 |
| 2012-09-20 | 3.92 |
| 2012-09-21 | 3.887 |
| 2012-09-24 | 3.918 |
| 2012-09-27 | 3.925 |
| 2012-09-28 | 3.912 |
| 2012-10-02 | 3.888 |
| 2012-10-03 | 3.884 |
| 2012-10-04 | 3.879 |
| 2012-10-05 | 3.856 |
| 2012-10-09 | 3.862 |
| 2012-10-10 | 3.865 |
| 2012-10-11 | 3.852 |
| 2012-10-12 | 3.84 |
| 2012-10-15 | 3.816 |
| 2012-10-16 | 3.813 |
| 2012-10-17 | 3.792 |
| 2012-10-18 | 3.809 |
| 2012-10-19 | 3.823 |
| 2012-10-22 | 3.816 |
| 2012-10-23 | 3.83 |
| 2012-10-24 | 3.855 |
| 2012-10-25 | 3.858 |
| 2012-10-26 | 3.874 |
| 2012-10-29 | 3.889 |
| 2012-10-30 | 3.895 |
| 2012-10-31 | 3.878 |
| 2012-11-01 | 3.872 |
| 2012-11-02 | 3.884 |
| 2012-11-05 | 3.904 |
| 2012-11-06 | 3.894 |
| 2012-11-07 | 3.879 |
| 2012-11-08 | 3.903 |
| 2012-11-09 | 3.896 |
| 2012-11-12 | 3.927 |
| 2012-11-13 | 3.927 |
| 2012-11-14 | 3.918 |
| 2012-11-15 | 3.952 |
| 2012-11-16 | 3.952 |
| 2012-11-19 | 3.94 |
| 2012-11-20 | 3.924 |
| 2012-11-21 | 3.916 |
| 2012-11-22 | 3.867 |
| 2012-11-23 | 3.874 |
| 2012-11-26 | 3.865 |
| 2012-11-27 | 3.857 |
| 2012-11-28 | 3.865 |
| 2012-11-29 | 3.83 |
| 2012-11-30 | 3.81 |
| 2012-12-03 | 3.807 |
| 2012-12-04 | 3.815 |
| 2012-12-05 | 3.805 |
| 2012-12-06 | 3.813 |
| 2012-12-07 | 3.835 |
| 2012-12-10 | 3.828 |
| 2012-12-11 | 3.806 |
| 2012-12-12 | 3.78 |
| 2012-12-13 | 3.783 |
| 2012-12-14 | 3.799 |
| 2012-12-17 | 3.777 |
| 2012-12-18 | 3.769 |
| 2012-12-19 | 3.75 |
| 2012-12-20 | 3.747 |
| 2012-12-21 | 3.747 |
| 2012-12-24 | 3.746 |
| 2012-12-26 | 3.747 |
| 2012-12-27 | 3.726 |
| 2012-12-28 | 3.729 |
| 2012-12-31 | 3.733 |
| 2013-01-02 | 3.714 |
| 2013-01-03 | 3.735 |
| 2013-01-04 | 3.775 |
| 2013-01-07 | 3.791 |
| 2013-01-08 | 3.764 |
| 2013-01-09 | 3.783 |
| 2013-01-10 | 3.777 |
| 2013-01-11 | 3.742 |
| 2013-01-14 | 3.733 |
| 2013-01-15 | 3.734 |
| 2013-01-16 | 3.733 |
| 2013-01-17 | 3.723 |
| 2013-01-18 | 3.717 |
| 2013-01-21 | 3.738 |
| 2013-01-23 | 3.722 |
| 2013-01-24 | 3.719 |
| 2013-01-25 | 3.714 |
| 2013-01-28 | 3.732 |
| 2013-01-29 | 3.729 |
| 2013-01-30 | 3.725 |
| 2013-01-31 | 3.728 |
| 2013-02-01 | 3.682 |
| 2013-02-04 | 3.685 |
| 2013-02-05 | 3.691 |
| 2013-02-06 | 3.696 |
| 2013-02-07 | 3.687 |
| 2013-02-08 | 3.695 |
| 2013-02-11 | 3.701 |
| 2013-02-12 | 3.697 |
| 2013-02-13 | 3.687 |
| 2013-02-14 | 3.68 |
| 2013-02-15 | 3.684 |
| 2013-02-18 | 3.678 |
| 2013-02-19 | 3.683 |
| 2013-02-20 | 3.663 |
| 2013-02-21 | 3.673 |
| 2013-02-22 | 3.71 |
| 2013-02-26 | 3.733 |
| 2013-02-27 | 3.728 |
| 2013-02-28 | 3.708 |
| 2013-03-01 | 3.723 |
| 2013-03-04 | 3.733 |
| 2013-03-05 | 3.732 |
| 2013-03-06 | 3.726 |
| 2013-03-07 | 3.723 |
| 2013-03-08 | 3.695 |
| 2013-03-11 | 3.69 |
| 2013-03-12 | 3.682 |
| 2013-03-13 | 3.693 |
| 2013-03-14 | 3.7 |
| 2013-03-15 | 3.681 |
| 2013-03-18 | 3.693 |
| 2013-03-19 | 3.682 |
| 2013-03-20 | 3.68 |
| 2013-03-21 | 3.676 |
| 2013-03-22 | 3.666 |
| 2013-03-27 | 3.637 |
| 2013-03-28 | 3.648 |
| 2013-04-02 | 3.62 |
| 2013-04-03 | 3.618 |
| 2013-04-04 | 3.631 |
| 2013-04-05 | 3.627 |
| 2013-04-08 | 3.618 |
| 2013-04-09 | 3.629 |
| 2013-04-10 | 3.633 |
| 2013-04-11 | 3.623 |
| 2013-04-12 | 3.628 |
| 2013-04-15 | 3.627 |
| 2013-04-17 | 3.624 |
| 2013-04-18 | 3.623 |
| 2013-04-19 | 3.629 |
| 2013-04-22 | 3.629 |
| 2013-04-23 | 3.625 |
| 2013-04-24 | 3.619 |
| 2013-04-25 | 3.606 |
| 2013-04-26 | 3.604 |
| 2013-04-29 | 3.592 |
| 2013-04-30 | 3.594 |
| 2013-05-01 | 3.587 |
| 2013-05-02 | 3.574 |
| 2013-05-03 | 3.569 |
| 2013-05-06 | 3.57 |
| 2013-05-07 | 3.56 |
| 2013-05-08 | 3.564 |
| 2013-05-09 | 3.556 |
| 2013-05-10 | 3.558 |
| 2013-05-13 | 3.571 |
| 2013-05-14 | 3.638 |
| 2013-05-16 | 3.647 |
| 2013-05-17 | 3.644 |
| 2013-05-20 | 3.66 |
| 2013-05-21 | 3.675 |
| 2013-05-22 | 3.665 |
| 2013-05-23 | 3.702 |
| 2013-05-24 | 3.696 |
| 2013-05-28 | 3.707 |
| 2013-05-29 | 3.694 |
| 2013-05-30 | 3.682 |
| 2013-05-31 | 3.683 |
| 2013-06-03 | 3.687 |
| 2013-06-04 | 3.676 |
| 2013-06-05 | 3.671 |
| 2013-06-06 | 3.649 |
| 2013-06-07 | 3.629 |
| 2013-06-10 | 3.632 |
| 2013-06-11 | 3.642 |
| 2013-06-12 | 3.627 |
| 2013-06-13 | 3.615 |
| 2013-06-14 | 3.601 |
| 2013-06-17 | 3.602 |
| 2013-06-18 | 3.594 |
| 2013-06-19 | 3.595 |
| 2013-06-20 | 3.63 |
| 2013-06-21 | 3.628 |
| 2013-06-24 | 3.634 |
| 2013-06-25 | 3.605 |
| 2013-06-26 | 3.616 |
| 2013-06-27 | 3.648 |
| 2013-06-28 | 3.618 |
| 2013-07-01 | 3.637 |
| 2013-07-02 | 3.629 |
| 2013-07-03 | 3.651 |
| 2013-07-04 | 3.633 |
| 2013-07-05 | 3.645 |
| 2013-07-08 | 3.661 |
| 2013-07-09 | 3.65 |
| 2013-07-10 | 3.646 |
| 2013-07-11 | 3.615 |
| 2013-07-12 | 3.607 |
| 2013-07-15 | 3.597 |
| 2013-07-17 | 3.576 |
| 2013-07-18 | 3.601 |
| 2013-07-19 | 3.582 |
| 2013-07-22 | 3.571 |
| 2013-07-23 | 3.571 |
| 2013-07-24 | 3.577 |
| 2013-07-25 | 3.594 |
| 2013-07-26 | 3.577 |
| 2013-07-29 | 3.594 |
| 2013-07-30 | 3.569 |
| 2013-07-31 | 3.566 |
| 2013-08-01 | 3.559 |
| 2013-08-02 | 3.577 |
| 2013-08-05 | 3.561 |
| 2013-08-06 | 3.553 |
| 2013-08-07 | 3.556 |
| 2013-08-08 | 3.539 |
| 2013-08-09 | 3.53 |
| 2013-08-12 | 3.545 |
| 2013-08-13 | 3.55 |
| 2013-08-14 | 3.573 |
| 2013-08-15 | 3.572 |
| 2013-08-16 | 3.562 |
| 2013-08-19 | 3.572 |
| 2013-08-20 | 3.568 |
| 2013-08-21 | 3.567 |
| 2013-08-22 | 3.587 |
| 2013-08-23 | 3.588 |
| 2013-08-26 | 3.603 |
| 2013-08-27 | 3.657 |
| 2013-08-28 | 3.666 |
| 2013-08-29 | 3.63 |
| 2013-08-30 | 3.614 |
| 2013-09-02 | 3.616 |
| 2013-09-03 | 3.632 |
| 2013-09-09 | 3.625 |
| 2013-09-10 | 3.604 |
| 2013-09-11 | 3.565 |
| 2013-09-12 | 3.564 |
| 2013-09-16 | 3.533 |
| 2013-09-17 | 3.537 |
| 2013-09-18 | 3.537 |
| 2013-09-20 | 3.504 |
| 2013-09-23 | 3.515 |
| 2013-09-24 | 3.526 |
| 2013-09-25 | 3.559 |
| 2013-09-27 | 3.571 |
| 2013-09-30 | 3.537 |
| 2013-10-01 | 3.532 |
| 2013-10-02 | 3.534 |
| 2013-10-03 | 3.537 |
| 2013-10-04 | 3.547 |
| 2013-10-07 | 3.541 |
| 2013-10-08 | 3.561 |
| 2013-10-09 | 3.567 |
| 2013-10-10 | 3.559 |
| 2013-10-11 | 3.547 |
| 2013-10-14 | 3.537 |
| 2013-10-15 | 3.546 |
| 2013-10-16 | 3.554 |
| 2013-10-17 | 3.535 |
| 2013-10-18 | 3.533 |
| 2013-10-21 | 3.535 |
| 2013-10-22 | 3.528 |
| 2013-10-23 | 3.52 |
| 2013-10-24 | 3.532 |
| 2013-10-25 | 3.526 |
| 2013-10-28 | 3.529 |
| 2013-10-29 | 3.524 |
| 2013-10-30 | 3.518 |
| 2013-10-31 | 3.519 |
| 2013-11-01 | 3.527 |
| 2013-11-04 | 3.533 |
| 2013-11-05 | 3.532 |
| 2013-11-06 | 3.531 |
| 2013-11-07 | 3.537 |
| 2013-11-08 | 3.536 |
| 2013-11-11 | 3.535 |
| 2013-11-12 | 3.534 |
| 2013-11-13 | 3.531 |
| 2013-11-14 | 3.532 |
| 2013-11-15 | 3.519 |
| 2013-11-18 | 3.524 |
| 2013-11-19 | 3.522 |
| 2013-11-20 | 3.544 |
| 2013-11-21 | 3.569 |
| 2013-11-22 | 3.559 |
| 2013-11-25 | 3.563 |
| 2013-11-26 | 3.542 |
| 2013-11-27 | 3.541 |
| 2013-11-28 | 3.534 |
| 2013-11-29 | 3.523 |
| 2013-12-02 | 3.53 |
| 2013-12-03 | 3.523 |
| 2013-12-04 | 3.522 |
| 2013-12-05 | 3.524 |
| 2013-12-06 | 3.517 |
| 2013-12-09 | 3.503 |
| 2013-12-10 | 3.495 |
| 2013-12-11 | 3.503 |
| 2013-12-12 | 3.507 |
| 2013-12-13 | 3.503 |
| 2013-12-16 | 3.507 |
| 2013-12-17 | 3.511 |
| 2013-12-18 | 3.505 |
| 2013-12-19 | 3.514 |
| 2013-12-20 | 3.518 |
| 2013-12-23 | 3.503 |
| 2013-12-24 | 3.488 |
| 2013-12-26 | 3.492 |
| 2013-12-27 | 3.492 |
| 2013-12-30 | 3.478 |
| 2013-12-31 | 3.471 |
| 2014-01-02 | 3.486 |
| 2014-01-03 | 3.504 |
| 2014-01-06 | 3.502 |
| 2014-01-07 | 3.501 |
| 2014-01-08 | 3.507 |
| 2014-01-09 | 3.503 |
| 2014-01-10 | 3.497 |
| 2014-01-13 | 3.488 |
| 2014-01-14 | 3.489 |
| 2014-01-15 | 3.483 |
| 2014-01-16 | 3.492 |
| 2014-01-17 | 3.489 |
| 2014-01-20 | 3.493 |
| 2014-01-21 | 3.498 |
| 2014-01-22 | 3.49 |
| 2014-01-23 | 3.486 |
| 2014-01-24 | 3.483 |
| 2014-01-27 | 3.489 |
| 2014-01-28 | 3.494 |
| 2014-01-29 | 3.49 |
| 2014-01-30 | 3.492 |
| 2014-01-31 | 3.498 |
| 2014-02-03 | 3.521 |
| 2014-02-04 | 3.531 |
| 2014-02-05 | 3.539 |
| 2014-02-06 | 3.549 |
| 2014-02-07 | 3.533 |
| 2014-02-10 | 3.525 |
| 2014-02-11 | 3.516 |
| 2014-02-12 | 3.523 |
| 2014-02-13 | 3.513 |
| 2014-02-14 | 3.506 |
| 2014-02-17 | 3.509 |
| 2014-02-18 | 3.512 |
| 2014-02-19 | 3.511 |
| 2014-02-20 | 3.517 |
| 2014-02-21 | 3.51 |
| 2014-02-24 | 3.505 |
| 2014-02-25 | 3.517 |
| 2014-02-26 | 3.521 |
| 2014-02-27 | 3.517 |
| 2014-02-28 | 3.496 |
| 2014-03-03 | 3.492 |
| 2014-03-04 | 3.488 |
| 2014-03-05 | 3.487 |
| 2014-03-06 | 3.475 |
| 2014-03-07 | 3.459 |
| 2014-03-10 | 3.474 |
| 2014-03-11 | 3.473 |
| 2014-03-12 | 3.471 |
| 2014-03-13 | 3.465 |
| 2014-03-14 | 3.471 |
| 2014-03-18 | 3.462 |
| 2014-03-19 | 3.462 |
| 2014-03-20 | 3.484 |
| 2014-03-21 | 3.479 |
| 2014-03-24 | 3.488 |
| 2014-03-25 | 3.49 |
| 2014-03-26 | 3.489 |
| 2014-03-27 | 3.504 |
| 2014-03-28 | 3.498 |
| 2014-03-31 | 3.487 |
| 2014-04-01 | 3.476 |
| 2014-04-02 | 3.475 |
| 2014-04-03 | 3.472 |
| 2014-04-04 | 3.476 |
| 2014-04-07 | 3.493 |
| 2014-04-08 | 3.48 |
| 2014-04-09 | 3.482 |
| 2014-04-10 | 3.467 |
| 2014-04-11 | 3.461 |
| 2014-04-16 | 3.47 |
| 2014-04-17 | 3.474 |
| 2014-04-22 | 3.484 |
| 2014-04-23 | 3.489 |
| 2014-04-24 | 3.477 |
| 2014-04-25 | 3.47 |
| 2014-04-28 | 3.484 |
| 2014-04-29 | 3.468 |
| 2014-04-30 | 3.466 |
| 2014-05-01 | 3.454 |
| 2014-05-02 | 3.458 |
| 2014-05-05 | 3.458 |
| 2014-05-07 | 3.449 |
| 2014-05-08 | 3.447 |
| 2014-05-09 | 3.452 |
| 2014-05-12 | 3.456 |
| 2014-05-13 | 3.457 |
| 2014-05-14 | 3.457 |
| 2014-05-15 | 3.455 |
| 2014-05-16 | 3.461 |
| 2014-05-19 | 3.454 |
| 2014-05-20 | 3.468 |
| 2014-05-21 | 3.488 |
| 2014-05-22 | 3.487 |
| 2014-05-23 | 3.49 |
| 2014-05-27 | 3.478 |
| 2014-05-28 | 3.487 |
| 2014-05-29 | 3.476 |
| 2014-05-30 | 3.475 |
| 2014-06-02 | 3.476 |
| 2014-06-03 | 3.473 |
| 2014-06-05 | 3.472 |
| 2014-06-06 | 3.464 |
| 2014-06-09 | 3.461 |
| 2014-06-10 | 3.462 |
| 2014-06-11 | 3.461 |
| 2014-06-12 | 3.461 |
| 2014-06-13 | 3.452 |
| 2014-06-16 | 3.459 |
| 2014-06-17 | 3.453 |
| 2014-06-18 | 3.458 |
| 2014-06-19 | 3.445 |
| 2014-06-20 | 3.443 |
| 2014-06-23 | 3.453 |
| 2014-06-24 | 3.433 |
| 2014-06-25 | 3.441 |
| 2014-06-26 | 3.432 |
| 2014-06-27 | 3.434 |
| 2014-06-30 | 3.438 |
| 2014-07-01 | 3.426 |
| 2014-07-02 | 3.426 |
| 2014-07-03 | 3.424 |
| 2014-07-04 | 3.419 |
| 2014-07-07 | 3.422 |
| 2014-07-08 | 3.429 |
| 2014-07-09 | 3.436 |
| 2014-07-10 | 3.429 |
| 2014-07-11 | 3.428 |
| 2014-07-14 | 3.423 |
| 2014-07-15 | 3.405 |
| 2014-07-16 | 3.408 |
| 2014-07-17 | 3.41 |
| 2014-07-18 | 3.421 |
| 2014-07-21 | 3.421 |
| 2014-07-22 | 3.418 |
| 2014-07-23 | 3.411 |
| 2014-07-24 | 3.402 |
| 2014-07-25 | 3.426 |
| 2014-07-28 | 3.427 |
| 2014-07-29 | 3.426 |
| 2014-07-30 | 3.429 |
| 2014-07-31 | 3.429 |
| 2014-08-01 | 3.415 |
| 2014-08-04 | 3.419 |
| 2014-08-06 | 3.427 |
| 2014-08-07 | 3.45 |
| 2014-08-08 | 3.476 |
| 2014-08-11 | 3.472 |
| 2014-08-12 | 3.483 |
| 2014-08-13 | 3.493 |
| 2014-08-14 | 3.47 |
| 2014-08-15 | 3.467 |
| 2014-08-18 | 3.503 |
| 2014-08-19 | 3.523 |
| 2014-08-20 | 3.533 |
| 2014-08-21 | 3.536 |
| 2014-08-22 | 3.519 |
| 2014-08-25 | 3.543 |
| 2014-08-26 | 3.572 |
| 2014-08-27 | 3.571 |
| 2014-08-28 | 3.56 |
| 2014-08-29 | 3.568 |
| 2014-09-01 | 3.579 |
| 2014-09-02 | 3.578 |
| 2014-09-03 | 3.579 |
| 2014-09-04 | 3.582 |
| 2014-09-05 | 3.606 |
| 2014-09-08 | 3.6 |
| 2014-09-09 | 3.609 |
| 2014-09-10 | 3.614 |
| 2014-09-11 | 3.628 |
| 2014-09-12 | 3.636 |
| 2014-09-15 | 3.626 |
| 2014-09-16 | 3.641 |
| 2014-09-17 | 3.649 |
| 2014-09-18 | 3.649 |
| 2014-09-19 | 3.643 |
| 2014-09-22 | 3.658 |
| 2014-09-23 | 3.658 |
| 2014-09-29 | 3.686 |
| 2014-09-30 | 3.695 |
| 2014-10-01 | 3.672 |
| 2014-10-02 | 3.644 |
| 2014-10-06 | 3.67 |
| 2014-10-07 | 3.708 |
| 2014-10-08 | 3.737 |
| 2014-10-10 | 3.722 |
| 2014-10-13 | 3.737 |
| 2014-10-14 | 3.743 |
| 2014-10-15 | 3.729 |
| 2014-10-17 | 3.71 |
| 2014-10-20 | 3.746 |
| 2014-10-21 | 3.731 |
| 2014-10-22 | 3.742 |
| 2014-10-23 | 3.767 |
| 2014-10-24 | 3.793 |
| 2014-10-27 | 3.788 |
| 2014-10-28 | 3.765 |
| 2014-10-29 | 3.754 |
| 2014-10-30 | 3.777 |
| 2014-10-31 | 3.784 |
| 2014-11-03 | 3.789 |
| 2014-11-04 | 3.796 |
| 2014-11-05 | 3.8 |
| 2014-11-06 | 3.787 |
| 2014-11-07 | 3.81 |
| 2014-11-10 | 3.782 |
| 2014-11-11 | 3.815 |
| 2014-11-12 | 3.819 |
| 2014-11-13 | 3.812 |
| 2014-11-14 | 3.815 |
| 2014-11-17 | 3.824 |
| 2014-11-18 | 3.841 |
| 2014-11-19 | 3.838 |
| 2014-11-20 | 3.846 |
| 2014-11-21 | 3.833 |
| 2014-11-24 | 3.864 |
| 2014-11-25 | 3.863 |
| 2014-11-26 | 3.871 |
| 2014-11-27 | 3.886 |
| 2014-11-28 | 3.889 |
| 2014-12-01 | 3.914 |
| 2014-12-02 | 3.958 |
| 2014-12-03 | 3.994 |
| 2014-12-04 | 3.985 |
| 2014-12-05 | 3.96 |
| 2014-12-08 | 3.991 |
| 2014-12-09 | 3.944 |
| 2014-12-10 | 3.948 |
| 2014-12-11 | 3.918 |
| 2014-12-12 | 3.904 |
| 2014-12-15 | 3.919 |
| 2014-12-16 | 3.935 |
| 2014-12-17 | 3.922 |
| 2014-12-18 | 3.934 |
| 2014-12-19 | 3.93 |
| 2014-12-22 | 3.923 |
| 2014-12-23 | 3.914 |
| 2014-12-24 | 3.909 |
| 2014-12-29 | 3.929 |
| 2014-12-30 | 3.908 |
| 2014-12-31 | 3.889 |
| 2015-01-02 | 3.918 |
| 2015-01-05 | 3.963 |
| 2015-01-06 | 3.971 |
| 2015-01-07 | 3.96 |
| 2015-01-08 | 3.974 |
| 2015-01-09 | 3.958 |
| 2015-01-12 | 3.956 |
| 2015-01-13 | 3.945 |
| 2015-01-14 | 3.939 |
| 2015-01-15 | 3.899 |
| 2015-01-16 | 3.914 |
| 2015-01-19 | 3.93 |
| 2015-01-20 | 3.928 |
| 2015-01-21 | 3.933 |
| 2015-01-22 | 3.935 |
| 2015-01-23 | 3.963 |
| 2015-01-26 | 3.998 |
| 2015-01-27 | 3.995 |
| 2015-01-28 | 3.945 |
| 2015-01-29 | 3.926 |
| 2015-01-30 | 3.924 |
| 2015-02-02 | 3.937 |
| 2015-02-03 | 3.93 |
| 2015-02-04 | 3.894 |
| 2015-02-05 | 3.875 |
| 2015-02-06 | 3.869 |
| 2015-02-09 | 3.88 |
| 2015-02-10 | 3.875 |
| 2015-02-11 | 3.864 |
| 2015-02-12 | 3.893 |
| 2015-02-13 | 3.883 |
| 2015-02-16 | 3.89 |
| 2015-02-17 | 3.865 |
| 2015-02-18 | 3.85 |
| 2015-02-19 | 3.844 |
| 2015-02-20 | 3.861 |
| 2015-02-23 | 3.858 |
| 2015-02-24 | 3.952 |
| 2015-02-25 | 3.938 |
| 2015-02-26 | 3.933 |
| 2015-02-27 | 3.966 |
| 2015-03-02 | 3.986 |
| 2015-03-03 | 3.987 |
| 2015-03-04 | 3.984 |
| 2015-03-09 | 4.017 |
| 2015-03-10 | 4.041 |
| 2015-03-11 | 4.049 |
| 2015-03-12 | 4.022 |
| 2015-03-13 | 4.015 |
| 2015-03-16 | 4.019 |
| 2015-03-18 | 4.02 |
| 2015-03-19 | 4.006 |
| 2015-03-20 | 4.053 |
| 2015-03-23 | 4.018 |
| 2015-03-24 | 3.926 |
| 2015-03-25 | 3.948 |
| 2015-03-26 | 3.944 |
| 2015-03-27 | 3.973 |
| 2015-03-30 | 3.971 |
| 2015-03-31 | 3.98 |
| 2015-04-01 | 3.974 |
| 2015-04-02 | 3.956 |
| 2015-04-07 | 3.939 |
| 2015-04-08 | 3.939 |
| 2015-04-09 | 3.943 |
| 2015-04-13 | 4.014 |
| 2015-04-14 | 3.984 |
| 2015-04-15 | 3.975 |
| 2015-04-16 | 3.935 |
| 2015-04-17 | 3.929 |
| 2015-04-20 | 3.925 |
| 2015-04-21 | 3.946 |
| 2015-04-22 | 3.951 |
| 2015-04-24 | 3.924 |
| 2015-04-27 | 3.931 |
| 2015-04-28 | 3.894 |
| 2015-04-29 | 3.872 |
| 2015-04-30 | 3.861 |
| 2015-05-01 | 3.858 |
| 2015-05-04 | 3.89 |
| 2015-05-05 | 3.879 |
| 2015-05-06 | 3.867 |
| 2015-05-07 | 3.865 |
| 2015-05-08 | 3.868 |
| 2015-05-11 | 3.872 |
| 2015-05-12 | 3.863 |
| 2015-05-13 | 3.855 |
| 2015-05-14 | 3.819 |
| 2015-05-15 | 3.825 |
| 2015-05-18 | 3.819 |
| 2015-05-19 | 3.852 |
| 2015-05-20 | 3.874 |
| 2015-05-21 | 3.86 |
| 2015-05-22 | 3.873 |
| 2015-05-26 | 3.875 |
| 2015-05-27 | 3.875 |
| 2015-05-28 | 3.88 |
| 2015-05-29 | 3.876 |
| 2015-06-01 | 3.872 |
| 2015-06-02 | 3.862 |
| 2015-06-03 | 3.864 |
| 2015-06-04 | 3.836 |
| 2015-06-05 | 3.841 |
| 2015-06-08 | 3.868 |
| 2015-06-09 | 3.833 |
| 2015-06-10 | 3.827 |
| 2015-06-11 | 3.828 |
| 2015-06-12 | 3.838 |
| 2015-06-15 | 3.842 |
| 2015-06-16 | 3.835 |
| 2015-06-17 | 3.842 |
| 2015-06-18 | 3.812 |
| 2015-06-19 | 3.834 |
| 2015-06-22 | 3.833 |
| 2015-06-23 | 3.779 |
| 2015-06-24 | 3.761 |
| 2015-06-25 | 3.77 |
| 2015-06-26 | 3.792 |
| 2015-06-29 | 3.8 |
| 2015-06-30 | 3.769 |
| 2015-07-01 | 3.777 |
| 2015-07-02 | 3.78 |
| 2015-07-03 | 3.769 |
| 2015-07-06 | 3.776 |
| 2015-07-07 | 3.78 |
| 2015-07-08 | 3.797 |
| 2015-07-09 | 3.786 |
| 2015-07-10 | 3.777 |
| 2015-07-13 | 3.776 |
| 2015-07-14 | 3.775 |
| 2015-07-15 | 3.765 |
| 2015-07-16 | 3.789 |
| 2015-07-17 | 3.789 |
| 2015-07-20 | 3.824 |
| 2015-07-21 | 3.809 |
| 2015-07-22 | 3.809 |
| 2015-07-23 | 3.818 |
| 2015-07-24 | 3.825 |
| 2015-07-27 | 3.806 |
| 2015-07-28 | 3.774 |
| 2015-07-29 | 3.782 |
| 2015-07-30 | 3.781 |
| 2015-07-31 | 3.783 |
| 2015-08-03 | 3.772 |
| 2015-08-04 | 3.783 |
| 2015-08-05 | 3.807 |
| 2015-08-06 | 3.813 |
| 2015-08-07 | 3.808 |
| 2015-08-10 | 3.813 |
| 2015-08-11 | 3.818 |
| 2015-08-12 | 3.815 |
| 2015-08-13 | 3.807 |
| 2015-08-14 | 3.789 |
| 2015-08-17 | 3.81 |
| 2015-08-18 | 3.829 |
| 2015-08-19 | 3.878 |
| 2015-08-20 | 3.883 |
| 2015-08-21 | 3.874 |
| 2015-08-24 | 3.878 |
| 2015-08-25 | 3.864 |
| 2015-08-26 | 3.921 |
| 2015-08-27 | 3.928 |
| 2015-08-28 | 3.922 |
| 2015-08-31 | 3.93 |
| 2015-09-01 | 3.923 |
| 2015-09-02 | 3.93 |
| 2015-09-03 | 3.934 |
| 2015-09-04 | 3.927 |
| 2015-09-07 | 3.933 |
| 2015-09-08 | 3.922 |
| 2015-09-09 | 3.881 |
| 2015-09-10 | 3.906 |
| 2015-09-11 | 3.866 |
| 2015-09-16 | 3.889 |
| 2015-09-17 | 3.874 |
| 2015-09-18 | 3.863 |
| 2015-09-21 | 3.923 |
| 2015-09-24 | 3.941 |
| 2015-09-25 | 3.949 |
| 2015-09-29 | 3.936 |
| 2015-09-30 | 3.923 |
| 2015-10-01 | 3.918 |
| 2015-10-02 | 3.923 |
| 2015-10-06 | 3.874 |
| 2015-10-07 | 3.85 |
| 2015-10-08 | 3.848 |
| 2015-10-09 | 3.842 |
| 2015-10-12 | 3.835 |
| 2015-10-13 | 3.866 |
| 2015-10-14 | 3.85 |
| 2015-10-15 | 3.821 |
| 2015-10-16 | 3.816 |
| 2015-10-19 | 3.842 |
| 2015-10-20 | 3.859 |
| 2015-10-21 | 3.861 |
| 2015-10-22 | 3.855 |
| 2015-10-23 | 3.881 |
| 2015-10-26 | 3.894 |
| 2015-10-27 | 3.866 |
| 2015-10-28 | 3.872 |
| 2015-10-29 | 3.883 |
| 2015-10-30 | 3.867 |
| 2015-11-02 | 3.868 |
| 2015-11-03 | 3.878 |
| 2015-11-04 | 3.877 |
| 2015-11-05 | 3.888 |
| 2015-11-06 | 3.886 |
| 2015-11-09 | 3.913 |
| 2015-11-10 | 3.921 |
| 2015-11-11 | 3.911 |
| 2015-11-12 | 3.891 |
| 2015-11-13 | 3.889 |
| 2015-11-16 | 3.892 |
| 2015-11-17 | 3.905 |
| 2015-11-18 | 3.904 |
| 2015-11-19 | 3.885 |
| 2015-11-20 | 3.878 |
| 2015-11-23 | 3.894 |
| 2015-11-24 | 3.873 |
| 2015-11-25 | 3.877 |
| 2015-11-26 | 3.88 |
| 2015-11-27 | 3.889 |
| 2015-11-30 | 3.877 |
| 2015-12-01 | 3.879 |
| 2015-12-02 | 3.879 |
| 2015-12-03 | 3.887 |
| 2015-12-04 | 3.857 |
| 2015-12-07 | 3.855 |
| 2015-12-08 | 3.878 |
| 2015-12-09 | 3.885 |
| 2015-12-10 | 3.867 |
| 2015-12-11 | 3.86 |
| 2015-12-14 | 3.856 |
| 2015-12-15 | 3.859 |
| 2015-12-16 | 3.878 |
| 2015-12-17 | 3.895 |
| 2015-12-18 | 3.896 |
| 2015-12-21 | 3.9 |
| 2015-12-22 | 3.905 |
| 2015-12-23 | 3.895 |
| 2015-12-24 | 3.892 |
| 2015-12-28 | 3.886 |
| 2015-12-29 | 3.883 |
| 2015-12-30 | 3.896 |
| 2015-12-31 | 3.902 |
| 2016-01-04 | 3.913 |
| 2016-01-05 | 3.928 |
| 2016-01-06 | 3.941 |
| 2016-01-07 | 3.937 |
| 2016-01-08 | 3.922 |
| 2016-01-11 | 3.929 |
| 2016-01-12 | 3.942 |
| 2016-01-13 | 3.943 |
| 2016-01-14 | 3.944 |
| 2016-01-15 | 3.943 |
| 2016-01-18 | 3.955 |
| 2016-01-19 | 3.953 |
| 2016-01-20 | 3.983 |
| 2016-01-21 | 3.972 |
| 2016-01-22 | 3.971 |
| 2016-01-25 | 3.982 |
| 2016-01-26 | 3.976 |
| 2016-01-27 | 3.972 |
| 2016-01-28 | 3.961 |
| 2016-01-29 | 3.951 |
| 2016-02-01 | 3.955 |
| 2016-02-02 | 3.955 |
| 2016-02-03 | 3.964 |
| 2016-02-04 | 3.909 |
| 2016-02-05 | 3.883 |
| 2016-02-08 | 3.89 |
| 2016-02-09 | 3.887 |
| 2016-02-10 | 3.871 |
| 2016-02-11 | 3.888 |
| 2016-02-12 | 3.882 |
| 2016-02-15 | 3.889 |
| 2016-02-16 | 3.913 |
| 2016-02-17 | 3.906 |
| 2016-02-18 | 3.902 |
| 2016-02-19 | 3.911 |
| 2016-02-22 | 3.907 |
| 2016-02-23 | 3.907 |
| 2016-02-24 | 3.927 |
| 2016-02-25 | 3.907 |
| 2016-02-26 | 3.906 |
| 2016-02-29 | 3.91 |
| 2016-03-01 | 3.902 |
| 2016-03-02 | 3.886 |
| 2016-03-03 | 3.887 |
| 2016-03-04 | 3.893 |
| 2016-03-07 | 3.912 |
| 2016-03-08 | 3.911 |
| 2016-03-09 | 3.906 |
| 2016-03-10 | 3.903 |
| 2016-03-11 | 3.875 |
| 2016-03-14 | 3.878 |
| 2016-03-15 | 3.891 |
| 2016-03-16 | 3.901 |
| 2016-03-17 | 3.853 |
| 2016-03-18 | 3.857 |
| 2016-03-21 | 3.855 |
| 2016-03-22 | 3.851 |
| 2016-03-23 | 3.842 |
| 2016-03-28 | 3.837 |
| 2016-03-29 | 3.826 |
| 2016-03-30 | 3.788 |
| 2016-03-31 | 3.766 |
| 2016-04-01 | 3.786 |
| 2016-04-04 | 3.784 |
| 2016-04-05 | 3.802 |
| 2016-04-06 | 3.819 |
| 2016-04-07 | 3.795 |
| 2016-04-08 | 3.786 |
| 2016-04-11 | 3.782 |
| 2016-04-12 | 3.765 |
| 2016-04-13 | 3.773 |
| 2016-04-14 | 3.789 |
| 2016-04-15 | 3.785 |
| 2016-04-18 | 3.773 |
| 2016-04-19 | 3.763 |
| 2016-04-20 | 3.758 |
| 2016-04-21 | 3.764 |
| 2016-04-25 | 3.774 |
| 2016-04-26 | 3.763 |
| 2016-04-27 | 3.768 |
| 2016-04-28 | 3.761 |
| 2016-05-02 | 3.746 |
| 2016-05-03 | 3.747 |
| 2016-05-04 | 3.777 |
| 2016-05-05 | 3.781 |
| 2016-05-06 | 3.788 |
| 2016-05-09 | 3.779 |
| 2016-05-10 | 3.784 |
| 2016-05-11 | 3.772 |
| 2016-05-13 | 3.77 |
| 2016-05-16 | 3.812 |
| 2016-05-17 | 3.818 |
| 2016-05-18 | 3.835 |
| 2016-05-19 | 3.858 |
| 2016-05-20 | 3.871 |
| 2016-05-23 | 3.879 |
| 2016-05-24 | 3.865 |
| 2016-05-25 | 3.855 |
| 2016-05-26 | 3.837 |
| 2016-05-27 | 3.845 |
| 2016-05-31 | 3.85 |
| 2016-06-01 | 3.853 |
| 2016-06-02 | 3.854 |
| 2016-06-03 | 3.87 |
| 2016-06-06 | 3.831 |
| 2016-06-07 | 3.818 |
| 2016-06-08 | 3.826 |
| 2016-06-09 | 3.846 |
| 2016-06-10 | 3.849 |
| 2016-06-13 | 3.874 |
| 2016-06-14 | 3.864 |
| 2016-06-15 | 3.875 |
| 2016-06-16 | 3.871 |
| 2016-06-17 | 3.863 |
| 2016-06-20 | 3.851 |
| 2016-06-21 | 3.859 |
| 2016-06-22 | 3.852 |
| 2016-06-23 | 3.823 |
| 2016-06-24 | 3.885 |
| 2016-06-27 | 3.9 |
| 2016-06-28 | 3.878 |
| 2016-06-29 | 3.858 |
| 2016-06-30 | 3.846 |
| 2016-07-01 | 3.844 |
| 2016-07-04 | 3.856 |
| 2016-07-05 | 3.869 |
| 2016-07-06 | 3.895 |
| 2016-07-07 | 3.878 |
| 2016-07-08 | 3.882 |
| 2016-07-11 | 3.883 |
| 2016-07-12 | 3.874 |
| 2016-07-13 | 3.871 |
| 2016-07-14 | 3.852 |
| 2016-07-15 | 3.844 |
| 2016-07-18 | 3.86 |
| 2016-07-19 | 3.856 |
| 2016-07-20 | 3.859 |
| 2016-07-21 | 3.858 |
| 2016-07-22 | 3.839 |
| 2016-07-25 | 3.846 |
| 2016-07-26 | 3.844 |
| 2016-07-27 | 3.84 |
| 2016-07-28 | 3.828 |
| 2016-07-29 | 3.828 |
| 2016-08-01 | 3.806 |
| 2016-08-02 | 3.815 |
| 2016-08-03 | 3.822 |
| 2016-08-04 | 3.826 |
| 2016-08-05 | 3.821 |
| 2016-08-08 | 3.829 |
| 2016-08-09 | 3.82 |
| 2016-08-10 | 3.811 |
| 2016-08-11 | 3.811 |
| 2016-08-12 | 3.811 |
| 2016-08-15 | 3.808 |
| 2016-08-16 | 3.775 |
| 2016-08-17 | 3.791 |
| 2016-08-18 | 3.776 |
| 2016-08-19 | 3.771 |
| 2016-08-22 | 3.781 |
| 2016-08-23 | 3.768 |
| 2016-08-24 | 3.774 |
| 2016-08-25 | 3.768 |
| 2016-08-26 | 3.754 |
| 2016-08-29 | 3.788 |
| 2016-08-30 | 3.782 |
| 2016-08-31 | 3.786 |
| 2016-09-01 | 3.775 |
| 2016-09-02 | 3.768 |
| 2016-09-05 | 3.768 |
| 2016-09-06 | 3.766 |
| 2016-09-07 | 3.766 |
| 2016-09-08 | 3.749 |
| 2016-09-09 | 3.754 |
| 2016-09-12 | 3.771 |
| 2016-09-13 | 3.772 |
| 2016-09-14 | 3.786 |
| 2016-09-15 | 3.779 |
| 2016-09-16 | 3.762 |
| 2016-09-19 | 3.775 |
| 2016-09-20 | 3.776 |
| 2016-09-21 | 3.778 |
| 2016-09-22 | 3.759 |
| 2016-09-23 | 3.76 |
| 2016-09-26 | 3.765 |
| 2016-09-27 | 3.746 |
| 2016-09-28 | 3.758 |
| 2016-09-29 | 3.755 |
| 2016-09-30 | 3.758 |
| 2016-10-05 | 3.778 |
| 2016-10-06 | 3.778 |
| 2016-10-07 | 3.794 |
| 2016-10-10 | 3.791 |
| 2016-10-13 | 3.814 |
| 2016-10-14 | 3.815 |
| 2016-10-18 | 3.817 |
| 2016-10-19 | 3.819 |
| 2016-10-20 | 3.835 |
| 2016-10-21 | 3.848 |
| 2016-10-25 | 3.85 |
| 2016-10-26 | 3.841 |
| 2016-10-27 | 3.841 |
| 2016-10-28 | 3.856 |
| 2016-10-31 | 3.849 |
| 2016-11-01 | 3.827 |
| 2016-11-02 | 3.811 |
| 2016-11-03 | 3.815 |
| 2016-11-04 | 3.807 |
| 2016-11-07 | 3.812 |
| 2016-11-08 | 3.814 |
| 2016-11-09 | 3.799 |
| 2016-11-10 | 3.842 |
| 2016-11-11 | 3.844 |
| 2016-11-14 | 3.852 |
| 2016-11-15 | 3.844 |
| 2016-11-16 | 3.858 |
| 2016-11-17 | 3.853 |
| 2016-11-18 | 3.873 |
| 2016-11-21 | 3.867 |
| 2016-11-22 | 3.866 |
| 2016-11-23 | 3.868 |
| 2016-11-24 | 3.876 |
| 2016-11-25 | 3.871 |
| 2016-11-28 | 3.857 |
| 2016-11-29 | 3.848 |
| 2016-11-30 | 3.839 |
| 2016-12-01 | 3.833 |
| 2016-12-02 | 3.827 |
| 2016-12-05 | 3.817 |
| 2016-12-06 | 3.809 |
| 2016-12-07 | 3.802 |
| 2016-12-08 | 3.787 |
| 2016-12-09 | 3.818 |
| 2016-12-12 | 3.822 |
| 2016-12-13 | 3.81 |
| 2016-12-14 | 3.802 |
| 2016-12-15 | 3.843 |
| 2016-12-16 | 3.85 |
| 2016-12-19 | 3.867 |
| 2016-12-20 | 3.856 |
| 2016-12-21 | 3.83 |
| 2016-12-22 | 3.817 |
| 2016-12-23 | 3.819 |
| 2016-12-27 | 3.85 |
| 2016-12-28 | 3.855 |
| 2016-12-29 | 3.844 |
| 2016-12-30 | 3.845 |
| 2017-01-03 | 3.86 |
| 2017-01-04 | 3.857 |
| 2017-01-05 | 3.853 |
| 2017-01-06 | 3.843 |
| 2017-01-09 | 3.849 |
| 2017-01-10 | 3.845 |
| 2017-01-11 | 3.852 |
| 2017-01-12 | 3.825 |
| 2017-01-13 | 3.818 |
| 2017-01-16 | 3.826 |
| 2017-01-17 | 3.817 |
| 2017-01-18 | 3.81 |
| 2017-01-19 | 3.81 |
| 2017-01-20 | 3.811 |
| 2017-01-23 | 3.798 |
| 2017-01-24 | 3.787 |
| 2017-01-25 | 3.786 |
| 2017-01-26 | 3.783 |
| 2017-01-27 | 3.798 |
| 2017-01-30 | 3.785 |
| 2017-01-31 | 3.769 |
| 2017-02-01 | 3.768 |
| 2017-02-02 | 3.762 |
| 2017-02-03 | 3.76 |
| 2017-02-06 | 3.747 |
| 2017-02-07 | 3.753 |
| 2017-02-08 | 3.754 |
| 2017-02-09 | 3.749 |
| 2017-02-10 | 3.747 |
| 2017-02-13 | 3.748 |
| 2017-02-14 | 3.746 |
| 2017-02-15 | 3.747 |
| 2017-02-16 | 3.716 |
| 2017-02-17 | 3.716 |
| 2017-02-20 | 3.707 |
| 2017-02-21 | 3.707 |
| 2017-02-22 | 3.71 |
| 2017-02-23 | 3.708 |
| 2017-02-24 | 3.698 |
| 2017-02-27 | 3.679 |
| 2017-02-28 | 3.659 |
| 2017-03-01 | 3.632 |
| 2017-03-02 | 3.688 |
| 2017-03-03 | 3.693 |
| 2017-03-06 | 3.679 |
| 2017-03-07 | 3.677 |
| 2017-03-08 | 3.684 |
| 2017-03-09 | 3.688 |
| 2017-03-10 | 3.678 |
| 2017-03-14 | 3.661 |
| 2017-03-15 | 3.658 |
| 2017-03-16 | 3.631 |
| 2017-03-17 | 3.63 |
| 2017-03-20 | 3.619 |
| 2017-03-21 | 3.614 |
| 2017-03-22 | 3.656 |
| 2017-03-23 | 3.645 |
| 2017-03-24 | 3.646 |
| 2017-03-27 | 3.618 |
| 2017-03-28 | 3.616 |
| 2017-03-29 | 3.625 |
| 2017-03-30 | 3.615 |
| 2017-03-31 | 3.632 |
| 2017-04-03 | 3.628 |
| 2017-04-04 | 3.646 |
| 2017-04-05 | 3.653 |
| 2017-04-06 | 3.648 |
| 2017-04-07 | 3.649 |
| 2017-04-12 | 3.654 |
| 2017-04-13 | 3.647 |
| 2017-04-18 | 3.665 |
| 2017-04-19 | 3.667 |
| 2017-04-20 | 3.664 |
| 2017-04-21 | 3.681 |
| 2017-04-24 | 3.649 |
| 2017-04-25 | 3.648 |
| 2017-04-26 | 3.634 |
| 2017-04-27 | 3.643 |
| 2017-04-28 | 3.619 |
| 2017-05-03 | 3.613 |
| 2017-05-04 | 3.616 |
| 2017-05-05 | 3.61 |
| 2017-05-08 | 3.604 |
| 2017-05-09 | 3.603 |
| 2017-05-10 | 3.605 |
| 2017-05-11 | 3.61 |
| 2017-05-12 | 3.61 |
| 2017-05-15 | 3.598 |
| 2017-05-16 | 3.606 |
| 2017-05-17 | 3.603 |
| 2017-05-18 | 3.605 |
| 2017-05-19 | 3.593 |
| 2017-05-22 | 3.582 |
| 2017-05-23 | 3.589 |
| 2017-05-24 | 3.593 |
| 2017-05-25 | 3.576 |
| 2017-05-26 | 3.574 |
| 2017-05-30 | 3.561 |
| 2017-06-01 | 3.549 |
| 2017-06-02 | 3.558 |
| 2017-06-05 | 3.548 |
| 2017-06-06 | 3.545 |
| 2017-06-07 | 3.546 |
| 2017-06-08 | 3.539 |
| 2017-06-09 | 3.532 |
| 2017-06-12 | 3.533 |
| 2017-06-13 | 3.533 |
| 2017-06-14 | 3.529 |
| 2017-06-15 | 3.521 |
| 2017-06-16 | 3.527 |
| 2017-06-19 | 3.52 |
| 2017-06-20 | 3.533 |
| 2017-06-21 | 3.543 |
| 2017-06-22 | 3.543 |
| 2017-06-23 | 3.541 |
| 2017-06-26 | 3.536 |
| 2017-06-27 | 3.518 |
| 2017-06-28 | 3.521 |
| 2017-06-29 | 3.49 |
| 2017-06-30 | 3.496 |
| 2017-07-03 | 3.493 |
| 2017-07-04 | 3.514 |
| 2017-07-05 | 3.522 |
| 2017-07-06 | 3.53 |
| 2017-07-07 | 3.528 |
| 2017-07-10 | 3.547 |
| 2017-07-11 | 3.576 |
| 2017-07-12 | 3.554 |
| 2017-07-13 | 3.534 |
| 2017-07-14 | 3.538 |
| 2017-07-17 | 3.545 |
| 2017-07-18 | 3.565 |
| 2017-07-19 | 3.588 |
| 2017-07-20 | 3.574 |
| 2017-07-21 | 3.557 |
| 2017-07-24 | 3.59 |
| 2017-07-25 | 3.569 |
| 2017-07-26 | 3.57 |
| 2017-07-27 | 3.557 |
| 2017-07-28 | 3.56 |
| 2017-07-31 | 3.558 |
| 2017-08-02 | 3.579 |
| 2017-08-03 | 3.589 |
| 2017-08-04 | 3.607 |
| 2017-08-07 | 3.621 |
| 2017-08-08 | 3.605 |
| 2017-08-09 | 3.601 |
| 2017-08-10 | 3.6 |
| 2017-08-11 | 3.586 |
| 2017-08-14 | 3.583 |
| 2017-08-15 | 3.589 |
| 2017-08-16 | 3.628 |
| 2017-08-17 | 3.627 |
| 2017-08-18 | 3.624 |
| 2017-08-21 | 3.622 |
| 2017-08-22 | 3.623 |
| 2017-08-23 | 3.618 |
| 2017-08-24 | 3.599 |
| 2017-08-25 | 3.596 |
| 2017-08-28 | 3.581 |
| 2017-08-29 | 3.577 |
| 2017-08-30 | 3.574 |
| 2017-08-31 | 3.596 |
| 2017-09-01 | 3.584 |
| 2017-09-04 | 3.583 |
| 2017-09-05 | 3.568 |
| 2017-09-06 | 3.562 |
| 2017-09-07 | 3.528 |
| 2017-09-08 | 3.504 |
| 2017-09-11 | 3.521 |
| 2017-09-12 | 3.536 |
| 2017-09-13 | 3.537 |
| 2017-09-14 | 3.538 |
| 2017-09-15 | 3.523 |
| 2017-09-18 | 3.522 |
| 2017-09-19 | 3.515 |
| 2017-09-25 | 3.512 |
| 2017-09-26 | 3.527 |
| 2017-09-27 | 3.546 |
| 2017-09-28 | 3.529 |
| 2017-10-02 | 3.542 |
| 2017-10-03 | 3.531 |
| 2017-10-04 | 3.522 |
| 2017-10-06 | 3.52 |
| 2017-10-09 | 3.51 |
| 2017-10-10 | 3.505 |
| 2017-10-11 | 3.506 |
| 2017-10-13 | 3.501 |
| 2017-10-16 | 3.496 |
| 2017-10-17 | 3.509 |
| 2017-10-18 | 3.514 |
| 2017-10-19 | 3.501 |
| 2017-10-20 | 3.493 |
| 2017-10-23 | 3.491 |
| 2017-10-24 | 3.501 |
| 2017-10-25 | 3.512 |
| 2017-10-26 | 3.51 |
| 2017-10-27 | 3.535 |
| 2017-10-30 | 3.528 |
| 2017-10-31 | 3.521 |
| 2017-11-01 | 3.513 |
| 2017-11-02 | 3.506 |
| 2017-11-03 | 3.513 |
| 2017-11-06 | 3.513 |
| 2017-11-07 | 3.516 |
| 2017-11-08 | 3.513 |
| 2017-11-09 | 3.513 |
| 2017-11-10 | 3.529 |
| 2017-11-13 | 3.543 |
| 2017-11-14 | 3.544 |
| 2017-11-15 | 3.532 |
| 2017-11-16 | 3.523 |
| 2017-11-17 | 3.519 |
| 2017-11-20 | 3.516 |
| 2017-11-21 | 3.529 |
| 2017-11-22 | 3.525 |
| 2017-11-23 | 3.512 |
| 2017-11-24 | 3.513 |
| 2017-11-27 | 3.501 |
| 2017-11-28 | 3.503 |
| 2017-11-29 | 3.504 |
| 2017-11-30 | 3.499 |
| 2017-12-01 | 3.488 |
| 2017-12-04 | 3.49 |
| 2017-12-05 | 3.492 |
| 2017-12-06 | 3.513 |
| 2017-12-07 | 3.516 |
| 2017-12-08 | 3.521 |
| 2017-12-11 | 3.519 |
| 2017-12-12 | 3.539 |
| 2017-12-13 | 3.55 |
| 2017-12-14 | 3.528 |
| 2017-12-15 | 3.523 |
| 2017-12-18 | 3.513 |
| 2017-12-19 | 3.498 |
| 2017-12-20 | 3.499 |
| 2017-12-21 | 3.489 |
| 2017-12-22 | 3.485 |
| 2017-12-26 | 3.488 |
| 2017-12-27 | 3.479 |
| 2017-12-28 | 3.472 |
| 2017-12-29 | 3.467 |
| 2018-01-02 | 3.457 |
| 2018-01-03 | 3.46 |
| 2018-01-04 | 3.448 |
| 2018-01-05 | 3.446 |
| 2018-01-08 | 3.441 |
| 2018-01-09 | 3.444 |
| 2018-01-10 | 3.429 |
| 2018-01-11 | 3.423 |
| 2018-01-12 | 3.415 |
| 2018-01-15 | 3.4 |
| 2018-01-16 | 3.41 |
| 2018-01-17 | 3.452 |
| 2018-01-18 | 3.427 |
| 2018-01-19 | 3.406 |
| 2018-01-22 | 3.421 |
| 2018-01-23 | 3.422 |
| 2018-01-24 | 3.406 |
| 2018-01-25 | 3.403 |
| 2018-01-26 | 3.388 |
| 2018-01-29 | 3.409 |
| 2018-01-30 | 3.399 |
| 2018-01-31 | 3.405 |
| 2018-02-01 | 3.427 |
| 2018-02-02 | 3.43 |
| 2018-02-05 | 3.442 |
| 2018-02-06 | 3.485 |
| 2018-02-07 | 3.486 |
| 2018-02-08 | 3.499 |
| 2018-02-09 | 3.516 |
| 2018-02-12 | 3.524 |
| 2018-02-13 | 3.527 |
| 2018-02-14 | 3.533 |
| 2018-02-15 | 3.525 |
| 2018-02-16 | 3.535 |
| 2018-02-19 | 3.521 |
| 2018-02-20 | 3.498 |
| 2018-02-21 | 3.501 |
| 2018-02-22 | 3.497 |
| 2018-02-23 | 3.485 |
| 2018-02-26 | 3.494 |
| 2018-02-27 | 3.478 |
| 2018-02-28 | 3.485 |
| 2018-03-05 | 3.456 |
| 2018-03-06 | 3.469 |
| 2018-03-07 | 3.466 |
| 2018-03-08 | 3.459 |
| 2018-03-09 | 3.453 |
| 2018-03-12 | 3.44 |
| 2018-03-13 | 3.444 |
| 2018-03-14 | 3.431 |
| 2018-03-15 | 3.434 |
| 2018-03-16 | 3.452 |
| 2018-03-19 | 3.468 |
| 2018-03-20 | 3.479 |
| 2018-03-21 | 3.495 |
| 2018-03-22 | 3.48 |
| 2018-03-23 | 3.491 |
| 2018-03-26 | 3.491 |
| 2018-03-27 | 3.487 |
| 2018-03-28 | 3.499 |
| 2018-03-29 | 3.514 |
| 2018-04-03 | 3.518 |
| 2018-04-04 | 3.528 |
| 2018-04-05 | 3.537 |
| 2018-04-09 | 3.532 |
| 2018-04-10 | 3.506 |
| 2018-04-11 | 3.518 |
| 2018-04-12 | 3.518 |
| 2018-04-13 | 3.506 |
| 2018-04-16 | 3.503 |
| 2018-04-17 | 3.527 |
| 2018-04-18 | 3.519 |
| 2018-04-20 | 3.523 |
| 2018-04-23 | 3.544 |
| 2018-04-24 | 3.561 |
| 2018-04-25 | 3.59 |
| 2018-04-26 | 3.579 |
| 2018-04-27 | 3.597 |
| 2018-04-30 | 3.588 |
| 2018-05-01 | 3.616 |
| 2018-05-02 | 3.61 |
| 2018-05-03 | 3.632 |
| 2018-05-04 | 3.622 |
| 2018-05-07 | 3.625 |
| 2018-05-08 | 3.602 |
| 2018-05-09 | 3.6 |
| 2018-05-10 | 3.583 |
| 2018-05-11 | 3.569 |
| 2018-05-14 | 3.574 |
| 2018-05-15 | 3.599 |
| 2018-05-16 | 3.593 |
| 2018-05-17 | 3.587 |
| 2018-05-18 | 3.589 |
| 2018-05-21 | 3.584 |
| 2018-05-22 | 3.564 |
| 2018-05-23 | 3.58 |
| 2018-05-24 | 3.569 |
| 2018-05-25 | 3.568 |
| 2018-05-29 | 3.594 |
| 2018-05-30 | 3.577 |
| 2018-05-31 | 3.566 |
| 2018-06-01 | 3.565 |
| 2018-06-04 | 3.566 |
| 2018-06-05 | 3.575 |
| 2018-06-06 | 3.566 |
| 2018-06-07 | 3.57 |
| 2018-06-08 | 3.574 |
| 2018-06-11 | 3.572 |
| 2018-06-12 | 3.578 |
| 2018-06-13 | 3.587 |
| 2018-06-14 | 3.596 |
| 2018-06-15 | 3.605 |
| 2018-06-18 | 3.626 |
| 2018-06-19 | 3.644 |
| 2018-06-20 | 3.639 |
| 2018-06-21 | 3.623 |
| 2018-06-22 | 3.617 |
| 2018-06-25 | 3.616 |
| 2018-06-26 | 3.631 |
| 2018-06-27 | 3.646 |
| 2018-06-28 | 3.649 |
| 2018-06-29 | 3.65 |
| 2018-07-02 | 3.661 |
| 2018-07-03 | 3.655 |
| 2018-07-04 | 3.657 |
| 2018-07-05 | 3.626 |
| 2018-07-06 | 3.636 |
| 2018-07-09 | 3.618 |
| 2018-07-10 | 3.642 |
| 2018-07-11 | 3.638 |
| 2018-07-12 | 3.652 |
| 2018-07-13 | 3.643 |
| 2018-07-16 | 3.641 |
| 2018-07-17 | 3.631 |
| 2018-07-18 | 3.642 |
| 2018-07-19 | 3.649 |
| 2018-07-20 | 3.647 |
| 2018-07-23 | 3.633 |
| 2018-07-24 | 3.649 |
| 2018-07-25 | 3.641 |
| 2018-07-26 | 3.638 |
| 2018-07-27 | 3.667 |
| 2018-07-30 | 3.667 |
| 2018-07-31 | 3.664 |
| 2018-08-01 | 3.677 |
| 2018-08-02 | 3.689 |
| 2018-08-03 | 3.7 |
| 2018-08-06 | 3.71 |
| 2018-08-07 | 3.695 |
| 2018-08-08 | 3.684 |
| 2018-08-09 | 3.683 |
| 2018-08-10 | 3.694 |
| 2018-08-13 | 3.709 |
| 2018-08-14 | 3.691 |
| 2018-08-15 | 3.693 |
| 2018-08-16 | 3.688 |
| 2018-08-17 | 3.669 |
| 2018-08-20 | 3.662 |
| 2018-08-21 | 3.655 |
| 2018-08-22 | 3.635 |
| 2018-08-23 | 3.635 |
| 2018-08-24 | 3.639 |
| 2018-08-27 | 3.639 |
| 2018-08-28 | 3.624 |
| 2018-08-29 | 3.643 |
| 2018-08-30 | 3.61 |
| 2018-08-31 | 3.604 |
| 2018-09-03 | 3.615 |
| 2018-09-04 | 3.625 |
| 2018-09-05 | 3.619 |
| 2018-09-06 | 3.595 |
| 2018-09-07 | 3.581 |
| 2018-09-12 | 3.588 |
| 2018-09-13 | 3.575 |
| 2018-09-14 | 3.564 |
| 2018-09-17 | 3.583 |
| 2018-09-20 | 3.583 |
| 2018-09-21 | 3.573 |
| 2018-09-25 | 3.582 |
| 2018-09-26 | 3.579 |
| 2018-09-27 | 3.599 |
| 2018-09-28 | 3.627 |
| 2018-10-02 | 3.65 |
| 2018-10-03 | 3.64 |
| 2018-10-04 | 3.64 |
| 2018-10-05 | 3.633 |
| 2018-10-08 | 3.62 |
| 2018-10-09 | 3.642 |
| 2018-10-10 | 3.626 |
| 2018-10-11 | 3.635 |
| 2018-10-12 | 3.628 |
| 2018-10-15 | 3.628 |
| 2018-10-16 | 3.645 |
| 2018-10-17 | 3.649 |
| 2018-10-18 | 3.652 |
| 2018-10-19 | 3.667 |
| 2018-10-22 | 3.651 |
| 2018-10-23 | 3.67 |
| 2018-10-24 | 3.68 |
| 2018-10-25 | 3.693 |
| 2018-10-26 | 3.701 |
| 2018-10-29 | 3.704 |
| 2018-10-31 | 3.721 |
| 2018-11-01 | 3.706 |
| 2018-11-02 | 3.691 |
| 2018-11-05 | 3.7 |
| 2018-11-06 | 3.691 |
| 2018-11-07 | 3.668 |
| 2018-11-08 | 3.673 |
| 2018-11-09 | 3.683 |
| 2018-11-12 | 3.676 |
| 2018-11-13 | 3.689 |
| 2018-11-14 | 3.698 |
| 2018-11-15 | 3.695 |
| 2018-11-16 | 3.717 |
| 2018-11-19 | 3.708 |
| 2018-11-20 | 3.716 |
| 2018-11-21 | 3.743 |
| 2018-11-22 | 3.728 |
| 2018-11-23 | 3.737 |
| 2018-11-26 | 3.729 |
| 2018-11-27 | 3.728 |
| 2018-11-28 | 3.733 |
| 2018-11-29 | 3.71 |
| 2018-11-30 | 3.701 |
| 2018-12-03 | 3.718 |
| 2018-12-04 | 3.727 |
| 2018-12-05 | 3.724 |
| 2018-12-06 | 3.731 |
| 2018-12-07 | 3.738 |
| 2018-12-10 | 3.727 |
| 2018-12-11 | 3.748 |
| 2018-12-12 | 3.746 |
| 2018-12-13 | 3.753 |
| 2018-12-14 | 3.771 |
| 2018-12-17 | 3.778 |
| 2018-12-18 | 3.763 |
| 2018-12-19 | 3.756 |
| 2018-12-20 | 3.757 |
| 2018-12-21 | 3.773 |
| 2018-12-24 | 3.774 |
| 2018-12-26 | 3.774 |
| 2018-12-27 | 3.781 |
| 2018-12-28 | 3.771 |
| 2018-12-31 | 3.748 |
| 2019-01-02 | 3.746 |
| 2019-01-03 | 3.742 |
| 2019-01-04 | 3.72 |
| 2019-01-07 | 3.694 |
| 2019-01-08 | 3.699 |
| 2019-01-09 | 3.682 |
| 2019-01-10 | 3.664 |
| 2019-01-11 | 3.673 |
| 2019-01-14 | 3.657 |
| 2019-01-15 | 3.67 |
| 2019-01-16 | 3.678 |
| 2019-01-17 | 3.688 |
| 2019-01-18 | 3.692 |
| 2019-01-21 | 3.698 |
| 2019-01-22 | 3.69 |
| 2019-01-23 | 3.683 |
| 2019-01-24 | 3.683 |
| 2019-01-25 | 3.685 |
| 2019-01-28 | 3.68 |
| 2019-01-29 | 3.678 |
| 2019-01-30 | 3.671 |
| 2019-01-31 | 3.642 |
| 2019-02-01 | 3.633 |
| 2019-02-04 | 3.627 |
| 2019-02-05 | 3.61 |
| 2019-02-06 | 3.619 |
| 2019-02-07 | 3.627 |
| 2019-02-08 | 3.634 |
| 2019-02-11 | 3.643 |
| 2019-02-12 | 3.643 |
| 2019-02-13 | 3.637 |
| 2019-02-14 | 3.662 |
| 2019-02-15 | 3.641 |
| 2019-02-18 | 3.62 |
| 2019-02-19 | 3.631 |
| 2019-02-20 | 3.617 |
| 2019-02-21 | 3.617 |
| 2019-02-22 | 3.613 |
| 2019-02-25 | 3.605 |
| 2019-02-26 | 3.624 |
| 2019-02-27 | 3.619 |
| 2019-02-28 | 3.604 |
| 2019-03-01 | 3.624 |
| 2019-03-04 | 3.625 |
| 2019-03-05 | 3.619 |
| 2019-03-06 | 3.616 |
| 2019-03-07 | 3.616 |
| 2019-03-08 | 3.631 |
| 2019-03-11 | 3.621 |
| 2019-03-12 | 3.623 |
| 2019-03-13 | 3.617 |
| 2019-03-14 | 3.6 |
| 2019-03-15 | 3.604 |
| 2019-03-18 | 3.601 |
| 2019-03-19 | 3.606 |
| 2019-03-20 | 3.608 |
| 2019-03-25 | 3.623 |
| 2019-03-26 | 3.617 |
| 2019-03-27 | 3.635 |
| 2019-03-28 | 3.636 |
| 2019-03-29 | 3.632 |
| 2019-04-01 | 3.626 |
| 2019-04-02 | 3.624 |
| 2019-04-03 | 3.6 |
| 2019-04-04 | 3.603 |
| 2019-04-05 | 3.587 |
| 2019-04-08 | 3.58 |
| 2019-04-10 | 3.578 |
| 2019-04-11 | 3.583 |
| 2019-04-12 | 3.578 |
| 2019-04-15 | 3.561 |
| 2019-04-16 | 3.558 |
| 2019-04-17 | 3.575 |
| 2019-04-18 | 3.589 |
| 2019-04-23 | 3.593 |
| 2019-04-24 | 3.614 |
| 2019-04-25 | 3.628 |
| 2019-04-29 | 3.618 |
| 2019-04-30 | 3.608 |
| 2019-05-01 | 3.586 |
| 2019-05-02 | 3.598 |
| 2019-05-03 | 3.601 |
| 2019-05-06 | 3.591 |
| 2019-05-07 | 3.585 |
| 2019-05-08 | 3.584 |
| 2019-05-10 | 3.567 |
| 2019-05-13 | 3.568 |
| 2019-05-14 | 3.577 |
| 2019-05-15 | 3.571 |
| 2019-05-16 | 3.568 |
| 2019-05-17 | 3.575 |
| 2019-05-20 | 3.573 |
| 2019-05-21 | 3.598 |
| 2019-05-22 | 3.611 |
| 2019-05-23 | 3.615 |
| 2019-05-24 | 3.605 |
| 2019-05-28 | 3.614 |
| 2019-05-29 | 3.617 |
| 2019-05-30 | 3.62 |
| 2019-05-31 | 3.634 |
| 2019-06-03 | 3.633 |
| 2019-06-04 | 3.612 |
| 2019-06-05 | 3.61 |
| 2019-06-06 | 3.601 |
| 2019-06-07 | 3.601 |
| 2019-06-10 | 3.585 |
| 2019-06-11 | 3.581 |
| 2019-06-12 | 3.582 |
| 2019-06-13 | 3.592 |
| 2019-06-14 | 3.6 |
| 2019-06-17 | 3.61 |
| 2019-06-18 | 3.612 |
| 2019-06-19 | 3.609 |
| 2019-06-20 | 3.579 |
| 2019-06-21 | 3.594 |
| 2019-06-24 | 3.604 |
| 2019-06-25 | 3.602 |
| 2019-06-26 | 3.591 |
| 2019-06-27 | 3.582 |
| 2019-06-28 | 3.566 |
| 2019-07-01 | 3.574 |
| 2019-07-02 | 3.575 |
| 2019-07-03 | 3.572 |
| 2019-07-04 | 3.567 |
| 2019-07-05 | 3.562 |
| 2019-07-08 | 3.573 |
| 2019-07-09 | 3.568 |
| 2019-07-10 | 3.573 |
| 2019-07-11 | 3.547 |
| 2019-07-12 | 3.551 |
| 2019-07-15 | 3.539 |
| 2019-07-16 | 3.542 |
| 2019-07-17 | 3.541 |
| 2019-07-18 | 3.543 |
| 2019-07-19 | 3.535 |
| 2019-07-22 | 3.534 |
| 2019-07-23 | 3.537 |
| 2019-07-24 | 3.521 |
| 2019-07-25 | 3.523 |
| 2019-07-26 | 3.526 |
| 2019-07-29 | 3.525 |
| 2019-07-30 | 3.5 |
| 2019-07-31 | 3.499 |
| 2019-08-01 | 3.524 |
| 2019-08-02 | 3.509 |
| 2019-08-05 | 3.494 |
| 2019-08-06 | 3.494 |
| 2019-08-07 | 3.487 |
| 2019-08-08 | 3.483 |
| 2019-08-09 | 3.479 |
| 2019-08-12 | 3.484 |
| 2019-08-13 | 3.493 |
| 2019-08-14 | 3.489 |
| 2019-08-15 | 3.519 |
| 2019-08-16 | 3.541 |
| 2019-08-19 | 3.545 |
| 2019-08-20 | 3.524 |
| 2019-08-21 | 3.527 |
| 2019-08-22 | 3.525 |
| 2019-08-23 | 3.511 |
| 2019-08-26 | 3.519 |
| 2019-08-27 | 3.52 |
| 2019-08-28 | 3.524 |
| 2019-08-29 | 3.521 |
| 2019-08-30 | 3.535 |
| 2019-09-02 | 3.538 |
| 2019-09-03 | 3.549 |
| 2019-09-04 | 3.527 |
| 2019-09-05 | 3.512 |
| 2019-09-06 | 3.517 |
| 2019-09-09 | 3.527 |
| 2019-09-10 | 3.538 |
| 2019-09-11 | 3.544 |
| 2019-09-12 | 3.541 |
| 2019-09-13 | 3.527 |
| 2019-09-16 | 3.538 |
| 2019-09-18 | 3.541 |
| 2019-09-19 | 3.521 |
| 2019-09-20 | 3.513 |
| 2019-09-23 | 3.517 |
| 2019-09-24 | 3.507 |
| 2019-09-25 | 3.501 |
| 2019-09-26 | 3.517 |
| 2019-09-27 | 3.482 |
| 2019-10-02 | 3.485 |
| 2019-10-03 | 3.493 |
| 2019-10-04 | 3.481 |
| 2019-10-07 | 3.493 |
| 2019-10-10 | 3.504 |
| 2019-10-11 | 3.51 |
| 2019-10-15 | 3.513 |
| 2019-10-16 | 3.536 |
| 2019-10-17 | 3.545 |
| 2019-10-18 | 3.533 |
| 2019-10-22 | 3.537 |
| 2019-10-23 | 3.538 |
| 2019-10-24 | 3.523 |
| 2019-10-25 | 3.539 |
| 2019-10-28 | 3.529 |
| 2019-10-29 | 3.53 |
| 2019-10-30 | 3.528 |
| 2019-10-31 | 3.529 |
| 2019-11-01 | 3.521 |
| 2019-11-04 | 3.522 |
| 2019-11-05 | 3.501 |
| 2019-11-06 | 3.49 |
| 2019-11-07 | 3.487 |
| 2019-11-08 | 3.495 |
| 2019-11-11 | 3.499 |
| 2019-11-12 | 3.511 |
| 2019-11-13 | 3.495 |
| 2019-11-14 | 3.488 |
| 2019-11-15 | 3.478 |
| 2019-11-18 | 3.463 |
| 2019-11-19 | 3.457 |
| 2019-11-20 | 3.471 |
| 2019-11-21 | 3.455 |
| 2019-11-22 | 3.46 |
| 2019-11-25 | 3.461 |
| 2019-11-26 | 3.463 |
| 2019-11-27 | 3.471 |
| 2019-11-28 | 3.471 |
| 2019-11-29 | 3.476 |
| 2019-12-02 | 3.474 |
| 2019-12-03 | 3.481 |
| 2019-12-04 | 3.471 |
| 2019-12-05 | 3.467 |
| 2019-12-06 | 3.463 |
| 2019-12-09 | 3.471 |
| 2019-12-10 | 3.465 |
| 2019-12-11 | 3.477 |
| 2019-12-12 | 3.481 |
| 2019-12-13 | 3.476 |
| 2019-12-16 | 3.498 |
| 2019-12-17 | 3.492 |
| 2019-12-18 | 3.501 |
| 2019-12-19 | 3.493 |
| 2019-12-20 | 3.477 |
| 2019-12-23 | 3.472 |
| 2019-12-24 | 3.466 |
| 2019-12-26 | 3.472 |
| 2019-12-27 | 3.468 |
| 2019-12-30 | 3.463 |
| 2019-12-31 | 3.456 |
| 2020-01-02 | 3.452 |
| 2020-01-03 | 3.467 |
| 2020-01-06 | 3.475 |
| 2020-01-07 | 3.467 |
| 2020-01-08 | 3.465 |
| 2020-01-09 | 3.471 |
| 2020-01-10 | 3.473 |
| 2020-01-13 | 3.47 |
| 2020-01-14 | 3.47 |
| 2020-01-15 | 3.459 |
| 2020-01-16 | 3.456 |
| 2020-01-17 | 3.454 |
| 2020-01-20 | 3.456 |
| 2020-01-21 | 3.455 |
| 2020-01-22 | 3.452 |
| 2020-01-23 | 3.458 |
| 2020-01-24 | 3.455 |
| 2020-01-27 | 3.458 |
| 2020-01-28 | 3.455 |
| 2020-01-29 | 3.458 |
| 2020-01-30 | 3.45 |
| 2020-01-31 | 3.448 |
| 2020-02-03 | 3.446 |
| 2020-02-04 | 3.448 |
| 2020-02-05 | 3.452 |
| 2020-02-06 | 3.439 |
| 2020-02-07 | 3.426 |
| 2020-02-10 | 3.422 |
| 2020-02-11 | 3.419 |
| 2020-02-12 | 3.423 |
| 2020-02-13 | 3.431 |
| 2020-02-14 | 3.434 |
| 2020-02-17 | 3.428 |
| 2020-02-18 | 3.416 |
| 2020-02-19 | 3.424 |
| 2020-02-20 | 3.432 |
| 2020-02-21 | 3.424 |
| 2020-02-24 | 3.437 |
| 2020-02-25 | 3.429 |
| 2020-02-26 | 3.442 |
| 2020-02-27 | 3.434 |
| 2020-02-28 | 3.467 |
| 2020-03-03 | 3.461 |
| 2020-03-04 | 3.46 |
| 2020-03-05 | 3.466 |
| 2020-03-06 | 3.486 |
| 2020-03-09 | 3.508 |
| 2020-03-12 | 3.639 |
| 2020-03-13 | 3.652 |
| 2020-03-16 | 3.728 |
| 2020-03-17 | 3.862 |
| 2020-03-18 | 3.827 |
| 2020-03-19 | 3.683 |
| 2020-03-20 | 3.597 |
| 2020-03-23 | 3.698 |
| 2020-03-24 | 3.658 |
| 2020-03-25 | 3.642 |
| 2020-03-26 | 3.624 |
| 2020-03-27 | 3.598 |
| 2020-03-30 | 3.586 |
| 2020-03-31 | 3.565 |
| 2020-04-01 | 3.556 |
| 2020-04-02 | 3.63 |
| 2020-04-03 | 3.636 |
| 2020-04-06 | 3.627 |
| 2020-04-07 | 3.604 |
| 2020-04-14 | 3.579 |
| 2020-04-16 | 3.594 |
| 2020-04-17 | 3.591 |
| 2020-04-20 | 3.58 |
| 2020-04-21 | 3.552 |
| 2020-04-22 | 3.541 |
| 2020-04-23 | 3.557 |
| 2020-04-24 | 3.524 |
| 2020-04-27 | 3.515 |
| 2020-04-28 | 3.499 |
| 2020-04-30 | 3.5 |
| 2020-05-01 | 3.491 |
| 2020-05-04 | 3.527 |
| 2020-05-05 | 3.524 |
| 2020-05-06 | 3.511 |
| 2020-05-07 | 3.516 |
| 2020-05-11 | 3.518 |
| 2020-05-12 | 3.507 |
| 2020-05-13 | 3.511 |
| 2020-05-14 | 3.546 |
| 2020-05-15 | 3.533 |
| 2020-05-18 | 3.543 |
| 2020-05-19 | 3.525 |
| 2020-05-20 | 3.504 |
| 2020-05-21 | 3.514 |
| 2020-05-22 | 3.529 |
| 2020-05-26 | 3.515 |
| 2020-05-27 | 3.499 |
| 2020-05-28 | 3.502 |
| 2020-06-01 | 3.509 |
| 2020-06-02 | 3.484 |
| 2020-06-03 | 3.468 |
| 2020-06-04 | 3.479 |
| 2020-06-05 | 3.455 |
| 2020-06-08 | 3.462 |
| 2020-06-09 | 3.457 |
| 2020-06-10 | 3.447 |
| 2020-06-11 | 3.451 |
| 2020-06-12 | 3.464 |
| 2020-06-15 | 3.495 |
| 2020-06-16 | 3.472 |
| 2020-06-17 | 3.456 |
| 2020-06-18 | 3.451 |
| 2020-06-19 | 3.447 |
| 2020-06-22 | 3.446 |
| 2020-06-23 | 3.434 |
| 2020-06-24 | 3.425 |
| 2020-06-25 | 3.442 |
| 2020-06-26 | 3.437 |
| 2020-06-29 | 3.436 |
| 2020-06-30 | 3.466 |
| 2020-07-01 | 3.454 |
| 2020-07-02 | 3.448 |
| 2020-07-03 | 3.434 |
| 2020-07-06 | 3.442 |
| 2020-07-07 | 3.45 |
| 2020-07-08 | 3.455 |
| 2020-07-09 | 3.444 |
| 2020-07-10 | 3.457 |
| 2020-07-13 | 3.442 |
| 2020-07-14 | 3.442 |
| 2020-07-15 | 3.431 |
| 2020-07-16 | 3.427 |
| 2020-07-17 | 3.447 |
| 2020-07-20 | 3.431 |
| 2020-07-21 | 3.421 |
| 2020-07-22 | 3.419 |
| 2020-07-23 | 3.421 |
| 2020-07-24 | 3.42 |
| 2020-07-27 | 3.413 |
| 2020-07-28 | 3.415 |
| 2020-07-29 | 3.409 |
| 2020-07-31 | 3.408 |
| 2020-08-03 | 3.415 |
| 2020-08-04 | 3.424 |
| 2020-08-05 | 3.412 |
| 2020-08-06 | 3.409 |
| 2020-08-07 | 3.409 |
| 2020-08-10 | 3.414 |
| 2020-08-11 | 3.402 |
| 2020-08-12 | 3.406 |
| 2020-08-13 | 3.406 |
| 2020-08-14 | 3.404 |
| 2020-08-17 | 3.409 |
| 2020-08-18 | 3.401 |
| 2020-08-19 | 3.4 |
| 2020-08-20 | 3.402 |
| 2020-08-21 | 3.404 |
| 2020-08-24 | 3.402 |
| 2020-08-25 | 3.4 |
| 2020-08-26 | 3.401 |
| 2020-08-27 | 3.369 |
| 2020-08-28 | 3.368 |
| 2020-08-31 | 3.362 |
| 2020-09-01 | 3.353 |
| 2020-09-02 | 3.366 |
| 2020-09-03 | 3.368 |
| 2020-09-04 | 3.371 |
| 2020-09-07 | 3.378 |
| 2020-09-08 | 3.392 |
| 2020-09-09 | 3.407 |
| 2020-09-10 | 3.414 |
| 2020-09-11 | 3.438 |
| 2020-09-14 | 3.435 |
| 2020-09-15 | 3.422 |
| 2020-09-16 | 3.411 |
| 2020-09-17 | 3.422 |
| 2020-09-21 | 3.442 |
| 2020-09-22 | 3.441 |
| 2020-09-23 | 3.445 |
| 2020-09-24 | 3.478 |
| 2020-09-25 | 3.467 |
| 2020-09-29 | 3.459 |
| 2020-09-30 | 3.441 |
| 2020-10-01 | 3.427 |
| 2020-10-02 | 3.431 |
| 2020-10-05 | 3.422 |
| 2020-10-06 | 3.411 |
| 2020-10-07 | 3.407 |
| 2020-10-08 | 3.394 |
| 2020-10-09 | 3.381 |
| 2020-10-12 | 3.383 |
| 2020-10-13 | 3.386 |
| 2020-10-14 | 3.384 |
| 2020-10-15 | 3.394 |
| 2020-10-16 | 3.383 |
| 2020-10-19 | 3.378 |
| 2020-10-20 | 3.379 |
| 2020-10-21 | 3.385 |
| 2020-10-22 | 3.38 |
| 2020-10-23 | 3.378 |
| 2020-10-26 | 3.381 |
| 2020-10-27 | 3.382 |
| 2020-10-28 | 3.393 |
| 2020-10-29 | 3.41 |
| 2020-10-30 | 3.422 |
| 2020-11-02 | 3.4 |
| 2020-11-03 | 3.416 |
| 2020-11-04 | 3.41 |
| 2020-11-05 | 3.381 |
| 2020-11-06 | 3.377 |
| 2020-11-09 | 3.361 |
| 2020-11-10 | 3.376 |
| 2020-11-11 | 3.386 |
| 2020-11-12 | 3.377 |
| 2020-11-13 | 3.362 |
| 2020-11-16 | 3.356 |
| 2020-11-17 | 3.356 |
| 2020-11-18 | 3.342 |
| 2020-11-19 | 3.351 |
| 2020-11-20 | 3.344 |
| 2020-11-23 | 3.339 |
| 2020-11-24 | 3.341 |
| 2020-11-25 | 3.325 |
| 2020-11-26 | 3.32 |
| 2020-11-27 | 3.319 |
| 2020-11-30 | 3.308 |
| 2020-12-01 | 3.304 |
| 2020-12-02 | 3.289 |
| 2020-12-03 | 3.275 |
| 2020-12-04 | 3.266 |
| 2020-12-07 | 3.273 |
| 2020-12-08 | 3.248 |
| 2020-12-09 | 3.256 |
| 2020-12-10 | 3.251 |
| 2020-12-11 | 3.254 |
| 2020-12-14 | 3.257 |
| 2020-12-15 | 3.255 |
| 2020-12-16 | 3.253 |
| 2020-12-17 | 3.245 |
| 2020-12-18 | 3.241 |
| 2020-12-21 | 3.251 |
| 2020-12-22 | 3.234 |
| 2020-12-23 | 3.222 |
| 2020-12-24 | 3.218 |
| 2020-12-28 | 3.216 |
| 2020-12-29 | 3.212 |
| 2020-12-30 | 3.21 |
| 2020-12-31 | 3.215 |
| 2021-01-04 | 3.206 |
| 2021-01-05 | 3.203 |
| 2021-01-06 | 3.186 |
| 2021-01-07 | 3.182 |
| 2021-01-08 | 3.187 |
| 2021-01-11 | 3.183 |
| 2021-01-12 | 3.159 |
| 2021-01-13 | 3.134 |
| 2021-01-14 | 3.116 |
| 2021-01-15 | 3.231 |
| 2021-01-18 | 3.227 |
| 2021-01-19 | 3.232 |
| 2021-01-20 | 3.254 |